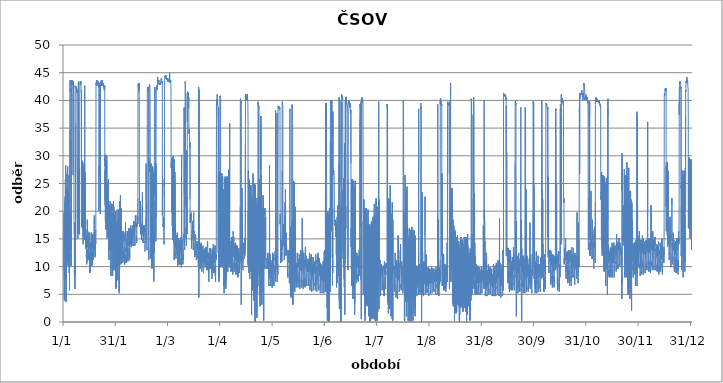
| Category | Series 0 |
|---|---|
| 2012-01-01 01:00:00 | 7.8 |
| 2012-01-01 02:00:00 | 19.76 |
| 2012-01-01 03:00:00 | 9.36 |
| 2012-01-01 04:00:00 | 14.04 |
| 2012-01-01 05:00:00 | 18.46 |
| 2012-01-01 06:00:00 | 3.9 |
| 2012-01-01 07:00:00 | 17.94 |
| 2012-01-01 08:00:00 | 9.88 |
| 2012-01-01 09:00:00 | 10.92 |
| 2012-01-01 10:00:00 | 18.72 |
| 2012-01-01 11:00:00 | 7.54 |
| 2012-01-01 12:00:00 | 17.68 |
| 2012-01-01 13:00:00 | 20.54 |
| 2012-01-01 14:00:00 | 12.22 |
| 2012-01-01 15:00:00 | 21.84 |
| 2012-01-01 16:00:00 | 17.16 |
| 2012-01-01 17:00:00 | 9.88 |
| 2012-01-01 18:00:00 | 22.62 |
| 2012-01-01 19:00:00 | 15.86 |
| 2012-01-01 20:00:00 | 10.66 |
| 2012-01-01 21:00:00 | 25.74 |
| 2012-01-01 22:00:00 | 14.56 |
| 2012-01-01 23:00:00 | 28.08 |
| 2012-01-02 | 28.34 |
| 2012-01-02 01:00:00 | 17.94 |
| 2012-01-02 02:00:00 | 21.58 |
| 2012-01-02 03:00:00 | 7.8 |
| 2012-01-02 04:00:00 | 13.78 |
| 2012-01-02 05:00:00 | 16.64 |
| 2012-01-02 06:00:00 | 3.64 |
| 2012-01-02 07:00:00 | 17.68 |
| 2012-01-02 08:00:00 | 12.48 |
| 2012-01-02 09:00:00 | 8.58 |
| 2012-01-02 10:00:00 | 21.06 |
| 2012-01-02 11:00:00 | 13 |
| 2012-01-02 12:00:00 | 12.22 |
| 2012-01-02 13:00:00 | 23.4 |
| 2012-01-02 14:00:00 | 14.04 |
| 2012-01-02 15:00:00 | 11.96 |
| 2012-01-02 16:00:00 | 22.36 |
| 2012-01-02 17:00:00 | 15.34 |
| 2012-01-02 18:00:00 | 10.92 |
| 2012-01-02 19:00:00 | 24.18 |
| 2012-01-02 20:00:00 | 15.34 |
| 2012-01-02 21:00:00 | 12.48 |
| 2012-01-02 22:00:00 | 26.78 |
| 2012-01-02 23:00:00 | 14.04 |
| 2012-01-03 | 13 |
| 2012-01-03 01:00:00 | 21.58 |
| 2012-01-03 02:00:00 | 11.44 |
| 2012-01-03 03:00:00 | 12.74 |
| 2012-01-03 04:00:00 | 28.08 |
| 2012-01-03 05:00:00 | 28.08 |
| 2012-01-03 06:00:00 | 14.56 |
| 2012-01-03 07:00:00 | 15.08 |
| 2012-01-03 08:00:00 | 21.84 |
| 2012-01-03 09:00:00 | 10.66 |
| 2012-01-03 10:00:00 | 14.3 |
| 2012-01-03 11:00:00 | 21.84 |
| 2012-01-03 12:00:00 | 10.14 |
| 2012-01-03 13:00:00 | 15.08 |
| 2012-01-03 14:00:00 | 22.36 |
| 2012-01-03 15:00:00 | 10.14 |
| 2012-01-03 16:00:00 | 14.04 |
| 2012-01-03 17:00:00 | 21.32 |
| 2012-01-03 18:00:00 | 11.44 |
| 2012-01-03 19:00:00 | 13.78 |
| 2012-01-03 20:00:00 | 23.66 |
| 2012-01-03 21:00:00 | 14.04 |
| 2012-01-03 22:00:00 | 14.3 |
| 2012-01-03 23:00:00 | 26.52 |
| 2012-01-04 | 12.48 |
| 2012-01-04 01:00:00 | 13.26 |
| 2012-01-04 02:00:00 | 19.24 |
| 2012-01-04 03:00:00 | 8.84 |
| 2012-01-04 04:00:00 | 11.7 |
| 2012-01-04 05:00:00 | 17.42 |
| 2012-01-04 06:00:00 | 5.72 |
| 2012-01-04 07:00:00 | 15.34 |
| 2012-01-04 08:00:00 | 17.94 |
| 2012-01-04 09:00:00 | 11.44 |
| 2012-01-04 10:00:00 | 34.58 |
| 2012-01-04 11:00:00 | 42.12 |
| 2012-01-04 12:00:00 | 42.38 |
| 2012-01-04 13:00:00 | 43.68 |
| 2012-01-04 14:00:00 | 42.38 |
| 2012-01-04 15:00:00 | 42.38 |
| 2012-01-04 16:00:00 | 41.86 |
| 2012-01-04 17:00:00 | 41.6 |
| 2012-01-04 18:00:00 | 42.12 |
| 2012-01-04 19:00:00 | 41.86 |
| 2012-01-04 20:00:00 | 41.86 |
| 2012-01-04 21:00:00 | 42.12 |
| 2012-01-04 22:00:00 | 41.86 |
| 2012-01-04 23:00:00 | 28.86 |
| 2012-01-05 | 23.92 |
| 2012-01-05 01:00:00 | 13 |
| 2012-01-05 02:00:00 | 16.12 |
| 2012-01-05 03:00:00 | 19.24 |
| 2012-01-05 04:00:00 | 10.14 |
| 2012-01-05 05:00:00 | 12.22 |
| 2012-01-05 06:00:00 | 20.28 |
| 2012-01-05 07:00:00 | 17.68 |
| 2012-01-05 08:00:00 | 33.02 |
| 2012-01-05 09:00:00 | 43.68 |
| 2012-01-05 10:00:00 | 43.42 |
| 2012-01-05 11:00:00 | 43.68 |
| 2012-01-05 12:00:00 | 43.42 |
| 2012-01-05 13:00:00 | 43.68 |
| 2012-01-05 14:00:00 | 43.16 |
| 2012-01-05 15:00:00 | 43.42 |
| 2012-01-05 16:00:00 | 43.68 |
| 2012-01-05 17:00:00 | 43.16 |
| 2012-01-05 18:00:00 | 43.42 |
| 2012-01-05 19:00:00 | 43.16 |
| 2012-01-05 20:00:00 | 43.16 |
| 2012-01-05 21:00:00 | 42.9 |
| 2012-01-05 22:00:00 | 43.42 |
| 2012-01-05 23:00:00 | 43.16 |
| 2012-01-06 | 43.16 |
| 2012-01-06 01:00:00 | 42.9 |
| 2012-01-06 02:00:00 | 43.16 |
| 2012-01-06 03:00:00 | 43.16 |
| 2012-01-06 04:00:00 | 42.9 |
| 2012-01-06 05:00:00 | 42.9 |
| 2012-01-06 06:00:00 | 42.38 |
| 2012-01-06 07:00:00 | 42.38 |
| 2012-01-06 08:00:00 | 30.94 |
| 2012-01-06 09:00:00 | 26.52 |
| 2012-01-06 10:00:00 | 41.08 |
| 2012-01-06 11:00:00 | 43.42 |
| 2012-01-06 12:00:00 | 42.12 |
| 2012-01-06 13:00:00 | 41.86 |
| 2012-01-06 14:00:00 | 29.38 |
| 2012-01-06 15:00:00 | 42.64 |
| 2012-01-06 16:00:00 | 42.38 |
| 2012-01-06 17:00:00 | 42.64 |
| 2012-01-06 18:00:00 | 42.38 |
| 2012-01-06 19:00:00 | 42.38 |
| 2012-01-06 20:00:00 | 36.14 |
| 2012-01-06 21:00:00 | 18.2 |
| 2012-01-06 22:00:00 | 15.86 |
| 2012-01-06 23:00:00 | 15.86 |
| 2012-01-07 | 15.6 |
| 2012-01-07 01:00:00 | 15.34 |
| 2012-01-07 02:00:00 | 15.08 |
| 2012-01-07 03:00:00 | 8.58 |
| 2012-01-07 04:00:00 | 16.9 |
| 2012-01-07 05:00:00 | 5.98 |
| 2012-01-07 06:00:00 | 17.94 |
| 2012-01-07 07:00:00 | 5.98 |
| 2012-01-07 08:00:00 | 17.68 |
| 2012-01-07 09:00:00 | 8.32 |
| 2012-01-07 10:00:00 | 17.16 |
| 2012-01-07 11:00:00 | 14.82 |
| 2012-01-07 12:00:00 | 14.82 |
| 2012-01-07 13:00:00 | 14.56 |
| 2012-01-07 14:00:00 | 14.82 |
| 2012-01-07 15:00:00 | 15.34 |
| 2012-01-07 16:00:00 | 15.34 |
| 2012-01-07 17:00:00 | 15.08 |
| 2012-01-07 18:00:00 | 14.82 |
| 2012-01-07 19:00:00 | 15.08 |
| 2012-01-07 20:00:00 | 14.82 |
| 2012-01-07 21:00:00 | 35.88 |
| 2012-01-07 22:00:00 | 42.64 |
| 2012-01-07 23:00:00 | 42.64 |
| 2012-01-08 | 42.64 |
| 2012-01-08 01:00:00 | 42.64 |
| 2012-01-08 02:00:00 | 42.64 |
| 2012-01-08 03:00:00 | 42.12 |
| 2012-01-08 04:00:00 | 42.38 |
| 2012-01-08 05:00:00 | 42.38 |
| 2012-01-08 06:00:00 | 42.38 |
| 2012-01-08 07:00:00 | 42.12 |
| 2012-01-08 08:00:00 | 42.12 |
| 2012-01-08 09:00:00 | 42.12 |
| 2012-01-08 10:00:00 | 41.86 |
| 2012-01-08 11:00:00 | 42.12 |
| 2012-01-08 12:00:00 | 41.86 |
| 2012-01-08 13:00:00 | 41.34 |
| 2012-01-08 14:00:00 | 41.6 |
| 2012-01-08 15:00:00 | 41.86 |
| 2012-01-08 16:00:00 | 41.6 |
| 2012-01-08 17:00:00 | 28.08 |
| 2012-01-08 18:00:00 | 27.3 |
| 2012-01-08 19:00:00 | 27.3 |
| 2012-01-08 20:00:00 | 26 |
| 2012-01-08 21:00:00 | 18.46 |
| 2012-01-08 22:00:00 | 27.3 |
| 2012-01-08 23:00:00 | 16.9 |
| 2012-01-09 | 23.66 |
| 2012-01-09 01:00:00 | 19.76 |
| 2012-01-09 02:00:00 | 15.08 |
| 2012-01-09 03:00:00 | 23.66 |
| 2012-01-09 04:00:00 | 18.72 |
| 2012-01-09 05:00:00 | 30.16 |
| 2012-01-09 06:00:00 | 41.86 |
| 2012-01-09 07:00:00 | 41.86 |
| 2012-01-09 08:00:00 | 42.12 |
| 2012-01-09 09:00:00 | 42.38 |
| 2012-01-09 10:00:00 | 43.42 |
| 2012-01-09 11:00:00 | 42.38 |
| 2012-01-09 12:00:00 | 41.86 |
| 2012-01-09 13:00:00 | 17.16 |
| 2012-01-09 14:00:00 | 16.12 |
| 2012-01-09 15:00:00 | 26.52 |
| 2012-01-09 16:00:00 | 16.12 |
| 2012-01-09 17:00:00 | 15.86 |
| 2012-01-09 18:00:00 | 27.3 |
| 2012-01-09 19:00:00 | 16.38 |
| 2012-01-09 20:00:00 | 22.36 |
| 2012-01-09 21:00:00 | 21.84 |
| 2012-01-09 22:00:00 | 21.32 |
| 2012-01-09 23:00:00 | 23.4 |
| 2012-01-10 | 16.12 |
| 2012-01-10 01:00:00 | 27.56 |
| 2012-01-10 02:00:00 | 15.86 |
| 2012-01-10 03:00:00 | 27.82 |
| 2012-01-10 04:00:00 | 27.82 |
| 2012-01-10 05:00:00 | 39.78 |
| 2012-01-10 06:00:00 | 42.38 |
| 2012-01-10 07:00:00 | 42.64 |
| 2012-01-10 08:00:00 | 42.64 |
| 2012-01-10 09:00:00 | 43.16 |
| 2012-01-10 10:00:00 | 43.16 |
| 2012-01-10 11:00:00 | 43.16 |
| 2012-01-10 12:00:00 | 43.42 |
| 2012-01-10 13:00:00 | 43.42 |
| 2012-01-10 14:00:00 | 42.9 |
| 2012-01-10 15:00:00 | 43.42 |
| 2012-01-10 16:00:00 | 43.16 |
| 2012-01-10 17:00:00 | 42.9 |
| 2012-01-10 18:00:00 | 43.16 |
| 2012-01-10 19:00:00 | 43.16 |
| 2012-01-10 20:00:00 | 43.16 |
| 2012-01-10 21:00:00 | 43.16 |
| 2012-01-10 22:00:00 | 43.42 |
| 2012-01-10 23:00:00 | 42.9 |
| 2012-01-11 | 42.64 |
| 2012-01-11 01:00:00 | 42.38 |
| 2012-01-11 02:00:00 | 42.12 |
| 2012-01-11 03:00:00 | 42.12 |
| 2012-01-11 04:00:00 | 41.34 |
| 2012-01-11 05:00:00 | 41.86 |
| 2012-01-11 06:00:00 | 34.06 |
| 2012-01-11 07:00:00 | 21.32 |
| 2012-01-11 08:00:00 | 17.16 |
| 2012-01-11 09:00:00 | 26.78 |
| 2012-01-11 10:00:00 | 20.02 |
| 2012-01-11 11:00:00 | 17.68 |
| 2012-01-11 12:00:00 | 29.12 |
| 2012-01-11 13:00:00 | 17.42 |
| 2012-01-11 14:00:00 | 17.42 |
| 2012-01-11 15:00:00 | 28.34 |
| 2012-01-11 16:00:00 | 17.94 |
| 2012-01-11 17:00:00 | 16.9 |
| 2012-01-11 18:00:00 | 24.96 |
| 2012-01-11 19:00:00 | 22.36 |
| 2012-01-11 20:00:00 | 26.78 |
| 2012-01-11 21:00:00 | 20.28 |
| 2012-01-11 22:00:00 | 28.08 |
| 2012-01-11 23:00:00 | 17.68 |
| 2012-01-12 | 28.6 |
| 2012-01-12 01:00:00 | 28.6 |
| 2012-01-12 02:00:00 | 19.24 |
| 2012-01-12 03:00:00 | 25.74 |
| 2012-01-12 04:00:00 | 15.08 |
| 2012-01-12 05:00:00 | 14.04 |
| 2012-01-12 06:00:00 | 17.42 |
| 2012-01-12 07:00:00 | 21.06 |
| 2012-01-12 08:00:00 | 19.5 |
| 2012-01-12 09:00:00 | 15.86 |
| 2012-01-12 10:00:00 | 16.9 |
| 2012-01-12 11:00:00 | 27.04 |
| 2012-01-12 12:00:00 | 15.6 |
| 2012-01-12 13:00:00 | 15.86 |
| 2012-01-12 14:00:00 | 27.56 |
| 2012-01-12 15:00:00 | 15.86 |
| 2012-01-12 16:00:00 | 15.34 |
| 2012-01-12 17:00:00 | 22.1 |
| 2012-01-12 18:00:00 | 23.4 |
| 2012-01-12 19:00:00 | 15.34 |
| 2012-01-12 20:00:00 | 16.38 |
| 2012-01-12 21:00:00 | 28.86 |
| 2012-01-12 22:00:00 | 23.4 |
| 2012-01-12 23:00:00 | 15.34 |
| 2012-01-13 | 17.94 |
| 2012-01-13 01:00:00 | 28.08 |
| 2012-01-13 02:00:00 | 42.64 |
| 2012-01-13 03:00:00 | 42.64 |
| 2012-01-13 04:00:00 | 42.38 |
| 2012-01-13 05:00:00 | 17.94 |
| 2012-01-13 06:00:00 | 14.82 |
| 2012-01-13 07:00:00 | 19.5 |
| 2012-01-13 08:00:00 | 20.8 |
| 2012-01-13 09:00:00 | 15.6 |
| 2012-01-13 10:00:00 | 15.34 |
| 2012-01-13 11:00:00 | 15.86 |
| 2012-01-13 12:00:00 | 27.04 |
| 2012-01-13 13:00:00 | 15.08 |
| 2012-01-13 14:00:00 | 13.26 |
| 2012-01-13 15:00:00 | 15.08 |
| 2012-01-13 16:00:00 | 13.78 |
| 2012-01-13 17:00:00 | 15.6 |
| 2012-01-13 18:00:00 | 15.34 |
| 2012-01-13 19:00:00 | 15.08 |
| 2012-01-13 20:00:00 | 14.56 |
| 2012-01-13 21:00:00 | 14.82 |
| 2012-01-13 22:00:00 | 13.52 |
| 2012-01-13 23:00:00 | 15.34 |
| 2012-01-14 | 14.56 |
| 2012-01-14 01:00:00 | 13.26 |
| 2012-01-14 02:00:00 | 11.7 |
| 2012-01-14 03:00:00 | 12.74 |
| 2012-01-14 04:00:00 | 12.48 |
| 2012-01-14 05:00:00 | 10.4 |
| 2012-01-14 06:00:00 | 13 |
| 2012-01-14 07:00:00 | 10.66 |
| 2012-01-14 08:00:00 | 13 |
| 2012-01-14 09:00:00 | 13.26 |
| 2012-01-14 10:00:00 | 14.3 |
| 2012-01-14 11:00:00 | 13.78 |
| 2012-01-14 12:00:00 | 16.64 |
| 2012-01-14 13:00:00 | 16.38 |
| 2012-01-14 14:00:00 | 15.34 |
| 2012-01-14 15:00:00 | 18.46 |
| 2012-01-14 16:00:00 | 17.68 |
| 2012-01-14 17:00:00 | 15.6 |
| 2012-01-14 18:00:00 | 15.6 |
| 2012-01-14 19:00:00 | 13.52 |
| 2012-01-14 20:00:00 | 16.38 |
| 2012-01-14 21:00:00 | 14.82 |
| 2012-01-14 22:00:00 | 15.08 |
| 2012-01-14 23:00:00 | 14.04 |
| 2012-01-15 | 14.04 |
| 2012-01-15 01:00:00 | 13.26 |
| 2012-01-15 02:00:00 | 11.44 |
| 2012-01-15 03:00:00 | 13.26 |
| 2012-01-15 04:00:00 | 11.44 |
| 2012-01-15 05:00:00 | 11.96 |
| 2012-01-15 06:00:00 | 11.18 |
| 2012-01-15 07:00:00 | 11.44 |
| 2012-01-15 08:00:00 | 11.96 |
| 2012-01-15 09:00:00 | 11.7 |
| 2012-01-15 10:00:00 | 14.04 |
| 2012-01-15 11:00:00 | 14.56 |
| 2012-01-15 12:00:00 | 14.56 |
| 2012-01-15 13:00:00 | 16.12 |
| 2012-01-15 14:00:00 | 14.56 |
| 2012-01-15 15:00:00 | 15.08 |
| 2012-01-15 16:00:00 | 14.3 |
| 2012-01-15 17:00:00 | 14.04 |
| 2012-01-15 18:00:00 | 13.26 |
| 2012-01-15 19:00:00 | 13.26 |
| 2012-01-15 20:00:00 | 14.56 |
| 2012-01-15 21:00:00 | 16.12 |
| 2012-01-15 22:00:00 | 14.56 |
| 2012-01-15 23:00:00 | 14.3 |
| 2012-01-16 | 14.04 |
| 2012-01-16 01:00:00 | 13.26 |
| 2012-01-16 02:00:00 | 9.88 |
| 2012-01-16 03:00:00 | 12.48 |
| 2012-01-16 04:00:00 | 9.1 |
| 2012-01-16 05:00:00 | 11.7 |
| 2012-01-16 06:00:00 | 8.84 |
| 2012-01-16 07:00:00 | 12.22 |
| 2012-01-16 08:00:00 | 9.88 |
| 2012-01-16 09:00:00 | 14.3 |
| 2012-01-16 10:00:00 | 13.52 |
| 2012-01-16 11:00:00 | 11.96 |
| 2012-01-16 12:00:00 | 14.04 |
| 2012-01-16 13:00:00 | 14.04 |
| 2012-01-16 14:00:00 | 14.3 |
| 2012-01-16 15:00:00 | 14.04 |
| 2012-01-16 16:00:00 | 14.04 |
| 2012-01-16 17:00:00 | 14.04 |
| 2012-01-16 18:00:00 | 13.78 |
| 2012-01-16 19:00:00 | 13.78 |
| 2012-01-16 20:00:00 | 14.04 |
| 2012-01-16 21:00:00 | 13.52 |
| 2012-01-16 22:00:00 | 16.12 |
| 2012-01-16 23:00:00 | 13.78 |
| 2012-01-17 | 13.78 |
| 2012-01-17 01:00:00 | 13.78 |
| 2012-01-17 02:00:00 | 13 |
| 2012-01-17 03:00:00 | 10.66 |
| 2012-01-17 04:00:00 | 12.74 |
| 2012-01-17 05:00:00 | 10.14 |
| 2012-01-17 06:00:00 | 12.74 |
| 2012-01-17 07:00:00 | 10.4 |
| 2012-01-17 08:00:00 | 13.78 |
| 2012-01-17 09:00:00 | 13.52 |
| 2012-01-17 10:00:00 | 13.26 |
| 2012-01-17 11:00:00 | 14.04 |
| 2012-01-17 12:00:00 | 13.26 |
| 2012-01-17 13:00:00 | 13.78 |
| 2012-01-17 14:00:00 | 15.08 |
| 2012-01-17 15:00:00 | 15.08 |
| 2012-01-17 16:00:00 | 13.52 |
| 2012-01-17 17:00:00 | 15.86 |
| 2012-01-17 18:00:00 | 14.3 |
| 2012-01-17 19:00:00 | 13.52 |
| 2012-01-17 20:00:00 | 15.86 |
| 2012-01-17 21:00:00 | 15.08 |
| 2012-01-17 22:00:00 | 15.08 |
| 2012-01-17 23:00:00 | 15.08 |
| 2012-01-18 | 14.3 |
| 2012-01-18 01:00:00 | 13.78 |
| 2012-01-18 02:00:00 | 13.26 |
| 2012-01-18 03:00:00 | 12.74 |
| 2012-01-18 04:00:00 | 11.18 |
| 2012-01-18 05:00:00 | 13.52 |
| 2012-01-18 06:00:00 | 13 |
| 2012-01-18 07:00:00 | 12.22 |
| 2012-01-18 08:00:00 | 14.82 |
| 2012-01-18 09:00:00 | 14.3 |
| 2012-01-18 10:00:00 | 15.08 |
| 2012-01-18 11:00:00 | 14.04 |
| 2012-01-18 12:00:00 | 12.74 |
| 2012-01-18 13:00:00 | 16.12 |
| 2012-01-18 14:00:00 | 15.86 |
| 2012-01-18 15:00:00 | 18.2 |
| 2012-01-18 16:00:00 | 19.24 |
| 2012-01-18 17:00:00 | 17.68 |
| 2012-01-18 18:00:00 | 16.64 |
| 2012-01-18 19:00:00 | 15.86 |
| 2012-01-18 20:00:00 | 15.08 |
| 2012-01-18 21:00:00 | 15.86 |
| 2012-01-18 22:00:00 | 15.86 |
| 2012-01-18 23:00:00 | 15.6 |
| 2012-01-19 | 13.78 |
| 2012-01-19 01:00:00 | 14.04 |
| 2012-01-19 02:00:00 | 13.52 |
| 2012-01-19 03:00:00 | 13.78 |
| 2012-01-19 04:00:00 | 11.7 |
| 2012-01-19 05:00:00 | 12.48 |
| 2012-01-19 06:00:00 | 13.52 |
| 2012-01-19 07:00:00 | 14.04 |
| 2012-01-19 08:00:00 | 13.52 |
| 2012-01-19 09:00:00 | 14.82 |
| 2012-01-19 10:00:00 | 14.56 |
| 2012-01-19 11:00:00 | 14.56 |
| 2012-01-19 12:00:00 | 14.04 |
| 2012-01-19 13:00:00 | 16.64 |
| 2012-01-19 14:00:00 | 19.5 |
| 2012-01-19 15:00:00 | 34.84 |
| 2012-01-19 16:00:00 | 42.9 |
| 2012-01-19 17:00:00 | 43.16 |
| 2012-01-19 18:00:00 | 42.9 |
| 2012-01-19 19:00:00 | 42.9 |
| 2012-01-19 20:00:00 | 43.16 |
| 2012-01-19 21:00:00 | 42.9 |
| 2012-01-19 22:00:00 | 43.16 |
| 2012-01-19 23:00:00 | 43.16 |
| 2012-01-20 | 43.42 |
| 2012-01-20 01:00:00 | 43.16 |
| 2012-01-20 02:00:00 | 43.16 |
| 2012-01-20 03:00:00 | 43.16 |
| 2012-01-20 04:00:00 | 42.64 |
| 2012-01-20 05:00:00 | 43.68 |
| 2012-01-20 06:00:00 | 43.42 |
| 2012-01-20 07:00:00 | 43.42 |
| 2012-01-20 08:00:00 | 43.42 |
| 2012-01-20 09:00:00 | 43.16 |
| 2012-01-20 10:00:00 | 43.16 |
| 2012-01-20 11:00:00 | 43.16 |
| 2012-01-20 12:00:00 | 42.9 |
| 2012-01-20 13:00:00 | 43.16 |
| 2012-01-20 14:00:00 | 42.9 |
| 2012-01-20 15:00:00 | 43.16 |
| 2012-01-20 16:00:00 | 43.16 |
| 2012-01-20 17:00:00 | 43.42 |
| 2012-01-20 18:00:00 | 43.16 |
| 2012-01-20 19:00:00 | 43.42 |
| 2012-01-20 20:00:00 | 43.42 |
| 2012-01-20 21:00:00 | 42.9 |
| 2012-01-20 22:00:00 | 43.16 |
| 2012-01-20 23:00:00 | 42.9 |
| 2012-01-21 | 42.9 |
| 2012-01-21 01:00:00 | 42.64 |
| 2012-01-21 02:00:00 | 42.9 |
| 2012-01-21 03:00:00 | 42.9 |
| 2012-01-21 04:00:00 | 42.38 |
| 2012-01-21 05:00:00 | 42.64 |
| 2012-01-21 06:00:00 | 42.64 |
| 2012-01-21 07:00:00 | 42.38 |
| 2012-01-21 08:00:00 | 42.12 |
| 2012-01-21 09:00:00 | 20.02 |
| 2012-01-21 10:00:00 | 28.08 |
| 2012-01-21 11:00:00 | 28.08 |
| 2012-01-21 12:00:00 | 27.56 |
| 2012-01-21 13:00:00 | 28.08 |
| 2012-01-21 14:00:00 | 30.94 |
| 2012-01-21 15:00:00 | 42.38 |
| 2012-01-21 16:00:00 | 42.9 |
| 2012-01-21 17:00:00 | 43.16 |
| 2012-01-21 18:00:00 | 43.16 |
| 2012-01-21 19:00:00 | 43.16 |
| 2012-01-21 20:00:00 | 42.9 |
| 2012-01-21 21:00:00 | 32.24 |
| 2012-01-21 22:00:00 | 26.52 |
| 2012-01-21 23:00:00 | 28.86 |
| 2012-01-22 | 28.86 |
| 2012-01-22 01:00:00 | 28.86 |
| 2012-01-22 02:00:00 | 27.82 |
| 2012-01-22 03:00:00 | 26.52 |
| 2012-01-22 04:00:00 | 27.56 |
| 2012-01-22 05:00:00 | 19.5 |
| 2012-01-22 06:00:00 | 30.94 |
| 2012-01-22 07:00:00 | 42.9 |
| 2012-01-22 08:00:00 | 42.64 |
| 2012-01-22 09:00:00 | 42.9 |
| 2012-01-22 10:00:00 | 42.9 |
| 2012-01-22 11:00:00 | 43.16 |
| 2012-01-22 12:00:00 | 43.42 |
| 2012-01-22 13:00:00 | 43.16 |
| 2012-01-22 14:00:00 | 43.16 |
| 2012-01-22 15:00:00 | 43.16 |
| 2012-01-22 16:00:00 | 43.16 |
| 2012-01-22 17:00:00 | 43.42 |
| 2012-01-22 18:00:00 | 43.42 |
| 2012-01-22 19:00:00 | 43.68 |
| 2012-01-22 20:00:00 | 42.9 |
| 2012-01-22 21:00:00 | 43.42 |
| 2012-01-22 22:00:00 | 43.16 |
| 2012-01-22 23:00:00 | 43.42 |
| 2012-01-23 | 42.9 |
| 2012-01-23 01:00:00 | 42.9 |
| 2012-01-23 02:00:00 | 43.16 |
| 2012-01-23 03:00:00 | 42.64 |
| 2012-01-23 04:00:00 | 42.64 |
| 2012-01-23 05:00:00 | 42.64 |
| 2012-01-23 06:00:00 | 43.68 |
| 2012-01-23 07:00:00 | 43.16 |
| 2012-01-23 08:00:00 | 42.9 |
| 2012-01-23 09:00:00 | 42.64 |
| 2012-01-23 10:00:00 | 42.9 |
| 2012-01-23 11:00:00 | 43.68 |
| 2012-01-23 12:00:00 | 43.16 |
| 2012-01-23 13:00:00 | 42.9 |
| 2012-01-23 14:00:00 | 43.16 |
| 2012-01-23 15:00:00 | 42.9 |
| 2012-01-23 16:00:00 | 42.64 |
| 2012-01-23 17:00:00 | 42.9 |
| 2012-01-23 18:00:00 | 42.9 |
| 2012-01-23 19:00:00 | 42.64 |
| 2012-01-23 20:00:00 | 42.64 |
| 2012-01-23 21:00:00 | 42.9 |
| 2012-01-23 22:00:00 | 42.64 |
| 2012-01-23 23:00:00 | 42.64 |
| 2012-01-24 | 42.9 |
| 2012-01-24 01:00:00 | 42.9 |
| 2012-01-24 02:00:00 | 42.64 |
| 2012-01-24 03:00:00 | 42.64 |
| 2012-01-24 04:00:00 | 42.38 |
| 2012-01-24 05:00:00 | 42.64 |
| 2012-01-24 06:00:00 | 42.38 |
| 2012-01-24 07:00:00 | 42.38 |
| 2012-01-24 08:00:00 | 42.38 |
| 2012-01-24 09:00:00 | 42.12 |
| 2012-01-24 10:00:00 | 41.86 |
| 2012-01-24 11:00:00 | 41.86 |
| 2012-01-24 12:00:00 | 41.86 |
| 2012-01-24 13:00:00 | 41.86 |
| 2012-01-24 14:00:00 | 42.64 |
| 2012-01-24 15:00:00 | 42.64 |
| 2012-01-24 16:00:00 | 42.12 |
| 2012-01-24 17:00:00 | 42.64 |
| 2012-01-24 18:00:00 | 42.38 |
| 2012-01-24 19:00:00 | 30.94 |
| 2012-01-24 20:00:00 | 28.08 |
| 2012-01-24 21:00:00 | 30.16 |
| 2012-01-24 22:00:00 | 29.64 |
| 2012-01-24 23:00:00 | 22.1 |
| 2012-01-25 | 27.3 |
| 2012-01-25 01:00:00 | 21.06 |
| 2012-01-25 02:00:00 | 27.82 |
| 2012-01-25 03:00:00 | 18.46 |
| 2012-01-25 04:00:00 | 18.2 |
| 2012-01-25 05:00:00 | 27.82 |
| 2012-01-25 06:00:00 | 20.28 |
| 2012-01-25 07:00:00 | 17.68 |
| 2012-01-25 08:00:00 | 30.16 |
| 2012-01-25 09:00:00 | 18.72 |
| 2012-01-25 10:00:00 | 19.5 |
| 2012-01-25 11:00:00 | 29.38 |
| 2012-01-25 12:00:00 | 16.64 |
| 2012-01-25 13:00:00 | 29.9 |
| 2012-01-25 14:00:00 | 19.24 |
| 2012-01-25 15:00:00 | 19.5 |
| 2012-01-25 16:00:00 | 29.64 |
| 2012-01-25 17:00:00 | 18.2 |
| 2012-01-25 18:00:00 | 18.2 |
| 2012-01-25 19:00:00 | 29.12 |
| 2012-01-25 20:00:00 | 18.46 |
| 2012-01-25 21:00:00 | 18.72 |
| 2012-01-25 22:00:00 | 29.9 |
| 2012-01-25 23:00:00 | 18.46 |
| 2012-01-26 | 19.24 |
| 2012-01-26 01:00:00 | 25.22 |
| 2012-01-26 02:00:00 | 19.76 |
| 2012-01-26 03:00:00 | 15.08 |
| 2012-01-26 04:00:00 | 15.08 |
| 2012-01-26 05:00:00 | 17.16 |
| 2012-01-26 06:00:00 | 20.02 |
| 2012-01-26 07:00:00 | 21.06 |
| 2012-01-26 08:00:00 | 16.9 |
| 2012-01-26 09:00:00 | 17.42 |
| 2012-01-26 10:00:00 | 18.46 |
| 2012-01-26 11:00:00 | 23.66 |
| 2012-01-26 12:00:00 | 22.1 |
| 2012-01-26 13:00:00 | 16.64 |
| 2012-01-26 14:00:00 | 16.38 |
| 2012-01-26 15:00:00 | 20.02 |
| 2012-01-26 16:00:00 | 22.62 |
| 2012-01-26 17:00:00 | 20.8 |
| 2012-01-26 18:00:00 | 15.86 |
| 2012-01-26 19:00:00 | 16.64 |
| 2012-01-26 20:00:00 | 21.06 |
| 2012-01-26 21:00:00 | 25.74 |
| 2012-01-26 22:00:00 | 17.68 |
| 2012-01-26 23:00:00 | 16.64 |
| 2012-01-27 | 19.24 |
| 2012-01-27 01:00:00 | 20.8 |
| 2012-01-27 02:00:00 | 19.24 |
| 2012-01-27 03:00:00 | 12.22 |
| 2012-01-27 04:00:00 | 11.18 |
| 2012-01-27 05:00:00 | 16.38 |
| 2012-01-27 06:00:00 | 17.68 |
| 2012-01-27 07:00:00 | 17.68 |
| 2012-01-27 08:00:00 | 13 |
| 2012-01-27 09:00:00 | 15.08 |
| 2012-01-27 10:00:00 | 19.24 |
| 2012-01-27 11:00:00 | 21.06 |
| 2012-01-27 12:00:00 | 18.46 |
| 2012-01-27 13:00:00 | 13.78 |
| 2012-01-27 14:00:00 | 13.26 |
| 2012-01-27 15:00:00 | 18.72 |
| 2012-01-27 16:00:00 | 20.54 |
| 2012-01-27 17:00:00 | 18.46 |
| 2012-01-27 18:00:00 | 15.08 |
| 2012-01-27 19:00:00 | 13.78 |
| 2012-01-27 20:00:00 | 19.24 |
| 2012-01-27 21:00:00 | 21.84 |
| 2012-01-27 22:00:00 | 16.64 |
| 2012-01-27 23:00:00 | 14.04 |
| 2012-01-28 | 14.3 |
| 2012-01-28 01:00:00 | 19.5 |
| 2012-01-28 02:00:00 | 18.2 |
| 2012-01-28 03:00:00 | 12.22 |
| 2012-01-28 04:00:00 | 9.62 |
| 2012-01-28 05:00:00 | 15.34 |
| 2012-01-28 06:00:00 | 16.64 |
| 2012-01-28 07:00:00 | 12.74 |
| 2012-01-28 08:00:00 | 8.32 |
| 2012-01-28 09:00:00 | 16.12 |
| 2012-01-28 10:00:00 | 19.24 |
| 2012-01-28 11:00:00 | 19.24 |
| 2012-01-28 12:00:00 | 15.08 |
| 2012-01-28 13:00:00 | 15.08 |
| 2012-01-28 14:00:00 | 19.24 |
| 2012-01-28 15:00:00 | 21.32 |
| 2012-01-28 16:00:00 | 19.5 |
| 2012-01-28 17:00:00 | 14.56 |
| 2012-01-28 18:00:00 | 13.78 |
| 2012-01-28 19:00:00 | 16.12 |
| 2012-01-28 20:00:00 | 20.28 |
| 2012-01-28 21:00:00 | 21.32 |
| 2012-01-28 22:00:00 | 17.16 |
| 2012-01-28 23:00:00 | 14.04 |
| 2012-01-29 | 13 |
| 2012-01-29 01:00:00 | 18.2 |
| 2012-01-29 02:00:00 | 17.94 |
| 2012-01-29 03:00:00 | 15.34 |
| 2012-01-29 04:00:00 | 8.32 |
| 2012-01-29 05:00:00 | 13.78 |
| 2012-01-29 06:00:00 | 16.9 |
| 2012-01-29 07:00:00 | 14.56 |
| 2012-01-29 08:00:00 | 8.32 |
| 2012-01-29 09:00:00 | 15.34 |
| 2012-01-29 10:00:00 | 19.5 |
| 2012-01-29 11:00:00 | 18.72 |
| 2012-01-29 12:00:00 | 14.82 |
| 2012-01-29 13:00:00 | 15.86 |
| 2012-01-29 14:00:00 | 21.06 |
| 2012-01-29 15:00:00 | 21.32 |
| 2012-01-29 16:00:00 | 17.94 |
| 2012-01-29 17:00:00 | 13.78 |
| 2012-01-29 18:00:00 | 13.78 |
| 2012-01-29 19:00:00 | 19.24 |
| 2012-01-29 20:00:00 | 21.84 |
| 2012-01-29 21:00:00 | 18.2 |
| 2012-01-29 22:00:00 | 15.86 |
| 2012-01-29 23:00:00 | 15.6 |
| 2012-01-30 | 20.8 |
| 2012-01-30 01:00:00 | 18.46 |
| 2012-01-30 02:00:00 | 11.44 |
| 2012-01-30 03:00:00 | 9.36 |
| 2012-01-30 04:00:00 | 16.9 |
| 2012-01-30 05:00:00 | 16.38 |
| 2012-01-30 06:00:00 | 9.36 |
| 2012-01-30 07:00:00 | 12.48 |
| 2012-01-30 08:00:00 | 17.42 |
| 2012-01-30 09:00:00 | 19.24 |
| 2012-01-30 10:00:00 | 13.78 |
| 2012-01-30 11:00:00 | 11.18 |
| 2012-01-30 12:00:00 | 16.9 |
| 2012-01-30 13:00:00 | 17.94 |
| 2012-01-30 14:00:00 | 18.2 |
| 2012-01-30 15:00:00 | 11.96 |
| 2012-01-30 16:00:00 | 11.44 |
| 2012-01-30 17:00:00 | 17.94 |
| 2012-01-30 18:00:00 | 18.2 |
| 2012-01-30 19:00:00 | 14.82 |
| 2012-01-30 20:00:00 | 11.7 |
| 2012-01-30 21:00:00 | 14.56 |
| 2012-01-30 22:00:00 | 20.02 |
| 2012-01-30 23:00:00 | 20.02 |
| 2012-01-31 | 13.26 |
| 2012-01-31 01:00:00 | 9.36 |
| 2012-01-31 02:00:00 | 16.38 |
| 2012-01-31 03:00:00 | 15.86 |
| 2012-01-31 04:00:00 | 5.98 |
| 2012-01-31 05:00:00 | 13.52 |
| 2012-01-31 06:00:00 | 15.86 |
| 2012-01-31 07:00:00 | 6.24 |
| 2012-01-31 08:00:00 | 14.04 |
| 2012-01-31 09:00:00 | 17.94 |
| 2012-01-31 10:00:00 | 15.6 |
| 2012-01-31 11:00:00 | 9.88 |
| 2012-01-31 12:00:00 | 14.56 |
| 2012-01-31 13:00:00 | 17.68 |
| 2012-01-31 14:00:00 | 17.16 |
| 2012-01-31 15:00:00 | 8.58 |
| 2012-01-31 16:00:00 | 13.26 |
| 2012-01-31 17:00:00 | 17.68 |
| 2012-01-31 18:00:00 | 17.94 |
| 2012-01-31 19:00:00 | 9.62 |
| 2012-01-31 20:00:00 | 12.48 |
| 2012-01-31 21:00:00 | 19.5 |
| 2012-01-31 22:00:00 | 20.28 |
| 2012-01-31 23:00:00 | 13.52 |
| 2012-02-01 | 11.18 |
| 2012-02-01 01:00:00 | 16.38 |
| 2012-02-01 02:00:00 | 16.38 |
| 2012-02-01 03:00:00 | 9.62 |
| 2012-02-01 04:00:00 | 10.14 |
| 2012-02-01 05:00:00 | 15.6 |
| 2012-02-01 06:00:00 | 14.3 |
| 2012-02-01 07:00:00 | 7.54 |
| 2012-02-01 08:00:00 | 16.64 |
| 2012-02-01 09:00:00 | 18.46 |
| 2012-02-01 10:00:00 | 10.4 |
| 2012-02-01 11:00:00 | 11.96 |
| 2012-02-01 12:00:00 | 17.68 |
| 2012-02-01 13:00:00 | 17.68 |
| 2012-02-01 14:00:00 | 10.66 |
| 2012-02-01 15:00:00 | 11.44 |
| 2012-02-01 16:00:00 | 17.68 |
| 2012-02-01 17:00:00 | 17.68 |
| 2012-02-01 18:00:00 | 11.18 |
| 2012-02-01 19:00:00 | 10.4 |
| 2012-02-01 20:00:00 | 18.46 |
| 2012-02-01 21:00:00 | 20.28 |
| 2012-02-01 22:00:00 | 15.86 |
| 2012-02-01 23:00:00 | 13 |
| 2012-02-02 | 15.08 |
| 2012-02-02 01:00:00 | 17.68 |
| 2012-02-02 02:00:00 | 15.6 |
| 2012-02-02 03:00:00 | 5.2 |
| 2012-02-02 04:00:00 | 15.86 |
| 2012-02-02 05:00:00 | 14.3 |
| 2012-02-02 06:00:00 | 5.72 |
| 2012-02-02 07:00:00 | 15.86 |
| 2012-02-02 08:00:00 | 13.26 |
| 2012-02-02 09:00:00 | 9.36 |
| 2012-02-02 10:00:00 | 16.38 |
| 2012-02-02 11:00:00 | 21.84 |
| 2012-02-02 12:00:00 | 20.8 |
| 2012-02-02 13:00:00 | 14.3 |
| 2012-02-02 14:00:00 | 13.26 |
| 2012-02-02 15:00:00 | 16.9 |
| 2012-02-02 16:00:00 | 19.76 |
| 2012-02-02 17:00:00 | 19.24 |
| 2012-02-02 18:00:00 | 13 |
| 2012-02-02 19:00:00 | 13.78 |
| 2012-02-02 20:00:00 | 18.2 |
| 2012-02-02 21:00:00 | 22.88 |
| 2012-02-02 22:00:00 | 18.2 |
| 2012-02-02 23:00:00 | 15.08 |
| 2012-02-03 | 15.34 |
| 2012-02-03 01:00:00 | 19.76 |
| 2012-02-03 02:00:00 | 18.2 |
| 2012-02-03 03:00:00 | 10.66 |
| 2012-02-03 04:00:00 | 10.4 |
| 2012-02-03 05:00:00 | 16.38 |
| 2012-02-03 06:00:00 | 18.98 |
| 2012-02-03 07:00:00 | 11.44 |
| 2012-02-03 08:00:00 | 10.66 |
| 2012-02-03 09:00:00 | 18.72 |
| 2012-02-03 10:00:00 | 20.54 |
| 2012-02-03 11:00:00 | 15.08 |
| 2012-02-03 12:00:00 | 14.56 |
| 2012-02-03 13:00:00 | 13.78 |
| 2012-02-03 14:00:00 | 14.04 |
| 2012-02-03 15:00:00 | 14.04 |
| 2012-02-03 16:00:00 | 14.04 |
| 2012-02-03 17:00:00 | 14.82 |
| 2012-02-03 18:00:00 | 14.04 |
| 2012-02-03 19:00:00 | 14.3 |
| 2012-02-03 20:00:00 | 14.04 |
| 2012-02-03 21:00:00 | 16.38 |
| 2012-02-03 22:00:00 | 14.82 |
| 2012-02-03 23:00:00 | 14.04 |
| 2012-02-04 | 14.82 |
| 2012-02-04 01:00:00 | 14.04 |
| 2012-02-04 02:00:00 | 14.04 |
| 2012-02-04 03:00:00 | 13 |
| 2012-02-04 04:00:00 | 10.66 |
| 2012-02-04 05:00:00 | 12.48 |
| 2012-02-04 06:00:00 | 11.44 |
| 2012-02-04 07:00:00 | 10.92 |
| 2012-02-04 08:00:00 | 12.74 |
| 2012-02-04 09:00:00 | 11.7 |
| 2012-02-04 10:00:00 | 13.78 |
| 2012-02-04 11:00:00 | 14.56 |
| 2012-02-04 12:00:00 | 16.38 |
| 2012-02-04 13:00:00 | 16.12 |
| 2012-02-04 14:00:00 | 15.86 |
| 2012-02-04 15:00:00 | 15.6 |
| 2012-02-04 16:00:00 | 15.34 |
| 2012-02-04 17:00:00 | 15.6 |
| 2012-02-04 18:00:00 | 14.56 |
| 2012-02-04 19:00:00 | 15.86 |
| 2012-02-04 20:00:00 | 15.08 |
| 2012-02-04 21:00:00 | 14.82 |
| 2012-02-04 22:00:00 | 15.6 |
| 2012-02-04 23:00:00 | 15.08 |
| 2012-02-05 | 14.56 |
| 2012-02-05 01:00:00 | 13.78 |
| 2012-02-05 02:00:00 | 12.22 |
| 2012-02-05 03:00:00 | 13 |
| 2012-02-05 04:00:00 | 12.74 |
| 2012-02-05 05:00:00 | 10.4 |
| 2012-02-05 06:00:00 | 12.48 |
| 2012-02-05 07:00:00 | 11.44 |
| 2012-02-05 08:00:00 | 10.4 |
| 2012-02-05 09:00:00 | 13.52 |
| 2012-02-05 10:00:00 | 13.52 |
| 2012-02-05 11:00:00 | 14.56 |
| 2012-02-05 12:00:00 | 14.82 |
| 2012-02-05 13:00:00 | 16.12 |
| 2012-02-05 14:00:00 | 15.86 |
| 2012-02-05 15:00:00 | 15.86 |
| 2012-02-05 16:00:00 | 15.34 |
| 2012-02-05 17:00:00 | 14.82 |
| 2012-02-05 18:00:00 | 14.56 |
| 2012-02-05 19:00:00 | 14.56 |
| 2012-02-05 20:00:00 | 17.94 |
| 2012-02-05 21:00:00 | 15.86 |
| 2012-02-05 22:00:00 | 15.34 |
| 2012-02-05 23:00:00 | 15.86 |
| 2012-02-06 | 15.08 |
| 2012-02-06 01:00:00 | 12.74 |
| 2012-02-06 02:00:00 | 13.26 |
| 2012-02-06 03:00:00 | 12.48 |
| 2012-02-06 04:00:00 | 10.66 |
| 2012-02-06 05:00:00 | 10.66 |
| 2012-02-06 06:00:00 | 12.22 |
| 2012-02-06 07:00:00 | 10.66 |
| 2012-02-06 08:00:00 | 12.22 |
| 2012-02-06 09:00:00 | 14.04 |
| 2012-02-06 10:00:00 | 14.04 |
| 2012-02-06 11:00:00 | 14.04 |
| 2012-02-06 12:00:00 | 14.56 |
| 2012-02-06 13:00:00 | 15.08 |
| 2012-02-06 14:00:00 | 14.3 |
| 2012-02-06 15:00:00 | 13.26 |
| 2012-02-06 16:00:00 | 13.78 |
| 2012-02-06 17:00:00 | 14.82 |
| 2012-02-06 18:00:00 | 14.56 |
| 2012-02-06 19:00:00 | 14.56 |
| 2012-02-06 20:00:00 | 14.82 |
| 2012-02-06 21:00:00 | 16.38 |
| 2012-02-06 22:00:00 | 15.34 |
| 2012-02-06 23:00:00 | 16.38 |
| 2012-02-07 | 14.82 |
| 2012-02-07 01:00:00 | 14.3 |
| 2012-02-07 02:00:00 | 13.52 |
| 2012-02-07 03:00:00 | 11.18 |
| 2012-02-07 04:00:00 | 13.26 |
| 2012-02-07 05:00:00 | 12.22 |
| 2012-02-07 06:00:00 | 10.92 |
| 2012-02-07 07:00:00 | 12.48 |
| 2012-02-07 08:00:00 | 13.52 |
| 2012-02-07 09:00:00 | 13.52 |
| 2012-02-07 10:00:00 | 14.56 |
| 2012-02-07 11:00:00 | 14.3 |
| 2012-02-07 12:00:00 | 13.78 |
| 2012-02-07 13:00:00 | 14.56 |
| 2012-02-07 14:00:00 | 14.56 |
| 2012-02-07 15:00:00 | 14.56 |
| 2012-02-07 16:00:00 | 14.3 |
| 2012-02-07 17:00:00 | 14.3 |
| 2012-02-07 18:00:00 | 14.56 |
| 2012-02-07 19:00:00 | 14.56 |
| 2012-02-07 20:00:00 | 14.04 |
| 2012-02-07 21:00:00 | 16.9 |
| 2012-02-07 22:00:00 | 14.82 |
| 2012-02-07 23:00:00 | 16.9 |
| 2012-02-08 | 16.12 |
| 2012-02-08 01:00:00 | 14.3 |
| 2012-02-08 02:00:00 | 13 |
| 2012-02-08 03:00:00 | 11.7 |
| 2012-02-08 04:00:00 | 13.26 |
| 2012-02-08 05:00:00 | 11.7 |
| 2012-02-08 06:00:00 | 11.18 |
| 2012-02-08 07:00:00 | 12.48 |
| 2012-02-08 08:00:00 | 13.26 |
| 2012-02-08 09:00:00 | 14.82 |
| 2012-02-08 10:00:00 | 15.86 |
| 2012-02-08 11:00:00 | 15.6 |
| 2012-02-08 12:00:00 | 14.82 |
| 2012-02-08 13:00:00 | 15.6 |
| 2012-02-08 14:00:00 | 15.86 |
| 2012-02-08 15:00:00 | 14.56 |
| 2012-02-08 16:00:00 | 15.6 |
| 2012-02-08 17:00:00 | 14.04 |
| 2012-02-08 18:00:00 | 16.64 |
| 2012-02-08 19:00:00 | 15.86 |
| 2012-02-08 20:00:00 | 15.86 |
| 2012-02-08 21:00:00 | 16.64 |
| 2012-02-08 22:00:00 | 17.42 |
| 2012-02-08 23:00:00 | 16.64 |
| 2012-02-09 | 16.38 |
| 2012-02-09 01:00:00 | 15.6 |
| 2012-02-09 02:00:00 | 14.56 |
| 2012-02-09 03:00:00 | 13.78 |
| 2012-02-09 04:00:00 | 13.52 |
| 2012-02-09 05:00:00 | 13.52 |
| 2012-02-09 06:00:00 | 15.08 |
| 2012-02-09 07:00:00 | 13.78 |
| 2012-02-09 08:00:00 | 15.86 |
| 2012-02-09 09:00:00 | 14.04 |
| 2012-02-09 10:00:00 | 15.6 |
| 2012-02-09 11:00:00 | 16.64 |
| 2012-02-09 12:00:00 | 14.82 |
| 2012-02-09 13:00:00 | 15.08 |
| 2012-02-09 14:00:00 | 16.64 |
| 2012-02-09 15:00:00 | 15.6 |
| 2012-02-09 16:00:00 | 15.34 |
| 2012-02-09 17:00:00 | 15.86 |
| 2012-02-09 18:00:00 | 15.86 |
| 2012-02-09 19:00:00 | 16.12 |
| 2012-02-09 20:00:00 | 16.64 |
| 2012-02-09 21:00:00 | 16.64 |
| 2012-02-09 22:00:00 | 17.42 |
| 2012-02-09 23:00:00 | 17.42 |
| 2012-02-10 | 16.64 |
| 2012-02-10 01:00:00 | 15.34 |
| 2012-02-10 02:00:00 | 15.6 |
| 2012-02-10 03:00:00 | 14.3 |
| 2012-02-10 04:00:00 | 13.78 |
| 2012-02-10 05:00:00 | 14.04 |
| 2012-02-10 06:00:00 | 13.78 |
| 2012-02-10 07:00:00 | 14.3 |
| 2012-02-10 08:00:00 | 15.6 |
| 2012-02-10 09:00:00 | 15.6 |
| 2012-02-10 10:00:00 | 16.38 |
| 2012-02-10 11:00:00 | 16.12 |
| 2012-02-10 12:00:00 | 15.86 |
| 2012-02-10 13:00:00 | 16.12 |
| 2012-02-10 14:00:00 | 16.64 |
| 2012-02-10 15:00:00 | 16.64 |
| 2012-02-10 16:00:00 | 15.34 |
| 2012-02-10 17:00:00 | 18.2 |
| 2012-02-10 18:00:00 | 16.64 |
| 2012-02-10 19:00:00 | 17.16 |
| 2012-02-10 20:00:00 | 16.9 |
| 2012-02-10 21:00:00 | 17.42 |
| 2012-02-10 22:00:00 | 17.16 |
| 2012-02-10 23:00:00 | 17.42 |
| 2012-02-11 | 16.64 |
| 2012-02-11 01:00:00 | 16.38 |
| 2012-02-11 02:00:00 | 16.12 |
| 2012-02-11 03:00:00 | 15.34 |
| 2012-02-11 04:00:00 | 14.82 |
| 2012-02-11 05:00:00 | 14.56 |
| 2012-02-11 06:00:00 | 14.3 |
| 2012-02-11 07:00:00 | 13.78 |
| 2012-02-11 08:00:00 | 14.56 |
| 2012-02-11 09:00:00 | 16.12 |
| 2012-02-11 10:00:00 | 16.38 |
| 2012-02-11 11:00:00 | 17.16 |
| 2012-02-11 12:00:00 | 18.72 |
| 2012-02-11 13:00:00 | 19.24 |
| 2012-02-11 14:00:00 | 18.98 |
| 2012-02-11 15:00:00 | 17.94 |
| 2012-02-11 16:00:00 | 17.68 |
| 2012-02-11 17:00:00 | 17.16 |
| 2012-02-11 18:00:00 | 17.42 |
| 2012-02-11 19:00:00 | 17.16 |
| 2012-02-11 20:00:00 | 17.68 |
| 2012-02-11 21:00:00 | 17.94 |
| 2012-02-11 22:00:00 | 17.42 |
| 2012-02-11 23:00:00 | 17.42 |
| 2012-02-12 | 17.42 |
| 2012-02-12 01:00:00 | 16.9 |
| 2012-02-12 02:00:00 | 15.08 |
| 2012-02-12 03:00:00 | 14.56 |
| 2012-02-12 04:00:00 | 14.82 |
| 2012-02-12 05:00:00 | 14.56 |
| 2012-02-12 06:00:00 | 14.3 |
| 2012-02-12 07:00:00 | 14.82 |
| 2012-02-12 08:00:00 | 14.56 |
| 2012-02-12 09:00:00 | 15.6 |
| 2012-02-12 10:00:00 | 16.64 |
| 2012-02-12 11:00:00 | 17.16 |
| 2012-02-12 12:00:00 | 17.16 |
| 2012-02-12 13:00:00 | 18.72 |
| 2012-02-12 14:00:00 | 18.72 |
| 2012-02-12 15:00:00 | 19.24 |
| 2012-02-12 16:00:00 | 18.46 |
| 2012-02-12 17:00:00 | 17.42 |
| 2012-02-12 18:00:00 | 17.16 |
| 2012-02-12 19:00:00 | 18.46 |
| 2012-02-12 20:00:00 | 17.94 |
| 2012-02-12 21:00:00 | 18.2 |
| 2012-02-12 22:00:00 | 18.98 |
| 2012-02-12 23:00:00 | 18.46 |
| 2012-02-13 | 17.68 |
| 2012-02-13 01:00:00 | 22.36 |
| 2012-02-13 02:00:00 | 36.4 |
| 2012-02-13 03:00:00 | 42.38 |
| 2012-02-13 04:00:00 | 42.9 |
| 2012-02-13 05:00:00 | 42.9 |
| 2012-02-13 06:00:00 | 42.9 |
| 2012-02-13 07:00:00 | 42.64 |
| 2012-02-13 08:00:00 | 42.9 |
| 2012-02-13 09:00:00 | 42.38 |
| 2012-02-13 10:00:00 | 42.64 |
| 2012-02-13 11:00:00 | 42.9 |
| 2012-02-13 12:00:00 | 42.9 |
| 2012-02-13 13:00:00 | 42.64 |
| 2012-02-13 14:00:00 | 41.6 |
| 2012-02-13 15:00:00 | 43.16 |
| 2012-02-13 16:00:00 | 42.9 |
| 2012-02-13 17:00:00 | 42.9 |
| 2012-02-13 18:00:00 | 42.9 |
| 2012-02-13 19:00:00 | 42.64 |
| 2012-02-13 20:00:00 | 40.82 |
| 2012-02-13 21:00:00 | 26.26 |
| 2012-02-13 22:00:00 | 24.96 |
| 2012-02-13 23:00:00 | 24.7 |
| 2012-02-14 | 22.36 |
| 2012-02-14 01:00:00 | 20.8 |
| 2012-02-14 02:00:00 | 18.72 |
| 2012-02-14 03:00:00 | 17.42 |
| 2012-02-14 04:00:00 | 17.42 |
| 2012-02-14 05:00:00 | 17.16 |
| 2012-02-14 06:00:00 | 17.68 |
| 2012-02-14 07:00:00 | 19.24 |
| 2012-02-14 08:00:00 | 19.24 |
| 2012-02-14 09:00:00 | 21.06 |
| 2012-02-14 10:00:00 | 21.84 |
| 2012-02-14 11:00:00 | 20.54 |
| 2012-02-14 12:00:00 | 18.2 |
| 2012-02-14 13:00:00 | 20.28 |
| 2012-02-14 14:00:00 | 15.86 |
| 2012-02-14 15:00:00 | 17.94 |
| 2012-02-14 16:00:00 | 17.16 |
| 2012-02-14 17:00:00 | 17.42 |
| 2012-02-14 18:00:00 | 16.64 |
| 2012-02-14 19:00:00 | 16.64 |
| 2012-02-14 20:00:00 | 17.16 |
| 2012-02-14 21:00:00 | 17.16 |
| 2012-02-14 22:00:00 | 17.16 |
| 2012-02-14 23:00:00 | 17.68 |
| 2012-02-15 | 17.16 |
| 2012-02-15 01:00:00 | 16.64 |
| 2012-02-15 02:00:00 | 15.08 |
| 2012-02-15 03:00:00 | 17.16 |
| 2012-02-15 04:00:00 | 15.08 |
| 2012-02-15 05:00:00 | 14.82 |
| 2012-02-15 06:00:00 | 15.08 |
| 2012-02-15 07:00:00 | 15.86 |
| 2012-02-15 08:00:00 | 15.6 |
| 2012-02-15 09:00:00 | 16.9 |
| 2012-02-15 10:00:00 | 17.42 |
| 2012-02-15 11:00:00 | 16.9 |
| 2012-02-15 12:00:00 | 15.86 |
| 2012-02-15 13:00:00 | 21.06 |
| 2012-02-15 14:00:00 | 21.32 |
| 2012-02-15 15:00:00 | 23.4 |
| 2012-02-15 16:00:00 | 23.14 |
| 2012-02-15 17:00:00 | 20.54 |
| 2012-02-15 18:00:00 | 17.16 |
| 2012-02-15 19:00:00 | 17.16 |
| 2012-02-15 20:00:00 | 16.9 |
| 2012-02-15 21:00:00 | 16.9 |
| 2012-02-15 22:00:00 | 17.42 |
| 2012-02-15 23:00:00 | 17.42 |
| 2012-02-16 | 16.9 |
| 2012-02-16 01:00:00 | 16.64 |
| 2012-02-16 02:00:00 | 14.56 |
| 2012-02-16 03:00:00 | 14.82 |
| 2012-02-16 04:00:00 | 14.3 |
| 2012-02-16 05:00:00 | 15.08 |
| 2012-02-16 06:00:00 | 14.3 |
| 2012-02-16 07:00:00 | 14.56 |
| 2012-02-16 08:00:00 | 15.08 |
| 2012-02-16 09:00:00 | 17.42 |
| 2012-02-16 10:00:00 | 16.64 |
| 2012-02-16 11:00:00 | 15.6 |
| 2012-02-16 12:00:00 | 16.64 |
| 2012-02-16 13:00:00 | 16.64 |
| 2012-02-16 14:00:00 | 16.38 |
| 2012-02-16 15:00:00 | 16.9 |
| 2012-02-16 16:00:00 | 17.16 |
| 2012-02-16 17:00:00 | 16.9 |
| 2012-02-16 18:00:00 | 16.38 |
| 2012-02-16 19:00:00 | 16.64 |
| 2012-02-16 20:00:00 | 16.9 |
| 2012-02-16 21:00:00 | 17.42 |
| 2012-02-16 22:00:00 | 17.16 |
| 2012-02-16 23:00:00 | 16.9 |
| 2012-02-17 | 16.38 |
| 2012-02-17 01:00:00 | 16.12 |
| 2012-02-17 02:00:00 | 15.08 |
| 2012-02-17 03:00:00 | 14.3 |
| 2012-02-17 04:00:00 | 12.74 |
| 2012-02-17 05:00:00 | 13 |
| 2012-02-17 06:00:00 | 14.56 |
| 2012-02-17 07:00:00 | 14.3 |
| 2012-02-17 08:00:00 | 14.56 |
| 2012-02-17 09:00:00 | 16.38 |
| 2012-02-17 10:00:00 | 16.64 |
| 2012-02-17 11:00:00 | 15.6 |
| 2012-02-17 12:00:00 | 14.82 |
| 2012-02-17 13:00:00 | 15.34 |
| 2012-02-17 14:00:00 | 15.6 |
| 2012-02-17 15:00:00 | 15.86 |
| 2012-02-17 16:00:00 | 15.6 |
| 2012-02-17 17:00:00 | 18.72 |
| 2012-02-17 18:00:00 | 21.06 |
| 2012-02-17 19:00:00 | 27.56 |
| 2012-02-17 20:00:00 | 28.6 |
| 2012-02-17 21:00:00 | 22.1 |
| 2012-02-17 22:00:00 | 17.94 |
| 2012-02-17 23:00:00 | 17.16 |
| 2012-02-18 | 18.2 |
| 2012-02-18 01:00:00 | 19.5 |
| 2012-02-18 02:00:00 | 21.58 |
| 2012-02-18 03:00:00 | 19.5 |
| 2012-02-18 04:00:00 | 15.86 |
| 2012-02-18 05:00:00 | 13.78 |
| 2012-02-18 06:00:00 | 13.26 |
| 2012-02-18 07:00:00 | 13 |
| 2012-02-18 08:00:00 | 13.52 |
| 2012-02-18 09:00:00 | 15.86 |
| 2012-02-18 10:00:00 | 15.86 |
| 2012-02-18 11:00:00 | 28.6 |
| 2012-02-18 12:00:00 | 41.86 |
| 2012-02-18 13:00:00 | 42.12 |
| 2012-02-18 14:00:00 | 42.12 |
| 2012-02-18 15:00:00 | 42.38 |
| 2012-02-18 16:00:00 | 42.38 |
| 2012-02-18 17:00:00 | 42.38 |
| 2012-02-18 18:00:00 | 42.12 |
| 2012-02-18 19:00:00 | 42.38 |
| 2012-02-18 20:00:00 | 42.12 |
| 2012-02-18 21:00:00 | 42.12 |
| 2012-02-18 22:00:00 | 41.86 |
| 2012-02-18 23:00:00 | 42.12 |
| 2012-02-19 | 41.86 |
| 2012-02-19 01:00:00 | 41.6 |
| 2012-02-19 02:00:00 | 42.38 |
| 2012-02-19 03:00:00 | 42.12 |
| 2012-02-19 04:00:00 | 25.48 |
| 2012-02-19 05:00:00 | 16.38 |
| 2012-02-19 06:00:00 | 15.6 |
| 2012-02-19 07:00:00 | 14.82 |
| 2012-02-19 08:00:00 | 11.18 |
| 2012-02-19 09:00:00 | 13.26 |
| 2012-02-19 10:00:00 | 15.6 |
| 2012-02-19 11:00:00 | 29.38 |
| 2012-02-19 12:00:00 | 27.04 |
| 2012-02-19 13:00:00 | 29.64 |
| 2012-02-19 14:00:00 | 30.42 |
| 2012-02-19 15:00:00 | 42.38 |
| 2012-02-19 16:00:00 | 42.64 |
| 2012-02-19 17:00:00 | 42.38 |
| 2012-02-19 18:00:00 | 42.38 |
| 2012-02-19 19:00:00 | 42.64 |
| 2012-02-19 20:00:00 | 42.64 |
| 2012-02-19 21:00:00 | 42.9 |
| 2012-02-19 22:00:00 | 42.64 |
| 2012-02-19 23:00:00 | 42.64 |
| 2012-02-20 | 42.64 |
| 2012-02-20 01:00:00 | 42.64 |
| 2012-02-20 02:00:00 | 42.12 |
| 2012-02-20 03:00:00 | 42.12 |
| 2012-02-20 04:00:00 | 42.12 |
| 2012-02-20 05:00:00 | 29.38 |
| 2012-02-20 06:00:00 | 17.94 |
| 2012-02-20 07:00:00 | 11.44 |
| 2012-02-20 08:00:00 | 13.26 |
| 2012-02-20 09:00:00 | 20.28 |
| 2012-02-20 10:00:00 | 23.92 |
| 2012-02-20 11:00:00 | 15.86 |
| 2012-02-20 12:00:00 | 13 |
| 2012-02-20 13:00:00 | 23.4 |
| 2012-02-20 14:00:00 | 18.98 |
| 2012-02-20 15:00:00 | 26.26 |
| 2012-02-20 16:00:00 | 16.12 |
| 2012-02-20 17:00:00 | 28.6 |
| 2012-02-20 18:00:00 | 22.62 |
| 2012-02-20 19:00:00 | 16.38 |
| 2012-02-20 20:00:00 | 14.3 |
| 2012-02-20 21:00:00 | 27.82 |
| 2012-02-20 22:00:00 | 15.86 |
| 2012-02-20 23:00:00 | 14.3 |
| 2012-02-21 | 23.4 |
| 2012-02-21 01:00:00 | 17.94 |
| 2012-02-21 02:00:00 | 9.88 |
| 2012-02-21 03:00:00 | 13.78 |
| 2012-02-21 04:00:00 | 17.16 |
| 2012-02-21 05:00:00 | 10.92 |
| 2012-02-21 06:00:00 | 9.62 |
| 2012-02-21 07:00:00 | 18.46 |
| 2012-02-21 08:00:00 | 17.94 |
| 2012-02-21 09:00:00 | 10.92 |
| 2012-02-21 10:00:00 | 17.68 |
| 2012-02-21 11:00:00 | 22.62 |
| 2012-02-21 12:00:00 | 11.44 |
| 2012-02-21 13:00:00 | 23.92 |
| 2012-02-21 14:00:00 | 11.18 |
| 2012-02-21 15:00:00 | 28.08 |
| 2012-02-21 16:00:00 | 21.58 |
| 2012-02-21 17:00:00 | 19.24 |
| 2012-02-21 18:00:00 | 17.42 |
| 2012-02-21 19:00:00 | 14.04 |
| 2012-02-21 20:00:00 | 27.04 |
| 2012-02-21 21:00:00 | 14.04 |
| 2012-02-21 22:00:00 | 19.24 |
| 2012-02-21 23:00:00 | 22.62 |
| 2012-02-22 | 11.44 |
| 2012-02-22 01:00:00 | 18.46 |
| 2012-02-22 02:00:00 | 20.28 |
| 2012-02-22 03:00:00 | 8.58 |
| 2012-02-22 04:00:00 | 11.44 |
| 2012-02-22 05:00:00 | 16.9 |
| 2012-02-22 06:00:00 | 13.26 |
| 2012-02-22 07:00:00 | 7.28 |
| 2012-02-22 08:00:00 | 17.68 |
| 2012-02-22 09:00:00 | 21.84 |
| 2012-02-22 10:00:00 | 12.48 |
| 2012-02-22 11:00:00 | 15.6 |
| 2012-02-22 12:00:00 | 23.66 |
| 2012-02-22 13:00:00 | 22.88 |
| 2012-02-22 14:00:00 | 27.56 |
| 2012-02-22 15:00:00 | 29.12 |
| 2012-02-22 16:00:00 | 40.3 |
| 2012-02-22 17:00:00 | 42.12 |
| 2012-02-22 18:00:00 | 41.86 |
| 2012-02-22 19:00:00 | 42.38 |
| 2012-02-22 20:00:00 | 42.12 |
| 2012-02-22 21:00:00 | 41.86 |
| 2012-02-22 22:00:00 | 41.86 |
| 2012-02-22 23:00:00 | 41.86 |
| 2012-02-23 | 41.6 |
| 2012-02-23 01:00:00 | 41.86 |
| 2012-02-23 02:00:00 | 41.86 |
| 2012-02-23 03:00:00 | 41.6 |
| 2012-02-23 04:00:00 | 41.6 |
| 2012-02-23 05:00:00 | 21.06 |
| 2012-02-23 06:00:00 | 28.08 |
| 2012-02-23 07:00:00 | 24.18 |
| 2012-02-23 08:00:00 | 16.12 |
| 2012-02-23 09:00:00 | 27.3 |
| 2012-02-23 10:00:00 | 14.56 |
| 2012-02-23 11:00:00 | 28.6 |
| 2012-02-23 12:00:00 | 18.98 |
| 2012-02-23 13:00:00 | 28.6 |
| 2012-02-23 14:00:00 | 28.6 |
| 2012-02-23 15:00:00 | 28.6 |
| 2012-02-23 16:00:00 | 28.6 |
| 2012-02-23 17:00:00 | 41.6 |
| 2012-02-23 18:00:00 | 42.38 |
| 2012-02-23 19:00:00 | 42.12 |
| 2012-02-23 20:00:00 | 42.38 |
| 2012-02-23 21:00:00 | 42.64 |
| 2012-02-23 22:00:00 | 42.64 |
| 2012-02-23 23:00:00 | 42.38 |
| 2012-02-24 | 42.64 |
| 2012-02-24 01:00:00 | 42.64 |
| 2012-02-24 02:00:00 | 42.64 |
| 2012-02-24 03:00:00 | 42.38 |
| 2012-02-24 04:00:00 | 42.38 |
| 2012-02-24 05:00:00 | 42.12 |
| 2012-02-24 06:00:00 | 42.12 |
| 2012-02-24 07:00:00 | 41.86 |
| 2012-02-24 08:00:00 | 42.12 |
| 2012-02-24 09:00:00 | 42.12 |
| 2012-02-24 10:00:00 | 42.38 |
| 2012-02-24 11:00:00 | 42.64 |
| 2012-02-24 12:00:00 | 43.94 |
| 2012-02-24 13:00:00 | 44.2 |
| 2012-02-24 14:00:00 | 43.68 |
| 2012-02-24 15:00:00 | 43.42 |
| 2012-02-24 16:00:00 | 43.68 |
| 2012-02-24 17:00:00 | 43.68 |
| 2012-02-24 18:00:00 | 43.68 |
| 2012-02-24 19:00:00 | 43.42 |
| 2012-02-24 20:00:00 | 43.42 |
| 2012-02-24 21:00:00 | 43.68 |
| 2012-02-24 22:00:00 | 43.68 |
| 2012-02-24 23:00:00 | 43.42 |
| 2012-02-25 | 43.68 |
| 2012-02-25 01:00:00 | 43.68 |
| 2012-02-25 02:00:00 | 43.42 |
| 2012-02-25 03:00:00 | 43.42 |
| 2012-02-25 04:00:00 | 43.42 |
| 2012-02-25 05:00:00 | 43.68 |
| 2012-02-25 06:00:00 | 43.16 |
| 2012-02-25 07:00:00 | 43.16 |
| 2012-02-25 08:00:00 | 43.16 |
| 2012-02-25 09:00:00 | 42.9 |
| 2012-02-25 10:00:00 | 43.16 |
| 2012-02-25 11:00:00 | 42.9 |
| 2012-02-25 12:00:00 | 42.9 |
| 2012-02-25 13:00:00 | 42.9 |
| 2012-02-25 14:00:00 | 42.9 |
| 2012-02-25 15:00:00 | 42.9 |
| 2012-02-25 16:00:00 | 42.9 |
| 2012-02-25 17:00:00 | 43.16 |
| 2012-02-25 18:00:00 | 42.9 |
| 2012-02-25 19:00:00 | 43.16 |
| 2012-02-25 20:00:00 | 43.16 |
| 2012-02-25 21:00:00 | 42.9 |
| 2012-02-25 22:00:00 | 43.16 |
| 2012-02-25 23:00:00 | 43.16 |
| 2012-02-26 | 43.16 |
| 2012-02-26 01:00:00 | 43.16 |
| 2012-02-26 02:00:00 | 43.16 |
| 2012-02-26 03:00:00 | 42.9 |
| 2012-02-26 04:00:00 | 43.16 |
| 2012-02-26 05:00:00 | 43.16 |
| 2012-02-26 06:00:00 | 42.9 |
| 2012-02-26 07:00:00 | 43.42 |
| 2012-02-26 08:00:00 | 43.42 |
| 2012-02-26 09:00:00 | 43.42 |
| 2012-02-26 10:00:00 | 43.42 |
| 2012-02-26 11:00:00 | 43.68 |
| 2012-02-26 12:00:00 | 43.68 |
| 2012-02-26 13:00:00 | 43.68 |
| 2012-02-26 14:00:00 | 43.68 |
| 2012-02-26 15:00:00 | 43.68 |
| 2012-02-26 16:00:00 | 43.94 |
| 2012-02-26 17:00:00 | 43.68 |
| 2012-02-26 18:00:00 | 43.94 |
| 2012-02-26 19:00:00 | 43.94 |
| 2012-02-26 20:00:00 | 43.94 |
| 2012-02-26 21:00:00 | 43.68 |
| 2012-02-26 22:00:00 | 43.68 |
| 2012-02-26 23:00:00 | 43.42 |
| 2012-02-27 | 43.42 |
| 2012-02-27 01:00:00 | 43.42 |
| 2012-02-27 02:00:00 | 43.42 |
| 2012-02-27 03:00:00 | 43.16 |
| 2012-02-27 04:00:00 | 43.16 |
| 2012-02-27 05:00:00 | 43.42 |
| 2012-02-27 06:00:00 | 43.16 |
| 2012-02-27 07:00:00 | 19.24 |
| 2012-02-27 08:00:00 | 24.7 |
| 2012-02-27 09:00:00 | 26.26 |
| 2012-02-27 10:00:00 | 24.44 |
| 2012-02-27 11:00:00 | 24.96 |
| 2012-02-27 12:00:00 | 25.74 |
| 2012-02-27 13:00:00 | 22.62 |
| 2012-02-27 14:00:00 | 18.46 |
| 2012-02-27 15:00:00 | 17.94 |
| 2012-02-27 16:00:00 | 17.42 |
| 2012-02-27 17:00:00 | 17.68 |
| 2012-02-27 18:00:00 | 17.16 |
| 2012-02-27 19:00:00 | 17.68 |
| 2012-02-27 20:00:00 | 17.68 |
| 2012-02-27 21:00:00 | 18.98 |
| 2012-02-27 22:00:00 | 18.46 |
| 2012-02-27 23:00:00 | 18.2 |
| 2012-02-28 | 16.9 |
| 2012-02-28 01:00:00 | 16.12 |
| 2012-02-28 02:00:00 | 15.08 |
| 2012-02-28 03:00:00 | 14.3 |
| 2012-02-28 04:00:00 | 14.56 |
| 2012-02-28 05:00:00 | 14.3 |
| 2012-02-28 06:00:00 | 14.04 |
| 2012-02-28 07:00:00 | 14.3 |
| 2012-02-28 08:00:00 | 14.82 |
| 2012-02-28 09:00:00 | 15.6 |
| 2012-02-28 10:00:00 | 16.38 |
| 2012-02-28 11:00:00 | 16.64 |
| 2012-02-28 12:00:00 | 22.36 |
| 2012-02-28 13:00:00 | 39.78 |
| 2012-02-28 14:00:00 | 43.94 |
| 2012-02-28 15:00:00 | 43.94 |
| 2012-02-28 16:00:00 | 44.2 |
| 2012-02-28 17:00:00 | 44.2 |
| 2012-02-28 18:00:00 | 44.2 |
| 2012-02-28 19:00:00 | 44.2 |
| 2012-02-28 20:00:00 | 44.46 |
| 2012-02-28 21:00:00 | 44.46 |
| 2012-02-28 22:00:00 | 44.2 |
| 2012-02-28 23:00:00 | 43.94 |
| 2012-02-29 | 44.2 |
| 2012-02-29 01:00:00 | 44.2 |
| 2012-02-29 02:00:00 | 44.46 |
| 2012-02-29 03:00:00 | 44.2 |
| 2012-02-29 04:00:00 | 44.46 |
| 2012-02-29 05:00:00 | 44.46 |
| 2012-02-29 06:00:00 | 44.46 |
| 2012-02-29 07:00:00 | 44.46 |
| 2012-02-29 08:00:00 | 44.2 |
| 2012-02-29 09:00:00 | 44.46 |
| 2012-02-29 10:00:00 | 44.2 |
| 2012-02-29 11:00:00 | 44.46 |
| 2012-02-29 12:00:00 | 43.94 |
| 2012-02-29 13:00:00 | 44.2 |
| 2012-02-29 14:00:00 | 44.2 |
| 2012-02-29 15:00:00 | 43.94 |
| 2012-02-29 16:00:00 | 44.2 |
| 2012-02-29 17:00:00 | 43.94 |
| 2012-02-29 18:00:00 | 43.94 |
| 2012-02-29 19:00:00 | 43.94 |
| 2012-02-29 20:00:00 | 43.94 |
| 2012-02-29 21:00:00 | 43.68 |
| 2012-02-29 22:00:00 | 43.94 |
| 2012-02-29 23:00:00 | 43.94 |
| 2012-03-01 | 43.68 |
| 2012-03-01 01:00:00 | 43.94 |
| 2012-03-01 02:00:00 | 43.94 |
| 2012-03-01 03:00:00 | 43.94 |
| 2012-03-01 04:00:00 | 43.68 |
| 2012-03-01 05:00:00 | 43.94 |
| 2012-03-01 06:00:00 | 43.94 |
| 2012-03-01 07:00:00 | 43.68 |
| 2012-03-01 08:00:00 | 43.68 |
| 2012-03-01 09:00:00 | 43.68 |
| 2012-03-01 10:00:00 | 43.68 |
| 2012-03-01 11:00:00 | 43.68 |
| 2012-03-01 12:00:00 | 43.94 |
| 2012-03-01 13:00:00 | 43.42 |
| 2012-03-01 14:00:00 | 43.68 |
| 2012-03-01 15:00:00 | 43.42 |
| 2012-03-01 16:00:00 | 43.42 |
| 2012-03-01 17:00:00 | 43.42 |
| 2012-03-01 18:00:00 | 43.68 |
| 2012-03-01 19:00:00 | 43.42 |
| 2012-03-01 20:00:00 | 43.42 |
| 2012-03-01 21:00:00 | 43.68 |
| 2012-03-01 22:00:00 | 43.42 |
| 2012-03-01 23:00:00 | 43.42 |
| 2012-03-02 | 43.68 |
| 2012-03-02 01:00:00 | 43.42 |
| 2012-03-02 02:00:00 | 43.68 |
| 2012-03-02 03:00:00 | 43.42 |
| 2012-03-02 04:00:00 | 43.68 |
| 2012-03-02 05:00:00 | 43.68 |
| 2012-03-02 06:00:00 | 43.94 |
| 2012-03-02 07:00:00 | 43.94 |
| 2012-03-02 08:00:00 | 43.94 |
| 2012-03-02 09:00:00 | 43.68 |
| 2012-03-02 10:00:00 | 43.68 |
| 2012-03-02 11:00:00 | 44.2 |
| 2012-03-02 12:00:00 | 44.98 |
| 2012-03-02 13:00:00 | 44.72 |
| 2012-03-02 14:00:00 | 44.2 |
| 2012-03-02 15:00:00 | 43.94 |
| 2012-03-02 16:00:00 | 43.42 |
| 2012-03-02 17:00:00 | 43.42 |
| 2012-03-02 18:00:00 | 43.42 |
| 2012-03-02 19:00:00 | 43.42 |
| 2012-03-02 20:00:00 | 43.42 |
| 2012-03-02 21:00:00 | 43.16 |
| 2012-03-02 22:00:00 | 43.42 |
| 2012-03-02 23:00:00 | 43.68 |
| 2012-03-03 | 43.68 |
| 2012-03-03 01:00:00 | 43.42 |
| 2012-03-03 02:00:00 | 43.68 |
| 2012-03-03 03:00:00 | 43.42 |
| 2012-03-03 04:00:00 | 43.16 |
| 2012-03-03 05:00:00 | 43.16 |
| 2012-03-03 06:00:00 | 42.64 |
| 2012-03-03 07:00:00 | 42.38 |
| 2012-03-03 08:00:00 | 42.38 |
| 2012-03-03 09:00:00 | 30.68 |
| 2012-03-03 10:00:00 | 27.82 |
| 2012-03-03 11:00:00 | 28.86 |
| 2012-03-03 12:00:00 | 28.86 |
| 2012-03-03 13:00:00 | 29.12 |
| 2012-03-03 14:00:00 | 29.12 |
| 2012-03-03 15:00:00 | 29.12 |
| 2012-03-03 16:00:00 | 28.86 |
| 2012-03-03 17:00:00 | 28.86 |
| 2012-03-03 18:00:00 | 27.04 |
| 2012-03-03 19:00:00 | 19.76 |
| 2012-03-03 20:00:00 | 29.64 |
| 2012-03-03 21:00:00 | 29.12 |
| 2012-03-03 22:00:00 | 29.12 |
| 2012-03-03 23:00:00 | 26 |
| 2012-03-04 | 24.96 |
| 2012-03-04 01:00:00 | 17.42 |
| 2012-03-04 02:00:00 | 27.56 |
| 2012-03-04 03:00:00 | 22.88 |
| 2012-03-04 04:00:00 | 21.84 |
| 2012-03-04 05:00:00 | 21.58 |
| 2012-03-04 06:00:00 | 14.82 |
| 2012-03-04 07:00:00 | 15.34 |
| 2012-03-04 08:00:00 | 28.34 |
| 2012-03-04 09:00:00 | 16.38 |
| 2012-03-04 10:00:00 | 28.34 |
| 2012-03-04 11:00:00 | 25.48 |
| 2012-03-04 12:00:00 | 18.72 |
| 2012-03-04 13:00:00 | 29.9 |
| 2012-03-04 14:00:00 | 29.9 |
| 2012-03-04 15:00:00 | 22.36 |
| 2012-03-04 16:00:00 | 23.92 |
| 2012-03-04 17:00:00 | 28.34 |
| 2012-03-04 18:00:00 | 16.64 |
| 2012-03-04 19:00:00 | 29.12 |
| 2012-03-04 20:00:00 | 27.56 |
| 2012-03-04 21:00:00 | 17.42 |
| 2012-03-04 22:00:00 | 29.38 |
| 2012-03-04 23:00:00 | 18.98 |
| 2012-03-05 | 29.38 |
| 2012-03-05 01:00:00 | 15.34 |
| 2012-03-05 02:00:00 | 27.04 |
| 2012-03-05 03:00:00 | 14.3 |
| 2012-03-05 04:00:00 | 23.14 |
| 2012-03-05 05:00:00 | 11.18 |
| 2012-03-05 06:00:00 | 17.94 |
| 2012-03-05 07:00:00 | 22.88 |
| 2012-03-05 08:00:00 | 16.64 |
| 2012-03-05 09:00:00 | 26 |
| 2012-03-05 10:00:00 | 17.16 |
| 2012-03-05 11:00:00 | 25.22 |
| 2012-03-05 12:00:00 | 16.9 |
| 2012-03-05 13:00:00 | 27.04 |
| 2012-03-05 14:00:00 | 17.16 |
| 2012-03-05 15:00:00 | 14.82 |
| 2012-03-05 16:00:00 | 14.56 |
| 2012-03-05 17:00:00 | 14.3 |
| 2012-03-05 18:00:00 | 14.04 |
| 2012-03-05 19:00:00 | 13.52 |
| 2012-03-05 20:00:00 | 14.82 |
| 2012-03-05 21:00:00 | 14.56 |
| 2012-03-05 22:00:00 | 17.68 |
| 2012-03-05 23:00:00 | 17.42 |
| 2012-03-06 | 15.08 |
| 2012-03-06 01:00:00 | 13.78 |
| 2012-03-06 02:00:00 | 13 |
| 2012-03-06 03:00:00 | 12.48 |
| 2012-03-06 04:00:00 | 11.44 |
| 2012-03-06 05:00:00 | 11.44 |
| 2012-03-06 06:00:00 | 12.74 |
| 2012-03-06 07:00:00 | 12.22 |
| 2012-03-06 08:00:00 | 14.04 |
| 2012-03-06 09:00:00 | 14.3 |
| 2012-03-06 10:00:00 | 13.52 |
| 2012-03-06 11:00:00 | 15.34 |
| 2012-03-06 12:00:00 | 14.56 |
| 2012-03-06 13:00:00 | 13.78 |
| 2012-03-06 14:00:00 | 13 |
| 2012-03-06 15:00:00 | 15.6 |
| 2012-03-06 16:00:00 | 13.52 |
| 2012-03-06 17:00:00 | 13.78 |
| 2012-03-06 18:00:00 | 14.82 |
| 2012-03-06 19:00:00 | 14.3 |
| 2012-03-06 20:00:00 | 14.04 |
| 2012-03-06 21:00:00 | 14.56 |
| 2012-03-06 22:00:00 | 14.82 |
| 2012-03-06 23:00:00 | 14.04 |
| 2012-03-07 | 16.12 |
| 2012-03-07 01:00:00 | 14.3 |
| 2012-03-07 02:00:00 | 12.48 |
| 2012-03-07 03:00:00 | 10.4 |
| 2012-03-07 04:00:00 | 12.74 |
| 2012-03-07 05:00:00 | 10.14 |
| 2012-03-07 06:00:00 | 12.48 |
| 2012-03-07 07:00:00 | 10.4 |
| 2012-03-07 08:00:00 | 13.26 |
| 2012-03-07 09:00:00 | 13 |
| 2012-03-07 10:00:00 | 14.3 |
| 2012-03-07 11:00:00 | 13.26 |
| 2012-03-07 12:00:00 | 13.26 |
| 2012-03-07 13:00:00 | 13.26 |
| 2012-03-07 14:00:00 | 14.3 |
| 2012-03-07 15:00:00 | 12.48 |
| 2012-03-07 16:00:00 | 15.08 |
| 2012-03-07 17:00:00 | 13 |
| 2012-03-07 18:00:00 | 14.04 |
| 2012-03-07 19:00:00 | 14.3 |
| 2012-03-07 20:00:00 | 14.3 |
| 2012-03-07 21:00:00 | 14.56 |
| 2012-03-07 22:00:00 | 14.82 |
| 2012-03-07 23:00:00 | 14.82 |
| 2012-03-08 | 14.3 |
| 2012-03-08 01:00:00 | 13.26 |
| 2012-03-08 02:00:00 | 12.74 |
| 2012-03-08 03:00:00 | 12.74 |
| 2012-03-08 04:00:00 | 10.92 |
| 2012-03-08 05:00:00 | 12.22 |
| 2012-03-08 06:00:00 | 12.22 |
| 2012-03-08 07:00:00 | 10.4 |
| 2012-03-08 08:00:00 | 14.3 |
| 2012-03-08 09:00:00 | 13.52 |
| 2012-03-08 10:00:00 | 13.52 |
| 2012-03-08 11:00:00 | 14.04 |
| 2012-03-08 12:00:00 | 13.78 |
| 2012-03-08 13:00:00 | 13.78 |
| 2012-03-08 14:00:00 | 13.52 |
| 2012-03-08 15:00:00 | 13.52 |
| 2012-03-08 16:00:00 | 13.52 |
| 2012-03-08 17:00:00 | 12.74 |
| 2012-03-08 18:00:00 | 15.08 |
| 2012-03-08 19:00:00 | 13.26 |
| 2012-03-08 20:00:00 | 14.82 |
| 2012-03-08 21:00:00 | 14.56 |
| 2012-03-08 22:00:00 | 15.34 |
| 2012-03-08 23:00:00 | 14.82 |
| 2012-03-09 | 13.52 |
| 2012-03-09 01:00:00 | 14.56 |
| 2012-03-09 02:00:00 | 12.48 |
| 2012-03-09 03:00:00 | 10.4 |
| 2012-03-09 04:00:00 | 11.44 |
| 2012-03-09 05:00:00 | 11.18 |
| 2012-03-09 06:00:00 | 11.44 |
| 2012-03-09 07:00:00 | 9.88 |
| 2012-03-09 08:00:00 | 13.26 |
| 2012-03-09 09:00:00 | 12.22 |
| 2012-03-09 10:00:00 | 16.9 |
| 2012-03-09 11:00:00 | 30.16 |
| 2012-03-09 12:00:00 | 27.56 |
| 2012-03-09 13:00:00 | 17.16 |
| 2012-03-09 14:00:00 | 15.34 |
| 2012-03-09 15:00:00 | 14.56 |
| 2012-03-09 16:00:00 | 14.3 |
| 2012-03-09 17:00:00 | 14.3 |
| 2012-03-09 18:00:00 | 13.78 |
| 2012-03-09 19:00:00 | 14.3 |
| 2012-03-09 20:00:00 | 14.3 |
| 2012-03-09 21:00:00 | 14.56 |
| 2012-03-09 22:00:00 | 14.82 |
| 2012-03-09 23:00:00 | 14.56 |
| 2012-03-10 | 13.78 |
| 2012-03-10 01:00:00 | 13.78 |
| 2012-03-10 02:00:00 | 13 |
| 2012-03-10 03:00:00 | 12.48 |
| 2012-03-10 04:00:00 | 11.96 |
| 2012-03-10 05:00:00 | 10.4 |
| 2012-03-10 06:00:00 | 11.96 |
| 2012-03-10 07:00:00 | 12.22 |
| 2012-03-10 08:00:00 | 11.18 |
| 2012-03-10 09:00:00 | 13.26 |
| 2012-03-10 10:00:00 | 15.08 |
| 2012-03-10 11:00:00 | 15.34 |
| 2012-03-10 12:00:00 | 15.6 |
| 2012-03-10 13:00:00 | 15.86 |
| 2012-03-10 14:00:00 | 15.86 |
| 2012-03-10 15:00:00 | 15.34 |
| 2012-03-10 16:00:00 | 14.82 |
| 2012-03-10 17:00:00 | 15.86 |
| 2012-03-10 18:00:00 | 15.08 |
| 2012-03-10 19:00:00 | 15.08 |
| 2012-03-10 20:00:00 | 14.82 |
| 2012-03-10 21:00:00 | 15.08 |
| 2012-03-10 22:00:00 | 27.56 |
| 2012-03-10 23:00:00 | 38.74 |
| 2012-03-11 | 23.14 |
| 2012-03-11 01:00:00 | 14.82 |
| 2012-03-11 02:00:00 | 14.56 |
| 2012-03-11 03:00:00 | 13 |
| 2012-03-11 04:00:00 | 13.52 |
| 2012-03-11 05:00:00 | 13 |
| 2012-03-11 06:00:00 | 13 |
| 2012-03-11 07:00:00 | 16.9 |
| 2012-03-11 08:00:00 | 15.08 |
| 2012-03-11 09:00:00 | 17.16 |
| 2012-03-11 10:00:00 | 23.92 |
| 2012-03-11 11:00:00 | 24.96 |
| 2012-03-11 12:00:00 | 23.14 |
| 2012-03-11 13:00:00 | 29.38 |
| 2012-03-11 14:00:00 | 43.42 |
| 2012-03-11 15:00:00 | 42.9 |
| 2012-03-11 16:00:00 | 42.9 |
| 2012-03-11 17:00:00 | 32.5 |
| 2012-03-11 18:00:00 | 23.92 |
| 2012-03-11 19:00:00 | 20.8 |
| 2012-03-11 20:00:00 | 21.06 |
| 2012-03-11 21:00:00 | 22.88 |
| 2012-03-11 22:00:00 | 22.1 |
| 2012-03-11 23:00:00 | 20.54 |
| 2012-03-12 | 18.98 |
| 2012-03-12 01:00:00 | 16.64 |
| 2012-03-12 02:00:00 | 15.08 |
| 2012-03-12 03:00:00 | 14.82 |
| 2012-03-12 04:00:00 | 14.04 |
| 2012-03-12 05:00:00 | 13.78 |
| 2012-03-12 06:00:00 | 14.04 |
| 2012-03-12 07:00:00 | 14.3 |
| 2012-03-12 08:00:00 | 14.82 |
| 2012-03-12 09:00:00 | 20.54 |
| 2012-03-12 10:00:00 | 30.94 |
| 2012-03-12 11:00:00 | 28.08 |
| 2012-03-12 12:00:00 | 20.28 |
| 2012-03-12 13:00:00 | 17.42 |
| 2012-03-12 14:00:00 | 17.68 |
| 2012-03-12 15:00:00 | 15.86 |
| 2012-03-12 16:00:00 | 15.86 |
| 2012-03-12 17:00:00 | 22.62 |
| 2012-03-12 18:00:00 | 31.2 |
| 2012-03-12 19:00:00 | 41.34 |
| 2012-03-12 20:00:00 | 36.14 |
| 2012-03-12 21:00:00 | 40.82 |
| 2012-03-12 22:00:00 | 40.82 |
| 2012-03-12 23:00:00 | 41.34 |
| 2012-03-13 | 41.6 |
| 2012-03-13 01:00:00 | 41.6 |
| 2012-03-13 02:00:00 | 41.34 |
| 2012-03-13 03:00:00 | 41.08 |
| 2012-03-13 04:00:00 | 41.34 |
| 2012-03-13 05:00:00 | 40.82 |
| 2012-03-13 06:00:00 | 41.08 |
| 2012-03-13 07:00:00 | 40.82 |
| 2012-03-13 08:00:00 | 40.56 |
| 2012-03-13 09:00:00 | 41.08 |
| 2012-03-13 10:00:00 | 40.3 |
| 2012-03-13 11:00:00 | 41.08 |
| 2012-03-13 12:00:00 | 40.82 |
| 2012-03-13 13:00:00 | 40.56 |
| 2012-03-13 14:00:00 | 40.3 |
| 2012-03-13 15:00:00 | 40.56 |
| 2012-03-13 16:00:00 | 38.48 |
| 2012-03-13 17:00:00 | 34.06 |
| 2012-03-13 18:00:00 | 34.06 |
| 2012-03-13 19:00:00 | 34.32 |
| 2012-03-13 20:00:00 | 34.06 |
| 2012-03-13 21:00:00 | 34.58 |
| 2012-03-13 22:00:00 | 34.84 |
| 2012-03-13 23:00:00 | 34.84 |
| 2012-03-14 | 33.8 |
| 2012-03-14 01:00:00 | 33.02 |
| 2012-03-14 02:00:00 | 32.5 |
| 2012-03-14 03:00:00 | 32.24 |
| 2012-03-14 04:00:00 | 31.72 |
| 2012-03-14 05:00:00 | 31.46 |
| 2012-03-14 06:00:00 | 31.46 |
| 2012-03-14 07:00:00 | 31.72 |
| 2012-03-14 08:00:00 | 32.5 |
| 2012-03-14 09:00:00 | 22.1 |
| 2012-03-14 10:00:00 | 17.94 |
| 2012-03-14 11:00:00 | 18.46 |
| 2012-03-14 12:00:00 | 18.46 |
| 2012-03-14 13:00:00 | 19.5 |
| 2012-03-14 14:00:00 | 18.2 |
| 2012-03-14 15:00:00 | 17.94 |
| 2012-03-14 16:00:00 | 17.94 |
| 2012-03-14 17:00:00 | 17.94 |
| 2012-03-14 18:00:00 | 19.24 |
| 2012-03-14 19:00:00 | 19.5 |
| 2012-03-14 20:00:00 | 18.2 |
| 2012-03-14 21:00:00 | 19.76 |
| 2012-03-14 22:00:00 | 19.76 |
| 2012-03-14 23:00:00 | 18.72 |
| 2012-03-15 | 17.68 |
| 2012-03-15 01:00:00 | 16.38 |
| 2012-03-15 02:00:00 | 15.34 |
| 2012-03-15 03:00:00 | 14.82 |
| 2012-03-15 04:00:00 | 14.56 |
| 2012-03-15 05:00:00 | 13.26 |
| 2012-03-15 06:00:00 | 14.82 |
| 2012-03-15 07:00:00 | 14.56 |
| 2012-03-15 08:00:00 | 14.56 |
| 2012-03-15 09:00:00 | 15.08 |
| 2012-03-15 10:00:00 | 15.86 |
| 2012-03-15 11:00:00 | 15.08 |
| 2012-03-15 12:00:00 | 15.08 |
| 2012-03-15 13:00:00 | 15.34 |
| 2012-03-15 14:00:00 | 16.12 |
| 2012-03-15 15:00:00 | 16.64 |
| 2012-03-15 16:00:00 | 16.12 |
| 2012-03-15 17:00:00 | 15.86 |
| 2012-03-15 18:00:00 | 15.86 |
| 2012-03-15 19:00:00 | 16.12 |
| 2012-03-15 20:00:00 | 17.16 |
| 2012-03-15 21:00:00 | 18.2 |
| 2012-03-15 22:00:00 | 18.2 |
| 2012-03-15 23:00:00 | 18.2 |
| 2012-03-16 | 16.38 |
| 2012-03-16 01:00:00 | 15.08 |
| 2012-03-16 02:00:00 | 14.56 |
| 2012-03-16 03:00:00 | 14.04 |
| 2012-03-16 04:00:00 | 13.78 |
| 2012-03-16 05:00:00 | 13.52 |
| 2012-03-16 06:00:00 | 13 |
| 2012-03-16 07:00:00 | 14.3 |
| 2012-03-16 08:00:00 | 14.3 |
| 2012-03-16 09:00:00 | 14.56 |
| 2012-03-16 10:00:00 | 15.86 |
| 2012-03-16 11:00:00 | 16.38 |
| 2012-03-16 12:00:00 | 19.76 |
| 2012-03-16 13:00:00 | 19.24 |
| 2012-03-16 14:00:00 | 16.9 |
| 2012-03-16 15:00:00 | 16.38 |
| 2012-03-16 16:00:00 | 16.12 |
| 2012-03-16 17:00:00 | 16.38 |
| 2012-03-16 18:00:00 | 14.56 |
| 2012-03-16 19:00:00 | 14.3 |
| 2012-03-16 20:00:00 | 14.04 |
| 2012-03-16 21:00:00 | 14.04 |
| 2012-03-16 22:00:00 | 14.04 |
| 2012-03-16 23:00:00 | 14.04 |
| 2012-03-17 | 13.78 |
| 2012-03-17 01:00:00 | 13.52 |
| 2012-03-17 02:00:00 | 12.48 |
| 2012-03-17 03:00:00 | 12.22 |
| 2012-03-17 04:00:00 | 11.7 |
| 2012-03-17 05:00:00 | 12.74 |
| 2012-03-17 06:00:00 | 13 |
| 2012-03-17 07:00:00 | 12.22 |
| 2012-03-17 08:00:00 | 12.48 |
| 2012-03-17 09:00:00 | 13.78 |
| 2012-03-17 10:00:00 | 13.78 |
| 2012-03-17 11:00:00 | 15.08 |
| 2012-03-17 12:00:00 | 15.86 |
| 2012-03-17 13:00:00 | 14.82 |
| 2012-03-17 14:00:00 | 15.6 |
| 2012-03-17 15:00:00 | 14.82 |
| 2012-03-17 16:00:00 | 13.52 |
| 2012-03-17 17:00:00 | 13.52 |
| 2012-03-17 18:00:00 | 13.26 |
| 2012-03-17 19:00:00 | 13.52 |
| 2012-03-17 20:00:00 | 13.52 |
| 2012-03-17 21:00:00 | 14.04 |
| 2012-03-17 22:00:00 | 14.04 |
| 2012-03-17 23:00:00 | 13.78 |
| 2012-03-18 | 13.52 |
| 2012-03-18 01:00:00 | 12.48 |
| 2012-03-18 02:00:00 | 11.18 |
| 2012-03-18 03:00:00 | 12.74 |
| 2012-03-18 04:00:00 | 11.7 |
| 2012-03-18 05:00:00 | 11.96 |
| 2012-03-18 06:00:00 | 12.48 |
| 2012-03-18 07:00:00 | 11.96 |
| 2012-03-18 08:00:00 | 11.96 |
| 2012-03-18 09:00:00 | 11.7 |
| 2012-03-18 10:00:00 | 14.56 |
| 2012-03-18 11:00:00 | 13.52 |
| 2012-03-18 12:00:00 | 13.78 |
| 2012-03-18 13:00:00 | 13.78 |
| 2012-03-18 14:00:00 | 14.04 |
| 2012-03-18 15:00:00 | 13.26 |
| 2012-03-18 16:00:00 | 13 |
| 2012-03-18 17:00:00 | 13.26 |
| 2012-03-18 18:00:00 | 13 |
| 2012-03-18 19:00:00 | 13.26 |
| 2012-03-18 20:00:00 | 13.26 |
| 2012-03-18 21:00:00 | 14.3 |
| 2012-03-18 22:00:00 | 13.78 |
| 2012-03-18 23:00:00 | 13.52 |
| 2012-03-19 | 12.74 |
| 2012-03-19 01:00:00 | 11.44 |
| 2012-03-19 02:00:00 | 12.22 |
| 2012-03-19 03:00:00 | 11.44 |
| 2012-03-19 04:00:00 | 11.18 |
| 2012-03-19 05:00:00 | 10.14 |
| 2012-03-19 06:00:00 | 11.7 |
| 2012-03-19 07:00:00 | 11.44 |
| 2012-03-19 08:00:00 | 12.74 |
| 2012-03-19 09:00:00 | 36.66 |
| 2012-03-19 10:00:00 | 42.38 |
| 2012-03-19 11:00:00 | 14.04 |
| 2012-03-19 12:00:00 | 4.42 |
| 2012-03-19 13:00:00 | 29.9 |
| 2012-03-19 14:00:00 | 41.86 |
| 2012-03-19 15:00:00 | 15.08 |
| 2012-03-19 16:00:00 | 13 |
| 2012-03-19 17:00:00 | 13.52 |
| 2012-03-19 18:00:00 | 12.48 |
| 2012-03-19 19:00:00 | 13.52 |
| 2012-03-19 20:00:00 | 12.22 |
| 2012-03-19 21:00:00 | 14.82 |
| 2012-03-19 22:00:00 | 13.78 |
| 2012-03-19 23:00:00 | 13.78 |
| 2012-03-20 | 13.26 |
| 2012-03-20 01:00:00 | 12.48 |
| 2012-03-20 02:00:00 | 11.18 |
| 2012-03-20 03:00:00 | 10.14 |
| 2012-03-20 04:00:00 | 11.44 |
| 2012-03-20 05:00:00 | 10.66 |
| 2012-03-20 06:00:00 | 9.62 |
| 2012-03-20 07:00:00 | 11.96 |
| 2012-03-20 08:00:00 | 14.04 |
| 2012-03-20 09:00:00 | 12.22 |
| 2012-03-20 10:00:00 | 12.74 |
| 2012-03-20 11:00:00 | 12.48 |
| 2012-03-20 12:00:00 | 11.44 |
| 2012-03-20 13:00:00 | 11.96 |
| 2012-03-20 14:00:00 | 11.7 |
| 2012-03-20 15:00:00 | 13.78 |
| 2012-03-20 16:00:00 | 11.96 |
| 2012-03-20 17:00:00 | 11.96 |
| 2012-03-20 18:00:00 | 11.18 |
| 2012-03-20 19:00:00 | 14.04 |
| 2012-03-20 20:00:00 | 11.96 |
| 2012-03-20 21:00:00 | 14.3 |
| 2012-03-20 22:00:00 | 13.78 |
| 2012-03-20 23:00:00 | 13.52 |
| 2012-03-21 | 11.96 |
| 2012-03-21 01:00:00 | 12.22 |
| 2012-03-21 02:00:00 | 10.14 |
| 2012-03-21 03:00:00 | 11.7 |
| 2012-03-21 04:00:00 | 10.14 |
| 2012-03-21 05:00:00 | 9.1 |
| 2012-03-21 06:00:00 | 11.44 |
| 2012-03-21 07:00:00 | 10.92 |
| 2012-03-21 08:00:00 | 11.7 |
| 2012-03-21 09:00:00 | 11.96 |
| 2012-03-21 10:00:00 | 11.7 |
| 2012-03-21 11:00:00 | 12.74 |
| 2012-03-21 12:00:00 | 11.7 |
| 2012-03-21 13:00:00 | 11.7 |
| 2012-03-21 14:00:00 | 11.44 |
| 2012-03-21 15:00:00 | 10.66 |
| 2012-03-21 16:00:00 | 11.96 |
| 2012-03-21 17:00:00 | 12.74 |
| 2012-03-21 18:00:00 | 12.22 |
| 2012-03-21 19:00:00 | 11.18 |
| 2012-03-21 20:00:00 | 13.78 |
| 2012-03-21 21:00:00 | 13.52 |
| 2012-03-21 22:00:00 | 13 |
| 2012-03-21 23:00:00 | 13 |
| 2012-03-22 | 13 |
| 2012-03-22 01:00:00 | 11.44 |
| 2012-03-22 02:00:00 | 10.92 |
| 2012-03-22 03:00:00 | 10.66 |
| 2012-03-22 04:00:00 | 9.88 |
| 2012-03-22 05:00:00 | 8.84 |
| 2012-03-22 06:00:00 | 9.88 |
| 2012-03-22 07:00:00 | 10.92 |
| 2012-03-22 08:00:00 | 11.18 |
| 2012-03-22 09:00:00 | 13 |
| 2012-03-22 10:00:00 | 11.44 |
| 2012-03-22 11:00:00 | 12.74 |
| 2012-03-22 12:00:00 | 11.7 |
| 2012-03-22 13:00:00 | 11.18 |
| 2012-03-22 14:00:00 | 11.44 |
| 2012-03-22 15:00:00 | 12.22 |
| 2012-03-22 16:00:00 | 11.18 |
| 2012-03-22 17:00:00 | 10.66 |
| 2012-03-22 18:00:00 | 13 |
| 2012-03-22 19:00:00 | 11.7 |
| 2012-03-22 20:00:00 | 12.74 |
| 2012-03-22 21:00:00 | 13.26 |
| 2012-03-22 22:00:00 | 13 |
| 2012-03-22 23:00:00 | 12.74 |
| 2012-03-23 | 11.18 |
| 2012-03-23 01:00:00 | 12.22 |
| 2012-03-23 02:00:00 | 10.66 |
| 2012-03-23 03:00:00 | 10.14 |
| 2012-03-23 04:00:00 | 9.88 |
| 2012-03-23 05:00:00 | 10.66 |
| 2012-03-23 06:00:00 | 10.4 |
| 2012-03-23 07:00:00 | 10.4 |
| 2012-03-23 08:00:00 | 11.7 |
| 2012-03-23 09:00:00 | 11.44 |
| 2012-03-23 10:00:00 | 13 |
| 2012-03-23 11:00:00 | 12.48 |
| 2012-03-23 12:00:00 | 12.74 |
| 2012-03-23 13:00:00 | 11.44 |
| 2012-03-23 14:00:00 | 12.22 |
| 2012-03-23 15:00:00 | 11.7 |
| 2012-03-23 16:00:00 | 10.4 |
| 2012-03-23 17:00:00 | 13.52 |
| 2012-03-23 18:00:00 | 11.44 |
| 2012-03-23 19:00:00 | 12.74 |
| 2012-03-23 20:00:00 | 12.48 |
| 2012-03-23 21:00:00 | 12.74 |
| 2012-03-23 22:00:00 | 12.74 |
| 2012-03-23 23:00:00 | 12.48 |
| 2012-03-24 | 10.66 |
| 2012-03-24 01:00:00 | 11.7 |
| 2012-03-24 02:00:00 | 10.92 |
| 2012-03-24 03:00:00 | 9.36 |
| 2012-03-24 04:00:00 | 11.18 |
| 2012-03-24 05:00:00 | 10.4 |
| 2012-03-24 06:00:00 | 10.14 |
| 2012-03-24 07:00:00 | 9.36 |
| 2012-03-24 08:00:00 | 10.14 |
| 2012-03-24 09:00:00 | 13 |
| 2012-03-24 10:00:00 | 13 |
| 2012-03-24 11:00:00 | 13 |
| 2012-03-24 12:00:00 | 14.3 |
| 2012-03-24 13:00:00 | 14.3 |
| 2012-03-24 14:00:00 | 14.56 |
| 2012-03-24 15:00:00 | 13.78 |
| 2012-03-24 16:00:00 | 13.26 |
| 2012-03-24 17:00:00 | 13 |
| 2012-03-24 18:00:00 | 11.44 |
| 2012-03-24 19:00:00 | 12.48 |
| 2012-03-24 20:00:00 | 12.48 |
| 2012-03-24 21:00:00 | 12.48 |
| 2012-03-24 22:00:00 | 11.44 |
| 2012-03-24 23:00:00 | 10.4 |
| 2012-03-25 | 9.88 |
| 2012-03-25 01:00:00 | 10.92 |
| 2012-03-25 03:00:00 | 10.14 |
| 2012-03-25 04:00:00 | 8.06 |
| 2012-03-25 05:00:00 | 8.32 |
| 2012-03-25 06:00:00 | 9.88 |
| 2012-03-25 07:00:00 | 8.58 |
| 2012-03-25 08:00:00 | 7.28 |
| 2012-03-25 09:00:00 | 8.06 |
| 2012-03-25 10:00:00 | 10.92 |
| 2012-03-25 11:00:00 | 10.92 |
| 2012-03-25 12:00:00 | 10.92 |
| 2012-03-25 13:00:00 | 12.48 |
| 2012-03-25 14:00:00 | 11.44 |
| 2012-03-25 15:00:00 | 10.14 |
| 2012-03-25 16:00:00 | 11.18 |
| 2012-03-25 17:00:00 | 9.62 |
| 2012-03-25 18:00:00 | 13.26 |
| 2012-03-25 19:00:00 | 11.18 |
| 2012-03-25 20:00:00 | 12.22 |
| 2012-03-25 21:00:00 | 12.48 |
| 2012-03-25 22:00:00 | 11.96 |
| 2012-03-25 23:00:00 | 12.74 |
| 2012-03-26 | 13.26 |
| 2012-03-26 01:00:00 | 11.44 |
| 2012-03-26 02:00:00 | 11.18 |
| 2012-03-26 03:00:00 | 9.62 |
| 2012-03-26 04:00:00 | 9.88 |
| 2012-03-26 05:00:00 | 10.92 |
| 2012-03-26 06:00:00 | 10.14 |
| 2012-03-26 07:00:00 | 9.62 |
| 2012-03-26 08:00:00 | 11.96 |
| 2012-03-26 09:00:00 | 12.48 |
| 2012-03-26 10:00:00 | 12.22 |
| 2012-03-26 11:00:00 | 13.26 |
| 2012-03-26 12:00:00 | 12.22 |
| 2012-03-26 13:00:00 | 11.7 |
| 2012-03-26 14:00:00 | 11.7 |
| 2012-03-26 15:00:00 | 11.18 |
| 2012-03-26 16:00:00 | 11.18 |
| 2012-03-26 17:00:00 | 10.92 |
| 2012-03-26 18:00:00 | 10.66 |
| 2012-03-26 19:00:00 | 10.92 |
| 2012-03-26 20:00:00 | 10.92 |
| 2012-03-26 21:00:00 | 11.44 |
| 2012-03-26 22:00:00 | 12.22 |
| 2012-03-26 23:00:00 | 11.7 |
| 2012-03-27 | 11.96 |
| 2012-03-27 01:00:00 | 9.88 |
| 2012-03-27 02:00:00 | 9.62 |
| 2012-03-27 03:00:00 | 10.66 |
| 2012-03-27 04:00:00 | 9.1 |
| 2012-03-27 05:00:00 | 7.8 |
| 2012-03-27 06:00:00 | 10.14 |
| 2012-03-27 07:00:00 | 9.88 |
| 2012-03-27 08:00:00 | 10.66 |
| 2012-03-27 09:00:00 | 10.92 |
| 2012-03-27 10:00:00 | 11.18 |
| 2012-03-27 11:00:00 | 13 |
| 2012-03-27 12:00:00 | 11.18 |
| 2012-03-27 13:00:00 | 10.4 |
| 2012-03-27 14:00:00 | 11.44 |
| 2012-03-27 15:00:00 | 12.22 |
| 2012-03-27 16:00:00 | 10.92 |
| 2012-03-27 17:00:00 | 10.92 |
| 2012-03-27 18:00:00 | 10.92 |
| 2012-03-27 19:00:00 | 10.66 |
| 2012-03-27 20:00:00 | 13.26 |
| 2012-03-27 21:00:00 | 12.22 |
| 2012-03-27 22:00:00 | 13 |
| 2012-03-27 23:00:00 | 14.04 |
| 2012-03-28 | 12.74 |
| 2012-03-28 01:00:00 | 11.96 |
| 2012-03-28 02:00:00 | 11.96 |
| 2012-03-28 03:00:00 | 10.92 |
| 2012-03-28 04:00:00 | 9.36 |
| 2012-03-28 05:00:00 | 8.84 |
| 2012-03-28 06:00:00 | 9.88 |
| 2012-03-28 07:00:00 | 8.84 |
| 2012-03-28 08:00:00 | 10.4 |
| 2012-03-28 09:00:00 | 12.74 |
| 2012-03-28 10:00:00 | 12.74 |
| 2012-03-28 11:00:00 | 11.96 |
| 2012-03-28 12:00:00 | 12.74 |
| 2012-03-28 13:00:00 | 11.7 |
| 2012-03-28 14:00:00 | 11.18 |
| 2012-03-28 15:00:00 | 10.66 |
| 2012-03-28 16:00:00 | 11.44 |
| 2012-03-28 17:00:00 | 12.48 |
| 2012-03-28 18:00:00 | 11.18 |
| 2012-03-28 19:00:00 | 11.7 |
| 2012-03-28 20:00:00 | 12.74 |
| 2012-03-28 21:00:00 | 12.22 |
| 2012-03-28 22:00:00 | 13.78 |
| 2012-03-28 23:00:00 | 13 |
| 2012-03-29 | 12.22 |
| 2012-03-29 01:00:00 | 12.48 |
| 2012-03-29 02:00:00 | 11.18 |
| 2012-03-29 03:00:00 | 8.32 |
| 2012-03-29 04:00:00 | 9.1 |
| 2012-03-29 05:00:00 | 9.62 |
| 2012-03-29 06:00:00 | 7.28 |
| 2012-03-29 07:00:00 | 9.88 |
| 2012-03-29 08:00:00 | 10.4 |
| 2012-03-29 09:00:00 | 11.44 |
| 2012-03-29 10:00:00 | 11.44 |
| 2012-03-29 11:00:00 | 11.7 |
| 2012-03-29 12:00:00 | 11.18 |
| 2012-03-29 13:00:00 | 11.96 |
| 2012-03-29 14:00:00 | 12.22 |
| 2012-03-29 15:00:00 | 11.44 |
| 2012-03-29 16:00:00 | 11.96 |
| 2012-03-29 17:00:00 | 17.68 |
| 2012-03-29 18:00:00 | 30.94 |
| 2012-03-29 19:00:00 | 39.26 |
| 2012-03-29 20:00:00 | 39.26 |
| 2012-03-29 21:00:00 | 39.26 |
| 2012-03-29 22:00:00 | 39.52 |
| 2012-03-29 23:00:00 | 39 |
| 2012-03-30 | 39.78 |
| 2012-03-30 01:00:00 | 39.52 |
| 2012-03-30 02:00:00 | 40.3 |
| 2012-03-30 03:00:00 | 40.3 |
| 2012-03-30 04:00:00 | 41.08 |
| 2012-03-30 05:00:00 | 40.82 |
| 2012-03-30 06:00:00 | 40.04 |
| 2012-03-30 07:00:00 | 40.04 |
| 2012-03-30 08:00:00 | 39.78 |
| 2012-03-30 09:00:00 | 40.3 |
| 2012-03-30 10:00:00 | 40.04 |
| 2012-03-30 11:00:00 | 40.04 |
| 2012-03-30 12:00:00 | 39.52 |
| 2012-03-30 13:00:00 | 39.52 |
| 2012-03-30 14:00:00 | 39.26 |
| 2012-03-30 15:00:00 | 39 |
| 2012-03-30 16:00:00 | 39 |
| 2012-03-30 17:00:00 | 39 |
| 2012-03-30 18:00:00 | 39 |
| 2012-03-30 19:00:00 | 35.62 |
| 2012-03-30 20:00:00 | 12.48 |
| 2012-03-30 21:00:00 | 26.52 |
| 2012-03-30 22:00:00 | 36.4 |
| 2012-03-30 23:00:00 | 38.74 |
| 2012-03-31 | 38.74 |
| 2012-03-31 01:00:00 | 37.96 |
| 2012-03-31 02:00:00 | 10.4 |
| 2012-03-31 03:00:00 | 13.78 |
| 2012-03-31 04:00:00 | 19.5 |
| 2012-03-31 05:00:00 | 7.28 |
| 2012-03-31 06:00:00 | 18.46 |
| 2012-03-31 07:00:00 | 15.08 |
| 2012-03-31 08:00:00 | 8.06 |
| 2012-03-31 09:00:00 | 24.7 |
| 2012-03-31 10:00:00 | 11.96 |
| 2012-03-31 11:00:00 | 24.44 |
| 2012-03-31 12:00:00 | 15.86 |
| 2012-03-31 13:00:00 | 26.78 |
| 2012-03-31 14:00:00 | 12.48 |
| 2012-03-31 15:00:00 | 23.92 |
| 2012-03-31 16:00:00 | 15.34 |
| 2012-03-31 17:00:00 | 27.3 |
| 2012-03-31 18:00:00 | 39.78 |
| 2012-03-31 19:00:00 | 40.56 |
| 2012-03-31 20:00:00 | 40.56 |
| 2012-03-31 21:00:00 | 40.82 |
| 2012-03-31 22:00:00 | 40.82 |
| 2012-03-31 23:00:00 | 40.56 |
| 2012-04-01 | 40.56 |
| 2012-04-01 01:00:00 | 40.82 |
| 2012-04-01 02:00:00 | 40.56 |
| 2012-04-01 03:00:00 | 40.56 |
| 2012-04-01 04:00:00 | 40.3 |
| 2012-04-01 05:00:00 | 40.04 |
| 2012-04-01 06:00:00 | 9.88 |
| 2012-04-01 07:00:00 | 15.08 |
| 2012-04-01 08:00:00 | 21.84 |
| 2012-04-01 09:00:00 | 10.14 |
| 2012-04-01 10:00:00 | 24.44 |
| 2012-04-01 11:00:00 | 16.12 |
| 2012-04-01 12:00:00 | 26.78 |
| 2012-04-01 13:00:00 | 14.3 |
| 2012-04-01 14:00:00 | 23.14 |
| 2012-04-01 15:00:00 | 16.38 |
| 2012-04-01 16:00:00 | 26.52 |
| 2012-04-01 17:00:00 | 11.96 |
| 2012-04-01 18:00:00 | 26.78 |
| 2012-04-01 19:00:00 | 10.66 |
| 2012-04-01 20:00:00 | 26 |
| 2012-04-01 21:00:00 | 12.74 |
| 2012-04-01 22:00:00 | 26.78 |
| 2012-04-01 23:00:00 | 12.74 |
| 2012-04-02 | 22.88 |
| 2012-04-02 01:00:00 | 13.78 |
| 2012-04-02 02:00:00 | 10.92 |
| 2012-04-02 03:00:00 | 21.32 |
| 2012-04-02 04:00:00 | 9.88 |
| 2012-04-02 05:00:00 | 11.18 |
| 2012-04-02 06:00:00 | 19.5 |
| 2012-04-02 07:00:00 | 11.44 |
| 2012-04-02 08:00:00 | 10.92 |
| 2012-04-02 09:00:00 | 26.26 |
| 2012-04-02 10:00:00 | 11.7 |
| 2012-04-02 11:00:00 | 14.82 |
| 2012-04-02 12:00:00 | 23.92 |
| 2012-04-02 13:00:00 | 10.92 |
| 2012-04-02 14:00:00 | 16.12 |
| 2012-04-02 15:00:00 | 20.54 |
| 2012-04-02 16:00:00 | 10.4 |
| 2012-04-02 17:00:00 | 19.24 |
| 2012-04-02 18:00:00 | 18.2 |
| 2012-04-02 19:00:00 | 11.18 |
| 2012-04-02 20:00:00 | 23.92 |
| 2012-04-02 21:00:00 | 13.52 |
| 2012-04-02 22:00:00 | 18.2 |
| 2012-04-02 23:00:00 | 20.8 |
| 2012-04-03 | 10.4 |
| 2012-04-03 01:00:00 | 20.28 |
| 2012-04-03 02:00:00 | 15.6 |
| 2012-04-03 03:00:00 | 6.5 |
| 2012-04-03 04:00:00 | 16.9 |
| 2012-04-03 05:00:00 | 15.34 |
| 2012-04-03 06:00:00 | 5.2 |
| 2012-04-03 07:00:00 | 15.6 |
| 2012-04-03 08:00:00 | 17.42 |
| 2012-04-03 09:00:00 | 10.66 |
| 2012-04-03 10:00:00 | 20.8 |
| 2012-04-03 11:00:00 | 17.94 |
| 2012-04-03 12:00:00 | 7.8 |
| 2012-04-03 13:00:00 | 21.06 |
| 2012-04-03 14:00:00 | 11.96 |
| 2012-04-03 15:00:00 | 12.22 |
| 2012-04-03 16:00:00 | 26 |
| 2012-04-03 17:00:00 | 10.66 |
| 2012-04-03 18:00:00 | 16.12 |
| 2012-04-03 19:00:00 | 26.26 |
| 2012-04-03 20:00:00 | 12.74 |
| 2012-04-03 21:00:00 | 26 |
| 2012-04-03 22:00:00 | 13 |
| 2012-04-03 23:00:00 | 26 |
| 2012-04-04 | 11.44 |
| 2012-04-04 01:00:00 | 18.72 |
| 2012-04-04 02:00:00 | 16.38 |
| 2012-04-04 03:00:00 | 6.76 |
| 2012-04-04 04:00:00 | 17.16 |
| 2012-04-04 05:00:00 | 14.56 |
| 2012-04-04 06:00:00 | 5.98 |
| 2012-04-04 07:00:00 | 18.46 |
| 2012-04-04 08:00:00 | 14.56 |
| 2012-04-04 09:00:00 | 11.96 |
| 2012-04-04 10:00:00 | 24.7 |
| 2012-04-04 11:00:00 | 9.36 |
| 2012-04-04 12:00:00 | 17.42 |
| 2012-04-04 13:00:00 | 18.2 |
| 2012-04-04 14:00:00 | 7.8 |
| 2012-04-04 15:00:00 | 26 |
| 2012-04-04 16:00:00 | 9.88 |
| 2012-04-04 17:00:00 | 24.7 |
| 2012-04-04 18:00:00 | 12.48 |
| 2012-04-04 19:00:00 | 23.92 |
| 2012-04-04 20:00:00 | 13.78 |
| 2012-04-04 21:00:00 | 25.74 |
| 2012-04-04 22:00:00 | 13.52 |
| 2012-04-04 23:00:00 | 26.26 |
| 2012-04-05 | 12.22 |
| 2012-04-05 01:00:00 | 24.18 |
| 2012-04-05 02:00:00 | 12.74 |
| 2012-04-05 03:00:00 | 11.7 |
| 2012-04-05 04:00:00 | 20.28 |
| 2012-04-05 05:00:00 | 10.14 |
| 2012-04-05 06:00:00 | 12.48 |
| 2012-04-05 07:00:00 | 22.1 |
| 2012-04-05 08:00:00 | 9.1 |
| 2012-04-05 09:00:00 | 16.9 |
| 2012-04-05 10:00:00 | 21.58 |
| 2012-04-05 11:00:00 | 10.92 |
| 2012-04-05 12:00:00 | 23.14 |
| 2012-04-05 13:00:00 | 16.64 |
| 2012-04-05 14:00:00 | 11.44 |
| 2012-04-05 15:00:00 | 26 |
| 2012-04-05 16:00:00 | 10.92 |
| 2012-04-05 17:00:00 | 18.46 |
| 2012-04-05 18:00:00 | 20.02 |
| 2012-04-05 19:00:00 | 10.4 |
| 2012-04-05 20:00:00 | 27.04 |
| 2012-04-05 21:00:00 | 11.7 |
| 2012-04-05 22:00:00 | 19.76 |
| 2012-04-05 23:00:00 | 18.72 |
| 2012-04-06 | 11.96 |
| 2012-04-06 01:00:00 | 27.56 |
| 2012-04-06 02:00:00 | 27.56 |
| 2012-04-06 03:00:00 | 11.18 |
| 2012-04-06 04:00:00 | 22.88 |
| 2012-04-06 05:00:00 | 16.12 |
| 2012-04-06 06:00:00 | 9.88 |
| 2012-04-06 07:00:00 | 22.1 |
| 2012-04-06 08:00:00 | 15.08 |
| 2012-04-06 09:00:00 | 27.3 |
| 2012-04-06 10:00:00 | 27.3 |
| 2012-04-06 11:00:00 | 35.88 |
| 2012-04-06 12:00:00 | 20.02 |
| 2012-04-06 13:00:00 | 15.34 |
| 2012-04-06 14:00:00 | 15.08 |
| 2012-04-06 15:00:00 | 14.82 |
| 2012-04-06 16:00:00 | 14.3 |
| 2012-04-06 17:00:00 | 14.56 |
| 2012-04-06 18:00:00 | 14.04 |
| 2012-04-06 19:00:00 | 14.04 |
| 2012-04-06 20:00:00 | 14.3 |
| 2012-04-06 21:00:00 | 14.04 |
| 2012-04-06 22:00:00 | 14.04 |
| 2012-04-06 23:00:00 | 13.26 |
| 2012-04-07 | 13 |
| 2012-04-07 01:00:00 | 13.52 |
| 2012-04-07 02:00:00 | 11.44 |
| 2012-04-07 03:00:00 | 11.7 |
| 2012-04-07 04:00:00 | 12.22 |
| 2012-04-07 05:00:00 | 11.18 |
| 2012-04-07 06:00:00 | 9.88 |
| 2012-04-07 07:00:00 | 11.44 |
| 2012-04-07 08:00:00 | 9.1 |
| 2012-04-07 09:00:00 | 13 |
| 2012-04-07 10:00:00 | 13 |
| 2012-04-07 11:00:00 | 14.56 |
| 2012-04-07 12:00:00 | 14.56 |
| 2012-04-07 13:00:00 | 15.34 |
| 2012-04-07 14:00:00 | 14.04 |
| 2012-04-07 15:00:00 | 14.3 |
| 2012-04-07 16:00:00 | 13.78 |
| 2012-04-07 17:00:00 | 13.52 |
| 2012-04-07 18:00:00 | 11.96 |
| 2012-04-07 19:00:00 | 14.56 |
| 2012-04-07 20:00:00 | 13.26 |
| 2012-04-07 21:00:00 | 14.82 |
| 2012-04-07 22:00:00 | 14.04 |
| 2012-04-07 23:00:00 | 11.44 |
| 2012-04-08 | 15.34 |
| 2012-04-08 01:00:00 | 12.48 |
| 2012-04-08 02:00:00 | 13.26 |
| 2012-04-08 03:00:00 | 11.18 |
| 2012-04-08 04:00:00 | 8.84 |
| 2012-04-08 05:00:00 | 10.66 |
| 2012-04-08 06:00:00 | 8.58 |
| 2012-04-08 07:00:00 | 11.44 |
| 2012-04-08 08:00:00 | 11.44 |
| 2012-04-08 09:00:00 | 12.74 |
| 2012-04-08 10:00:00 | 14.04 |
| 2012-04-08 11:00:00 | 14.56 |
| 2012-04-08 12:00:00 | 16.38 |
| 2012-04-08 13:00:00 | 15.86 |
| 2012-04-08 14:00:00 | 15.34 |
| 2012-04-08 15:00:00 | 15.08 |
| 2012-04-08 16:00:00 | 15.08 |
| 2012-04-08 17:00:00 | 15.6 |
| 2012-04-08 18:00:00 | 13.52 |
| 2012-04-08 19:00:00 | 14.04 |
| 2012-04-08 20:00:00 | 15.34 |
| 2012-04-08 21:00:00 | 12.48 |
| 2012-04-08 22:00:00 | 14.04 |
| 2012-04-08 23:00:00 | 13.78 |
| 2012-04-09 | 11.7 |
| 2012-04-09 01:00:00 | 14.04 |
| 2012-04-09 02:00:00 | 11.7 |
| 2012-04-09 03:00:00 | 9.36 |
| 2012-04-09 04:00:00 | 10.4 |
| 2012-04-09 05:00:00 | 10.92 |
| 2012-04-09 06:00:00 | 9.1 |
| 2012-04-09 07:00:00 | 9.36 |
| 2012-04-09 08:00:00 | 10.92 |
| 2012-04-09 09:00:00 | 11.44 |
| 2012-04-09 10:00:00 | 12.22 |
| 2012-04-09 11:00:00 | 13.52 |
| 2012-04-09 12:00:00 | 13.26 |
| 2012-04-09 13:00:00 | 13.26 |
| 2012-04-09 14:00:00 | 11.7 |
| 2012-04-09 15:00:00 | 13.52 |
| 2012-04-09 16:00:00 | 11.44 |
| 2012-04-09 17:00:00 | 11.44 |
| 2012-04-09 18:00:00 | 11.18 |
| 2012-04-09 19:00:00 | 11.96 |
| 2012-04-09 20:00:00 | 13.52 |
| 2012-04-09 21:00:00 | 13.26 |
| 2012-04-09 22:00:00 | 14.3 |
| 2012-04-09 23:00:00 | 13 |
| 2012-04-10 | 13.78 |
| 2012-04-10 01:00:00 | 11.7 |
| 2012-04-10 02:00:00 | 10.4 |
| 2012-04-10 03:00:00 | 9.62 |
| 2012-04-10 04:00:00 | 10.66 |
| 2012-04-10 05:00:00 | 8.58 |
| 2012-04-10 06:00:00 | 9.88 |
| 2012-04-10 07:00:00 | 10.66 |
| 2012-04-10 08:00:00 | 9.62 |
| 2012-04-10 09:00:00 | 13.78 |
| 2012-04-10 10:00:00 | 12.74 |
| 2012-04-10 11:00:00 | 13.26 |
| 2012-04-10 12:00:00 | 13.26 |
| 2012-04-10 13:00:00 | 13 |
| 2012-04-10 14:00:00 | 12.48 |
| 2012-04-10 15:00:00 | 11.44 |
| 2012-04-10 16:00:00 | 11.96 |
| 2012-04-10 17:00:00 | 11.7 |
| 2012-04-10 18:00:00 | 11.96 |
| 2012-04-10 19:00:00 | 11.96 |
| 2012-04-10 20:00:00 | 13.52 |
| 2012-04-10 21:00:00 | 12.48 |
| 2012-04-10 22:00:00 | 13.78 |
| 2012-04-10 23:00:00 | 13.26 |
| 2012-04-11 | 10.92 |
| 2012-04-11 01:00:00 | 11.7 |
| 2012-04-11 02:00:00 | 11.18 |
| 2012-04-11 03:00:00 | 10.14 |
| 2012-04-11 04:00:00 | 8.32 |
| 2012-04-11 05:00:00 | 10.14 |
| 2012-04-11 06:00:00 | 9.62 |
| 2012-04-11 07:00:00 | 8.06 |
| 2012-04-11 08:00:00 | 11.7 |
| 2012-04-11 09:00:00 | 11.7 |
| 2012-04-11 10:00:00 | 11.96 |
| 2012-04-11 11:00:00 | 13.26 |
| 2012-04-11 12:00:00 | 11.7 |
| 2012-04-11 13:00:00 | 11.96 |
| 2012-04-11 14:00:00 | 12.48 |
| 2012-04-11 15:00:00 | 11.7 |
| 2012-04-11 16:00:00 | 10.92 |
| 2012-04-11 17:00:00 | 11.18 |
| 2012-04-11 18:00:00 | 10.92 |
| 2012-04-11 19:00:00 | 11.44 |
| 2012-04-11 20:00:00 | 11.7 |
| 2012-04-11 21:00:00 | 12.48 |
| 2012-04-11 22:00:00 | 13.26 |
| 2012-04-11 23:00:00 | 13 |
| 2012-04-12 | 12.74 |
| 2012-04-12 01:00:00 | 11.44 |
| 2012-04-12 02:00:00 | 10.66 |
| 2012-04-12 03:00:00 | 8.84 |
| 2012-04-12 04:00:00 | 8.84 |
| 2012-04-12 05:00:00 | 9.88 |
| 2012-04-12 06:00:00 | 11.18 |
| 2012-04-12 07:00:00 | 10.66 |
| 2012-04-12 08:00:00 | 10.66 |
| 2012-04-12 09:00:00 | 11.44 |
| 2012-04-12 10:00:00 | 11.96 |
| 2012-04-12 11:00:00 | 11.18 |
| 2012-04-12 12:00:00 | 12.48 |
| 2012-04-12 13:00:00 | 11.44 |
| 2012-04-12 14:00:00 | 11.44 |
| 2012-04-12 15:00:00 | 20.8 |
| 2012-04-12 16:00:00 | 39.52 |
| 2012-04-12 17:00:00 | 39.52 |
| 2012-04-12 18:00:00 | 40.3 |
| 2012-04-12 19:00:00 | 39.52 |
| 2012-04-12 20:00:00 | 39.52 |
| 2012-04-12 21:00:00 | 39.52 |
| 2012-04-12 22:00:00 | 39.52 |
| 2012-04-12 23:00:00 | 39.78 |
| 2012-04-13 | 39.78 |
| 2012-04-13 01:00:00 | 39.52 |
| 2012-04-13 02:00:00 | 39.78 |
| 2012-04-13 03:00:00 | 21.58 |
| 2012-04-13 04:00:00 | 16.9 |
| 2012-04-13 05:00:00 | 3.12 |
| 2012-04-13 06:00:00 | 19.76 |
| 2012-04-13 07:00:00 | 10.4 |
| 2012-04-13 08:00:00 | 11.7 |
| 2012-04-13 09:00:00 | 22.36 |
| 2012-04-13 10:00:00 | 9.88 |
| 2012-04-13 11:00:00 | 24.18 |
| 2012-04-13 12:00:00 | 10.66 |
| 2012-04-13 13:00:00 | 24.18 |
| 2012-04-13 14:00:00 | 13 |
| 2012-04-13 15:00:00 | 11.96 |
| 2012-04-13 16:00:00 | 12.74 |
| 2012-04-13 17:00:00 | 11.18 |
| 2012-04-13 18:00:00 | 14.04 |
| 2012-04-13 19:00:00 | 13.52 |
| 2012-04-13 20:00:00 | 14.3 |
| 2012-04-13 21:00:00 | 19.24 |
| 2012-04-13 22:00:00 | 15.6 |
| 2012-04-13 23:00:00 | 14.04 |
| 2012-04-14 | 13.52 |
| 2012-04-14 01:00:00 | 11.96 |
| 2012-04-14 02:00:00 | 11.18 |
| 2012-04-14 03:00:00 | 10.92 |
| 2012-04-14 04:00:00 | 10.66 |
| 2012-04-14 05:00:00 | 9.88 |
| 2012-04-14 06:00:00 | 9.36 |
| 2012-04-14 07:00:00 | 9.62 |
| 2012-04-14 08:00:00 | 10.92 |
| 2012-04-14 09:00:00 | 11.18 |
| 2012-04-14 10:00:00 | 11.96 |
| 2012-04-14 11:00:00 | 13 |
| 2012-04-14 12:00:00 | 13.52 |
| 2012-04-14 13:00:00 | 13.52 |
| 2012-04-14 14:00:00 | 13.78 |
| 2012-04-14 15:00:00 | 12.48 |
| 2012-04-14 16:00:00 | 14.04 |
| 2012-04-14 17:00:00 | 12.74 |
| 2012-04-14 18:00:00 | 13.52 |
| 2012-04-14 19:00:00 | 12.48 |
| 2012-04-14 20:00:00 | 14.3 |
| 2012-04-14 21:00:00 | 13.78 |
| 2012-04-14 22:00:00 | 13.52 |
| 2012-04-14 23:00:00 | 12.22 |
| 2012-04-15 | 14.04 |
| 2012-04-15 01:00:00 | 12.22 |
| 2012-04-15 02:00:00 | 11.44 |
| 2012-04-15 03:00:00 | 13.78 |
| 2012-04-15 04:00:00 | 13.78 |
| 2012-04-15 05:00:00 | 12.48 |
| 2012-04-15 06:00:00 | 13.52 |
| 2012-04-15 07:00:00 | 12.48 |
| 2012-04-15 08:00:00 | 11.96 |
| 2012-04-15 09:00:00 | 15.08 |
| 2012-04-15 10:00:00 | 14.04 |
| 2012-04-15 11:00:00 | 14.3 |
| 2012-04-15 12:00:00 | 13.78 |
| 2012-04-15 13:00:00 | 13.26 |
| 2012-04-15 14:00:00 | 13.26 |
| 2012-04-15 15:00:00 | 32.24 |
| 2012-04-15 16:00:00 | 40.04 |
| 2012-04-15 17:00:00 | 41.08 |
| 2012-04-15 18:00:00 | 40.3 |
| 2012-04-15 19:00:00 | 40.04 |
| 2012-04-15 20:00:00 | 40.3 |
| 2012-04-15 21:00:00 | 40.3 |
| 2012-04-15 22:00:00 | 40.04 |
| 2012-04-15 23:00:00 | 40.3 |
| 2012-04-16 | 40.04 |
| 2012-04-16 01:00:00 | 40.3 |
| 2012-04-16 02:00:00 | 40.04 |
| 2012-04-16 03:00:00 | 40.04 |
| 2012-04-16 04:00:00 | 40.04 |
| 2012-04-16 05:00:00 | 40.3 |
| 2012-04-16 06:00:00 | 40.04 |
| 2012-04-16 07:00:00 | 40.56 |
| 2012-04-16 08:00:00 | 40.56 |
| 2012-04-16 09:00:00 | 40.82 |
| 2012-04-16 10:00:00 | 40.56 |
| 2012-04-16 11:00:00 | 40.04 |
| 2012-04-16 12:00:00 | 40.82 |
| 2012-04-16 13:00:00 | 40.82 |
| 2012-04-16 14:00:00 | 41.08 |
| 2012-04-16 15:00:00 | 40.56 |
| 2012-04-16 16:00:00 | 41.08 |
| 2012-04-16 17:00:00 | 40.82 |
| 2012-04-16 18:00:00 | 40.82 |
| 2012-04-16 19:00:00 | 41.08 |
| 2012-04-16 20:00:00 | 40.56 |
| 2012-04-16 21:00:00 | 40.3 |
| 2012-04-16 22:00:00 | 40.04 |
| 2012-04-16 23:00:00 | 40.04 |
| 2012-04-17 | 40.04 |
| 2012-04-17 01:00:00 | 39.78 |
| 2012-04-17 02:00:00 | 39.78 |
| 2012-04-17 03:00:00 | 39.78 |
| 2012-04-17 04:00:00 | 35.36 |
| 2012-04-17 05:00:00 | 10.4 |
| 2012-04-17 06:00:00 | 14.56 |
| 2012-04-17 07:00:00 | 20.02 |
| 2012-04-17 08:00:00 | 9.88 |
| 2012-04-17 09:00:00 | 27.3 |
| 2012-04-17 10:00:00 | 10.66 |
| 2012-04-17 11:00:00 | 24.18 |
| 2012-04-17 12:00:00 | 11.96 |
| 2012-04-17 13:00:00 | 19.76 |
| 2012-04-17 14:00:00 | 16.9 |
| 2012-04-17 15:00:00 | 10.4 |
| 2012-04-17 16:00:00 | 25.74 |
| 2012-04-17 17:00:00 | 8.84 |
| 2012-04-17 18:00:00 | 17.94 |
| 2012-04-17 19:00:00 | 17.42 |
| 2012-04-17 20:00:00 | 10.66 |
| 2012-04-17 21:00:00 | 25.48 |
| 2012-04-17 22:00:00 | 10.66 |
| 2012-04-17 23:00:00 | 24.96 |
| 2012-04-18 | 10.92 |
| 2012-04-18 01:00:00 | 15.6 |
| 2012-04-18 02:00:00 | 20.28 |
| 2012-04-18 03:00:00 | 7.8 |
| 2012-04-18 04:00:00 | 19.5 |
| 2012-04-18 05:00:00 | 13 |
| 2012-04-18 06:00:00 | 9.36 |
| 2012-04-18 07:00:00 | 24.18 |
| 2012-04-18 08:00:00 | 9.88 |
| 2012-04-18 09:00:00 | 17.16 |
| 2012-04-18 10:00:00 | 20.8 |
| 2012-04-18 11:00:00 | 10.4 |
| 2012-04-18 12:00:00 | 22.62 |
| 2012-04-18 13:00:00 | 14.3 |
| 2012-04-18 14:00:00 | 11.7 |
| 2012-04-18 15:00:00 | 23.66 |
| 2012-04-18 16:00:00 | 9.1 |
| 2012-04-18 17:00:00 | 17.68 |
| 2012-04-18 18:00:00 | 18.2 |
| 2012-04-18 19:00:00 | 9.36 |
| 2012-04-18 20:00:00 | 24.7 |
| 2012-04-18 21:00:00 | 11.44 |
| 2012-04-18 22:00:00 | 17.42 |
| 2012-04-18 23:00:00 | 20.28 |
| 2012-04-19 | 9.36 |
| 2012-04-19 01:00:00 | 21.32 |
| 2012-04-19 02:00:00 | 9.36 |
| 2012-04-19 03:00:00 | 10.4 |
| 2012-04-19 04:00:00 | 17.94 |
| 2012-04-19 05:00:00 | 1.3 |
| 2012-04-19 06:00:00 | 15.86 |
| 2012-04-19 07:00:00 | 11.96 |
| 2012-04-19 08:00:00 | 7.54 |
| 2012-04-19 09:00:00 | 21.58 |
| 2012-04-19 10:00:00 | 11.44 |
| 2012-04-19 11:00:00 | 11.44 |
| 2012-04-19 12:00:00 | 22.62 |
| 2012-04-19 13:00:00 | 6.24 |
| 2012-04-19 14:00:00 | 15.34 |
| 2012-04-19 15:00:00 | 15.86 |
| 2012-04-19 16:00:00 | 5.72 |
| 2012-04-19 17:00:00 | 20.54 |
| 2012-04-19 18:00:00 | 9.88 |
| 2012-04-19 19:00:00 | 10.92 |
| 2012-04-19 20:00:00 | 21.32 |
| 2012-04-19 21:00:00 | 6.76 |
| 2012-04-19 22:00:00 | 17.16 |
| 2012-04-19 23:00:00 | 16.9 |
| 2012-04-20 | 6.76 |
| 2012-04-20 01:00:00 | 20.02 |
| 2012-04-20 02:00:00 | 5.98 |
| 2012-04-20 03:00:00 | 26.78 |
| 2012-04-20 04:00:00 | 26.78 |
| 2012-04-20 05:00:00 | 16.64 |
| 2012-04-20 06:00:00 | 11.18 |
| 2012-04-20 07:00:00 | 6.76 |
| 2012-04-20 08:00:00 | 19.24 |
| 2012-04-20 09:00:00 | 9.62 |
| 2012-04-20 10:00:00 | 11.7 |
| 2012-04-20 11:00:00 | 20.8 |
| 2012-04-20 12:00:00 | 3.9 |
| 2012-04-20 13:00:00 | 16.9 |
| 2012-04-20 14:00:00 | 15.08 |
| 2012-04-20 15:00:00 | 8.32 |
| 2012-04-20 16:00:00 | 21.84 |
| 2012-04-20 17:00:00 | 10.4 |
| 2012-04-20 18:00:00 | 12.74 |
| 2012-04-20 19:00:00 | 20.54 |
| 2012-04-20 20:00:00 | 7.02 |
| 2012-04-20 21:00:00 | 20.02 |
| 2012-04-20 22:00:00 | 13 |
| 2012-04-20 23:00:00 | 10.4 |
| 2012-04-21 | 24.96 |
| 2012-04-21 01:00:00 | 22.36 |
| 2012-04-21 02:00:00 | 10.92 |
| 2012-04-21 03:00:00 | 8.58 |
| 2012-04-21 04:00:00 | 16.9 |
| 2012-04-21 05:00:00 | 0 |
| 2012-04-21 06:00:00 | 17.16 |
| 2012-04-21 07:00:00 | 4.94 |
| 2012-04-21 08:00:00 | 12.48 |
| 2012-04-21 09:00:00 | 14.82 |
| 2012-04-21 10:00:00 | 6.5 |
| 2012-04-21 11:00:00 | 24.7 |
| 2012-04-21 12:00:00 | 11.18 |
| 2012-04-21 13:00:00 | 13.78 |
| 2012-04-21 14:00:00 | 21.32 |
| 2012-04-21 15:00:00 | 8.06 |
| 2012-04-21 16:00:00 | 16.64 |
| 2012-04-21 17:00:00 | 16.12 |
| 2012-04-21 18:00:00 | 6.24 |
| 2012-04-21 19:00:00 | 22.36 |
| 2012-04-21 20:00:00 | 9.88 |
| 2012-04-21 21:00:00 | 12.48 |
| 2012-04-21 22:00:00 | 20.54 |
| 2012-04-21 23:00:00 | 7.28 |
| 2012-04-22 | 13.52 |
| 2012-04-22 01:00:00 | 18.2 |
| 2012-04-22 02:00:00 | 2.6 |
| 2012-04-22 03:00:00 | 14.3 |
| 2012-04-22 04:00:00 | 9.62 |
| 2012-04-22 05:00:00 | 7.28 |
| 2012-04-22 06:00:00 | 15.6 |
| 2012-04-22 07:00:00 | 0.78 |
| 2012-04-22 08:00:00 | 17.16 |
| 2012-04-22 09:00:00 | 5.98 |
| 2012-04-22 10:00:00 | 14.82 |
| 2012-04-22 11:00:00 | 17.42 |
| 2012-04-22 12:00:00 | 8.06 |
| 2012-04-22 13:00:00 | 20.54 |
| 2012-04-22 14:00:00 | 12.74 |
| 2012-04-22 15:00:00 | 12.22 |
| 2012-04-22 16:00:00 | 21.32 |
| 2012-04-22 17:00:00 | 5.2 |
| 2012-04-22 18:00:00 | 15.34 |
| 2012-04-22 19:00:00 | 15.34 |
| 2012-04-22 20:00:00 | 6.5 |
| 2012-04-22 21:00:00 | 22.62 |
| 2012-04-22 22:00:00 | 29.64 |
| 2012-04-22 23:00:00 | 39.78 |
| 2012-04-23 | 39.52 |
| 2012-04-23 01:00:00 | 39.26 |
| 2012-04-23 02:00:00 | 39.26 |
| 2012-04-23 03:00:00 | 39.52 |
| 2012-04-23 04:00:00 | 39 |
| 2012-04-23 05:00:00 | 39.26 |
| 2012-04-23 06:00:00 | 38.74 |
| 2012-04-23 07:00:00 | 38.48 |
| 2012-04-23 08:00:00 | 38.48 |
| 2012-04-23 09:00:00 | 38.48 |
| 2012-04-23 10:00:00 | 39 |
| 2012-04-23 11:00:00 | 13 |
| 2012-04-23 12:00:00 | 25.74 |
| 2012-04-23 13:00:00 | 11.18 |
| 2012-04-23 14:00:00 | 13.52 |
| 2012-04-23 15:00:00 | 22.1 |
| 2012-04-23 16:00:00 | 8.58 |
| 2012-04-23 17:00:00 | 15.86 |
| 2012-04-23 18:00:00 | 18.98 |
| 2012-04-23 19:00:00 | 8.84 |
| 2012-04-23 20:00:00 | 21.84 |
| 2012-04-23 21:00:00 | 14.56 |
| 2012-04-23 22:00:00 | 14.56 |
| 2012-04-23 23:00:00 | 22.62 |
| 2012-04-24 | 8.32 |
| 2012-04-24 01:00:00 | 16.64 |
| 2012-04-24 02:00:00 | 16.64 |
| 2012-04-24 03:00:00 | 2.86 |
| 2012-04-24 04:00:00 | 16.9 |
| 2012-04-24 05:00:00 | 12.22 |
| 2012-04-24 06:00:00 | 4.94 |
| 2012-04-24 07:00:00 | 17.68 |
| 2012-04-24 08:00:00 | 13.52 |
| 2012-04-24 09:00:00 | 8.58 |
| 2012-04-24 10:00:00 | 21.84 |
| 2012-04-24 11:00:00 | 13.26 |
| 2012-04-24 12:00:00 | 7.28 |
| 2012-04-24 13:00:00 | 20.54 |
| 2012-04-24 14:00:00 | 11.44 |
| 2012-04-24 15:00:00 | 37.18 |
| 2012-04-24 16:00:00 | 27.56 |
| 2012-04-24 17:00:00 | 16.38 |
| 2012-04-24 18:00:00 | 9.1 |
| 2012-04-24 19:00:00 | 19.76 |
| 2012-04-24 20:00:00 | 15.6 |
| 2012-04-24 21:00:00 | 11.44 |
| 2012-04-24 22:00:00 | 26.52 |
| 2012-04-24 23:00:00 | 15.08 |
| 2012-04-25 | 22.88 |
| 2012-04-25 01:00:00 | 8.58 |
| 2012-04-25 02:00:00 | 14.3 |
| 2012-04-25 03:00:00 | 18.46 |
| 2012-04-25 04:00:00 | 3.12 |
| 2012-04-25 05:00:00 | 18.72 |
| 2012-04-25 06:00:00 | 10.66 |
| 2012-04-25 07:00:00 | 7.54 |
| 2012-04-25 08:00:00 | 20.54 |
| 2012-04-25 09:00:00 | 14.3 |
| 2012-04-25 10:00:00 | 8.84 |
| 2012-04-25 11:00:00 | 19.24 |
| 2012-04-25 12:00:00 | 15.34 |
| 2012-04-25 13:00:00 | 7.28 |
| 2012-04-25 14:00:00 | 17.42 |
| 2012-04-25 15:00:00 | 15.08 |
| 2012-04-25 16:00:00 | 5.46 |
| 2012-04-25 17:00:00 | 18.98 |
| 2012-04-25 18:00:00 | 14.3 |
| 2012-04-25 19:00:00 | 5.98 |
| 2012-04-25 20:00:00 | 20.02 |
| 2012-04-25 21:00:00 | 13.52 |
| 2012-04-25 22:00:00 | 11.44 |
| 2012-04-25 23:00:00 | 22.88 |
| 2012-04-26 | 8.32 |
| 2012-04-26 01:00:00 | 11.18 |
| 2012-04-26 02:00:00 | 15.86 |
| 2012-04-26 03:00:00 | 3.64 |
| 2012-04-26 04:00:00 | 12.22 |
| 2012-04-26 05:00:00 | 15.08 |
| 2012-04-26 06:00:00 | 0.26 |
| 2012-04-26 07:00:00 | 15.34 |
| 2012-04-26 08:00:00 | 14.56 |
| 2012-04-26 09:00:00 | 18.72 |
| 2012-04-26 10:00:00 | 17.16 |
| 2012-04-26 11:00:00 | 17.42 |
| 2012-04-26 12:00:00 | 16.9 |
| 2012-04-26 13:00:00 | 17.42 |
| 2012-04-26 14:00:00 | 17.16 |
| 2012-04-26 15:00:00 | 17.16 |
| 2012-04-26 16:00:00 | 17.16 |
| 2012-04-26 17:00:00 | 17.16 |
| 2012-04-26 18:00:00 | 17.16 |
| 2012-04-26 19:00:00 | 17.42 |
| 2012-04-26 20:00:00 | 17.42 |
| 2012-04-26 21:00:00 | 17.94 |
| 2012-04-26 22:00:00 | 18.46 |
| 2012-04-26 23:00:00 | 9.62 |
| 2012-04-27 | 20.54 |
| 2012-04-27 01:00:00 | 19.24 |
| 2012-04-27 02:00:00 | 17.42 |
| 2012-04-27 03:00:00 | 17.42 |
| 2012-04-27 04:00:00 | 16.9 |
| 2012-04-27 05:00:00 | 17.16 |
| 2012-04-27 06:00:00 | 16.9 |
| 2012-04-27 07:00:00 | 16.9 |
| 2012-04-27 08:00:00 | 17.94 |
| 2012-04-27 09:00:00 | 18.46 |
| 2012-04-27 10:00:00 | 18.98 |
| 2012-04-27 11:00:00 | 15.08 |
| 2012-04-27 12:00:00 | 11.44 |
| 2012-04-27 13:00:00 | 11.44 |
| 2012-04-27 14:00:00 | 11.44 |
| 2012-04-27 15:00:00 | 11.44 |
| 2012-04-27 16:00:00 | 11.18 |
| 2012-04-27 17:00:00 | 11.18 |
| 2012-04-27 18:00:00 | 11.44 |
| 2012-04-27 19:00:00 | 11.44 |
| 2012-04-27 20:00:00 | 11.44 |
| 2012-04-27 21:00:00 | 11.18 |
| 2012-04-27 22:00:00 | 11.44 |
| 2012-04-27 23:00:00 | 11.18 |
| 2012-04-28 | 10.66 |
| 2012-04-28 01:00:00 | 10.4 |
| 2012-04-28 02:00:00 | 10.14 |
| 2012-04-28 03:00:00 | 9.88 |
| 2012-04-28 04:00:00 | 9.88 |
| 2012-04-28 05:00:00 | 9.62 |
| 2012-04-28 06:00:00 | 9.88 |
| 2012-04-28 07:00:00 | 9.62 |
| 2012-04-28 08:00:00 | 9.62 |
| 2012-04-28 09:00:00 | 10.66 |
| 2012-04-28 10:00:00 | 10.92 |
| 2012-04-28 11:00:00 | 11.18 |
| 2012-04-28 12:00:00 | 12.22 |
| 2012-04-28 13:00:00 | 11.96 |
| 2012-04-28 14:00:00 | 11.18 |
| 2012-04-28 15:00:00 | 10.14 |
| 2012-04-28 16:00:00 | 12.48 |
| 2012-04-28 17:00:00 | 10.4 |
| 2012-04-28 18:00:00 | 10.4 |
| 2012-04-28 19:00:00 | 10.4 |
| 2012-04-28 20:00:00 | 10.14 |
| 2012-04-28 21:00:00 | 9.88 |
| 2012-04-28 22:00:00 | 11.18 |
| 2012-04-28 23:00:00 | 11.44 |
| 2012-04-29 | 10.4 |
| 2012-04-29 01:00:00 | 9.88 |
| 2012-04-29 02:00:00 | 8.32 |
| 2012-04-29 03:00:00 | 7.54 |
| 2012-04-29 04:00:00 | 9.62 |
| 2012-04-29 05:00:00 | 8.32 |
| 2012-04-29 06:00:00 | 6.5 |
| 2012-04-29 07:00:00 | 7.02 |
| 2012-04-29 08:00:00 | 9.36 |
| 2012-04-29 09:00:00 | 9.1 |
| 2012-04-29 10:00:00 | 10.14 |
| 2012-04-29 11:00:00 | 10.66 |
| 2012-04-29 12:00:00 | 11.7 |
| 2012-04-29 13:00:00 | 11.18 |
| 2012-04-29 14:00:00 | 10.14 |
| 2012-04-29 15:00:00 | 12.22 |
| 2012-04-29 16:00:00 | 28.34 |
| 2012-04-29 17:00:00 | 10.14 |
| 2012-04-29 18:00:00 | 8.58 |
| 2012-04-29 19:00:00 | 9.62 |
| 2012-04-29 20:00:00 | 10.14 |
| 2012-04-29 21:00:00 | 9.88 |
| 2012-04-29 22:00:00 | 9.62 |
| 2012-04-29 23:00:00 | 12.22 |
| 2012-04-30 | 9.62 |
| 2012-04-30 01:00:00 | 8.06 |
| 2012-04-30 02:00:00 | 8.32 |
| 2012-04-30 03:00:00 | 8.06 |
| 2012-04-30 04:00:00 | 6.76 |
| 2012-04-30 05:00:00 | 6.5 |
| 2012-04-30 06:00:00 | 6.76 |
| 2012-04-30 07:00:00 | 8.32 |
| 2012-04-30 08:00:00 | 8.58 |
| 2012-04-30 09:00:00 | 9.1 |
| 2012-04-30 10:00:00 | 9.1 |
| 2012-04-30 11:00:00 | 11.18 |
| 2012-04-30 12:00:00 | 9.36 |
| 2012-04-30 13:00:00 | 9.62 |
| 2012-04-30 14:00:00 | 10.14 |
| 2012-04-30 15:00:00 | 8.84 |
| 2012-04-30 16:00:00 | 10.66 |
| 2012-04-30 17:00:00 | 9.36 |
| 2012-04-30 18:00:00 | 9.1 |
| 2012-04-30 19:00:00 | 9.36 |
| 2012-04-30 20:00:00 | 8.06 |
| 2012-04-30 21:00:00 | 8.84 |
| 2012-04-30 22:00:00 | 9.36 |
| 2012-04-30 23:00:00 | 9.88 |
| 2012-05-01 | 9.88 |
| 2012-05-01 01:00:00 | 8.84 |
| 2012-05-01 02:00:00 | 8.06 |
| 2012-05-01 03:00:00 | 7.02 |
| 2012-05-01 04:00:00 | 6.24 |
| 2012-05-01 05:00:00 | 8.06 |
| 2012-05-01 06:00:00 | 7.8 |
| 2012-05-01 07:00:00 | 6.24 |
| 2012-05-01 08:00:00 | 7.02 |
| 2012-05-01 09:00:00 | 8.84 |
| 2012-05-01 10:00:00 | 9.88 |
| 2012-05-01 11:00:00 | 9.62 |
| 2012-05-01 12:00:00 | 12.48 |
| 2012-05-01 13:00:00 | 10.66 |
| 2012-05-01 14:00:00 | 11.7 |
| 2012-05-01 15:00:00 | 10.4 |
| 2012-05-01 16:00:00 | 9.88 |
| 2012-05-01 17:00:00 | 11.96 |
| 2012-05-01 18:00:00 | 10.66 |
| 2012-05-01 19:00:00 | 9.88 |
| 2012-05-01 20:00:00 | 9.62 |
| 2012-05-01 21:00:00 | 12.22 |
| 2012-05-01 22:00:00 | 10.4 |
| 2012-05-01 23:00:00 | 11.96 |
| 2012-05-02 | 9.62 |
| 2012-05-02 01:00:00 | 9.62 |
| 2012-05-02 02:00:00 | 9.36 |
| 2012-05-02 03:00:00 | 8.58 |
| 2012-05-02 04:00:00 | 7.54 |
| 2012-05-02 05:00:00 | 6.76 |
| 2012-05-02 06:00:00 | 6.5 |
| 2012-05-02 07:00:00 | 8.84 |
| 2012-05-02 08:00:00 | 8.84 |
| 2012-05-02 09:00:00 | 10.14 |
| 2012-05-02 10:00:00 | 9.88 |
| 2012-05-02 11:00:00 | 9.88 |
| 2012-05-02 12:00:00 | 9.36 |
| 2012-05-02 13:00:00 | 9.62 |
| 2012-05-02 14:00:00 | 9.62 |
| 2012-05-02 15:00:00 | 9.62 |
| 2012-05-02 16:00:00 | 9.62 |
| 2012-05-02 17:00:00 | 8.58 |
| 2012-05-02 18:00:00 | 8.84 |
| 2012-05-02 19:00:00 | 9.1 |
| 2012-05-02 20:00:00 | 10.14 |
| 2012-05-02 21:00:00 | 11.44 |
| 2012-05-02 22:00:00 | 11.18 |
| 2012-05-02 23:00:00 | 12.74 |
| 2012-05-03 | 11.18 |
| 2012-05-03 01:00:00 | 10.14 |
| 2012-05-03 02:00:00 | 9.88 |
| 2012-05-03 03:00:00 | 8.06 |
| 2012-05-03 04:00:00 | 9.62 |
| 2012-05-03 05:00:00 | 38.22 |
| 2012-05-03 06:00:00 | 9.88 |
| 2012-05-03 07:00:00 | 7.28 |
| 2012-05-03 08:00:00 | 9.62 |
| 2012-05-03 09:00:00 | 10.4 |
| 2012-05-03 10:00:00 | 10.14 |
| 2012-05-03 11:00:00 | 10.14 |
| 2012-05-03 12:00:00 | 10.4 |
| 2012-05-03 13:00:00 | 10.14 |
| 2012-05-03 14:00:00 | 10.66 |
| 2012-05-03 15:00:00 | 10.14 |
| 2012-05-03 16:00:00 | 9.62 |
| 2012-05-03 17:00:00 | 10.14 |
| 2012-05-03 18:00:00 | 10.14 |
| 2012-05-03 19:00:00 | 9.88 |
| 2012-05-03 20:00:00 | 10.4 |
| 2012-05-03 21:00:00 | 10.66 |
| 2012-05-03 22:00:00 | 11.96 |
| 2012-05-03 23:00:00 | 10.4 |
| 2012-05-04 | 13.52 |
| 2012-05-04 01:00:00 | 31.2 |
| 2012-05-04 02:00:00 | 37.7 |
| 2012-05-04 03:00:00 | 11.44 |
| 2012-05-04 04:00:00 | 9.88 |
| 2012-05-04 05:00:00 | 8.58 |
| 2012-05-04 06:00:00 | 7.28 |
| 2012-05-04 07:00:00 | 8.58 |
| 2012-05-04 08:00:00 | 9.62 |
| 2012-05-04 09:00:00 | 10.14 |
| 2012-05-04 10:00:00 | 10.4 |
| 2012-05-04 11:00:00 | 9.62 |
| 2012-05-04 12:00:00 | 8.58 |
| 2012-05-04 13:00:00 | 9.36 |
| 2012-05-04 14:00:00 | 27.04 |
| 2012-05-04 15:00:00 | 39 |
| 2012-05-04 16:00:00 | 39 |
| 2012-05-04 17:00:00 | 39 |
| 2012-05-04 18:00:00 | 39 |
| 2012-05-04 19:00:00 | 39 |
| 2012-05-04 20:00:00 | 39 |
| 2012-05-04 21:00:00 | 39 |
| 2012-05-04 22:00:00 | 39 |
| 2012-05-04 23:00:00 | 38.48 |
| 2012-05-05 | 39 |
| 2012-05-05 01:00:00 | 38.74 |
| 2012-05-05 02:00:00 | 38.74 |
| 2012-05-05 03:00:00 | 38.74 |
| 2012-05-05 04:00:00 | 38.74 |
| 2012-05-05 05:00:00 | 38.74 |
| 2012-05-05 06:00:00 | 38.48 |
| 2012-05-05 07:00:00 | 38.74 |
| 2012-05-05 08:00:00 | 38.74 |
| 2012-05-05 09:00:00 | 38.48 |
| 2012-05-05 10:00:00 | 38.74 |
| 2012-05-05 11:00:00 | 38.74 |
| 2012-05-05 12:00:00 | 38.74 |
| 2012-05-05 13:00:00 | 38.48 |
| 2012-05-05 14:00:00 | 38.74 |
| 2012-05-05 15:00:00 | 38.74 |
| 2012-05-05 16:00:00 | 38.22 |
| 2012-05-05 17:00:00 | 38.22 |
| 2012-05-05 18:00:00 | 37.96 |
| 2012-05-05 19:00:00 | 25.74 |
| 2012-05-05 20:00:00 | 17.68 |
| 2012-05-05 21:00:00 | 18.46 |
| 2012-05-05 22:00:00 | 19.5 |
| 2012-05-05 23:00:00 | 17.42 |
| 2012-05-06 | 15.86 |
| 2012-05-06 01:00:00 | 13.52 |
| 2012-05-06 02:00:00 | 12.74 |
| 2012-05-06 03:00:00 | 12.22 |
| 2012-05-06 04:00:00 | 12.22 |
| 2012-05-06 05:00:00 | 10.66 |
| 2012-05-06 06:00:00 | 12.48 |
| 2012-05-06 07:00:00 | 11.18 |
| 2012-05-06 08:00:00 | 12.22 |
| 2012-05-06 09:00:00 | 12.22 |
| 2012-05-06 10:00:00 | 12.74 |
| 2012-05-06 11:00:00 | 14.82 |
| 2012-05-06 12:00:00 | 14.04 |
| 2012-05-06 13:00:00 | 14.3 |
| 2012-05-06 14:00:00 | 14.04 |
| 2012-05-06 15:00:00 | 13.78 |
| 2012-05-06 16:00:00 | 12.74 |
| 2012-05-06 17:00:00 | 12.48 |
| 2012-05-06 18:00:00 | 12.74 |
| 2012-05-06 19:00:00 | 10.92 |
| 2012-05-06 20:00:00 | 14.04 |
| 2012-05-06 21:00:00 | 13.78 |
| 2012-05-06 22:00:00 | 13.52 |
| 2012-05-06 23:00:00 | 13 |
| 2012-05-07 | 27.3 |
| 2012-05-07 01:00:00 | 39.52 |
| 2012-05-07 02:00:00 | 39.52 |
| 2012-05-07 03:00:00 | 39.78 |
| 2012-05-07 04:00:00 | 39.52 |
| 2012-05-07 05:00:00 | 39.52 |
| 2012-05-07 06:00:00 | 39.52 |
| 2012-05-07 07:00:00 | 39.52 |
| 2012-05-07 08:00:00 | 39.26 |
| 2012-05-07 09:00:00 | 39.26 |
| 2012-05-07 10:00:00 | 38.74 |
| 2012-05-07 11:00:00 | 22.36 |
| 2012-05-07 12:00:00 | 14.3 |
| 2012-05-07 13:00:00 | 13.78 |
| 2012-05-07 14:00:00 | 17.68 |
| 2012-05-07 15:00:00 | 17.42 |
| 2012-05-07 16:00:00 | 16.12 |
| 2012-05-07 17:00:00 | 15.08 |
| 2012-05-07 18:00:00 | 14.82 |
| 2012-05-07 19:00:00 | 14.3 |
| 2012-05-07 20:00:00 | 14.56 |
| 2012-05-07 21:00:00 | 14.82 |
| 2012-05-07 22:00:00 | 15.34 |
| 2012-05-07 23:00:00 | 15.08 |
| 2012-05-08 | 14.04 |
| 2012-05-08 01:00:00 | 13.26 |
| 2012-05-08 02:00:00 | 12.48 |
| 2012-05-08 03:00:00 | 11.7 |
| 2012-05-08 04:00:00 | 11.18 |
| 2012-05-08 05:00:00 | 11.18 |
| 2012-05-08 06:00:00 | 11.18 |
| 2012-05-08 07:00:00 | 11.18 |
| 2012-05-08 08:00:00 | 11.44 |
| 2012-05-08 09:00:00 | 12.48 |
| 2012-05-08 10:00:00 | 13.26 |
| 2012-05-08 11:00:00 | 18.46 |
| 2012-05-08 12:00:00 | 19.24 |
| 2012-05-08 13:00:00 | 15.08 |
| 2012-05-08 14:00:00 | 14.82 |
| 2012-05-08 15:00:00 | 14.3 |
| 2012-05-08 16:00:00 | 13.26 |
| 2012-05-08 17:00:00 | 12.48 |
| 2012-05-08 18:00:00 | 21.58 |
| 2012-05-08 19:00:00 | 19.5 |
| 2012-05-08 20:00:00 | 20.54 |
| 2012-05-08 21:00:00 | 23.4 |
| 2012-05-08 22:00:00 | 23.92 |
| 2012-05-08 23:00:00 | 23.14 |
| 2012-05-09 | 20.02 |
| 2012-05-09 01:00:00 | 16.9 |
| 2012-05-09 02:00:00 | 13.52 |
| 2012-05-09 03:00:00 | 13.26 |
| 2012-05-09 04:00:00 | 11.96 |
| 2012-05-09 05:00:00 | 12.74 |
| 2012-05-09 06:00:00 | 12.74 |
| 2012-05-09 07:00:00 | 13 |
| 2012-05-09 08:00:00 | 14.04 |
| 2012-05-09 09:00:00 | 16.12 |
| 2012-05-09 10:00:00 | 15.6 |
| 2012-05-09 11:00:00 | 14.82 |
| 2012-05-09 12:00:00 | 13.52 |
| 2012-05-09 13:00:00 | 13.52 |
| 2012-05-09 14:00:00 | 13.78 |
| 2012-05-09 15:00:00 | 13 |
| 2012-05-09 16:00:00 | 13 |
| 2012-05-09 17:00:00 | 13 |
| 2012-05-09 18:00:00 | 12.22 |
| 2012-05-09 19:00:00 | 13 |
| 2012-05-09 20:00:00 | 13 |
| 2012-05-09 21:00:00 | 13 |
| 2012-05-09 22:00:00 | 13 |
| 2012-05-09 23:00:00 | 13 |
| 2012-05-10 | 12.22 |
| 2012-05-10 01:00:00 | 12.22 |
| 2012-05-10 02:00:00 | 9.36 |
| 2012-05-10 03:00:00 | 9.36 |
| 2012-05-10 04:00:00 | 9.88 |
| 2012-05-10 05:00:00 | 8.06 |
| 2012-05-10 06:00:00 | 8.06 |
| 2012-05-10 07:00:00 | 10.4 |
| 2012-05-10 08:00:00 | 10.66 |
| 2012-05-10 09:00:00 | 11.18 |
| 2012-05-10 10:00:00 | 12.48 |
| 2012-05-10 11:00:00 | 11.7 |
| 2012-05-10 12:00:00 | 11.7 |
| 2012-05-10 13:00:00 | 10.92 |
| 2012-05-10 14:00:00 | 10.66 |
| 2012-05-10 15:00:00 | 11.18 |
| 2012-05-10 16:00:00 | 10.92 |
| 2012-05-10 17:00:00 | 11.7 |
| 2012-05-10 18:00:00 | 10.92 |
| 2012-05-10 19:00:00 | 10.92 |
| 2012-05-10 20:00:00 | 11.7 |
| 2012-05-10 21:00:00 | 12.74 |
| 2012-05-10 22:00:00 | 13 |
| 2012-05-10 23:00:00 | 12.74 |
| 2012-05-11 | 13 |
| 2012-05-11 01:00:00 | 11.96 |
| 2012-05-11 02:00:00 | 10.4 |
| 2012-05-11 03:00:00 | 8.06 |
| 2012-05-11 04:00:00 | 8.84 |
| 2012-05-11 05:00:00 | 8.84 |
| 2012-05-11 06:00:00 | 7.02 |
| 2012-05-11 07:00:00 | 9.62 |
| 2012-05-11 08:00:00 | 10.4 |
| 2012-05-11 09:00:00 | 10.66 |
| 2012-05-11 10:00:00 | 12.48 |
| 2012-05-11 11:00:00 | 21.58 |
| 2012-05-11 12:00:00 | 38.48 |
| 2012-05-11 13:00:00 | 37.96 |
| 2012-05-11 14:00:00 | 21.58 |
| 2012-05-11 15:00:00 | 11.7 |
| 2012-05-11 16:00:00 | 12.48 |
| 2012-05-11 17:00:00 | 8.32 |
| 2012-05-11 18:00:00 | 12.74 |
| 2012-05-11 19:00:00 | 12.74 |
| 2012-05-11 20:00:00 | 5.72 |
| 2012-05-11 21:00:00 | 16.9 |
| 2012-05-11 22:00:00 | 12.48 |
| 2012-05-11 23:00:00 | 4.68 |
| 2012-05-12 | 17.16 |
| 2012-05-12 01:00:00 | 10.14 |
| 2012-05-12 02:00:00 | 9.36 |
| 2012-05-12 03:00:00 | 10.14 |
| 2012-05-12 04:00:00 | 5.98 |
| 2012-05-12 05:00:00 | 10.14 |
| 2012-05-12 06:00:00 | 4.42 |
| 2012-05-12 07:00:00 | 10.66 |
| 2012-05-12 08:00:00 | 5.46 |
| 2012-05-12 09:00:00 | 13 |
| 2012-05-12 10:00:00 | 7.02 |
| 2012-05-12 11:00:00 | 13.52 |
| 2012-05-12 12:00:00 | 12.74 |
| 2012-05-12 13:00:00 | 18.46 |
| 2012-05-12 14:00:00 | 38.74 |
| 2012-05-12 15:00:00 | 38.74 |
| 2012-05-12 16:00:00 | 38.74 |
| 2012-05-12 17:00:00 | 39 |
| 2012-05-12 18:00:00 | 38.74 |
| 2012-05-12 19:00:00 | 39 |
| 2012-05-12 20:00:00 | 39.26 |
| 2012-05-12 21:00:00 | 39 |
| 2012-05-12 22:00:00 | 39 |
| 2012-05-12 23:00:00 | 39 |
| 2012-05-13 | 38.74 |
| 2012-05-13 01:00:00 | 38.74 |
| 2012-05-13 02:00:00 | 38.22 |
| 2012-05-13 03:00:00 | 34.32 |
| 2012-05-13 04:00:00 | 4.94 |
| 2012-05-13 05:00:00 | 12.22 |
| 2012-05-13 06:00:00 | 13.52 |
| 2012-05-13 07:00:00 | 3.12 |
| 2012-05-13 08:00:00 | 16.9 |
| 2012-05-13 09:00:00 | 10.66 |
| 2012-05-13 10:00:00 | 18.72 |
| 2012-05-13 11:00:00 | 17.16 |
| 2012-05-13 12:00:00 | 10.92 |
| 2012-05-13 13:00:00 | 25.48 |
| 2012-05-13 14:00:00 | 10.66 |
| 2012-05-13 15:00:00 | 20.28 |
| 2012-05-13 16:00:00 | 14.3 |
| 2012-05-13 17:00:00 | 9.36 |
| 2012-05-13 18:00:00 | 22.1 |
| 2012-05-13 19:00:00 | 9.36 |
| 2012-05-13 20:00:00 | 14.04 |
| 2012-05-13 21:00:00 | 19.76 |
| 2012-05-13 22:00:00 | 10.4 |
| 2012-05-13 23:00:00 | 25.22 |
| 2012-05-14 | 11.96 |
| 2012-05-14 01:00:00 | 18.46 |
| 2012-05-14 02:00:00 | 8.06 |
| 2012-05-14 03:00:00 | 9.1 |
| 2012-05-14 04:00:00 | 13.78 |
| 2012-05-14 05:00:00 | 6.5 |
| 2012-05-14 06:00:00 | 8.84 |
| 2012-05-14 07:00:00 | 15.6 |
| 2012-05-14 08:00:00 | 5.46 |
| 2012-05-14 09:00:00 | 13.52 |
| 2012-05-14 10:00:00 | 19.24 |
| 2012-05-14 11:00:00 | 7.28 |
| 2012-05-14 12:00:00 | 13.52 |
| 2012-05-14 13:00:00 | 20.8 |
| 2012-05-14 14:00:00 | 13.52 |
| 2012-05-14 15:00:00 | 10.66 |
| 2012-05-14 16:00:00 | 10.14 |
| 2012-05-14 17:00:00 | 10.14 |
| 2012-05-14 18:00:00 | 9.1 |
| 2012-05-14 19:00:00 | 10.66 |
| 2012-05-14 20:00:00 | 11.7 |
| 2012-05-14 21:00:00 | 11.7 |
| 2012-05-14 22:00:00 | 12.48 |
| 2012-05-14 23:00:00 | 12.22 |
| 2012-05-15 | 10.92 |
| 2012-05-15 01:00:00 | 10.14 |
| 2012-05-15 02:00:00 | 9.88 |
| 2012-05-15 03:00:00 | 8.06 |
| 2012-05-15 04:00:00 | 6.24 |
| 2012-05-15 05:00:00 | 8.32 |
| 2012-05-15 06:00:00 | 7.54 |
| 2012-05-15 07:00:00 | 6.76 |
| 2012-05-15 08:00:00 | 10.4 |
| 2012-05-15 09:00:00 | 10.4 |
| 2012-05-15 10:00:00 | 10.4 |
| 2012-05-15 11:00:00 | 10.4 |
| 2012-05-15 12:00:00 | 10.14 |
| 2012-05-15 13:00:00 | 10.66 |
| 2012-05-15 14:00:00 | 10.4 |
| 2012-05-15 15:00:00 | 10.4 |
| 2012-05-15 16:00:00 | 9.88 |
| 2012-05-15 17:00:00 | 10.4 |
| 2012-05-15 18:00:00 | 10.4 |
| 2012-05-15 19:00:00 | 10.66 |
| 2012-05-15 20:00:00 | 10.4 |
| 2012-05-15 21:00:00 | 11.96 |
| 2012-05-15 22:00:00 | 11.96 |
| 2012-05-15 23:00:00 | 12.48 |
| 2012-05-16 | 10.92 |
| 2012-05-16 01:00:00 | 10.14 |
| 2012-05-16 02:00:00 | 9.36 |
| 2012-05-16 03:00:00 | 7.28 |
| 2012-05-16 04:00:00 | 8.06 |
| 2012-05-16 05:00:00 | 7.8 |
| 2012-05-16 06:00:00 | 6.24 |
| 2012-05-16 07:00:00 | 9.1 |
| 2012-05-16 08:00:00 | 9.62 |
| 2012-05-16 09:00:00 | 10.14 |
| 2012-05-16 10:00:00 | 10.66 |
| 2012-05-16 11:00:00 | 10.14 |
| 2012-05-16 12:00:00 | 10.14 |
| 2012-05-16 13:00:00 | 9.88 |
| 2012-05-16 14:00:00 | 9.88 |
| 2012-05-16 15:00:00 | 9.88 |
| 2012-05-16 16:00:00 | 9.88 |
| 2012-05-16 17:00:00 | 9.88 |
| 2012-05-16 18:00:00 | 10.4 |
| 2012-05-16 19:00:00 | 11.44 |
| 2012-05-16 20:00:00 | 10.14 |
| 2012-05-16 21:00:00 | 10.66 |
| 2012-05-16 22:00:00 | 12.22 |
| 2012-05-16 23:00:00 | 11.96 |
| 2012-05-17 | 10.92 |
| 2012-05-17 01:00:00 | 10.4 |
| 2012-05-17 02:00:00 | 8.84 |
| 2012-05-17 03:00:00 | 6.76 |
| 2012-05-17 04:00:00 | 8.06 |
| 2012-05-17 05:00:00 | 7.28 |
| 2012-05-17 06:00:00 | 5.98 |
| 2012-05-17 07:00:00 | 7.8 |
| 2012-05-17 08:00:00 | 9.1 |
| 2012-05-17 09:00:00 | 10.4 |
| 2012-05-17 10:00:00 | 10.66 |
| 2012-05-17 11:00:00 | 10.14 |
| 2012-05-17 12:00:00 | 9.88 |
| 2012-05-17 13:00:00 | 10.14 |
| 2012-05-17 14:00:00 | 9.88 |
| 2012-05-17 15:00:00 | 10.4 |
| 2012-05-17 16:00:00 | 9.36 |
| 2012-05-17 17:00:00 | 9.88 |
| 2012-05-17 18:00:00 | 10.92 |
| 2012-05-17 19:00:00 | 10.92 |
| 2012-05-17 20:00:00 | 10.14 |
| 2012-05-17 21:00:00 | 9.62 |
| 2012-05-17 22:00:00 | 13 |
| 2012-05-17 23:00:00 | 11.96 |
| 2012-05-18 | 10.4 |
| 2012-05-18 01:00:00 | 10.14 |
| 2012-05-18 02:00:00 | 9.36 |
| 2012-05-18 03:00:00 | 8.32 |
| 2012-05-18 04:00:00 | 6.24 |
| 2012-05-18 05:00:00 | 7.54 |
| 2012-05-18 06:00:00 | 7.28 |
| 2012-05-18 07:00:00 | 6.5 |
| 2012-05-18 08:00:00 | 8.32 |
| 2012-05-18 09:00:00 | 10.14 |
| 2012-05-18 10:00:00 | 11.7 |
| 2012-05-18 11:00:00 | 10.4 |
| 2012-05-18 12:00:00 | 11.44 |
| 2012-05-18 13:00:00 | 10.14 |
| 2012-05-18 14:00:00 | 10.92 |
| 2012-05-18 15:00:00 | 10.14 |
| 2012-05-18 16:00:00 | 11.96 |
| 2012-05-18 17:00:00 | 18.72 |
| 2012-05-18 18:00:00 | 11.18 |
| 2012-05-18 19:00:00 | 10.92 |
| 2012-05-18 20:00:00 | 11.18 |
| 2012-05-18 21:00:00 | 10.4 |
| 2012-05-18 22:00:00 | 13 |
| 2012-05-18 23:00:00 | 11.7 |
| 2012-05-19 | 9.88 |
| 2012-05-19 01:00:00 | 10.14 |
| 2012-05-19 02:00:00 | 10.14 |
| 2012-05-19 03:00:00 | 8.58 |
| 2012-05-19 04:00:00 | 6.5 |
| 2012-05-19 05:00:00 | 5.98 |
| 2012-05-19 06:00:00 | 7.54 |
| 2012-05-19 07:00:00 | 7.02 |
| 2012-05-19 08:00:00 | 6.5 |
| 2012-05-19 09:00:00 | 7.8 |
| 2012-05-19 10:00:00 | 10.66 |
| 2012-05-19 11:00:00 | 12.22 |
| 2012-05-19 12:00:00 | 11.7 |
| 2012-05-19 13:00:00 | 12.48 |
| 2012-05-19 14:00:00 | 12.48 |
| 2012-05-19 15:00:00 | 12.48 |
| 2012-05-19 16:00:00 | 12.22 |
| 2012-05-19 17:00:00 | 9.88 |
| 2012-05-19 18:00:00 | 10.66 |
| 2012-05-19 19:00:00 | 10.4 |
| 2012-05-19 20:00:00 | 10.14 |
| 2012-05-19 21:00:00 | 11.18 |
| 2012-05-19 22:00:00 | 10.66 |
| 2012-05-19 23:00:00 | 10.4 |
| 2012-05-20 | 9.88 |
| 2012-05-20 01:00:00 | 9.88 |
| 2012-05-20 02:00:00 | 9.36 |
| 2012-05-20 03:00:00 | 8.32 |
| 2012-05-20 04:00:00 | 6.5 |
| 2012-05-20 05:00:00 | 7.02 |
| 2012-05-20 06:00:00 | 7.8 |
| 2012-05-20 07:00:00 | 7.02 |
| 2012-05-20 08:00:00 | 6.24 |
| 2012-05-20 09:00:00 | 8.06 |
| 2012-05-20 10:00:00 | 10.92 |
| 2012-05-20 11:00:00 | 11.7 |
| 2012-05-20 12:00:00 | 10.92 |
| 2012-05-20 13:00:00 | 13.52 |
| 2012-05-20 14:00:00 | 11.7 |
| 2012-05-20 15:00:00 | 11.44 |
| 2012-05-20 16:00:00 | 10.14 |
| 2012-05-20 17:00:00 | 11.44 |
| 2012-05-20 18:00:00 | 9.88 |
| 2012-05-20 19:00:00 | 9.88 |
| 2012-05-20 20:00:00 | 10.14 |
| 2012-05-20 21:00:00 | 10.14 |
| 2012-05-20 22:00:00 | 11.96 |
| 2012-05-20 23:00:00 | 11.96 |
| 2012-05-21 | 11.7 |
| 2012-05-21 01:00:00 | 9.88 |
| 2012-05-21 02:00:00 | 7.8 |
| 2012-05-21 03:00:00 | 6.76 |
| 2012-05-21 04:00:00 | 7.54 |
| 2012-05-21 05:00:00 | 6.76 |
| 2012-05-21 06:00:00 | 6.76 |
| 2012-05-21 07:00:00 | 6.5 |
| 2012-05-21 08:00:00 | 8.32 |
| 2012-05-21 09:00:00 | 10.4 |
| 2012-05-21 10:00:00 | 10.4 |
| 2012-05-21 11:00:00 | 10.14 |
| 2012-05-21 12:00:00 | 9.88 |
| 2012-05-21 13:00:00 | 9.88 |
| 2012-05-21 14:00:00 | 9.36 |
| 2012-05-21 15:00:00 | 9.62 |
| 2012-05-21 16:00:00 | 9.1 |
| 2012-05-21 17:00:00 | 9.62 |
| 2012-05-21 18:00:00 | 9.1 |
| 2012-05-21 19:00:00 | 9.62 |
| 2012-05-21 20:00:00 | 9.88 |
| 2012-05-21 21:00:00 | 10.14 |
| 2012-05-21 22:00:00 | 11.18 |
| 2012-05-21 23:00:00 | 11.44 |
| 2012-05-22 | 10.66 |
| 2012-05-22 01:00:00 | 9.88 |
| 2012-05-22 02:00:00 | 8.06 |
| 2012-05-22 03:00:00 | 7.8 |
| 2012-05-22 04:00:00 | 7.54 |
| 2012-05-22 05:00:00 | 6.76 |
| 2012-05-22 06:00:00 | 6.5 |
| 2012-05-22 07:00:00 | 6.5 |
| 2012-05-22 08:00:00 | 7.28 |
| 2012-05-22 09:00:00 | 9.36 |
| 2012-05-22 10:00:00 | 11.18 |
| 2012-05-22 11:00:00 | 10.14 |
| 2012-05-22 12:00:00 | 10.4 |
| 2012-05-22 13:00:00 | 9.88 |
| 2012-05-22 14:00:00 | 9.1 |
| 2012-05-22 15:00:00 | 9.62 |
| 2012-05-22 16:00:00 | 9.36 |
| 2012-05-22 17:00:00 | 9.62 |
| 2012-05-22 18:00:00 | 9.36 |
| 2012-05-22 19:00:00 | 9.88 |
| 2012-05-22 20:00:00 | 9.88 |
| 2012-05-22 21:00:00 | 9.62 |
| 2012-05-22 22:00:00 | 12.48 |
| 2012-05-22 23:00:00 | 11.44 |
| 2012-05-23 | 10.4 |
| 2012-05-23 01:00:00 | 9.62 |
| 2012-05-23 02:00:00 | 8.84 |
| 2012-05-23 03:00:00 | 7.02 |
| 2012-05-23 04:00:00 | 6.24 |
| 2012-05-23 05:00:00 | 6.24 |
| 2012-05-23 06:00:00 | 5.72 |
| 2012-05-23 07:00:00 | 7.8 |
| 2012-05-23 08:00:00 | 8.06 |
| 2012-05-23 09:00:00 | 9.36 |
| 2012-05-23 10:00:00 | 10.4 |
| 2012-05-23 11:00:00 | 9.1 |
| 2012-05-23 12:00:00 | 10.92 |
| 2012-05-23 13:00:00 | 11.7 |
| 2012-05-23 14:00:00 | 10.14 |
| 2012-05-23 15:00:00 | 9.1 |
| 2012-05-23 16:00:00 | 8.84 |
| 2012-05-23 17:00:00 | 8.58 |
| 2012-05-23 18:00:00 | 8.84 |
| 2012-05-23 19:00:00 | 9.88 |
| 2012-05-23 20:00:00 | 9.88 |
| 2012-05-23 21:00:00 | 9.1 |
| 2012-05-23 22:00:00 | 12.22 |
| 2012-05-23 23:00:00 | 10.92 |
| 2012-05-24 | 10.14 |
| 2012-05-24 01:00:00 | 9.88 |
| 2012-05-24 02:00:00 | 7.54 |
| 2012-05-24 03:00:00 | 8.06 |
| 2012-05-24 04:00:00 | 7.02 |
| 2012-05-24 05:00:00 | 6.24 |
| 2012-05-24 06:00:00 | 5.46 |
| 2012-05-24 07:00:00 | 6.24 |
| 2012-05-24 08:00:00 | 8.06 |
| 2012-05-24 09:00:00 | 9.36 |
| 2012-05-24 10:00:00 | 9.88 |
| 2012-05-24 11:00:00 | 9.36 |
| 2012-05-24 12:00:00 | 9.62 |
| 2012-05-24 13:00:00 | 9.1 |
| 2012-05-24 14:00:00 | 8.06 |
| 2012-05-24 15:00:00 | 9.36 |
| 2012-05-24 16:00:00 | 8.32 |
| 2012-05-24 17:00:00 | 9.62 |
| 2012-05-24 18:00:00 | 9.1 |
| 2012-05-24 19:00:00 | 9.36 |
| 2012-05-24 20:00:00 | 9.62 |
| 2012-05-24 21:00:00 | 9.62 |
| 2012-05-24 22:00:00 | 10.4 |
| 2012-05-24 23:00:00 | 9.88 |
| 2012-05-25 | 11.7 |
| 2012-05-25 01:00:00 | 8.58 |
| 2012-05-25 02:00:00 | 7.54 |
| 2012-05-25 03:00:00 | 8.06 |
| 2012-05-25 04:00:00 | 6.5 |
| 2012-05-25 05:00:00 | 5.72 |
| 2012-05-25 06:00:00 | 5.72 |
| 2012-05-25 07:00:00 | 5.98 |
| 2012-05-25 08:00:00 | 8.32 |
| 2012-05-25 09:00:00 | 9.1 |
| 2012-05-25 10:00:00 | 9.88 |
| 2012-05-25 11:00:00 | 10.4 |
| 2012-05-25 12:00:00 | 9.62 |
| 2012-05-25 13:00:00 | 9.62 |
| 2012-05-25 14:00:00 | 8.84 |
| 2012-05-25 15:00:00 | 9.62 |
| 2012-05-25 16:00:00 | 9.1 |
| 2012-05-25 17:00:00 | 8.84 |
| 2012-05-25 18:00:00 | 9.1 |
| 2012-05-25 19:00:00 | 9.88 |
| 2012-05-25 20:00:00 | 10.4 |
| 2012-05-25 21:00:00 | 10.14 |
| 2012-05-25 22:00:00 | 10.92 |
| 2012-05-25 23:00:00 | 10.66 |
| 2012-05-26 | 9.88 |
| 2012-05-26 01:00:00 | 9.36 |
| 2012-05-26 02:00:00 | 8.58 |
| 2012-05-26 03:00:00 | 6.5 |
| 2012-05-26 04:00:00 | 7.02 |
| 2012-05-26 05:00:00 | 6.76 |
| 2012-05-26 06:00:00 | 5.98 |
| 2012-05-26 07:00:00 | 5.72 |
| 2012-05-26 08:00:00 | 6.24 |
| 2012-05-26 09:00:00 | 8.32 |
| 2012-05-26 10:00:00 | 10.14 |
| 2012-05-26 11:00:00 | 9.62 |
| 2012-05-26 12:00:00 | 12.22 |
| 2012-05-26 13:00:00 | 10.4 |
| 2012-05-26 14:00:00 | 11.18 |
| 2012-05-26 15:00:00 | 10.66 |
| 2012-05-26 16:00:00 | 10.4 |
| 2012-05-26 17:00:00 | 10.4 |
| 2012-05-26 18:00:00 | 9.62 |
| 2012-05-26 19:00:00 | 9.62 |
| 2012-05-26 20:00:00 | 9.36 |
| 2012-05-26 21:00:00 | 9.88 |
| 2012-05-26 22:00:00 | 9.88 |
| 2012-05-26 23:00:00 | 10.14 |
| 2012-05-27 | 9.88 |
| 2012-05-27 01:00:00 | 8.84 |
| 2012-05-27 02:00:00 | 7.54 |
| 2012-05-27 03:00:00 | 8.84 |
| 2012-05-27 04:00:00 | 6.76 |
| 2012-05-27 05:00:00 | 5.46 |
| 2012-05-27 06:00:00 | 5.72 |
| 2012-05-27 07:00:00 | 6.5 |
| 2012-05-27 08:00:00 | 6.5 |
| 2012-05-27 09:00:00 | 7.28 |
| 2012-05-27 10:00:00 | 7.54 |
| 2012-05-27 11:00:00 | 10.66 |
| 2012-05-27 12:00:00 | 11.44 |
| 2012-05-27 13:00:00 | 11.7 |
| 2012-05-27 14:00:00 | 10.4 |
| 2012-05-27 15:00:00 | 11.96 |
| 2012-05-27 16:00:00 | 9.88 |
| 2012-05-27 17:00:00 | 9.62 |
| 2012-05-27 18:00:00 | 9.1 |
| 2012-05-27 19:00:00 | 9.1 |
| 2012-05-27 20:00:00 | 9.88 |
| 2012-05-27 21:00:00 | 10.14 |
| 2012-05-27 22:00:00 | 9.88 |
| 2012-05-27 23:00:00 | 12.48 |
| 2012-05-28 | 10.4 |
| 2012-05-28 01:00:00 | 9.36 |
| 2012-05-28 02:00:00 | 7.28 |
| 2012-05-28 03:00:00 | 5.98 |
| 2012-05-28 04:00:00 | 6.24 |
| 2012-05-28 05:00:00 | 6.76 |
| 2012-05-28 06:00:00 | 5.98 |
| 2012-05-28 07:00:00 | 5.72 |
| 2012-05-28 08:00:00 | 6.5 |
| 2012-05-28 09:00:00 | 9.62 |
| 2012-05-28 10:00:00 | 9.88 |
| 2012-05-28 11:00:00 | 9.88 |
| 2012-05-28 12:00:00 | 9.62 |
| 2012-05-28 13:00:00 | 9.36 |
| 2012-05-28 14:00:00 | 8.32 |
| 2012-05-28 15:00:00 | 9.62 |
| 2012-05-28 16:00:00 | 9.1 |
| 2012-05-28 17:00:00 | 8.32 |
| 2012-05-28 18:00:00 | 11.44 |
| 2012-05-28 19:00:00 | 8.84 |
| 2012-05-28 20:00:00 | 9.62 |
| 2012-05-28 21:00:00 | 10.66 |
| 2012-05-28 22:00:00 | 9.88 |
| 2012-05-28 23:00:00 | 10.66 |
| 2012-05-29 | 9.62 |
| 2012-05-29 01:00:00 | 10.4 |
| 2012-05-29 02:00:00 | 8.58 |
| 2012-05-29 03:00:00 | 5.98 |
| 2012-05-29 04:00:00 | 5.2 |
| 2012-05-29 05:00:00 | 5.46 |
| 2012-05-29 06:00:00 | 6.76 |
| 2012-05-29 07:00:00 | 6.5 |
| 2012-05-29 08:00:00 | 6.24 |
| 2012-05-29 09:00:00 | 9.1 |
| 2012-05-29 10:00:00 | 9.62 |
| 2012-05-29 11:00:00 | 9.1 |
| 2012-05-29 12:00:00 | 7.54 |
| 2012-05-29 13:00:00 | 9.36 |
| 2012-05-29 14:00:00 | 9.1 |
| 2012-05-29 15:00:00 | 8.06 |
| 2012-05-29 16:00:00 | 8.58 |
| 2012-05-29 17:00:00 | 8.84 |
| 2012-05-29 18:00:00 | 7.8 |
| 2012-05-29 19:00:00 | 8.58 |
| 2012-05-29 20:00:00 | 9.88 |
| 2012-05-29 21:00:00 | 9.88 |
| 2012-05-29 22:00:00 | 10.14 |
| 2012-05-29 23:00:00 | 10.4 |
| 2012-05-30 | 9.88 |
| 2012-05-30 01:00:00 | 8.06 |
| 2012-05-30 02:00:00 | 7.8 |
| 2012-05-30 03:00:00 | 7.02 |
| 2012-05-30 04:00:00 | 5.46 |
| 2012-05-30 05:00:00 | 5.2 |
| 2012-05-30 06:00:00 | 5.2 |
| 2012-05-30 07:00:00 | 5.46 |
| 2012-05-30 08:00:00 | 7.8 |
| 2012-05-30 09:00:00 | 8.32 |
| 2012-05-30 10:00:00 | 7.8 |
| 2012-05-30 11:00:00 | 10.14 |
| 2012-05-30 12:00:00 | 9.62 |
| 2012-05-30 13:00:00 | 7.8 |
| 2012-05-30 14:00:00 | 8.58 |
| 2012-05-30 15:00:00 | 9.36 |
| 2012-05-30 16:00:00 | 7.28 |
| 2012-05-30 17:00:00 | 8.58 |
| 2012-05-30 18:00:00 | 9.36 |
| 2012-05-30 19:00:00 | 8.32 |
| 2012-05-30 20:00:00 | 7.8 |
| 2012-05-30 21:00:00 | 10.92 |
| 2012-05-30 22:00:00 | 10.66 |
| 2012-05-30 23:00:00 | 9.62 |
| 2012-05-31 | 10.14 |
| 2012-05-31 01:00:00 | 9.62 |
| 2012-05-31 02:00:00 | 7.02 |
| 2012-05-31 03:00:00 | 5.72 |
| 2012-05-31 04:00:00 | 6.76 |
| 2012-05-31 05:00:00 | 6.24 |
| 2012-05-31 06:00:00 | 5.2 |
| 2012-05-31 07:00:00 | 5.46 |
| 2012-05-31 08:00:00 | 6.76 |
| 2012-05-31 09:00:00 | 9.36 |
| 2012-05-31 10:00:00 | 8.06 |
| 2012-05-31 11:00:00 | 10.92 |
| 2012-05-31 12:00:00 | 12.74 |
| 2012-05-31 13:00:00 | 9.36 |
| 2012-05-31 14:00:00 | 11.18 |
| 2012-05-31 15:00:00 | 9.62 |
| 2012-05-31 16:00:00 | 7.8 |
| 2012-05-31 17:00:00 | 7.28 |
| 2012-05-31 18:00:00 | 9.36 |
| 2012-05-31 19:00:00 | 9.62 |
| 2012-05-31 20:00:00 | 13 |
| 2012-05-31 21:00:00 | 12.74 |
| 2012-05-31 22:00:00 | 10.66 |
| 2012-05-31 23:00:00 | 10.66 |
| 2012-06-01 | 9.88 |
| 2012-06-01 01:00:00 | 7.8 |
| 2012-06-01 02:00:00 | 7.02 |
| 2012-06-01 03:00:00 | 7.28 |
| 2012-06-01 04:00:00 | 5.46 |
| 2012-06-01 05:00:00 | 22.88 |
| 2012-06-01 06:00:00 | 38.74 |
| 2012-06-01 07:00:00 | 39.26 |
| 2012-06-01 08:00:00 | 39.26 |
| 2012-06-01 09:00:00 | 39 |
| 2012-06-01 10:00:00 | 39.26 |
| 2012-06-01 11:00:00 | 39 |
| 2012-06-01 12:00:00 | 39.52 |
| 2012-06-01 13:00:00 | 39 |
| 2012-06-01 14:00:00 | 37.18 |
| 2012-06-01 15:00:00 | 39.26 |
| 2012-06-01 16:00:00 | 39.52 |
| 2012-06-01 17:00:00 | 39.26 |
| 2012-06-01 18:00:00 | 39 |
| 2012-06-01 19:00:00 | 38.48 |
| 2012-06-01 20:00:00 | 38.48 |
| 2012-06-01 21:00:00 | 24.18 |
| 2012-06-01 22:00:00 | 16.12 |
| 2012-06-01 23:00:00 | 7.8 |
| 2012-06-02 | 19.5 |
| 2012-06-02 01:00:00 | 5.46 |
| 2012-06-02 02:00:00 | 12.74 |
| 2012-06-02 03:00:00 | 9.1 |
| 2012-06-02 04:00:00 | 5.98 |
| 2012-06-02 05:00:00 | 11.7 |
| 2012-06-02 06:00:00 | 2.6 |
| 2012-06-02 07:00:00 | 14.04 |
| 2012-06-02 08:00:00 | 0.26 |
| 2012-06-02 09:00:00 | 15.86 |
| 2012-06-02 10:00:00 | 5.72 |
| 2012-06-02 11:00:00 | 14.56 |
| 2012-06-02 12:00:00 | 17.16 |
| 2012-06-02 13:00:00 | 6.5 |
| 2012-06-02 14:00:00 | 20.02 |
| 2012-06-02 15:00:00 | 11.96 |
| 2012-06-02 16:00:00 | 8.84 |
| 2012-06-02 17:00:00 | 19.5 |
| 2012-06-02 18:00:00 | 6.24 |
| 2012-06-02 19:00:00 | 12.48 |
| 2012-06-02 20:00:00 | 15.6 |
| 2012-06-02 21:00:00 | 5.72 |
| 2012-06-02 22:00:00 | 18.72 |
| 2012-06-02 23:00:00 | 11.7 |
| 2012-06-03 | 8.84 |
| 2012-06-03 01:00:00 | 17.42 |
| 2012-06-03 02:00:00 | 1.56 |
| 2012-06-03 03:00:00 | 15.08 |
| 2012-06-03 04:00:00 | 2.6 |
| 2012-06-03 05:00:00 | 12.22 |
| 2012-06-03 06:00:00 | 0 |
| 2012-06-03 07:00:00 | 14.82 |
| 2012-06-03 08:00:00 | 0.26 |
| 2012-06-03 09:00:00 | 14.82 |
| 2012-06-03 10:00:00 | 8.58 |
| 2012-06-03 11:00:00 | 10.92 |
| 2012-06-03 12:00:00 | 20.54 |
| 2012-06-03 13:00:00 | 6.5 |
| 2012-06-03 14:00:00 | 17.68 |
| 2012-06-03 15:00:00 | 14.04 |
| 2012-06-03 16:00:00 | 7.8 |
| 2012-06-03 17:00:00 | 17.42 |
| 2012-06-03 18:00:00 | 7.54 |
| 2012-06-03 19:00:00 | 10.14 |
| 2012-06-03 20:00:00 | 19.5 |
| 2012-06-03 21:00:00 | 5.46 |
| 2012-06-03 22:00:00 | 16.9 |
| 2012-06-03 23:00:00 | 15.86 |
| 2012-06-04 | 8.58 |
| 2012-06-04 01:00:00 | 32.5 |
| 2012-06-04 02:00:00 | 40.04 |
| 2012-06-04 03:00:00 | 40.04 |
| 2012-06-04 04:00:00 | 39.78 |
| 2012-06-04 05:00:00 | 40.04 |
| 2012-06-04 06:00:00 | 39.78 |
| 2012-06-04 07:00:00 | 39.52 |
| 2012-06-04 08:00:00 | 39.78 |
| 2012-06-04 09:00:00 | 39.52 |
| 2012-06-04 10:00:00 | 39.26 |
| 2012-06-04 11:00:00 | 39 |
| 2012-06-04 12:00:00 | 39 |
| 2012-06-04 13:00:00 | 39 |
| 2012-06-04 14:00:00 | 21.84 |
| 2012-06-04 15:00:00 | 16.38 |
| 2012-06-04 16:00:00 | 24.18 |
| 2012-06-04 17:00:00 | 39.78 |
| 2012-06-04 18:00:00 | 39.78 |
| 2012-06-04 19:00:00 | 39.78 |
| 2012-06-04 20:00:00 | 40.04 |
| 2012-06-04 21:00:00 | 39.52 |
| 2012-06-04 22:00:00 | 39.78 |
| 2012-06-04 23:00:00 | 39.78 |
| 2012-06-05 | 39.78 |
| 2012-06-05 01:00:00 | 39.52 |
| 2012-06-05 02:00:00 | 39.26 |
| 2012-06-05 03:00:00 | 39 |
| 2012-06-05 04:00:00 | 38.74 |
| 2012-06-05 05:00:00 | 11.7 |
| 2012-06-05 06:00:00 | 17.68 |
| 2012-06-05 07:00:00 | 6.5 |
| 2012-06-05 08:00:00 | 13.26 |
| 2012-06-05 09:00:00 | 20.54 |
| 2012-06-05 10:00:00 | 8.84 |
| 2012-06-05 11:00:00 | 11.18 |
| 2012-06-05 12:00:00 | 32.5 |
| 2012-06-05 13:00:00 | 37.96 |
| 2012-06-05 14:00:00 | 26.52 |
| 2012-06-05 15:00:00 | 27.3 |
| 2012-06-05 16:00:00 | 27.56 |
| 2012-06-05 17:00:00 | 27.3 |
| 2012-06-05 18:00:00 | 27.3 |
| 2012-06-05 19:00:00 | 27.3 |
| 2012-06-05 20:00:00 | 27.04 |
| 2012-06-05 21:00:00 | 27.3 |
| 2012-06-05 22:00:00 | 27.3 |
| 2012-06-05 23:00:00 | 27.04 |
| 2012-06-06 | 27.3 |
| 2012-06-06 01:00:00 | 27.3 |
| 2012-06-06 02:00:00 | 27.04 |
| 2012-06-06 03:00:00 | 27.04 |
| 2012-06-06 04:00:00 | 27.04 |
| 2012-06-06 05:00:00 | 26.78 |
| 2012-06-06 06:00:00 | 26.52 |
| 2012-06-06 07:00:00 | 26.52 |
| 2012-06-06 08:00:00 | 26.52 |
| 2012-06-06 09:00:00 | 22.62 |
| 2012-06-06 10:00:00 | 19.24 |
| 2012-06-06 11:00:00 | 18.46 |
| 2012-06-06 12:00:00 | 17.94 |
| 2012-06-06 13:00:00 | 17.94 |
| 2012-06-06 14:00:00 | 17.42 |
| 2012-06-06 15:00:00 | 17.42 |
| 2012-06-06 16:00:00 | 17.68 |
| 2012-06-06 17:00:00 | 17.42 |
| 2012-06-06 18:00:00 | 17.42 |
| 2012-06-06 19:00:00 | 17.42 |
| 2012-06-06 20:00:00 | 17.68 |
| 2012-06-06 21:00:00 | 18.2 |
| 2012-06-06 22:00:00 | 18.46 |
| 2012-06-06 23:00:00 | 18.46 |
| 2012-06-07 | 17.94 |
| 2012-06-07 01:00:00 | 17.16 |
| 2012-06-07 02:00:00 | 16.38 |
| 2012-06-07 03:00:00 | 15.86 |
| 2012-06-07 04:00:00 | 15.34 |
| 2012-06-07 05:00:00 | 15.34 |
| 2012-06-07 06:00:00 | 15.34 |
| 2012-06-07 07:00:00 | 15.86 |
| 2012-06-07 08:00:00 | 16.64 |
| 2012-06-07 09:00:00 | 17.68 |
| 2012-06-07 10:00:00 | 17.42 |
| 2012-06-07 11:00:00 | 17.16 |
| 2012-06-07 12:00:00 | 16.9 |
| 2012-06-07 13:00:00 | 12.22 |
| 2012-06-07 14:00:00 | 14.82 |
| 2012-06-07 15:00:00 | 6.24 |
| 2012-06-07 16:00:00 | 11.44 |
| 2012-06-07 17:00:00 | 17.94 |
| 2012-06-07 18:00:00 | 9.1 |
| 2012-06-07 19:00:00 | 8.58 |
| 2012-06-07 20:00:00 | 17.16 |
| 2012-06-07 21:00:00 | 15.34 |
| 2012-06-07 22:00:00 | 8.84 |
| 2012-06-07 23:00:00 | 17.94 |
| 2012-06-08 | 18.98 |
| 2012-06-08 01:00:00 | 7.02 |
| 2012-06-08 02:00:00 | 10.14 |
| 2012-06-08 03:00:00 | 17.16 |
| 2012-06-08 04:00:00 | 15.08 |
| 2012-06-08 05:00:00 | 15.08 |
| 2012-06-08 06:00:00 | 15.08 |
| 2012-06-08 07:00:00 | 18.98 |
| 2012-06-08 08:00:00 | 21.06 |
| 2012-06-08 09:00:00 | 19.5 |
| 2012-06-08 10:00:00 | 17.68 |
| 2012-06-08 11:00:00 | 15.6 |
| 2012-06-08 12:00:00 | 16.64 |
| 2012-06-08 13:00:00 | 11.18 |
| 2012-06-08 14:00:00 | 9.1 |
| 2012-06-08 15:00:00 | 9.1 |
| 2012-06-08 16:00:00 | 9.88 |
| 2012-06-08 17:00:00 | 8.32 |
| 2012-06-08 18:00:00 | 10.66 |
| 2012-06-08 19:00:00 | 10.4 |
| 2012-06-08 20:00:00 | 10.66 |
| 2012-06-08 21:00:00 | 10.14 |
| 2012-06-08 22:00:00 | 10.66 |
| 2012-06-08 23:00:00 | 10.4 |
| 2012-06-09 | 28.6 |
| 2012-06-09 01:00:00 | 40.56 |
| 2012-06-09 02:00:00 | 40.56 |
| 2012-06-09 03:00:00 | 40.04 |
| 2012-06-09 04:00:00 | 40.04 |
| 2012-06-09 05:00:00 | 39.78 |
| 2012-06-09 06:00:00 | 3.9 |
| 2012-06-09 07:00:00 | 15.34 |
| 2012-06-09 08:00:00 | 2.34 |
| 2012-06-09 09:00:00 | 13.78 |
| 2012-06-09 10:00:00 | 15.86 |
| 2012-06-09 11:00:00 | 9.1 |
| 2012-06-09 12:00:00 | 26.52 |
| 2012-06-09 13:00:00 | 27.56 |
| 2012-06-09 14:00:00 | 40.04 |
| 2012-06-09 15:00:00 | 40.04 |
| 2012-06-09 16:00:00 | 24.7 |
| 2012-06-09 17:00:00 | 17.94 |
| 2012-06-09 18:00:00 | 7.8 |
| 2012-06-09 19:00:00 | 17.94 |
| 2012-06-09 20:00:00 | 14.04 |
| 2012-06-09 21:00:00 | 6.24 |
| 2012-06-09 22:00:00 | 20.8 |
| 2012-06-09 23:00:00 | 12.48 |
| 2012-06-10 | 7.02 |
| 2012-06-10 01:00:00 | 17.68 |
| 2012-06-10 02:00:00 | 8.06 |
| 2012-06-10 03:00:00 | 8.06 |
| 2012-06-10 04:00:00 | 14.3 |
| 2012-06-10 05:00:00 | 0 |
| 2012-06-10 06:00:00 | 14.3 |
| 2012-06-10 07:00:00 | 2.34 |
| 2012-06-10 08:00:00 | 12.48 |
| 2012-06-10 09:00:00 | 10.14 |
| 2012-06-10 10:00:00 | 6.24 |
| 2012-06-10 11:00:00 | 23.66 |
| 2012-06-10 12:00:00 | 18.46 |
| 2012-06-10 13:00:00 | 17.94 |
| 2012-06-10 14:00:00 | 15.34 |
| 2012-06-10 15:00:00 | 39.52 |
| 2012-06-10 16:00:00 | 41.08 |
| 2012-06-10 17:00:00 | 40.82 |
| 2012-06-10 18:00:00 | 40.82 |
| 2012-06-10 19:00:00 | 40.82 |
| 2012-06-10 20:00:00 | 40.56 |
| 2012-06-10 21:00:00 | 40.82 |
| 2012-06-10 22:00:00 | 40.82 |
| 2012-06-10 23:00:00 | 40.56 |
| 2012-06-11 | 40.56 |
| 2012-06-11 01:00:00 | 40.56 |
| 2012-06-11 02:00:00 | 40.56 |
| 2012-06-11 03:00:00 | 40.3 |
| 2012-06-11 04:00:00 | 40.56 |
| 2012-06-11 05:00:00 | 40.04 |
| 2012-06-11 06:00:00 | 39.78 |
| 2012-06-11 07:00:00 | 39.78 |
| 2012-06-11 08:00:00 | 39.78 |
| 2012-06-11 09:00:00 | 25.48 |
| 2012-06-11 10:00:00 | 21.58 |
| 2012-06-11 11:00:00 | 11.44 |
| 2012-06-11 12:00:00 | 23.92 |
| 2012-06-11 13:00:00 | 13 |
| 2012-06-11 14:00:00 | 13.26 |
| 2012-06-11 15:00:00 | 23.66 |
| 2012-06-11 16:00:00 | 10.14 |
| 2012-06-11 17:00:00 | 15.86 |
| 2012-06-11 18:00:00 | 21.06 |
| 2012-06-11 19:00:00 | 10.92 |
| 2012-06-11 20:00:00 | 21.32 |
| 2012-06-11 21:00:00 | 16.64 |
| 2012-06-11 22:00:00 | 12.74 |
| 2012-06-11 23:00:00 | 26 |
| 2012-06-12 | 10.92 |
| 2012-06-12 01:00:00 | 22.36 |
| 2012-06-12 02:00:00 | 13.52 |
| 2012-06-12 03:00:00 | 7.8 |
| 2012-06-12 04:00:00 | 18.98 |
| 2012-06-12 05:00:00 | 6.24 |
| 2012-06-12 06:00:00 | 17.16 |
| 2012-06-12 07:00:00 | 8.06 |
| 2012-06-12 08:00:00 | 10.14 |
| 2012-06-12 09:00:00 | 21.58 |
| 2012-06-12 10:00:00 | 20.28 |
| 2012-06-12 11:00:00 | 1.3 |
| 2012-06-12 12:00:00 | 32.24 |
| 2012-06-12 13:00:00 | 15.08 |
| 2012-06-12 14:00:00 | 10.66 |
| 2012-06-12 15:00:00 | 10.92 |
| 2012-06-12 16:00:00 | 21.84 |
| 2012-06-12 17:00:00 | 40.04 |
| 2012-06-12 18:00:00 | 39.78 |
| 2012-06-12 19:00:00 | 39.78 |
| 2012-06-12 20:00:00 | 39.78 |
| 2012-06-12 21:00:00 | 39.78 |
| 2012-06-12 22:00:00 | 11.44 |
| 2012-06-12 23:00:00 | 20.8 |
| 2012-06-13 | 16.9 |
| 2012-06-13 01:00:00 | 40.04 |
| 2012-06-13 02:00:00 | 40.56 |
| 2012-06-13 03:00:00 | 40.3 |
| 2012-06-13 04:00:00 | 40.56 |
| 2012-06-13 05:00:00 | 40.3 |
| 2012-06-13 06:00:00 | 40.04 |
| 2012-06-13 07:00:00 | 40.3 |
| 2012-06-13 08:00:00 | 40.04 |
| 2012-06-13 09:00:00 | 40.04 |
| 2012-06-13 10:00:00 | 40.04 |
| 2012-06-13 11:00:00 | 39.26 |
| 2012-06-13 12:00:00 | 39.78 |
| 2012-06-13 13:00:00 | 39.52 |
| 2012-06-13 14:00:00 | 39.52 |
| 2012-06-13 15:00:00 | 39.52 |
| 2012-06-13 16:00:00 | 39.52 |
| 2012-06-13 17:00:00 | 39.52 |
| 2012-06-13 18:00:00 | 39.52 |
| 2012-06-13 19:00:00 | 39.26 |
| 2012-06-13 20:00:00 | 39.26 |
| 2012-06-13 21:00:00 | 39 |
| 2012-06-13 22:00:00 | 39 |
| 2012-06-13 23:00:00 | 39 |
| 2012-06-14 | 38.74 |
| 2012-06-14 01:00:00 | 38.74 |
| 2012-06-14 02:00:00 | 38.74 |
| 2012-06-14 03:00:00 | 38.48 |
| 2012-06-14 04:00:00 | 38.48 |
| 2012-06-14 05:00:00 | 38.48 |
| 2012-06-14 06:00:00 | 37.7 |
| 2012-06-14 07:00:00 | 9.36 |
| 2012-06-14 08:00:00 | 25.74 |
| 2012-06-14 09:00:00 | 33.8 |
| 2012-06-14 10:00:00 | 39 |
| 2012-06-14 11:00:00 | 39 |
| 2012-06-14 12:00:00 | 39 |
| 2012-06-14 13:00:00 | 39.78 |
| 2012-06-14 14:00:00 | 39.78 |
| 2012-06-14 15:00:00 | 40.04 |
| 2012-06-14 16:00:00 | 39.78 |
| 2012-06-14 17:00:00 | 39.52 |
| 2012-06-14 18:00:00 | 39.78 |
| 2012-06-14 19:00:00 | 39.78 |
| 2012-06-14 20:00:00 | 39.78 |
| 2012-06-14 21:00:00 | 39.52 |
| 2012-06-14 22:00:00 | 39.78 |
| 2012-06-14 23:00:00 | 39.78 |
| 2012-06-15 | 39.52 |
| 2012-06-15 01:00:00 | 39.52 |
| 2012-06-15 02:00:00 | 39.78 |
| 2012-06-15 03:00:00 | 39.52 |
| 2012-06-15 04:00:00 | 39.52 |
| 2012-06-15 05:00:00 | 39.26 |
| 2012-06-15 06:00:00 | 39.26 |
| 2012-06-15 07:00:00 | 39 |
| 2012-06-15 08:00:00 | 39 |
| 2012-06-15 09:00:00 | 39 |
| 2012-06-15 10:00:00 | 39 |
| 2012-06-15 11:00:00 | 38.74 |
| 2012-06-15 12:00:00 | 39.52 |
| 2012-06-15 13:00:00 | 38.74 |
| 2012-06-15 14:00:00 | 38.74 |
| 2012-06-15 15:00:00 | 38.74 |
| 2012-06-15 16:00:00 | 38.22 |
| 2012-06-15 17:00:00 | 37.96 |
| 2012-06-15 18:00:00 | 37.7 |
| 2012-06-15 19:00:00 | 37.96 |
| 2012-06-15 20:00:00 | 38.22 |
| 2012-06-15 21:00:00 | 37.96 |
| 2012-06-15 22:00:00 | 37.96 |
| 2012-06-15 23:00:00 | 37.96 |
| 2012-06-16 | 38.22 |
| 2012-06-16 01:00:00 | 28.6 |
| 2012-06-16 02:00:00 | 17.42 |
| 2012-06-16 03:00:00 | 13.52 |
| 2012-06-16 04:00:00 | 16.9 |
| 2012-06-16 05:00:00 | 16.9 |
| 2012-06-16 06:00:00 | 16.12 |
| 2012-06-16 07:00:00 | 9.62 |
| 2012-06-16 08:00:00 | 23.92 |
| 2012-06-16 09:00:00 | 6.5 |
| 2012-06-16 10:00:00 | 25.48 |
| 2012-06-16 11:00:00 | 25.74 |
| 2012-06-16 12:00:00 | 18.46 |
| 2012-06-16 13:00:00 | 20.02 |
| 2012-06-16 14:00:00 | 25.74 |
| 2012-06-16 15:00:00 | 19.5 |
| 2012-06-16 16:00:00 | 19.24 |
| 2012-06-16 17:00:00 | 25.48 |
| 2012-06-16 18:00:00 | 11.7 |
| 2012-06-16 19:00:00 | 25.74 |
| 2012-06-16 20:00:00 | 11.44 |
| 2012-06-16 21:00:00 | 25.48 |
| 2012-06-16 22:00:00 | 10.14 |
| 2012-06-16 23:00:00 | 25.48 |
| 2012-06-17 | 10.14 |
| 2012-06-17 01:00:00 | 22.1 |
| 2012-06-17 02:00:00 | 11.18 |
| 2012-06-17 03:00:00 | 13.52 |
| 2012-06-17 04:00:00 | 17.16 |
| 2012-06-17 05:00:00 | 4.16 |
| 2012-06-17 06:00:00 | 19.5 |
| 2012-06-17 07:00:00 | 6.24 |
| 2012-06-17 08:00:00 | 14.04 |
| 2012-06-17 09:00:00 | 15.08 |
| 2012-06-17 10:00:00 | 8.84 |
| 2012-06-17 11:00:00 | 24.96 |
| 2012-06-17 12:00:00 | 10.92 |
| 2012-06-17 13:00:00 | 25.48 |
| 2012-06-17 14:00:00 | 9.36 |
| 2012-06-17 15:00:00 | 24.44 |
| 2012-06-17 16:00:00 | 8.84 |
| 2012-06-17 17:00:00 | 20.02 |
| 2012-06-17 18:00:00 | 13.26 |
| 2012-06-17 19:00:00 | 14.04 |
| 2012-06-17 20:00:00 | 17.68 |
| 2012-06-17 21:00:00 | 8.84 |
| 2012-06-17 22:00:00 | 24.44 |
| 2012-06-17 23:00:00 | 10.66 |
| 2012-06-18 | 23.4 |
| 2012-06-18 01:00:00 | 9.36 |
| 2012-06-18 02:00:00 | 11.44 |
| 2012-06-18 03:00:00 | 17.42 |
| 2012-06-18 04:00:00 | 1.3 |
| 2012-06-18 05:00:00 | 17.42 |
| 2012-06-18 06:00:00 | 3.38 |
| 2012-06-18 07:00:00 | 15.08 |
| 2012-06-18 08:00:00 | 11.44 |
| 2012-06-18 09:00:00 | 11.7 |
| 2012-06-18 10:00:00 | 20.8 |
| 2012-06-18 11:00:00 | 7.8 |
| 2012-06-18 12:00:00 | 25.48 |
| 2012-06-18 13:00:00 | 11.18 |
| 2012-06-18 14:00:00 | 9.88 |
| 2012-06-18 15:00:00 | 10.66 |
| 2012-06-18 16:00:00 | 11.18 |
| 2012-06-18 17:00:00 | 11.18 |
| 2012-06-18 18:00:00 | 11.18 |
| 2012-06-18 19:00:00 | 11.7 |
| 2012-06-18 20:00:00 | 10.66 |
| 2012-06-18 21:00:00 | 12.48 |
| 2012-06-18 22:00:00 | 11.96 |
| 2012-06-18 23:00:00 | 11.96 |
| 2012-06-19 | 12.22 |
| 2012-06-19 01:00:00 | 10.92 |
| 2012-06-19 02:00:00 | 9.88 |
| 2012-06-19 03:00:00 | 7.8 |
| 2012-06-19 04:00:00 | 8.58 |
| 2012-06-19 05:00:00 | 8.58 |
| 2012-06-19 06:00:00 | 7.02 |
| 2012-06-19 07:00:00 | 8.06 |
| 2012-06-19 08:00:00 | 9.88 |
| 2012-06-19 09:00:00 | 10.4 |
| 2012-06-19 10:00:00 | 11.96 |
| 2012-06-19 11:00:00 | 10.66 |
| 2012-06-19 12:00:00 | 12.48 |
| 2012-06-19 13:00:00 | 9.88 |
| 2012-06-19 14:00:00 | 10.66 |
| 2012-06-19 15:00:00 | 10.66 |
| 2012-06-19 16:00:00 | 10.4 |
| 2012-06-19 17:00:00 | 11.7 |
| 2012-06-19 18:00:00 | 11.7 |
| 2012-06-19 19:00:00 | 11.7 |
| 2012-06-19 20:00:00 | 11.18 |
| 2012-06-19 21:00:00 | 11.44 |
| 2012-06-19 22:00:00 | 11.44 |
| 2012-06-19 23:00:00 | 11.96 |
| 2012-06-20 | 11.18 |
| 2012-06-20 01:00:00 | 10.92 |
| 2012-06-20 02:00:00 | 9.1 |
| 2012-06-20 03:00:00 | 7.54 |
| 2012-06-20 04:00:00 | 8.58 |
| 2012-06-20 05:00:00 | 7.8 |
| 2012-06-20 06:00:00 | 7.8 |
| 2012-06-20 07:00:00 | 7.28 |
| 2012-06-20 08:00:00 | 9.36 |
| 2012-06-20 09:00:00 | 11.44 |
| 2012-06-20 10:00:00 | 10.14 |
| 2012-06-20 11:00:00 | 10.92 |
| 2012-06-20 12:00:00 | 11.44 |
| 2012-06-20 13:00:00 | 10.14 |
| 2012-06-20 14:00:00 | 9.62 |
| 2012-06-20 15:00:00 | 10.4 |
| 2012-06-20 16:00:00 | 11.44 |
| 2012-06-20 17:00:00 | 10.4 |
| 2012-06-20 18:00:00 | 10.14 |
| 2012-06-20 19:00:00 | 11.96 |
| 2012-06-20 20:00:00 | 9.88 |
| 2012-06-20 21:00:00 | 13 |
| 2012-06-20 22:00:00 | 11.44 |
| 2012-06-20 23:00:00 | 12.22 |
| 2012-06-21 | 11.44 |
| 2012-06-21 01:00:00 | 10.4 |
| 2012-06-21 02:00:00 | 8.84 |
| 2012-06-21 03:00:00 | 8.84 |
| 2012-06-21 04:00:00 | 8.32 |
| 2012-06-21 05:00:00 | 36.66 |
| 2012-06-21 06:00:00 | 39.26 |
| 2012-06-21 07:00:00 | 39 |
| 2012-06-21 08:00:00 | 39 |
| 2012-06-21 09:00:00 | 39 |
| 2012-06-21 10:00:00 | 39.26 |
| 2012-06-21 11:00:00 | 39 |
| 2012-06-21 12:00:00 | 38.48 |
| 2012-06-21 13:00:00 | 34.58 |
| 2012-06-21 14:00:00 | 27.82 |
| 2012-06-21 15:00:00 | 28.08 |
| 2012-06-21 16:00:00 | 27.82 |
| 2012-06-21 17:00:00 | 23.4 |
| 2012-06-21 18:00:00 | 17.16 |
| 2012-06-21 19:00:00 | 17.42 |
| 2012-06-21 20:00:00 | 22.1 |
| 2012-06-21 21:00:00 | 39.78 |
| 2012-06-21 22:00:00 | 38.22 |
| 2012-06-21 23:00:00 | 7.54 |
| 2012-06-22 | 12.74 |
| 2012-06-22 01:00:00 | 18.2 |
| 2012-06-22 02:00:00 | 0.52 |
| 2012-06-22 03:00:00 | 15.6 |
| 2012-06-22 04:00:00 | 3.12 |
| 2012-06-22 05:00:00 | 11.96 |
| 2012-06-22 06:00:00 | 26.26 |
| 2012-06-22 07:00:00 | 40.56 |
| 2012-06-22 08:00:00 | 40.56 |
| 2012-06-22 09:00:00 | 40.56 |
| 2012-06-22 10:00:00 | 40.56 |
| 2012-06-22 11:00:00 | 40.56 |
| 2012-06-22 12:00:00 | 40.3 |
| 2012-06-22 13:00:00 | 39.52 |
| 2012-06-22 14:00:00 | 39.78 |
| 2012-06-22 15:00:00 | 39.52 |
| 2012-06-22 16:00:00 | 39.52 |
| 2012-06-22 17:00:00 | 40.3 |
| 2012-06-22 18:00:00 | 40.04 |
| 2012-06-22 19:00:00 | 40.3 |
| 2012-06-22 20:00:00 | 40.04 |
| 2012-06-22 21:00:00 | 40.04 |
| 2012-06-22 22:00:00 | 40.04 |
| 2012-06-22 23:00:00 | 39.78 |
| 2012-06-23 | 39.52 |
| 2012-06-23 01:00:00 | 39.26 |
| 2012-06-23 02:00:00 | 39.26 |
| 2012-06-23 03:00:00 | 28.34 |
| 2012-06-23 04:00:00 | 13.52 |
| 2012-06-23 05:00:00 | 4.94 |
| 2012-06-23 06:00:00 | 18.2 |
| 2012-06-23 07:00:00 | 9.36 |
| 2012-06-23 08:00:00 | 9.1 |
| 2012-06-23 09:00:00 | 20.28 |
| 2012-06-23 10:00:00 | 7.54 |
| 2012-06-23 11:00:00 | 16.9 |
| 2012-06-23 12:00:00 | 16.38 |
| 2012-06-23 13:00:00 | 9.1 |
| 2012-06-23 14:00:00 | 22.1 |
| 2012-06-23 15:00:00 | 11.18 |
| 2012-06-23 16:00:00 | 12.48 |
| 2012-06-23 17:00:00 | 18.72 |
| 2012-06-23 18:00:00 | 5.72 |
| 2012-06-23 19:00:00 | 18.2 |
| 2012-06-23 20:00:00 | 11.7 |
| 2012-06-23 21:00:00 | 7.28 |
| 2012-06-23 22:00:00 | 20.02 |
| 2012-06-23 23:00:00 | 9.1 |
| 2012-06-24 | 10.66 |
| 2012-06-24 01:00:00 | 18.72 |
| 2012-06-24 02:00:00 | 1.56 |
| 2012-06-24 03:00:00 | 15.08 |
| 2012-06-24 04:00:00 | 8.84 |
| 2012-06-24 05:00:00 | 5.98 |
| 2012-06-24 06:00:00 | 14.56 |
| 2012-06-24 07:00:00 | 0.26 |
| 2012-06-24 08:00:00 | 15.86 |
| 2012-06-24 09:00:00 | 9.88 |
| 2012-06-24 10:00:00 | 6.5 |
| 2012-06-24 11:00:00 | 20.28 |
| 2012-06-24 12:00:00 | 10.66 |
| 2012-06-24 13:00:00 | 10.92 |
| 2012-06-24 14:00:00 | 20.54 |
| 2012-06-24 15:00:00 | 6.24 |
| 2012-06-24 16:00:00 | 14.82 |
| 2012-06-24 17:00:00 | 14.82 |
| 2012-06-24 18:00:00 | 3.64 |
| 2012-06-24 19:00:00 | 16.9 |
| 2012-06-24 20:00:00 | 10.92 |
| 2012-06-24 21:00:00 | 7.02 |
| 2012-06-24 22:00:00 | 20.54 |
| 2012-06-24 23:00:00 | 10.66 |
| 2012-06-25 | 8.84 |
| 2012-06-25 01:00:00 | 18.98 |
| 2012-06-25 02:00:00 | 5.2 |
| 2012-06-25 03:00:00 | 13 |
| 2012-06-25 04:00:00 | 9.36 |
| 2012-06-25 05:00:00 | 6.76 |
| 2012-06-25 06:00:00 | 11.96 |
| 2012-06-25 07:00:00 | 3.38 |
| 2012-06-25 08:00:00 | 17.42 |
| 2012-06-25 09:00:00 | 3.12 |
| 2012-06-25 10:00:00 | 14.04 |
| 2012-06-25 11:00:00 | 14.82 |
| 2012-06-25 12:00:00 | 2.86 |
| 2012-06-25 13:00:00 | 17.42 |
| 2012-06-25 14:00:00 | 4.94 |
| 2012-06-25 15:00:00 | 11.96 |
| 2012-06-25 16:00:00 | 13.26 |
| 2012-06-25 17:00:00 | 4.16 |
| 2012-06-25 18:00:00 | 15.86 |
| 2012-06-25 19:00:00 | 5.2 |
| 2012-06-25 20:00:00 | 12.22 |
| 2012-06-25 21:00:00 | 14.56 |
| 2012-06-25 22:00:00 | 5.98 |
| 2012-06-25 23:00:00 | 20.28 |
| 2012-06-26 | 13.26 |
| 2012-06-26 01:00:00 | 7.54 |
| 2012-06-26 02:00:00 | 16.9 |
| 2012-06-26 03:00:00 | 8.32 |
| 2012-06-26 04:00:00 | 7.8 |
| 2012-06-26 05:00:00 | 13.52 |
| 2012-06-26 06:00:00 | 1.3 |
| 2012-06-26 07:00:00 | 13 |
| 2012-06-26 08:00:00 | 2.34 |
| 2012-06-26 09:00:00 | 16.38 |
| 2012-06-26 10:00:00 | 9.88 |
| 2012-06-26 11:00:00 | 7.02 |
| 2012-06-26 12:00:00 | 17.16 |
| 2012-06-26 13:00:00 | 1.04 |
| 2012-06-26 14:00:00 | 15.08 |
| 2012-06-26 15:00:00 | 9.36 |
| 2012-06-26 16:00:00 | 7.8 |
| 2012-06-26 17:00:00 | 16.64 |
| 2012-06-26 18:00:00 | 4.94 |
| 2012-06-26 19:00:00 | 12.48 |
| 2012-06-26 20:00:00 | 11.96 |
| 2012-06-26 21:00:00 | 4.94 |
| 2012-06-26 22:00:00 | 17.68 |
| 2012-06-26 23:00:00 | 11.18 |
| 2012-06-27 | 8.32 |
| 2012-06-27 01:00:00 | 17.42 |
| 2012-06-27 02:00:00 | 0.26 |
| 2012-06-27 03:00:00 | 14.04 |
| 2012-06-27 04:00:00 | 0.52 |
| 2012-06-27 05:00:00 | 14.3 |
| 2012-06-27 06:00:00 | 0 |
| 2012-06-27 07:00:00 | 14.3 |
| 2012-06-27 08:00:00 | 4.42 |
| 2012-06-27 09:00:00 | 12.22 |
| 2012-06-27 10:00:00 | 13 |
| 2012-06-27 11:00:00 | 4.68 |
| 2012-06-27 12:00:00 | 16.64 |
| 2012-06-27 13:00:00 | 3.64 |
| 2012-06-27 14:00:00 | 11.96 |
| 2012-06-27 15:00:00 | 12.22 |
| 2012-06-27 16:00:00 | 4.68 |
| 2012-06-27 17:00:00 | 16.64 |
| 2012-06-27 18:00:00 | 0.52 |
| 2012-06-27 19:00:00 | 16.38 |
| 2012-06-27 20:00:00 | 8.06 |
| 2012-06-27 21:00:00 | 9.88 |
| 2012-06-27 22:00:00 | 18.2 |
| 2012-06-27 23:00:00 | 5.46 |
| 2012-06-28 | 14.04 |
| 2012-06-28 01:00:00 | 12.48 |
| 2012-06-28 02:00:00 | 5.2 |
| 2012-06-28 03:00:00 | 14.56 |
| 2012-06-28 04:00:00 | 0.52 |
| 2012-06-28 05:00:00 | 13.78 |
| 2012-06-28 06:00:00 | 4.16 |
| 2012-06-28 07:00:00 | 17.94 |
| 2012-06-28 08:00:00 | 15.86 |
| 2012-06-28 09:00:00 | 6.24 |
| 2012-06-28 10:00:00 | 17.94 |
| 2012-06-28 11:00:00 | 5.72 |
| 2012-06-28 12:00:00 | 10.92 |
| 2012-06-28 13:00:00 | 12.74 |
| 2012-06-28 14:00:00 | 4.42 |
| 2012-06-28 15:00:00 | 16.64 |
| 2012-06-28 16:00:00 | 1.56 |
| 2012-06-28 17:00:00 | 15.08 |
| 2012-06-28 18:00:00 | 10.4 |
| 2012-06-28 19:00:00 | 6.5 |
| 2012-06-28 20:00:00 | 17.16 |
| 2012-06-28 21:00:00 | 0.78 |
| 2012-06-28 22:00:00 | 18.98 |
| 2012-06-28 23:00:00 | 10.92 |
| 2012-06-29 | 8.32 |
| 2012-06-29 01:00:00 | 16.9 |
| 2012-06-29 02:00:00 | 1.56 |
| 2012-06-29 03:00:00 | 13.52 |
| 2012-06-29 04:00:00 | 1.56 |
| 2012-06-29 05:00:00 | 13.26 |
| 2012-06-29 06:00:00 | 0.78 |
| 2012-06-29 07:00:00 | 13.52 |
| 2012-06-29 08:00:00 | 5.2 |
| 2012-06-29 09:00:00 | 12.48 |
| 2012-06-29 10:00:00 | 16.64 |
| 2012-06-29 11:00:00 | 0.52 |
| 2012-06-29 12:00:00 | 17.16 |
| 2012-06-29 13:00:00 | 5.46 |
| 2012-06-29 14:00:00 | 11.7 |
| 2012-06-29 15:00:00 | 21.32 |
| 2012-06-29 16:00:00 | 2.86 |
| 2012-06-29 17:00:00 | 15.34 |
| 2012-06-29 18:00:00 | 15.08 |
| 2012-06-29 19:00:00 | 3.38 |
| 2012-06-29 20:00:00 | 19.24 |
| 2012-06-29 21:00:00 | 10.92 |
| 2012-06-29 22:00:00 | 9.36 |
| 2012-06-29 23:00:00 | 19.24 |
| 2012-06-30 | 5.46 |
| 2012-06-30 01:00:00 | 13 |
| 2012-06-30 02:00:00 | 14.3 |
| 2012-06-30 03:00:00 | 2.6 |
| 2012-06-30 04:00:00 | 14.56 |
| 2012-06-30 05:00:00 | 0.26 |
| 2012-06-30 06:00:00 | 14.04 |
| 2012-06-30 07:00:00 | 0.26 |
| 2012-06-30 08:00:00 | 14.82 |
| 2012-06-30 09:00:00 | 4.68 |
| 2012-06-30 10:00:00 | 12.22 |
| 2012-06-30 11:00:00 | 18.46 |
| 2012-06-30 12:00:00 | 7.8 |
| 2012-06-30 13:00:00 | 16.38 |
| 2012-06-30 14:00:00 | 15.86 |
| 2012-06-30 15:00:00 | 5.98 |
| 2012-06-30 16:00:00 | 22.36 |
| 2012-06-30 17:00:00 | 8.58 |
| 2012-06-30 18:00:00 | 10.66 |
| 2012-06-30 19:00:00 | 19.5 |
| 2012-06-30 20:00:00 | 16.64 |
| 2012-06-30 21:00:00 | 16.64 |
| 2012-06-30 22:00:00 | 16.64 |
| 2012-06-30 23:00:00 | 16.64 |
| 2012-07-01 | 16.38 |
| 2012-07-01 01:00:00 | 16.12 |
| 2012-07-01 02:00:00 | 15.6 |
| 2012-07-01 03:00:00 | 15.34 |
| 2012-07-01 04:00:00 | 8.58 |
| 2012-07-01 05:00:00 | 0.26 |
| 2012-07-01 06:00:00 | 13.52 |
| 2012-07-01 07:00:00 | 0.26 |
| 2012-07-01 08:00:00 | 13 |
| 2012-07-01 09:00:00 | 7.02 |
| 2012-07-01 10:00:00 | 17.16 |
| 2012-07-01 11:00:00 | 3.38 |
| 2012-07-01 12:00:00 | 19.76 |
| 2012-07-01 13:00:00 | 11.18 |
| 2012-07-01 14:00:00 | 20.8 |
| 2012-07-01 15:00:00 | 16.12 |
| 2012-07-01 16:00:00 | 1.82 |
| 2012-07-01 17:00:00 | 16.9 |
| 2012-07-01 18:00:00 | 8.58 |
| 2012-07-01 19:00:00 | 13.26 |
| 2012-07-01 20:00:00 | 13.78 |
| 2012-07-01 21:00:00 | 6.24 |
| 2012-07-01 22:00:00 | 20.54 |
| 2012-07-01 23:00:00 | 7.54 |
| 2012-07-02 | 13 |
| 2012-07-02 01:00:00 | 16.38 |
| 2012-07-02 02:00:00 | 39.52 |
| 2012-07-02 03:00:00 | 39.78 |
| 2012-07-02 04:00:00 | 39.78 |
| 2012-07-02 05:00:00 | 39.52 |
| 2012-07-02 06:00:00 | 39.52 |
| 2012-07-02 07:00:00 | 39.26 |
| 2012-07-02 08:00:00 | 36.4 |
| 2012-07-02 09:00:00 | 2.34 |
| 2012-07-02 10:00:00 | 18.46 |
| 2012-07-02 11:00:00 | 22.1 |
| 2012-07-02 12:00:00 | 9.1 |
| 2012-07-02 13:00:00 | 11.44 |
| 2012-07-02 14:00:00 | 10.66 |
| 2012-07-02 15:00:00 | 10.66 |
| 2012-07-02 16:00:00 | 10.14 |
| 2012-07-02 17:00:00 | 10.92 |
| 2012-07-02 18:00:00 | 10.66 |
| 2012-07-02 19:00:00 | 10.4 |
| 2012-07-02 20:00:00 | 8.32 |
| 2012-07-02 21:00:00 | 11.18 |
| 2012-07-02 22:00:00 | 10.66 |
| 2012-07-02 23:00:00 | 10.66 |
| 2012-07-03 | 10.66 |
| 2012-07-03 01:00:00 | 10.14 |
| 2012-07-03 02:00:00 | 9.88 |
| 2012-07-03 03:00:00 | 7.28 |
| 2012-07-03 04:00:00 | 9.1 |
| 2012-07-03 05:00:00 | 8.58 |
| 2012-07-03 06:00:00 | 4.68 |
| 2012-07-03 07:00:00 | 6.5 |
| 2012-07-03 08:00:00 | 7.54 |
| 2012-07-03 09:00:00 | 8.58 |
| 2012-07-03 10:00:00 | 10.14 |
| 2012-07-03 11:00:00 | 8.84 |
| 2012-07-03 12:00:00 | 10.14 |
| 2012-07-03 13:00:00 | 9.88 |
| 2012-07-03 14:00:00 | 9.88 |
| 2012-07-03 15:00:00 | 9.88 |
| 2012-07-03 16:00:00 | 9.62 |
| 2012-07-03 17:00:00 | 8.84 |
| 2012-07-03 18:00:00 | 9.62 |
| 2012-07-03 19:00:00 | 9.88 |
| 2012-07-03 20:00:00 | 10.14 |
| 2012-07-03 21:00:00 | 10.4 |
| 2012-07-03 22:00:00 | 10.14 |
| 2012-07-03 23:00:00 | 10.14 |
| 2012-07-04 | 9.88 |
| 2012-07-04 01:00:00 | 9.62 |
| 2012-07-04 02:00:00 | 9.36 |
| 2012-07-04 03:00:00 | 6.76 |
| 2012-07-04 04:00:00 | 5.72 |
| 2012-07-04 05:00:00 | 9.1 |
| 2012-07-04 06:00:00 | 8.32 |
| 2012-07-04 07:00:00 | 8.58 |
| 2012-07-04 08:00:00 | 8.84 |
| 2012-07-04 09:00:00 | 9.1 |
| 2012-07-04 10:00:00 | 9.62 |
| 2012-07-04 11:00:00 | 9.62 |
| 2012-07-04 12:00:00 | 9.88 |
| 2012-07-04 13:00:00 | 9.62 |
| 2012-07-04 14:00:00 | 9.62 |
| 2012-07-04 15:00:00 | 9.88 |
| 2012-07-04 16:00:00 | 9.62 |
| 2012-07-04 17:00:00 | 9.88 |
| 2012-07-04 18:00:00 | 9.62 |
| 2012-07-04 19:00:00 | 9.88 |
| 2012-07-04 20:00:00 | 9.62 |
| 2012-07-04 21:00:00 | 9.88 |
| 2012-07-04 22:00:00 | 9.88 |
| 2012-07-04 23:00:00 | 10.14 |
| 2012-07-05 | 9.88 |
| 2012-07-05 01:00:00 | 9.62 |
| 2012-07-05 02:00:00 | 8.58 |
| 2012-07-05 03:00:00 | 6.5 |
| 2012-07-05 04:00:00 | 6.76 |
| 2012-07-05 05:00:00 | 5.98 |
| 2012-07-05 06:00:00 | 5.72 |
| 2012-07-05 07:00:00 | 6.24 |
| 2012-07-05 08:00:00 | 4.68 |
| 2012-07-05 09:00:00 | 8.06 |
| 2012-07-05 10:00:00 | 9.36 |
| 2012-07-05 11:00:00 | 9.88 |
| 2012-07-05 12:00:00 | 10.92 |
| 2012-07-05 13:00:00 | 10.4 |
| 2012-07-05 14:00:00 | 10.14 |
| 2012-07-05 15:00:00 | 10.14 |
| 2012-07-05 16:00:00 | 9.88 |
| 2012-07-05 17:00:00 | 8.58 |
| 2012-07-05 18:00:00 | 10.66 |
| 2012-07-05 19:00:00 | 9.88 |
| 2012-07-05 20:00:00 | 9.1 |
| 2012-07-05 21:00:00 | 9.62 |
| 2012-07-05 22:00:00 | 9.88 |
| 2012-07-05 23:00:00 | 9.88 |
| 2012-07-06 | 10.14 |
| 2012-07-06 01:00:00 | 9.88 |
| 2012-07-06 02:00:00 | 9.88 |
| 2012-07-06 03:00:00 | 9.36 |
| 2012-07-06 04:00:00 | 9.1 |
| 2012-07-06 05:00:00 | 5.98 |
| 2012-07-06 06:00:00 | 6.24 |
| 2012-07-06 07:00:00 | 9.36 |
| 2012-07-06 08:00:00 | 8.58 |
| 2012-07-06 09:00:00 | 8.84 |
| 2012-07-06 10:00:00 | 9.36 |
| 2012-07-06 11:00:00 | 10.14 |
| 2012-07-06 12:00:00 | 10.66 |
| 2012-07-06 13:00:00 | 9.88 |
| 2012-07-06 14:00:00 | 10.14 |
| 2012-07-06 15:00:00 | 9.88 |
| 2012-07-06 16:00:00 | 9.88 |
| 2012-07-06 17:00:00 | 9.88 |
| 2012-07-06 18:00:00 | 9.62 |
| 2012-07-06 19:00:00 | 9.88 |
| 2012-07-06 20:00:00 | 9.62 |
| 2012-07-06 21:00:00 | 9.62 |
| 2012-07-06 22:00:00 | 10.4 |
| 2012-07-06 23:00:00 | 9.88 |
| 2012-07-07 | 10.66 |
| 2012-07-07 01:00:00 | 36.4 |
| 2012-07-07 02:00:00 | 39.26 |
| 2012-07-07 03:00:00 | 39 |
| 2012-07-07 04:00:00 | 39.26 |
| 2012-07-07 05:00:00 | 39.26 |
| 2012-07-07 06:00:00 | 38.48 |
| 2012-07-07 07:00:00 | 39 |
| 2012-07-07 08:00:00 | 35.88 |
| 2012-07-07 09:00:00 | 13 |
| 2012-07-07 10:00:00 | 4.42 |
| 2012-07-07 11:00:00 | 21.58 |
| 2012-07-07 12:00:00 | 16.38 |
| 2012-07-07 13:00:00 | 3.64 |
| 2012-07-07 14:00:00 | 22.36 |
| 2012-07-07 15:00:00 | 15.86 |
| 2012-07-07 16:00:00 | 4.94 |
| 2012-07-07 17:00:00 | 18.46 |
| 2012-07-07 18:00:00 | 3.12 |
| 2012-07-07 19:00:00 | 18.72 |
| 2012-07-07 20:00:00 | 1.56 |
| 2012-07-07 21:00:00 | 21.58 |
| 2012-07-07 22:00:00 | 15.86 |
| 2012-07-07 23:00:00 | 16.12 |
| 2012-07-08 | 12.48 |
| 2012-07-08 01:00:00 | 3.9 |
| 2012-07-08 02:00:00 | 12.48 |
| 2012-07-08 03:00:00 | 8.06 |
| 2012-07-08 04:00:00 | 17.94 |
| 2012-07-08 05:00:00 | 14.3 |
| 2012-07-08 06:00:00 | 14.56 |
| 2012-07-08 07:00:00 | 14.56 |
| 2012-07-08 08:00:00 | 2.34 |
| 2012-07-08 09:00:00 | 10.92 |
| 2012-07-08 10:00:00 | 17.16 |
| 2012-07-08 11:00:00 | 10.14 |
| 2012-07-08 12:00:00 | 10.66 |
| 2012-07-08 13:00:00 | 21.32 |
| 2012-07-08 14:00:00 | 14.04 |
| 2012-07-08 15:00:00 | 5.72 |
| 2012-07-08 16:00:00 | 22.1 |
| 2012-07-08 17:00:00 | 16.38 |
| 2012-07-08 18:00:00 | 9.36 |
| 2012-07-08 19:00:00 | 7.28 |
| 2012-07-08 20:00:00 | 21.84 |
| 2012-07-08 21:00:00 | 19.76 |
| 2012-07-08 22:00:00 | 24.7 |
| 2012-07-08 23:00:00 | 17.94 |
| 2012-07-09 | 7.28 |
| 2012-07-09 01:00:00 | 17.42 |
| 2012-07-09 02:00:00 | 15.6 |
| 2012-07-09 03:00:00 | 15.34 |
| 2012-07-09 04:00:00 | 14.56 |
| 2012-07-09 05:00:00 | 14.3 |
| 2012-07-09 06:00:00 | 14.3 |
| 2012-07-09 07:00:00 | 14.82 |
| 2012-07-09 08:00:00 | 1.04 |
| 2012-07-09 09:00:00 | 16.9 |
| 2012-07-09 10:00:00 | 16.64 |
| 2012-07-09 11:00:00 | 16.38 |
| 2012-07-09 12:00:00 | 16.64 |
| 2012-07-09 13:00:00 | 10.4 |
| 2012-07-09 14:00:00 | 7.8 |
| 2012-07-09 15:00:00 | 9.88 |
| 2012-07-09 16:00:00 | 17.68 |
| 2012-07-09 17:00:00 | 17.94 |
| 2012-07-09 18:00:00 | 7.8 |
| 2012-07-09 19:00:00 | 13.78 |
| 2012-07-09 20:00:00 | 19.5 |
| 2012-07-09 21:00:00 | 17.16 |
| 2012-07-09 22:00:00 | 16.9 |
| 2012-07-09 23:00:00 | 16.64 |
| 2012-07-10 | 17.16 |
| 2012-07-10 01:00:00 | 0.52 |
| 2012-07-10 02:00:00 | 21.58 |
| 2012-07-10 03:00:00 | 14.82 |
| 2012-07-10 04:00:00 | 14.3 |
| 2012-07-10 05:00:00 | 6.24 |
| 2012-07-10 06:00:00 | 0.26 |
| 2012-07-10 07:00:00 | 15.86 |
| 2012-07-10 08:00:00 | 0.26 |
| 2012-07-10 09:00:00 | 18.46 |
| 2012-07-10 10:00:00 | 12.48 |
| 2012-07-10 11:00:00 | 8.84 |
| 2012-07-10 12:00:00 | 9.62 |
| 2012-07-10 13:00:00 | 9.62 |
| 2012-07-10 14:00:00 | 9.62 |
| 2012-07-10 15:00:00 | 9.88 |
| 2012-07-10 16:00:00 | 9.62 |
| 2012-07-10 17:00:00 | 9.62 |
| 2012-07-10 18:00:00 | 9.62 |
| 2012-07-10 19:00:00 | 9.62 |
| 2012-07-10 20:00:00 | 9.88 |
| 2012-07-10 21:00:00 | 9.88 |
| 2012-07-10 22:00:00 | 9.88 |
| 2012-07-10 23:00:00 | 10.14 |
| 2012-07-11 | 10.14 |
| 2012-07-11 01:00:00 | 9.62 |
| 2012-07-11 02:00:00 | 9.1 |
| 2012-07-11 03:00:00 | 9.1 |
| 2012-07-11 04:00:00 | 8.58 |
| 2012-07-11 05:00:00 | 8.32 |
| 2012-07-11 06:00:00 | 8.32 |
| 2012-07-11 07:00:00 | 5.46 |
| 2012-07-11 08:00:00 | 7.28 |
| 2012-07-11 09:00:00 | 9.62 |
| 2012-07-11 10:00:00 | 9.62 |
| 2012-07-11 11:00:00 | 9.88 |
| 2012-07-11 12:00:00 | 9.88 |
| 2012-07-11 13:00:00 | 9.62 |
| 2012-07-11 14:00:00 | 9.36 |
| 2012-07-11 15:00:00 | 9.88 |
| 2012-07-11 16:00:00 | 9.36 |
| 2012-07-11 17:00:00 | 10.14 |
| 2012-07-11 18:00:00 | 12.48 |
| 2012-07-11 19:00:00 | 10.66 |
| 2012-07-11 20:00:00 | 9.62 |
| 2012-07-11 21:00:00 | 9.88 |
| 2012-07-11 22:00:00 | 10.14 |
| 2012-07-11 23:00:00 | 10.14 |
| 2012-07-12 | 10.4 |
| 2012-07-12 01:00:00 | 10.14 |
| 2012-07-12 02:00:00 | 9.36 |
| 2012-07-12 03:00:00 | 8.84 |
| 2012-07-12 04:00:00 | 6.24 |
| 2012-07-12 05:00:00 | 4.42 |
| 2012-07-12 06:00:00 | 6.76 |
| 2012-07-12 07:00:00 | 9.1 |
| 2012-07-12 08:00:00 | 8.84 |
| 2012-07-12 09:00:00 | 8.06 |
| 2012-07-12 10:00:00 | 11.18 |
| 2012-07-12 11:00:00 | 9.62 |
| 2012-07-12 12:00:00 | 9.62 |
| 2012-07-12 13:00:00 | 9.62 |
| 2012-07-12 14:00:00 | 9.62 |
| 2012-07-12 15:00:00 | 9.88 |
| 2012-07-12 16:00:00 | 9.62 |
| 2012-07-12 17:00:00 | 9.62 |
| 2012-07-12 18:00:00 | 9.36 |
| 2012-07-12 19:00:00 | 9.88 |
| 2012-07-12 20:00:00 | 9.62 |
| 2012-07-12 21:00:00 | 9.62 |
| 2012-07-12 22:00:00 | 10.14 |
| 2012-07-12 23:00:00 | 10.14 |
| 2012-07-13 | 9.88 |
| 2012-07-13 01:00:00 | 8.58 |
| 2012-07-13 02:00:00 | 7.54 |
| 2012-07-13 03:00:00 | 6.76 |
| 2012-07-13 04:00:00 | 4.16 |
| 2012-07-13 05:00:00 | 5.98 |
| 2012-07-13 06:00:00 | 6.24 |
| 2012-07-13 07:00:00 | 6.5 |
| 2012-07-13 08:00:00 | 7.02 |
| 2012-07-13 09:00:00 | 8.06 |
| 2012-07-13 10:00:00 | 9.1 |
| 2012-07-13 11:00:00 | 7.54 |
| 2012-07-13 12:00:00 | 15.6 |
| 2012-07-13 13:00:00 | 7.8 |
| 2012-07-13 14:00:00 | 8.06 |
| 2012-07-13 15:00:00 | 11.96 |
| 2012-07-13 16:00:00 | 9.88 |
| 2012-07-13 17:00:00 | 9.62 |
| 2012-07-13 18:00:00 | 8.06 |
| 2012-07-13 19:00:00 | 8.58 |
| 2012-07-13 20:00:00 | 13 |
| 2012-07-13 21:00:00 | 13 |
| 2012-07-13 22:00:00 | 11.44 |
| 2012-07-13 23:00:00 | 8.58 |
| 2012-07-14 | 7.8 |
| 2012-07-14 01:00:00 | 9.1 |
| 2012-07-14 02:00:00 | 8.32 |
| 2012-07-14 03:00:00 | 6.5 |
| 2012-07-14 04:00:00 | 5.72 |
| 2012-07-14 05:00:00 | 5.46 |
| 2012-07-14 06:00:00 | 6.5 |
| 2012-07-14 07:00:00 | 9.36 |
| 2012-07-14 08:00:00 | 8.84 |
| 2012-07-14 09:00:00 | 8.84 |
| 2012-07-14 10:00:00 | 9.1 |
| 2012-07-14 11:00:00 | 10.14 |
| 2012-07-14 12:00:00 | 10.66 |
| 2012-07-14 13:00:00 | 10.66 |
| 2012-07-14 14:00:00 | 9.62 |
| 2012-07-14 15:00:00 | 10.4 |
| 2012-07-14 16:00:00 | 10.14 |
| 2012-07-14 17:00:00 | 9.88 |
| 2012-07-14 18:00:00 | 10.4 |
| 2012-07-14 19:00:00 | 11.18 |
| 2012-07-14 20:00:00 | 10.66 |
| 2012-07-14 21:00:00 | 13 |
| 2012-07-14 22:00:00 | 14.04 |
| 2012-07-14 23:00:00 | 9.88 |
| 2012-07-15 | 9.88 |
| 2012-07-15 01:00:00 | 9.1 |
| 2012-07-15 02:00:00 | 8.06 |
| 2012-07-15 03:00:00 | 6.5 |
| 2012-07-15 04:00:00 | 5.98 |
| 2012-07-15 05:00:00 | 6.76 |
| 2012-07-15 06:00:00 | 6.24 |
| 2012-07-15 07:00:00 | 5.72 |
| 2012-07-15 08:00:00 | 5.72 |
| 2012-07-15 09:00:00 | 5.98 |
| 2012-07-15 10:00:00 | 7.28 |
| 2012-07-15 11:00:00 | 10.14 |
| 2012-07-15 12:00:00 | 10.66 |
| 2012-07-15 13:00:00 | 10.92 |
| 2012-07-15 14:00:00 | 10.4 |
| 2012-07-15 15:00:00 | 9.88 |
| 2012-07-15 16:00:00 | 9.88 |
| 2012-07-15 17:00:00 | 9.62 |
| 2012-07-15 18:00:00 | 8.06 |
| 2012-07-15 19:00:00 | 8.06 |
| 2012-07-15 20:00:00 | 9.1 |
| 2012-07-15 21:00:00 | 10.14 |
| 2012-07-15 22:00:00 | 9.88 |
| 2012-07-15 23:00:00 | 9.36 |
| 2012-07-16 | 9.88 |
| 2012-07-16 01:00:00 | 9.62 |
| 2012-07-16 02:00:00 | 8.06 |
| 2012-07-16 03:00:00 | 6.5 |
| 2012-07-16 04:00:00 | 5.46 |
| 2012-07-16 05:00:00 | 5.2 |
| 2012-07-16 06:00:00 | 5.2 |
| 2012-07-16 07:00:00 | 5.46 |
| 2012-07-16 08:00:00 | 7.54 |
| 2012-07-16 09:00:00 | 16.64 |
| 2012-07-16 10:00:00 | 39 |
| 2012-07-16 11:00:00 | 39.78 |
| 2012-07-16 12:00:00 | 40.04 |
| 2012-07-16 13:00:00 | 39.52 |
| 2012-07-16 14:00:00 | 39.26 |
| 2012-07-16 15:00:00 | 39 |
| 2012-07-16 16:00:00 | 39 |
| 2012-07-16 17:00:00 | 39 |
| 2012-07-16 18:00:00 | 39 |
| 2012-07-16 19:00:00 | 13.78 |
| 2012-07-16 20:00:00 | 20.02 |
| 2012-07-16 21:00:00 | 14.04 |
| 2012-07-16 22:00:00 | 6.76 |
| 2012-07-16 23:00:00 | 14.82 |
| 2012-07-17 | 16.9 |
| 2012-07-17 01:00:00 | 5.72 |
| 2012-07-17 02:00:00 | 9.1 |
| 2012-07-17 03:00:00 | 13 |
| 2012-07-17 04:00:00 | 0.26 |
| 2012-07-17 05:00:00 | 11.96 |
| 2012-07-17 06:00:00 | 0.26 |
| 2012-07-17 07:00:00 | 12.48 |
| 2012-07-17 08:00:00 | 5.2 |
| 2012-07-17 09:00:00 | 9.1 |
| 2012-07-17 10:00:00 | 16.12 |
| 2012-07-17 11:00:00 | 7.54 |
| 2012-07-17 12:00:00 | 11.44 |
| 2012-07-17 13:00:00 | 26.52 |
| 2012-07-17 14:00:00 | 12.74 |
| 2012-07-17 15:00:00 | 16.9 |
| 2012-07-17 16:00:00 | 12.22 |
| 2012-07-17 17:00:00 | 3.64 |
| 2012-07-17 18:00:00 | 14.3 |
| 2012-07-17 19:00:00 | 13.78 |
| 2012-07-17 20:00:00 | 10.14 |
| 2012-07-17 21:00:00 | 6.5 |
| 2012-07-17 22:00:00 | 16.64 |
| 2012-07-17 23:00:00 | 17.68 |
| 2012-07-18 | 7.28 |
| 2012-07-18 01:00:00 | 9.62 |
| 2012-07-18 02:00:00 | 23.66 |
| 2012-07-18 03:00:00 | 15.86 |
| 2012-07-18 04:00:00 | 16.9 |
| 2012-07-18 05:00:00 | 6.76 |
| 2012-07-18 06:00:00 | 6.24 |
| 2012-07-18 07:00:00 | 13 |
| 2012-07-18 08:00:00 | 1.04 |
| 2012-07-18 09:00:00 | 13.78 |
| 2012-07-18 10:00:00 | 15.6 |
| 2012-07-18 11:00:00 | 5.72 |
| 2012-07-18 12:00:00 | 9.62 |
| 2012-07-18 13:00:00 | 14.82 |
| 2012-07-18 14:00:00 | 9.36 |
| 2012-07-18 15:00:00 | 11.18 |
| 2012-07-18 16:00:00 | 24.44 |
| 2012-07-18 17:00:00 | 9.62 |
| 2012-07-18 18:00:00 | 9.88 |
| 2012-07-18 19:00:00 | 15.08 |
| 2012-07-18 20:00:00 | 10.92 |
| 2012-07-18 21:00:00 | 5.98 |
| 2012-07-18 22:00:00 | 15.34 |
| 2012-07-18 23:00:00 | 17.42 |
| 2012-07-19 | 7.54 |
| 2012-07-19 01:00:00 | 9.1 |
| 2012-07-19 02:00:00 | 14.04 |
| 2012-07-19 03:00:00 | 3.9 |
| 2012-07-19 04:00:00 | 8.84 |
| 2012-07-19 05:00:00 | 8.58 |
| 2012-07-19 06:00:00 | 3.64 |
| 2012-07-19 07:00:00 | 12.48 |
| 2012-07-19 08:00:00 | 0.26 |
| 2012-07-19 09:00:00 | 13.78 |
| 2012-07-19 10:00:00 | 14.82 |
| 2012-07-19 11:00:00 | 5.98 |
| 2012-07-19 12:00:00 | 9.62 |
| 2012-07-19 13:00:00 | 14.82 |
| 2012-07-19 14:00:00 | 9.88 |
| 2012-07-19 15:00:00 | 4.94 |
| 2012-07-19 16:00:00 | 14.3 |
| 2012-07-19 17:00:00 | 14.04 |
| 2012-07-19 18:00:00 | 3.12 |
| 2012-07-19 19:00:00 | 11.44 |
| 2012-07-19 20:00:00 | 15.6 |
| 2012-07-19 21:00:00 | 8.32 |
| 2012-07-19 22:00:00 | 8.84 |
| 2012-07-19 23:00:00 | 16.9 |
| 2012-07-20 | 13.26 |
| 2012-07-20 01:00:00 | 4.16 |
| 2012-07-20 02:00:00 | 13.78 |
| 2012-07-20 03:00:00 | 11.44 |
| 2012-07-20 04:00:00 | 1.56 |
| 2012-07-20 05:00:00 | 12.22 |
| 2012-07-20 06:00:00 | 0 |
| 2012-07-20 07:00:00 | 12.48 |
| 2012-07-20 08:00:00 | 1.3 |
| 2012-07-20 09:00:00 | 12.22 |
| 2012-07-20 10:00:00 | 15.6 |
| 2012-07-20 11:00:00 | 5.2 |
| 2012-07-20 12:00:00 | 11.18 |
| 2012-07-20 13:00:00 | 15.08 |
| 2012-07-20 14:00:00 | 6.76 |
| 2012-07-20 15:00:00 | 7.8 |
| 2012-07-20 16:00:00 | 14.56 |
| 2012-07-20 17:00:00 | 9.62 |
| 2012-07-20 18:00:00 | 5.46 |
| 2012-07-20 19:00:00 | 15.08 |
| 2012-07-20 20:00:00 | 11.7 |
| 2012-07-20 21:00:00 | 4.68 |
| 2012-07-20 22:00:00 | 16.64 |
| 2012-07-20 23:00:00 | 15.08 |
| 2012-07-21 | 4.68 |
| 2012-07-21 01:00:00 | 11.44 |
| 2012-07-21 02:00:00 | 14.04 |
| 2012-07-21 03:00:00 | 0.26 |
| 2012-07-21 04:00:00 | 13 |
| 2012-07-21 05:00:00 | 7.02 |
| 2012-07-21 06:00:00 | 6.5 |
| 2012-07-21 07:00:00 | 13 |
| 2012-07-21 08:00:00 | 0 |
| 2012-07-21 09:00:00 | 13.26 |
| 2012-07-21 10:00:00 | 9.36 |
| 2012-07-21 11:00:00 | 5.98 |
| 2012-07-21 12:00:00 | 17.16 |
| 2012-07-21 13:00:00 | 14.04 |
| 2012-07-21 14:00:00 | 6.76 |
| 2012-07-21 15:00:00 | 15.08 |
| 2012-07-21 16:00:00 | 16.38 |
| 2012-07-21 17:00:00 | 6.76 |
| 2012-07-21 18:00:00 | 10.14 |
| 2012-07-21 19:00:00 | 15.08 |
| 2012-07-21 20:00:00 | 8.84 |
| 2012-07-21 21:00:00 | 6.76 |
| 2012-07-21 22:00:00 | 16.12 |
| 2012-07-21 23:00:00 | 12.48 |
| 2012-07-22 | 5.46 |
| 2012-07-22 01:00:00 | 13.78 |
| 2012-07-22 02:00:00 | 13.26 |
| 2012-07-22 03:00:00 | 0.26 |
| 2012-07-22 04:00:00 | 12.48 |
| 2012-07-22 05:00:00 | 3.9 |
| 2012-07-22 06:00:00 | 8.06 |
| 2012-07-22 07:00:00 | 6.76 |
| 2012-07-22 08:00:00 | 5.46 |
| 2012-07-22 09:00:00 | 11.96 |
| 2012-07-22 10:00:00 | 1.56 |
| 2012-07-22 11:00:00 | 15.08 |
| 2012-07-22 12:00:00 | 16.38 |
| 2012-07-22 13:00:00 | 7.8 |
| 2012-07-22 14:00:00 | 12.22 |
| 2012-07-22 15:00:00 | 16.64 |
| 2012-07-22 16:00:00 | 9.62 |
| 2012-07-22 17:00:00 | 6.5 |
| 2012-07-22 18:00:00 | 15.6 |
| 2012-07-22 19:00:00 | 11.18 |
| 2012-07-22 20:00:00 | 3.9 |
| 2012-07-22 21:00:00 | 15.08 |
| 2012-07-22 22:00:00 | 16.38 |
| 2012-07-22 23:00:00 | 6.5 |
| 2012-07-23 | 11.44 |
| 2012-07-23 01:00:00 | 15.34 |
| 2012-07-23 02:00:00 | 4.42 |
| 2012-07-23 03:00:00 | 8.84 |
| 2012-07-23 04:00:00 | 7.8 |
| 2012-07-23 05:00:00 | 4.68 |
| 2012-07-23 06:00:00 | 9.88 |
| 2012-07-23 07:00:00 | 2.6 |
| 2012-07-23 08:00:00 | 13 |
| 2012-07-23 09:00:00 | 1.04 |
| 2012-07-23 10:00:00 | 13.52 |
| 2012-07-23 11:00:00 | 15.6 |
| 2012-07-23 12:00:00 | 10.92 |
| 2012-07-23 13:00:00 | 8.32 |
| 2012-07-23 14:00:00 | 9.1 |
| 2012-07-23 15:00:00 | 6.76 |
| 2012-07-23 16:00:00 | 8.84 |
| 2012-07-23 17:00:00 | 7.54 |
| 2012-07-23 18:00:00 | 8.32 |
| 2012-07-23 19:00:00 | 9.1 |
| 2012-07-23 20:00:00 | 6.76 |
| 2012-07-23 21:00:00 | 9.62 |
| 2012-07-23 22:00:00 | 8.84 |
| 2012-07-23 23:00:00 | 8.84 |
| 2012-07-24 | 10.14 |
| 2012-07-24 01:00:00 | 9.1 |
| 2012-07-24 02:00:00 | 5.98 |
| 2012-07-24 03:00:00 | 6.76 |
| 2012-07-24 04:00:00 | 5.72 |
| 2012-07-24 05:00:00 | 5.46 |
| 2012-07-24 06:00:00 | 4.68 |
| 2012-07-24 07:00:00 | 4.94 |
| 2012-07-24 08:00:00 | 5.2 |
| 2012-07-24 09:00:00 | 7.54 |
| 2012-07-24 10:00:00 | 8.32 |
| 2012-07-24 11:00:00 | 7.02 |
| 2012-07-24 12:00:00 | 9.62 |
| 2012-07-24 13:00:00 | 8.06 |
| 2012-07-24 14:00:00 | 7.02 |
| 2012-07-24 15:00:00 | 8.84 |
| 2012-07-24 16:00:00 | 7.28 |
| 2012-07-24 17:00:00 | 8.58 |
| 2012-07-24 18:00:00 | 8.32 |
| 2012-07-24 19:00:00 | 6.76 |
| 2012-07-24 20:00:00 | 8.84 |
| 2012-07-24 21:00:00 | 8.58 |
| 2012-07-24 22:00:00 | 8.32 |
| 2012-07-24 23:00:00 | 10.14 |
| 2012-07-25 | 9.88 |
| 2012-07-25 01:00:00 | 8.58 |
| 2012-07-25 02:00:00 | 6.24 |
| 2012-07-25 03:00:00 | 7.02 |
| 2012-07-25 04:00:00 | 5.98 |
| 2012-07-25 05:00:00 | 4.94 |
| 2012-07-25 06:00:00 | 4.94 |
| 2012-07-25 07:00:00 | 4.94 |
| 2012-07-25 08:00:00 | 5.98 |
| 2012-07-25 09:00:00 | 22.1 |
| 2012-07-25 10:00:00 | 38.48 |
| 2012-07-25 11:00:00 | 27.04 |
| 2012-07-25 12:00:00 | 18.98 |
| 2012-07-25 13:00:00 | 11.96 |
| 2012-07-25 14:00:00 | 9.62 |
| 2012-07-25 15:00:00 | 9.88 |
| 2012-07-25 16:00:00 | 7.8 |
| 2012-07-25 17:00:00 | 8.06 |
| 2012-07-25 18:00:00 | 8.84 |
| 2012-07-25 19:00:00 | 7.28 |
| 2012-07-25 20:00:00 | 9.36 |
| 2012-07-25 21:00:00 | 9.62 |
| 2012-07-25 22:00:00 | 8.32 |
| 2012-07-25 23:00:00 | 10.4 |
| 2012-07-26 | 9.62 |
| 2012-07-26 01:00:00 | 7.28 |
| 2012-07-26 02:00:00 | 8.32 |
| 2012-07-26 03:00:00 | 5.98 |
| 2012-07-26 04:00:00 | 4.94 |
| 2012-07-26 05:00:00 | 5.72 |
| 2012-07-26 06:00:00 | 5.98 |
| 2012-07-26 07:00:00 | 5.46 |
| 2012-07-26 08:00:00 | 5.46 |
| 2012-07-26 09:00:00 | 8.06 |
| 2012-07-26 10:00:00 | 7.8 |
| 2012-07-26 11:00:00 | 8.58 |
| 2012-07-26 12:00:00 | 9.36 |
| 2012-07-26 13:00:00 | 8.58 |
| 2012-07-26 14:00:00 | 9.36 |
| 2012-07-26 15:00:00 | 15.6 |
| 2012-07-26 16:00:00 | 39.26 |
| 2012-07-26 17:00:00 | 39.52 |
| 2012-07-26 18:00:00 | 39.26 |
| 2012-07-26 19:00:00 | 39.26 |
| 2012-07-26 20:00:00 | 39 |
| 2012-07-26 21:00:00 | 38.48 |
| 2012-07-26 22:00:00 | 38.74 |
| 2012-07-26 23:00:00 | 38.22 |
| 2012-07-27 | 9.36 |
| 2012-07-27 01:00:00 | 14.82 |
| 2012-07-27 02:00:00 | 18.2 |
| 2012-07-27 03:00:00 | 0 |
| 2012-07-27 04:00:00 | 15.86 |
| 2012-07-27 05:00:00 | 5.98 |
| 2012-07-27 06:00:00 | 10.14 |
| 2012-07-27 07:00:00 | 10.4 |
| 2012-07-27 08:00:00 | 5.46 |
| 2012-07-27 09:00:00 | 17.94 |
| 2012-07-27 10:00:00 | 9.88 |
| 2012-07-27 11:00:00 | 12.22 |
| 2012-07-27 12:00:00 | 23.4 |
| 2012-07-27 13:00:00 | 5.98 |
| 2012-07-27 14:00:00 | 13.26 |
| 2012-07-27 15:00:00 | 18.72 |
| 2012-07-27 16:00:00 | 4.94 |
| 2012-07-27 17:00:00 | 12.74 |
| 2012-07-27 18:00:00 | 8.58 |
| 2012-07-27 19:00:00 | 9.36 |
| 2012-07-27 20:00:00 | 7.8 |
| 2012-07-27 21:00:00 | 10.14 |
| 2012-07-27 22:00:00 | 8.58 |
| 2012-07-27 23:00:00 | 9.62 |
| 2012-07-28 | 8.84 |
| 2012-07-28 01:00:00 | 7.02 |
| 2012-07-28 02:00:00 | 8.32 |
| 2012-07-28 03:00:00 | 5.2 |
| 2012-07-28 04:00:00 | 6.76 |
| 2012-07-28 05:00:00 | 5.46 |
| 2012-07-28 06:00:00 | 4.68 |
| 2012-07-28 07:00:00 | 4.68 |
| 2012-07-28 08:00:00 | 4.94 |
| 2012-07-28 09:00:00 | 8.32 |
| 2012-07-28 10:00:00 | 6.76 |
| 2012-07-28 11:00:00 | 10.92 |
| 2012-07-28 12:00:00 | 10.4 |
| 2012-07-28 13:00:00 | 9.36 |
| 2012-07-28 14:00:00 | 8.84 |
| 2012-07-28 15:00:00 | 10.66 |
| 2012-07-28 16:00:00 | 8.58 |
| 2012-07-28 17:00:00 | 8.84 |
| 2012-07-28 18:00:00 | 9.36 |
| 2012-07-28 19:00:00 | 7.28 |
| 2012-07-28 20:00:00 | 9.62 |
| 2012-07-28 21:00:00 | 7.02 |
| 2012-07-28 22:00:00 | 9.88 |
| 2012-07-28 23:00:00 | 8.06 |
| 2012-07-29 | 9.1 |
| 2012-07-29 01:00:00 | 8.32 |
| 2012-07-29 02:00:00 | 8.58 |
| 2012-07-29 03:00:00 | 22.62 |
| 2012-07-29 04:00:00 | 15.6 |
| 2012-07-29 05:00:00 | 8.58 |
| 2012-07-29 06:00:00 | 5.46 |
| 2012-07-29 07:00:00 | 4.94 |
| 2012-07-29 08:00:00 | 5.72 |
| 2012-07-29 09:00:00 | 7.8 |
| 2012-07-29 10:00:00 | 6.24 |
| 2012-07-29 11:00:00 | 10.4 |
| 2012-07-29 12:00:00 | 9.62 |
| 2012-07-29 13:00:00 | 8.06 |
| 2012-07-29 14:00:00 | 10.14 |
| 2012-07-29 15:00:00 | 9.36 |
| 2012-07-29 16:00:00 | 7.8 |
| 2012-07-29 17:00:00 | 12.22 |
| 2012-07-29 18:00:00 | 12.22 |
| 2012-07-29 19:00:00 | 10.14 |
| 2012-07-29 20:00:00 | 7.8 |
| 2012-07-29 21:00:00 | 9.1 |
| 2012-07-29 22:00:00 | 9.62 |
| 2012-07-29 23:00:00 | 9.1 |
| 2012-07-30 | 8.06 |
| 2012-07-30 01:00:00 | 9.36 |
| 2012-07-30 02:00:00 | 6.5 |
| 2012-07-30 03:00:00 | 5.46 |
| 2012-07-30 04:00:00 | 5.2 |
| 2012-07-30 05:00:00 | 5.72 |
| 2012-07-30 06:00:00 | 5.46 |
| 2012-07-30 07:00:00 | 5.72 |
| 2012-07-30 08:00:00 | 5.46 |
| 2012-07-30 09:00:00 | 5.98 |
| 2012-07-30 10:00:00 | 9.36 |
| 2012-07-30 11:00:00 | 8.32 |
| 2012-07-30 12:00:00 | 7.8 |
| 2012-07-30 13:00:00 | 9.62 |
| 2012-07-30 14:00:00 | 8.32 |
| 2012-07-30 15:00:00 | 6.76 |
| 2012-07-30 16:00:00 | 9.1 |
| 2012-07-30 17:00:00 | 7.8 |
| 2012-07-30 18:00:00 | 6.5 |
| 2012-07-30 19:00:00 | 8.58 |
| 2012-07-30 20:00:00 | 7.8 |
| 2012-07-30 21:00:00 | 6.76 |
| 2012-07-30 22:00:00 | 9.88 |
| 2012-07-30 23:00:00 | 9.62 |
| 2012-07-31 | 9.36 |
| 2012-07-31 01:00:00 | 7.02 |
| 2012-07-31 02:00:00 | 6.76 |
| 2012-07-31 03:00:00 | 7.02 |
| 2012-07-31 04:00:00 | 5.2 |
| 2012-07-31 05:00:00 | 5.2 |
| 2012-07-31 06:00:00 | 4.68 |
| 2012-07-31 07:00:00 | 5.2 |
| 2012-07-31 08:00:00 | 5.46 |
| 2012-07-31 09:00:00 | 7.02 |
| 2012-07-31 10:00:00 | 8.58 |
| 2012-07-31 11:00:00 | 9.62 |
| 2012-07-31 12:00:00 | 8.06 |
| 2012-07-31 13:00:00 | 7.54 |
| 2012-07-31 14:00:00 | 9.1 |
| 2012-07-31 15:00:00 | 8.32 |
| 2012-07-31 16:00:00 | 7.28 |
| 2012-07-31 17:00:00 | 7.8 |
| 2012-07-31 18:00:00 | 8.58 |
| 2012-07-31 19:00:00 | 7.54 |
| 2012-07-31 20:00:00 | 7.02 |
| 2012-07-31 21:00:00 | 9.1 |
| 2012-07-31 22:00:00 | 8.84 |
| 2012-07-31 23:00:00 | 9.62 |
| 2012-08-01 | 8.58 |
| 2012-08-01 01:00:00 | 7.28 |
| 2012-08-01 02:00:00 | 7.28 |
| 2012-08-01 03:00:00 | 6.5 |
| 2012-08-01 04:00:00 | 5.72 |
| 2012-08-01 05:00:00 | 4.94 |
| 2012-08-01 06:00:00 | 5.2 |
| 2012-08-01 07:00:00 | 5.2 |
| 2012-08-01 08:00:00 | 5.72 |
| 2012-08-01 09:00:00 | 6.24 |
| 2012-08-01 10:00:00 | 9.36 |
| 2012-08-01 11:00:00 | 8.84 |
| 2012-08-01 12:00:00 | 8.84 |
| 2012-08-01 13:00:00 | 7.54 |
| 2012-08-01 14:00:00 | 7.8 |
| 2012-08-01 15:00:00 | 9.1 |
| 2012-08-01 16:00:00 | 8.32 |
| 2012-08-01 17:00:00 | 7.02 |
| 2012-08-01 18:00:00 | 7.8 |
| 2012-08-01 19:00:00 | 8.84 |
| 2012-08-01 20:00:00 | 8.58 |
| 2012-08-01 21:00:00 | 8.84 |
| 2012-08-01 22:00:00 | 8.06 |
| 2012-08-01 23:00:00 | 9.88 |
| 2012-08-02 | 9.1 |
| 2012-08-02 01:00:00 | 8.06 |
| 2012-08-02 02:00:00 | 8.06 |
| 2012-08-02 03:00:00 | 6.76 |
| 2012-08-02 04:00:00 | 5.46 |
| 2012-08-02 05:00:00 | 5.2 |
| 2012-08-02 06:00:00 | 5.2 |
| 2012-08-02 07:00:00 | 5.46 |
| 2012-08-02 08:00:00 | 5.72 |
| 2012-08-02 09:00:00 | 7.28 |
| 2012-08-02 10:00:00 | 9.1 |
| 2012-08-02 11:00:00 | 9.1 |
| 2012-08-02 12:00:00 | 8.32 |
| 2012-08-02 13:00:00 | 8.32 |
| 2012-08-02 14:00:00 | 9.1 |
| 2012-08-02 15:00:00 | 8.84 |
| 2012-08-02 16:00:00 | 9.62 |
| 2012-08-02 17:00:00 | 8.84 |
| 2012-08-02 18:00:00 | 8.32 |
| 2012-08-02 19:00:00 | 7.02 |
| 2012-08-02 20:00:00 | 7.8 |
| 2012-08-02 21:00:00 | 9.62 |
| 2012-08-02 22:00:00 | 9.36 |
| 2012-08-02 23:00:00 | 9.36 |
| 2012-08-03 | 9.36 |
| 2012-08-03 01:00:00 | 9.1 |
| 2012-08-03 02:00:00 | 6.5 |
| 2012-08-03 03:00:00 | 5.72 |
| 2012-08-03 04:00:00 | 5.72 |
| 2012-08-03 05:00:00 | 5.98 |
| 2012-08-03 06:00:00 | 5.46 |
| 2012-08-03 07:00:00 | 5.98 |
| 2012-08-03 08:00:00 | 6.5 |
| 2012-08-03 09:00:00 | 7.02 |
| 2012-08-03 10:00:00 | 8.06 |
| 2012-08-03 11:00:00 | 9.1 |
| 2012-08-03 12:00:00 | 9.1 |
| 2012-08-03 13:00:00 | 8.32 |
| 2012-08-03 14:00:00 | 7.8 |
| 2012-08-03 15:00:00 | 8.06 |
| 2012-08-03 16:00:00 | 8.32 |
| 2012-08-03 17:00:00 | 7.8 |
| 2012-08-03 18:00:00 | 7.28 |
| 2012-08-03 19:00:00 | 8.32 |
| 2012-08-03 20:00:00 | 8.84 |
| 2012-08-03 21:00:00 | 8.84 |
| 2012-08-03 22:00:00 | 8.06 |
| 2012-08-03 23:00:00 | 7.8 |
| 2012-08-04 | 9.62 |
| 2012-08-04 01:00:00 | 8.32 |
| 2012-08-04 02:00:00 | 6.76 |
| 2012-08-04 03:00:00 | 5.46 |
| 2012-08-04 04:00:00 | 5.2 |
| 2012-08-04 05:00:00 | 4.94 |
| 2012-08-04 06:00:00 | 4.94 |
| 2012-08-04 07:00:00 | 4.94 |
| 2012-08-04 08:00:00 | 5.2 |
| 2012-08-04 09:00:00 | 7.02 |
| 2012-08-04 10:00:00 | 8.58 |
| 2012-08-04 11:00:00 | 9.36 |
| 2012-08-04 12:00:00 | 9.88 |
| 2012-08-04 13:00:00 | 9.62 |
| 2012-08-04 14:00:00 | 8.06 |
| 2012-08-04 15:00:00 | 8.84 |
| 2012-08-04 16:00:00 | 9.36 |
| 2012-08-04 17:00:00 | 8.58 |
| 2012-08-04 18:00:00 | 7.28 |
| 2012-08-04 19:00:00 | 8.06 |
| 2012-08-04 20:00:00 | 8.84 |
| 2012-08-04 21:00:00 | 8.84 |
| 2012-08-04 22:00:00 | 7.54 |
| 2012-08-04 23:00:00 | 8.84 |
| 2012-08-05 | 9.36 |
| 2012-08-05 01:00:00 | 7.8 |
| 2012-08-05 02:00:00 | 6.24 |
| 2012-08-05 03:00:00 | 6.76 |
| 2012-08-05 04:00:00 | 6.5 |
| 2012-08-05 05:00:00 | 5.72 |
| 2012-08-05 06:00:00 | 4.94 |
| 2012-08-05 07:00:00 | 4.94 |
| 2012-08-05 08:00:00 | 5.2 |
| 2012-08-05 09:00:00 | 8.06 |
| 2012-08-05 10:00:00 | 7.28 |
| 2012-08-05 11:00:00 | 14.3 |
| 2012-08-05 12:00:00 | 39.26 |
| 2012-08-05 13:00:00 | 39.26 |
| 2012-08-05 14:00:00 | 39.26 |
| 2012-08-05 15:00:00 | 39 |
| 2012-08-05 16:00:00 | 12.22 |
| 2012-08-05 17:00:00 | 18.46 |
| 2012-08-05 18:00:00 | 10.66 |
| 2012-08-05 19:00:00 | 8.06 |
| 2012-08-05 20:00:00 | 17.94 |
| 2012-08-05 21:00:00 | 5.72 |
| 2012-08-05 22:00:00 | 13 |
| 2012-08-05 23:00:00 | 12.22 |
| 2012-08-06 | 10.14 |
| 2012-08-06 01:00:00 | 7.02 |
| 2012-08-06 02:00:00 | 8.32 |
| 2012-08-06 03:00:00 | 5.46 |
| 2012-08-06 04:00:00 | 4.68 |
| 2012-08-06 05:00:00 | 4.68 |
| 2012-08-06 06:00:00 | 4.68 |
| 2012-08-06 07:00:00 | 4.68 |
| 2012-08-06 08:00:00 | 6.76 |
| 2012-08-06 09:00:00 | 7.02 |
| 2012-08-06 10:00:00 | 7.54 |
| 2012-08-06 11:00:00 | 9.88 |
| 2012-08-06 12:00:00 | 8.06 |
| 2012-08-06 13:00:00 | 8.32 |
| 2012-08-06 14:00:00 | 8.58 |
| 2012-08-06 15:00:00 | 6.76 |
| 2012-08-06 16:00:00 | 9.1 |
| 2012-08-06 17:00:00 | 7.28 |
| 2012-08-06 18:00:00 | 8.06 |
| 2012-08-06 19:00:00 | 7.8 |
| 2012-08-06 20:00:00 | 7.28 |
| 2012-08-06 21:00:00 | 9.36 |
| 2012-08-06 22:00:00 | 7.8 |
| 2012-08-06 23:00:00 | 11.18 |
| 2012-08-07 | 40.04 |
| 2012-08-07 01:00:00 | 39.26 |
| 2012-08-07 02:00:00 | 40.3 |
| 2012-08-07 03:00:00 | 40.3 |
| 2012-08-07 04:00:00 | 40.04 |
| 2012-08-07 05:00:00 | 40.3 |
| 2012-08-07 06:00:00 | 40.3 |
| 2012-08-07 07:00:00 | 39.78 |
| 2012-08-07 08:00:00 | 40.04 |
| 2012-08-07 09:00:00 | 40.04 |
| 2012-08-07 10:00:00 | 40.04 |
| 2012-08-07 11:00:00 | 40.04 |
| 2012-08-07 12:00:00 | 39.78 |
| 2012-08-07 13:00:00 | 39.78 |
| 2012-08-07 14:00:00 | 39.78 |
| 2012-08-07 15:00:00 | 39.78 |
| 2012-08-07 16:00:00 | 39.78 |
| 2012-08-07 17:00:00 | 39.52 |
| 2012-08-07 18:00:00 | 39.26 |
| 2012-08-07 19:00:00 | 39 |
| 2012-08-07 20:00:00 | 39.26 |
| 2012-08-07 21:00:00 | 39 |
| 2012-08-07 22:00:00 | 39 |
| 2012-08-07 23:00:00 | 16.12 |
| 2012-08-08 | 26.78 |
| 2012-08-08 01:00:00 | 11.96 |
| 2012-08-08 02:00:00 | 16.9 |
| 2012-08-08 03:00:00 | 18.98 |
| 2012-08-08 04:00:00 | 6.5 |
| 2012-08-08 05:00:00 | 13.52 |
| 2012-08-08 06:00:00 | 8.32 |
| 2012-08-08 07:00:00 | 9.1 |
| 2012-08-08 08:00:00 | 9.1 |
| 2012-08-08 09:00:00 | 10.92 |
| 2012-08-08 10:00:00 | 11.18 |
| 2012-08-08 11:00:00 | 10.92 |
| 2012-08-08 12:00:00 | 11.18 |
| 2012-08-08 13:00:00 | 10.66 |
| 2012-08-08 14:00:00 | 10.92 |
| 2012-08-08 15:00:00 | 10.4 |
| 2012-08-08 16:00:00 | 8.58 |
| 2012-08-08 17:00:00 | 11.18 |
| 2012-08-08 18:00:00 | 10.66 |
| 2012-08-08 19:00:00 | 10.14 |
| 2012-08-08 20:00:00 | 9.1 |
| 2012-08-08 21:00:00 | 11.44 |
| 2012-08-08 22:00:00 | 11.18 |
| 2012-08-08 23:00:00 | 12.22 |
| 2012-08-09 | 10.14 |
| 2012-08-09 01:00:00 | 9.62 |
| 2012-08-09 02:00:00 | 9.36 |
| 2012-08-09 03:00:00 | 6.5 |
| 2012-08-09 04:00:00 | 8.32 |
| 2012-08-09 05:00:00 | 5.72 |
| 2012-08-09 06:00:00 | 8.32 |
| 2012-08-09 07:00:00 | 5.98 |
| 2012-08-09 08:00:00 | 8.84 |
| 2012-08-09 09:00:00 | 8.06 |
| 2012-08-09 10:00:00 | 10.14 |
| 2012-08-09 11:00:00 | 10.4 |
| 2012-08-09 12:00:00 | 10.14 |
| 2012-08-09 13:00:00 | 9.36 |
| 2012-08-09 14:00:00 | 9.36 |
| 2012-08-09 15:00:00 | 9.88 |
| 2012-08-09 16:00:00 | 8.84 |
| 2012-08-09 17:00:00 | 9.1 |
| 2012-08-09 18:00:00 | 9.88 |
| 2012-08-09 19:00:00 | 8.32 |
| 2012-08-09 20:00:00 | 9.88 |
| 2012-08-09 21:00:00 | 10.14 |
| 2012-08-09 22:00:00 | 10.4 |
| 2012-08-09 23:00:00 | 10.14 |
| 2012-08-10 | 8.84 |
| 2012-08-10 01:00:00 | 9.62 |
| 2012-08-10 02:00:00 | 8.06 |
| 2012-08-10 03:00:00 | 6.24 |
| 2012-08-10 04:00:00 | 7.8 |
| 2012-08-10 05:00:00 | 5.98 |
| 2012-08-10 06:00:00 | 5.46 |
| 2012-08-10 07:00:00 | 7.8 |
| 2012-08-10 08:00:00 | 6.76 |
| 2012-08-10 09:00:00 | 8.06 |
| 2012-08-10 10:00:00 | 10.14 |
| 2012-08-10 11:00:00 | 9.88 |
| 2012-08-10 12:00:00 | 9.62 |
| 2012-08-10 13:00:00 | 8.32 |
| 2012-08-10 14:00:00 | 10.14 |
| 2012-08-10 15:00:00 | 9.62 |
| 2012-08-10 16:00:00 | 8.84 |
| 2012-08-10 17:00:00 | 8.06 |
| 2012-08-10 18:00:00 | 10.14 |
| 2012-08-10 19:00:00 | 9.62 |
| 2012-08-10 20:00:00 | 9.62 |
| 2012-08-10 21:00:00 | 8.84 |
| 2012-08-10 22:00:00 | 9.36 |
| 2012-08-10 23:00:00 | 11.7 |
| 2012-08-11 | 14.3 |
| 2012-08-11 01:00:00 | 10.4 |
| 2012-08-11 02:00:00 | 8.84 |
| 2012-08-11 03:00:00 | 7.28 |
| 2012-08-11 04:00:00 | 9.36 |
| 2012-08-11 05:00:00 | 31.72 |
| 2012-08-11 06:00:00 | 38.48 |
| 2012-08-11 07:00:00 | 39 |
| 2012-08-11 08:00:00 | 39.52 |
| 2012-08-11 09:00:00 | 39.78 |
| 2012-08-11 10:00:00 | 39.52 |
| 2012-08-11 11:00:00 | 39.26 |
| 2012-08-11 12:00:00 | 39.52 |
| 2012-08-11 13:00:00 | 39.26 |
| 2012-08-11 14:00:00 | 39.52 |
| 2012-08-11 15:00:00 | 39.26 |
| 2012-08-11 16:00:00 | 39.52 |
| 2012-08-11 17:00:00 | 39.26 |
| 2012-08-11 18:00:00 | 39.26 |
| 2012-08-11 19:00:00 | 39.26 |
| 2012-08-11 20:00:00 | 39.26 |
| 2012-08-11 21:00:00 | 39.52 |
| 2012-08-11 22:00:00 | 39.26 |
| 2012-08-11 23:00:00 | 39.52 |
| 2012-08-12 | 39.26 |
| 2012-08-12 01:00:00 | 39.26 |
| 2012-08-12 02:00:00 | 39.26 |
| 2012-08-12 03:00:00 | 39 |
| 2012-08-12 04:00:00 | 39.26 |
| 2012-08-12 05:00:00 | 39.52 |
| 2012-08-12 06:00:00 | 26.78 |
| 2012-08-12 07:00:00 | 17.94 |
| 2012-08-12 08:00:00 | 5.98 |
| 2012-08-12 09:00:00 | 16.9 |
| 2012-08-12 10:00:00 | 17.68 |
| 2012-08-12 11:00:00 | 10.14 |
| 2012-08-12 12:00:00 | 20.28 |
| 2012-08-12 13:00:00 | 17.68 |
| 2012-08-12 14:00:00 | 10.92 |
| 2012-08-12 15:00:00 | 22.1 |
| 2012-08-12 16:00:00 | 26.26 |
| 2012-08-12 17:00:00 | 39.78 |
| 2012-08-12 18:00:00 | 40.04 |
| 2012-08-12 19:00:00 | 39.78 |
| 2012-08-12 20:00:00 | 39.52 |
| 2012-08-12 21:00:00 | 39.78 |
| 2012-08-12 22:00:00 | 39.26 |
| 2012-08-12 23:00:00 | 39.52 |
| 2012-08-13 | 43.16 |
| 2012-08-13 01:00:00 | 40.82 |
| 2012-08-13 02:00:00 | 11.44 |
| 2012-08-13 03:00:00 | 11.18 |
| 2012-08-13 04:00:00 | 21.32 |
| 2012-08-13 05:00:00 | 7.28 |
| 2012-08-13 06:00:00 | 12.22 |
| 2012-08-13 07:00:00 | 20.02 |
| 2012-08-13 08:00:00 | 9.62 |
| 2012-08-13 09:00:00 | 14.04 |
| 2012-08-13 10:00:00 | 24.18 |
| 2012-08-13 11:00:00 | 11.96 |
| 2012-08-13 12:00:00 | 19.24 |
| 2012-08-13 13:00:00 | 19.5 |
| 2012-08-13 14:00:00 | 9.62 |
| 2012-08-13 15:00:00 | 18.98 |
| 2012-08-13 16:00:00 | 18.72 |
| 2012-08-13 17:00:00 | 9.62 |
| 2012-08-13 18:00:00 | 15.86 |
| 2012-08-13 19:00:00 | 21.06 |
| 2012-08-13 20:00:00 | 10.66 |
| 2012-08-13 21:00:00 | 14.04 |
| 2012-08-13 22:00:00 | 24.18 |
| 2012-08-13 23:00:00 | 11.7 |
| 2012-08-14 | 13 |
| 2012-08-14 01:00:00 | 20.02 |
| 2012-08-14 02:00:00 | 9.1 |
| 2012-08-14 03:00:00 | 7.8 |
| 2012-08-14 04:00:00 | 15.6 |
| 2012-08-14 05:00:00 | 4.68 |
| 2012-08-14 06:00:00 | 11.44 |
| 2012-08-14 07:00:00 | 14.3 |
| 2012-08-14 08:00:00 | 3.38 |
| 2012-08-14 09:00:00 | 18.46 |
| 2012-08-14 10:00:00 | 14.3 |
| 2012-08-14 11:00:00 | 4.16 |
| 2012-08-14 12:00:00 | 14.56 |
| 2012-08-14 13:00:00 | 15.6 |
| 2012-08-14 14:00:00 | 2.86 |
| 2012-08-14 15:00:00 | 13 |
| 2012-08-14 16:00:00 | 15.34 |
| 2012-08-14 17:00:00 | 2.86 |
| 2012-08-14 18:00:00 | 12.22 |
| 2012-08-14 19:00:00 | 15.6 |
| 2012-08-14 20:00:00 | 4.94 |
| 2012-08-14 21:00:00 | 12.22 |
| 2012-08-14 22:00:00 | 17.42 |
| 2012-08-14 23:00:00 | 6.5 |
| 2012-08-15 | 10.66 |
| 2012-08-15 01:00:00 | 15.86 |
| 2012-08-15 02:00:00 | 3.38 |
| 2012-08-15 03:00:00 | 10.4 |
| 2012-08-15 04:00:00 | 8.84 |
| 2012-08-15 05:00:00 | 4.42 |
| 2012-08-15 06:00:00 | 13 |
| 2012-08-15 07:00:00 | 0.26 |
| 2012-08-15 08:00:00 | 14.04 |
| 2012-08-15 09:00:00 | 7.54 |
| 2012-08-15 10:00:00 | 8.32 |
| 2012-08-15 11:00:00 | 16.64 |
| 2012-08-15 12:00:00 | 9.36 |
| 2012-08-15 13:00:00 | 7.02 |
| 2012-08-15 14:00:00 | 16.38 |
| 2012-08-15 15:00:00 | 8.84 |
| 2012-08-15 16:00:00 | 7.8 |
| 2012-08-15 17:00:00 | 12.22 |
| 2012-08-15 18:00:00 | 3.38 |
| 2012-08-15 19:00:00 | 13.52 |
| 2012-08-15 20:00:00 | 2.34 |
| 2012-08-15 21:00:00 | 15.34 |
| 2012-08-15 22:00:00 | 3.38 |
| 2012-08-15 23:00:00 | 15.34 |
| 2012-08-16 | 3.9 |
| 2012-08-16 01:00:00 | 14.56 |
| 2012-08-16 02:00:00 | 2.86 |
| 2012-08-16 03:00:00 | 11.96 |
| 2012-08-16 04:00:00 | 1.56 |
| 2012-08-16 05:00:00 | 11.18 |
| 2012-08-16 06:00:00 | 2.08 |
| 2012-08-16 07:00:00 | 10.4 |
| 2012-08-16 08:00:00 | 3.12 |
| 2012-08-16 09:00:00 | 12.22 |
| 2012-08-16 10:00:00 | 4.94 |
| 2012-08-16 11:00:00 | 13.78 |
| 2012-08-16 12:00:00 | 15.08 |
| 2012-08-16 13:00:00 | 1.82 |
| 2012-08-16 14:00:00 | 15.34 |
| 2012-08-16 15:00:00 | 3.12 |
| 2012-08-16 16:00:00 | 14.56 |
| 2012-08-16 17:00:00 | 4.16 |
| 2012-08-16 18:00:00 | 13.52 |
| 2012-08-16 19:00:00 | 5.2 |
| 2012-08-16 20:00:00 | 12.48 |
| 2012-08-16 21:00:00 | 7.02 |
| 2012-08-16 22:00:00 | 11.96 |
| 2012-08-16 23:00:00 | 12.22 |
| 2012-08-17 | 3.12 |
| 2012-08-17 01:00:00 | 15.6 |
| 2012-08-17 02:00:00 | 3.38 |
| 2012-08-17 03:00:00 | 11.7 |
| 2012-08-17 04:00:00 | 3.64 |
| 2012-08-17 05:00:00 | 8.58 |
| 2012-08-17 06:00:00 | 4.42 |
| 2012-08-17 07:00:00 | 6.5 |
| 2012-08-17 08:00:00 | 7.28 |
| 2012-08-17 09:00:00 | 7.28 |
| 2012-08-17 10:00:00 | 9.62 |
| 2012-08-17 11:00:00 | 8.06 |
| 2012-08-17 12:00:00 | 11.18 |
| 2012-08-17 13:00:00 | 4.68 |
| 2012-08-17 14:00:00 | 13.78 |
| 2012-08-17 15:00:00 | 10.4 |
| 2012-08-17 16:00:00 | 9.88 |
| 2012-08-17 17:00:00 | 12.22 |
| 2012-08-17 18:00:00 | 2.86 |
| 2012-08-17 19:00:00 | 14.56 |
| 2012-08-17 20:00:00 | 3.9 |
| 2012-08-17 21:00:00 | 13.78 |
| 2012-08-17 22:00:00 | 7.8 |
| 2012-08-17 23:00:00 | 10.66 |
| 2012-08-18 | 11.7 |
| 2012-08-18 01:00:00 | 4.16 |
| 2012-08-18 02:00:00 | 13 |
| 2012-08-18 03:00:00 | 0.26 |
| 2012-08-18 04:00:00 | 13.52 |
| 2012-08-18 05:00:00 | 0 |
| 2012-08-18 06:00:00 | 11.96 |
| 2012-08-18 07:00:00 | 1.3 |
| 2012-08-18 08:00:00 | 9.62 |
| 2012-08-18 09:00:00 | 4.16 |
| 2012-08-18 10:00:00 | 11.18 |
| 2012-08-18 11:00:00 | 11.44 |
| 2012-08-18 12:00:00 | 8.32 |
| 2012-08-18 13:00:00 | 12.74 |
| 2012-08-18 14:00:00 | 12.22 |
| 2012-08-18 15:00:00 | 6.24 |
| 2012-08-18 16:00:00 | 13.26 |
| 2012-08-18 17:00:00 | 5.2 |
| 2012-08-18 18:00:00 | 13 |
| 2012-08-18 19:00:00 | 7.28 |
| 2012-08-18 20:00:00 | 9.62 |
| 2012-08-18 21:00:00 | 10.66 |
| 2012-08-18 22:00:00 | 7.54 |
| 2012-08-18 23:00:00 | 12.48 |
| 2012-08-19 | 2.6 |
| 2012-08-19 01:00:00 | 15.34 |
| 2012-08-19 02:00:00 | 2.86 |
| 2012-08-19 03:00:00 | 11.7 |
| 2012-08-19 04:00:00 | 3.38 |
| 2012-08-19 05:00:00 | 8.58 |
| 2012-08-19 06:00:00 | 4.42 |
| 2012-08-19 07:00:00 | 5.98 |
| 2012-08-19 08:00:00 | 6.5 |
| 2012-08-19 09:00:00 | 5.72 |
| 2012-08-19 10:00:00 | 9.88 |
| 2012-08-19 11:00:00 | 8.84 |
| 2012-08-19 12:00:00 | 12.22 |
| 2012-08-19 13:00:00 | 5.98 |
| 2012-08-19 14:00:00 | 14.3 |
| 2012-08-19 15:00:00 | 12.22 |
| 2012-08-19 16:00:00 | 6.24 |
| 2012-08-19 17:00:00 | 13 |
| 2012-08-19 18:00:00 | 2.86 |
| 2012-08-19 19:00:00 | 14.82 |
| 2012-08-19 20:00:00 | 5.98 |
| 2012-08-19 21:00:00 | 12.22 |
| 2012-08-19 22:00:00 | 10.4 |
| 2012-08-19 23:00:00 | 9.1 |
| 2012-08-20 | 12.22 |
| 2012-08-20 01:00:00 | 2.86 |
| 2012-08-20 02:00:00 | 14.04 |
| 2012-08-20 03:00:00 | 1.82 |
| 2012-08-20 04:00:00 | 11.18 |
| 2012-08-20 05:00:00 | 2.08 |
| 2012-08-20 06:00:00 | 8.06 |
| 2012-08-20 07:00:00 | 3.9 |
| 2012-08-20 08:00:00 | 7.02 |
| 2012-08-20 09:00:00 | 7.54 |
| 2012-08-20 10:00:00 | 8.84 |
| 2012-08-20 11:00:00 | 11.96 |
| 2012-08-20 12:00:00 | 8.06 |
| 2012-08-20 13:00:00 | 9.36 |
| 2012-08-20 14:00:00 | 8.84 |
| 2012-08-20 15:00:00 | 8.32 |
| 2012-08-20 16:00:00 | 9.88 |
| 2012-08-20 17:00:00 | 6.76 |
| 2012-08-20 18:00:00 | 11.7 |
| 2012-08-20 19:00:00 | 4.16 |
| 2012-08-20 20:00:00 | 13.52 |
| 2012-08-20 21:00:00 | 2.6 |
| 2012-08-20 22:00:00 | 15.34 |
| 2012-08-20 23:00:00 | 4.68 |
| 2012-08-21 | 14.04 |
| 2012-08-21 01:00:00 | 4.42 |
| 2012-08-21 02:00:00 | 11.44 |
| 2012-08-21 03:00:00 | 3.38 |
| 2012-08-21 04:00:00 | 9.62 |
| 2012-08-21 05:00:00 | 3.12 |
| 2012-08-21 06:00:00 | 7.54 |
| 2012-08-21 07:00:00 | 4.42 |
| 2012-08-21 08:00:00 | 6.76 |
| 2012-08-21 09:00:00 | 7.54 |
| 2012-08-21 10:00:00 | 8.06 |
| 2012-08-21 11:00:00 | 8.84 |
| 2012-08-21 12:00:00 | 8.32 |
| 2012-08-21 13:00:00 | 9.62 |
| 2012-08-21 14:00:00 | 7.8 |
| 2012-08-21 15:00:00 | 9.88 |
| 2012-08-21 16:00:00 | 6.76 |
| 2012-08-21 17:00:00 | 12.22 |
| 2012-08-21 18:00:00 | 2.6 |
| 2012-08-21 19:00:00 | 14.3 |
| 2012-08-21 20:00:00 | 1.82 |
| 2012-08-21 21:00:00 | 15.34 |
| 2012-08-21 22:00:00 | 3.9 |
| 2012-08-21 23:00:00 | 14.3 |
| 2012-08-22 | 7.54 |
| 2012-08-22 01:00:00 | 9.62 |
| 2012-08-22 02:00:00 | 6.76 |
| 2012-08-22 03:00:00 | 7.54 |
| 2012-08-22 04:00:00 | 5.98 |
| 2012-08-22 05:00:00 | 3.9 |
| 2012-08-22 06:00:00 | 8.58 |
| 2012-08-22 07:00:00 | 0 |
| 2012-08-22 08:00:00 | 13 |
| 2012-08-22 09:00:00 | 3.12 |
| 2012-08-22 10:00:00 | 14.04 |
| 2012-08-22 11:00:00 | 3.12 |
| 2012-08-22 12:00:00 | 14.3 |
| 2012-08-22 13:00:00 | 2.34 |
| 2012-08-22 14:00:00 | 15.08 |
| 2012-08-22 15:00:00 | 1.56 |
| 2012-08-22 16:00:00 | 15.34 |
| 2012-08-22 17:00:00 | 1.56 |
| 2012-08-22 18:00:00 | 15.34 |
| 2012-08-22 19:00:00 | 1.3 |
| 2012-08-22 20:00:00 | 15.34 |
| 2012-08-22 21:00:00 | 2.34 |
| 2012-08-22 22:00:00 | 15.86 |
| 2012-08-22 23:00:00 | 4.94 |
| 2012-08-23 | 13.78 |
| 2012-08-23 01:00:00 | 5.98 |
| 2012-08-23 02:00:00 | 9.88 |
| 2012-08-23 03:00:00 | 4.94 |
| 2012-08-23 04:00:00 | 8.32 |
| 2012-08-23 05:00:00 | 3.9 |
| 2012-08-23 06:00:00 | 4.68 |
| 2012-08-23 07:00:00 | 7.54 |
| 2012-08-23 08:00:00 | 2.86 |
| 2012-08-23 09:00:00 | 11.18 |
| 2012-08-23 10:00:00 | 4.94 |
| 2012-08-23 11:00:00 | 11.44 |
| 2012-08-23 12:00:00 | 6.24 |
| 2012-08-23 13:00:00 | 10.66 |
| 2012-08-23 14:00:00 | 7.28 |
| 2012-08-23 15:00:00 | 12.48 |
| 2012-08-23 16:00:00 | 6.76 |
| 2012-08-23 17:00:00 | 10.66 |
| 2012-08-23 18:00:00 | 6.24 |
| 2012-08-23 19:00:00 | 10.14 |
| 2012-08-23 20:00:00 | 5.72 |
| 2012-08-23 21:00:00 | 11.18 |
| 2012-08-23 22:00:00 | 7.54 |
| 2012-08-23 23:00:00 | 10.66 |
| 2012-08-24 | 9.1 |
| 2012-08-24 01:00:00 | 7.8 |
| 2012-08-24 02:00:00 | 7.02 |
| 2012-08-24 03:00:00 | 6.76 |
| 2012-08-24 04:00:00 | 6.24 |
| 2012-08-24 05:00:00 | 4.16 |
| 2012-08-24 06:00:00 | 7.54 |
| 2012-08-24 07:00:00 | 0.26 |
| 2012-08-24 08:00:00 | 11.96 |
| 2012-08-24 09:00:00 | 1.82 |
| 2012-08-24 10:00:00 | 13.26 |
| 2012-08-24 11:00:00 | 5.72 |
| 2012-08-24 12:00:00 | 12.48 |
| 2012-08-24 13:00:00 | 5.2 |
| 2012-08-24 14:00:00 | 12.22 |
| 2012-08-24 15:00:00 | 4.94 |
| 2012-08-24 16:00:00 | 12.22 |
| 2012-08-24 17:00:00 | 4.68 |
| 2012-08-24 18:00:00 | 12.22 |
| 2012-08-24 19:00:00 | 3.9 |
| 2012-08-24 20:00:00 | 12.74 |
| 2012-08-24 21:00:00 | 5.98 |
| 2012-08-24 22:00:00 | 12.74 |
| 2012-08-24 23:00:00 | 16.12 |
| 2012-08-25 | 38.74 |
| 2012-08-25 01:00:00 | 40.3 |
| 2012-08-25 02:00:00 | 40.04 |
| 2012-08-25 03:00:00 | 40.04 |
| 2012-08-25 04:00:00 | 39.78 |
| 2012-08-25 05:00:00 | 39.52 |
| 2012-08-25 06:00:00 | 39.26 |
| 2012-08-25 07:00:00 | 26.52 |
| 2012-08-25 08:00:00 | 7.02 |
| 2012-08-25 09:00:00 | 7.54 |
| 2012-08-25 10:00:00 | 15.86 |
| 2012-08-25 11:00:00 | 4.94 |
| 2012-08-25 12:00:00 | 14.04 |
| 2012-08-25 13:00:00 | 9.62 |
| 2012-08-25 14:00:00 | 9.1 |
| 2012-08-25 15:00:00 | 8.58 |
| 2012-08-25 16:00:00 | 10.14 |
| 2012-08-25 17:00:00 | 9.1 |
| 2012-08-25 18:00:00 | 7.28 |
| 2012-08-25 19:00:00 | 9.62 |
| 2012-08-25 20:00:00 | 7.54 |
| 2012-08-25 21:00:00 | 8.84 |
| 2012-08-25 22:00:00 | 10.14 |
| 2012-08-25 23:00:00 | 8.06 |
| 2012-08-26 | 8.84 |
| 2012-08-26 01:00:00 | 8.32 |
| 2012-08-26 02:00:00 | 5.98 |
| 2012-08-26 03:00:00 | 22.36 |
| 2012-08-26 04:00:00 | 37.44 |
| 2012-08-26 05:00:00 | 23.92 |
| 2012-08-26 06:00:00 | 6.76 |
| 2012-08-26 07:00:00 | 8.06 |
| 2012-08-26 08:00:00 | 30.42 |
| 2012-08-26 09:00:00 | 40.04 |
| 2012-08-26 10:00:00 | 40.56 |
| 2012-08-26 11:00:00 | 40.3 |
| 2012-08-26 12:00:00 | 40.3 |
| 2012-08-26 13:00:00 | 40.3 |
| 2012-08-26 14:00:00 | 40.3 |
| 2012-08-26 15:00:00 | 39.52 |
| 2012-08-26 16:00:00 | 39.52 |
| 2012-08-26 17:00:00 | 39.52 |
| 2012-08-26 18:00:00 | 14.56 |
| 2012-08-26 19:00:00 | 18.46 |
| 2012-08-26 20:00:00 | 13 |
| 2012-08-26 21:00:00 | 8.32 |
| 2012-08-26 22:00:00 | 23.14 |
| 2012-08-26 23:00:00 | 11.44 |
| 2012-08-27 | 9.88 |
| 2012-08-27 01:00:00 | 14.3 |
| 2012-08-27 02:00:00 | 7.8 |
| 2012-08-27 03:00:00 | 5.98 |
| 2012-08-27 04:00:00 | 7.54 |
| 2012-08-27 05:00:00 | 5.2 |
| 2012-08-27 06:00:00 | 4.94 |
| 2012-08-27 07:00:00 | 6.76 |
| 2012-08-27 08:00:00 | 10.66 |
| 2012-08-27 09:00:00 | 11.96 |
| 2012-08-27 10:00:00 | 10.4 |
| 2012-08-27 11:00:00 | 9.1 |
| 2012-08-27 12:00:00 | 9.1 |
| 2012-08-27 13:00:00 | 9.62 |
| 2012-08-27 14:00:00 | 8.06 |
| 2012-08-27 15:00:00 | 9.1 |
| 2012-08-27 16:00:00 | 7.8 |
| 2012-08-27 17:00:00 | 9.88 |
| 2012-08-27 18:00:00 | 6.76 |
| 2012-08-27 19:00:00 | 9.62 |
| 2012-08-27 20:00:00 | 7.02 |
| 2012-08-27 21:00:00 | 10.14 |
| 2012-08-27 22:00:00 | 9.1 |
| 2012-08-27 23:00:00 | 9.1 |
| 2012-08-28 | 10.4 |
| 2012-08-28 01:00:00 | 7.54 |
| 2012-08-28 02:00:00 | 8.06 |
| 2012-08-28 03:00:00 | 5.98 |
| 2012-08-28 04:00:00 | 5.2 |
| 2012-08-28 05:00:00 | 5.72 |
| 2012-08-28 06:00:00 | 6.5 |
| 2012-08-28 07:00:00 | 4.94 |
| 2012-08-28 08:00:00 | 5.46 |
| 2012-08-28 09:00:00 | 8.84 |
| 2012-08-28 10:00:00 | 7.02 |
| 2012-08-28 11:00:00 | 9.88 |
| 2012-08-28 12:00:00 | 10.14 |
| 2012-08-28 13:00:00 | 7.54 |
| 2012-08-28 14:00:00 | 9.62 |
| 2012-08-28 15:00:00 | 8.06 |
| 2012-08-28 16:00:00 | 8.06 |
| 2012-08-28 17:00:00 | 9.1 |
| 2012-08-28 18:00:00 | 7.02 |
| 2012-08-28 19:00:00 | 9.62 |
| 2012-08-28 20:00:00 | 8.84 |
| 2012-08-28 21:00:00 | 8.58 |
| 2012-08-28 22:00:00 | 10.14 |
| 2012-08-28 23:00:00 | 10.14 |
| 2012-08-29 | 8.84 |
| 2012-08-29 01:00:00 | 8.06 |
| 2012-08-29 02:00:00 | 8.58 |
| 2012-08-29 03:00:00 | 5.72 |
| 2012-08-29 04:00:00 | 4.94 |
| 2012-08-29 05:00:00 | 4.94 |
| 2012-08-29 06:00:00 | 4.94 |
| 2012-08-29 07:00:00 | 6.5 |
| 2012-08-29 08:00:00 | 6.76 |
| 2012-08-29 09:00:00 | 6.5 |
| 2012-08-29 10:00:00 | 8.58 |
| 2012-08-29 11:00:00 | 8.84 |
| 2012-08-29 12:00:00 | 7.02 |
| 2012-08-29 13:00:00 | 8.84 |
| 2012-08-29 14:00:00 | 9.1 |
| 2012-08-29 15:00:00 | 7.28 |
| 2012-08-29 16:00:00 | 8.84 |
| 2012-08-29 17:00:00 | 8.84 |
| 2012-08-29 18:00:00 | 7.28 |
| 2012-08-29 19:00:00 | 8.58 |
| 2012-08-29 20:00:00 | 9.36 |
| 2012-08-29 21:00:00 | 9.88 |
| 2012-08-29 22:00:00 | 9.88 |
| 2012-08-29 23:00:00 | 9.62 |
| 2012-08-30 | 8.32 |
| 2012-08-30 01:00:00 | 8.58 |
| 2012-08-30 02:00:00 | 7.54 |
| 2012-08-30 03:00:00 | 5.98 |
| 2012-08-30 04:00:00 | 5.2 |
| 2012-08-30 05:00:00 | 4.94 |
| 2012-08-30 06:00:00 | 5.2 |
| 2012-08-30 07:00:00 | 4.94 |
| 2012-08-30 08:00:00 | 6.76 |
| 2012-08-30 09:00:00 | 8.32 |
| 2012-08-30 10:00:00 | 8.32 |
| 2012-08-30 11:00:00 | 8.06 |
| 2012-08-30 12:00:00 | 9.36 |
| 2012-08-30 13:00:00 | 9.1 |
| 2012-08-30 14:00:00 | 8.32 |
| 2012-08-30 15:00:00 | 7.28 |
| 2012-08-30 16:00:00 | 9.36 |
| 2012-08-30 17:00:00 | 8.58 |
| 2012-08-30 18:00:00 | 7.8 |
| 2012-08-30 19:00:00 | 7.28 |
| 2012-08-30 20:00:00 | 9.36 |
| 2012-08-30 21:00:00 | 9.36 |
| 2012-08-30 22:00:00 | 9.88 |
| 2012-08-30 23:00:00 | 9.88 |
| 2012-08-31 | 8.58 |
| 2012-08-31 01:00:00 | 7.54 |
| 2012-08-31 02:00:00 | 8.06 |
| 2012-08-31 03:00:00 | 6.76 |
| 2012-08-31 04:00:00 | 5.46 |
| 2012-08-31 05:00:00 | 5.2 |
| 2012-08-31 06:00:00 | 5.2 |
| 2012-08-31 07:00:00 | 5.2 |
| 2012-08-31 08:00:00 | 5.72 |
| 2012-08-31 09:00:00 | 7.02 |
| 2012-08-31 10:00:00 | 9.1 |
| 2012-08-31 11:00:00 | 8.84 |
| 2012-08-31 12:00:00 | 7.54 |
| 2012-08-31 13:00:00 | 8.06 |
| 2012-08-31 14:00:00 | 8.84 |
| 2012-08-31 15:00:00 | 8.32 |
| 2012-08-31 16:00:00 | 7.8 |
| 2012-08-31 17:00:00 | 8.58 |
| 2012-08-31 18:00:00 | 9.36 |
| 2012-08-31 19:00:00 | 9.36 |
| 2012-08-31 20:00:00 | 8.58 |
| 2012-08-31 21:00:00 | 8.06 |
| 2012-08-31 22:00:00 | 9.88 |
| 2012-08-31 23:00:00 | 10.14 |
| 2012-09-01 | 15.34 |
| 2012-09-01 01:00:00 | 17.42 |
| 2012-09-01 02:00:00 | 15.08 |
| 2012-09-01 03:00:00 | 11.7 |
| 2012-09-01 04:00:00 | 9.88 |
| 2012-09-01 05:00:00 | 9.62 |
| 2012-09-01 06:00:00 | 7.02 |
| 2012-09-01 07:00:00 | 7.8 |
| 2012-09-01 08:00:00 | 6.76 |
| 2012-09-01 09:00:00 | 5.98 |
| 2012-09-01 10:00:00 | 15.6 |
| 2012-09-01 11:00:00 | 38.48 |
| 2012-09-01 12:00:00 | 40.04 |
| 2012-09-01 13:00:00 | 39.78 |
| 2012-09-01 14:00:00 | 39.26 |
| 2012-09-01 15:00:00 | 18.72 |
| 2012-09-01 16:00:00 | 20.28 |
| 2012-09-01 17:00:00 | 13 |
| 2012-09-01 18:00:00 | 7.02 |
| 2012-09-01 19:00:00 | 18.46 |
| 2012-09-01 20:00:00 | 10.92 |
| 2012-09-01 21:00:00 | 7.02 |
| 2012-09-01 22:00:00 | 14.56 |
| 2012-09-01 23:00:00 | 9.62 |
| 2012-09-02 | 7.54 |
| 2012-09-02 01:00:00 | 9.36 |
| 2012-09-02 02:00:00 | 6.24 |
| 2012-09-02 03:00:00 | 7.28 |
| 2012-09-02 04:00:00 | 5.98 |
| 2012-09-02 05:00:00 | 4.68 |
| 2012-09-02 06:00:00 | 4.68 |
| 2012-09-02 07:00:00 | 4.68 |
| 2012-09-02 08:00:00 | 5.72 |
| 2012-09-02 09:00:00 | 6.76 |
| 2012-09-02 10:00:00 | 5.98 |
| 2012-09-02 11:00:00 | 10.4 |
| 2012-09-02 12:00:00 | 9.88 |
| 2012-09-02 13:00:00 | 10.4 |
| 2012-09-02 14:00:00 | 11.18 |
| 2012-09-02 15:00:00 | 9.36 |
| 2012-09-02 16:00:00 | 10.14 |
| 2012-09-02 17:00:00 | 8.58 |
| 2012-09-02 18:00:00 | 8.84 |
| 2012-09-02 19:00:00 | 8.84 |
| 2012-09-02 20:00:00 | 8.84 |
| 2012-09-02 21:00:00 | 10.92 |
| 2012-09-02 22:00:00 | 12.48 |
| 2012-09-02 23:00:00 | 10.92 |
| 2012-09-03 | 8.32 |
| 2012-09-03 01:00:00 | 9.1 |
| 2012-09-03 02:00:00 | 6.5 |
| 2012-09-03 03:00:00 | 6.76 |
| 2012-09-03 04:00:00 | 5.98 |
| 2012-09-03 05:00:00 | 4.68 |
| 2012-09-03 06:00:00 | 4.94 |
| 2012-09-03 07:00:00 | 4.94 |
| 2012-09-03 08:00:00 | 7.28 |
| 2012-09-03 09:00:00 | 7.54 |
| 2012-09-03 10:00:00 | 8.58 |
| 2012-09-03 11:00:00 | 8.32 |
| 2012-09-03 12:00:00 | 7.8 |
| 2012-09-03 13:00:00 | 8.58 |
| 2012-09-03 14:00:00 | 7.54 |
| 2012-09-03 15:00:00 | 9.1 |
| 2012-09-03 16:00:00 | 6.5 |
| 2012-09-03 17:00:00 | 9.36 |
| 2012-09-03 18:00:00 | 6.76 |
| 2012-09-03 19:00:00 | 9.1 |
| 2012-09-03 20:00:00 | 8.06 |
| 2012-09-03 21:00:00 | 8.84 |
| 2012-09-03 22:00:00 | 9.88 |
| 2012-09-03 23:00:00 | 10.4 |
| 2012-09-04 | 7.8 |
| 2012-09-04 01:00:00 | 8.32 |
| 2012-09-04 02:00:00 | 6.76 |
| 2012-09-04 03:00:00 | 5.46 |
| 2012-09-04 04:00:00 | 4.94 |
| 2012-09-04 05:00:00 | 5.98 |
| 2012-09-04 06:00:00 | 5.2 |
| 2012-09-04 07:00:00 | 5.46 |
| 2012-09-04 08:00:00 | 5.72 |
| 2012-09-04 09:00:00 | 7.8 |
| 2012-09-04 10:00:00 | 8.84 |
| 2012-09-04 11:00:00 | 7.02 |
| 2012-09-04 12:00:00 | 9.36 |
| 2012-09-04 13:00:00 | 7.28 |
| 2012-09-04 14:00:00 | 8.06 |
| 2012-09-04 15:00:00 | 9.1 |
| 2012-09-04 16:00:00 | 7.02 |
| 2012-09-04 17:00:00 | 9.1 |
| 2012-09-04 18:00:00 | 7.54 |
| 2012-09-04 19:00:00 | 7.8 |
| 2012-09-04 20:00:00 | 9.1 |
| 2012-09-04 21:00:00 | 8.84 |
| 2012-09-04 22:00:00 | 9.62 |
| 2012-09-04 23:00:00 | 9.36 |
| 2012-09-05 | 9.88 |
| 2012-09-05 01:00:00 | 8.06 |
| 2012-09-05 02:00:00 | 5.72 |
| 2012-09-05 03:00:00 | 5.72 |
| 2012-09-05 04:00:00 | 5.72 |
| 2012-09-05 05:00:00 | 4.94 |
| 2012-09-05 06:00:00 | 5.2 |
| 2012-09-05 07:00:00 | 5.46 |
| 2012-09-05 08:00:00 | 5.98 |
| 2012-09-05 09:00:00 | 6.76 |
| 2012-09-05 10:00:00 | 9.36 |
| 2012-09-05 11:00:00 | 8.32 |
| 2012-09-05 12:00:00 | 7.02 |
| 2012-09-05 13:00:00 | 8.84 |
| 2012-09-05 14:00:00 | 7.54 |
| 2012-09-05 15:00:00 | 6.5 |
| 2012-09-05 16:00:00 | 8.84 |
| 2012-09-05 17:00:00 | 8.06 |
| 2012-09-05 18:00:00 | 6.5 |
| 2012-09-05 19:00:00 | 8.84 |
| 2012-09-05 20:00:00 | 8.32 |
| 2012-09-05 21:00:00 | 8.84 |
| 2012-09-05 22:00:00 | 9.62 |
| 2012-09-05 23:00:00 | 9.62 |
| 2012-09-06 | 9.1 |
| 2012-09-06 01:00:00 | 8.84 |
| 2012-09-06 02:00:00 | 6.5 |
| 2012-09-06 03:00:00 | 5.2 |
| 2012-09-06 04:00:00 | 4.94 |
| 2012-09-06 05:00:00 | 4.68 |
| 2012-09-06 06:00:00 | 4.94 |
| 2012-09-06 07:00:00 | 4.94 |
| 2012-09-06 08:00:00 | 5.98 |
| 2012-09-06 09:00:00 | 8.06 |
| 2012-09-06 10:00:00 | 8.32 |
| 2012-09-06 11:00:00 | 6.76 |
| 2012-09-06 12:00:00 | 8.58 |
| 2012-09-06 13:00:00 | 7.54 |
| 2012-09-06 14:00:00 | 6.24 |
| 2012-09-06 15:00:00 | 8.06 |
| 2012-09-06 16:00:00 | 8.06 |
| 2012-09-06 17:00:00 | 6.76 |
| 2012-09-06 18:00:00 | 8.06 |
| 2012-09-06 19:00:00 | 8.32 |
| 2012-09-06 20:00:00 | 7.54 |
| 2012-09-06 21:00:00 | 8.32 |
| 2012-09-06 22:00:00 | 10.4 |
| 2012-09-06 23:00:00 | 9.88 |
| 2012-09-07 | 9.1 |
| 2012-09-07 01:00:00 | 8.06 |
| 2012-09-07 02:00:00 | 5.72 |
| 2012-09-07 03:00:00 | 5.46 |
| 2012-09-07 04:00:00 | 4.94 |
| 2012-09-07 05:00:00 | 4.68 |
| 2012-09-07 06:00:00 | 4.94 |
| 2012-09-07 07:00:00 | 4.68 |
| 2012-09-07 08:00:00 | 7.02 |
| 2012-09-07 09:00:00 | 7.8 |
| 2012-09-07 10:00:00 | 7.02 |
| 2012-09-07 11:00:00 | 8.84 |
| 2012-09-07 12:00:00 | 8.84 |
| 2012-09-07 13:00:00 | 7.8 |
| 2012-09-07 14:00:00 | 7.28 |
| 2012-09-07 15:00:00 | 9.1 |
| 2012-09-07 16:00:00 | 8.06 |
| 2012-09-07 17:00:00 | 7.02 |
| 2012-09-07 18:00:00 | 9.1 |
| 2012-09-07 19:00:00 | 8.84 |
| 2012-09-07 20:00:00 | 8.06 |
| 2012-09-07 21:00:00 | 8.06 |
| 2012-09-07 22:00:00 | 10.14 |
| 2012-09-07 23:00:00 | 9.36 |
| 2012-09-08 | 8.84 |
| 2012-09-08 01:00:00 | 7.02 |
| 2012-09-08 02:00:00 | 8.06 |
| 2012-09-08 03:00:00 | 6.5 |
| 2012-09-08 04:00:00 | 4.94 |
| 2012-09-08 05:00:00 | 4.94 |
| 2012-09-08 06:00:00 | 4.94 |
| 2012-09-08 07:00:00 | 4.68 |
| 2012-09-08 08:00:00 | 4.94 |
| 2012-09-08 09:00:00 | 5.46 |
| 2012-09-08 10:00:00 | 8.32 |
| 2012-09-08 11:00:00 | 9.36 |
| 2012-09-08 12:00:00 | 10.14 |
| 2012-09-08 13:00:00 | 9.88 |
| 2012-09-08 14:00:00 | 9.36 |
| 2012-09-08 15:00:00 | 10.66 |
| 2012-09-08 16:00:00 | 9.36 |
| 2012-09-08 17:00:00 | 7.02 |
| 2012-09-08 18:00:00 | 9.36 |
| 2012-09-08 19:00:00 | 8.06 |
| 2012-09-08 20:00:00 | 7.02 |
| 2012-09-08 21:00:00 | 9.62 |
| 2012-09-08 22:00:00 | 9.36 |
| 2012-09-08 23:00:00 | 7.8 |
| 2012-09-09 | 8.58 |
| 2012-09-09 01:00:00 | 8.32 |
| 2012-09-09 02:00:00 | 5.98 |
| 2012-09-09 03:00:00 | 6.24 |
| 2012-09-09 04:00:00 | 6.5 |
| 2012-09-09 05:00:00 | 5.72 |
| 2012-09-09 06:00:00 | 5.46 |
| 2012-09-09 07:00:00 | 4.94 |
| 2012-09-09 08:00:00 | 4.94 |
| 2012-09-09 09:00:00 | 5.46 |
| 2012-09-09 10:00:00 | 7.02 |
| 2012-09-09 11:00:00 | 9.88 |
| 2012-09-09 12:00:00 | 10.14 |
| 2012-09-09 13:00:00 | 10.14 |
| 2012-09-09 14:00:00 | 11.18 |
| 2012-09-09 15:00:00 | 9.88 |
| 2012-09-09 16:00:00 | 10.14 |
| 2012-09-09 17:00:00 | 8.58 |
| 2012-09-09 18:00:00 | 9.36 |
| 2012-09-09 19:00:00 | 8.84 |
| 2012-09-09 20:00:00 | 8.06 |
| 2012-09-09 21:00:00 | 8.58 |
| 2012-09-09 22:00:00 | 10.4 |
| 2012-09-09 23:00:00 | 10.66 |
| 2012-09-10 | 8.32 |
| 2012-09-10 01:00:00 | 8.32 |
| 2012-09-10 02:00:00 | 7.02 |
| 2012-09-10 03:00:00 | 5.2 |
| 2012-09-10 04:00:00 | 4.94 |
| 2012-09-10 05:00:00 | 4.68 |
| 2012-09-10 06:00:00 | 4.68 |
| 2012-09-10 07:00:00 | 4.94 |
| 2012-09-10 08:00:00 | 5.46 |
| 2012-09-10 09:00:00 | 8.58 |
| 2012-09-10 10:00:00 | 13.78 |
| 2012-09-10 11:00:00 | 18.72 |
| 2012-09-10 12:00:00 | 10.14 |
| 2012-09-10 13:00:00 | 8.06 |
| 2012-09-10 14:00:00 | 7.8 |
| 2012-09-10 15:00:00 | 9.1 |
| 2012-09-10 16:00:00 | 6.76 |
| 2012-09-10 17:00:00 | 8.32 |
| 2012-09-10 18:00:00 | 7.8 |
| 2012-09-10 19:00:00 | 6.5 |
| 2012-09-10 20:00:00 | 9.62 |
| 2012-09-10 21:00:00 | 9.88 |
| 2012-09-10 22:00:00 | 10.66 |
| 2012-09-10 23:00:00 | 10.14 |
| 2012-09-11 | 8.32 |
| 2012-09-11 01:00:00 | 7.54 |
| 2012-09-11 02:00:00 | 6.76 |
| 2012-09-11 03:00:00 | 5.2 |
| 2012-09-11 04:00:00 | 4.68 |
| 2012-09-11 05:00:00 | 4.68 |
| 2012-09-11 06:00:00 | 4.42 |
| 2012-09-11 07:00:00 | 4.94 |
| 2012-09-11 08:00:00 | 5.98 |
| 2012-09-11 09:00:00 | 8.06 |
| 2012-09-11 10:00:00 | 6.76 |
| 2012-09-11 11:00:00 | 8.84 |
| 2012-09-11 12:00:00 | 8.06 |
| 2012-09-11 13:00:00 | 8.32 |
| 2012-09-11 14:00:00 | 8.84 |
| 2012-09-11 15:00:00 | 9.62 |
| 2012-09-11 16:00:00 | 8.84 |
| 2012-09-11 17:00:00 | 7.28 |
| 2012-09-11 18:00:00 | 7.54 |
| 2012-09-11 19:00:00 | 8.84 |
| 2012-09-11 20:00:00 | 6.5 |
| 2012-09-11 21:00:00 | 9.62 |
| 2012-09-11 22:00:00 | 9.88 |
| 2012-09-11 23:00:00 | 10.4 |
| 2012-09-12 | 8.32 |
| 2012-09-12 01:00:00 | 7.28 |
| 2012-09-12 02:00:00 | 7.02 |
| 2012-09-12 03:00:00 | 4.94 |
| 2012-09-12 04:00:00 | 4.68 |
| 2012-09-12 05:00:00 | 4.68 |
| 2012-09-12 06:00:00 | 4.68 |
| 2012-09-12 07:00:00 | 4.68 |
| 2012-09-12 08:00:00 | 4.94 |
| 2012-09-12 09:00:00 | 8.06 |
| 2012-09-12 10:00:00 | 8.58 |
| 2012-09-12 11:00:00 | 13 |
| 2012-09-12 12:00:00 | 10.66 |
| 2012-09-12 13:00:00 | 8.84 |
| 2012-09-12 14:00:00 | 6.5 |
| 2012-09-12 15:00:00 | 7.28 |
| 2012-09-12 16:00:00 | 7.54 |
| 2012-09-12 17:00:00 | 5.72 |
| 2012-09-12 18:00:00 | 8.06 |
| 2012-09-12 19:00:00 | 27.3 |
| 2012-09-12 20:00:00 | 41.34 |
| 2012-09-12 21:00:00 | 41.34 |
| 2012-09-12 22:00:00 | 41.08 |
| 2012-09-12 23:00:00 | 40.82 |
| 2012-09-13 | 41.08 |
| 2012-09-13 01:00:00 | 41.08 |
| 2012-09-13 02:00:00 | 40.82 |
| 2012-09-13 03:00:00 | 41.08 |
| 2012-09-13 04:00:00 | 41.08 |
| 2012-09-13 05:00:00 | 41.08 |
| 2012-09-13 06:00:00 | 40.82 |
| 2012-09-13 07:00:00 | 41.08 |
| 2012-09-13 08:00:00 | 40.82 |
| 2012-09-13 09:00:00 | 41.08 |
| 2012-09-13 10:00:00 | 40.82 |
| 2012-09-13 11:00:00 | 41.08 |
| 2012-09-13 12:00:00 | 40.82 |
| 2012-09-13 13:00:00 | 40.82 |
| 2012-09-13 14:00:00 | 40.82 |
| 2012-09-13 15:00:00 | 41.08 |
| 2012-09-13 16:00:00 | 40.82 |
| 2012-09-13 17:00:00 | 40.82 |
| 2012-09-13 18:00:00 | 40.82 |
| 2012-09-13 19:00:00 | 40.82 |
| 2012-09-13 20:00:00 | 40.56 |
| 2012-09-13 21:00:00 | 40.82 |
| 2012-09-13 22:00:00 | 40.82 |
| 2012-09-13 23:00:00 | 40.56 |
| 2012-09-14 | 40.82 |
| 2012-09-14 01:00:00 | 40.56 |
| 2012-09-14 02:00:00 | 40.56 |
| 2012-09-14 03:00:00 | 40.56 |
| 2012-09-14 04:00:00 | 40.3 |
| 2012-09-14 05:00:00 | 40.04 |
| 2012-09-14 06:00:00 | 40.56 |
| 2012-09-14 07:00:00 | 40.3 |
| 2012-09-14 08:00:00 | 40.3 |
| 2012-09-14 09:00:00 | 26 |
| 2012-09-14 10:00:00 | 11.96 |
| 2012-09-14 11:00:00 | 39 |
| 2012-09-14 12:00:00 | 32.76 |
| 2012-09-14 13:00:00 | 18.46 |
| 2012-09-14 14:00:00 | 12.48 |
| 2012-09-14 15:00:00 | 30.68 |
| 2012-09-14 16:00:00 | 13.52 |
| 2012-09-14 17:00:00 | 13.26 |
| 2012-09-14 18:00:00 | 12.48 |
| 2012-09-14 19:00:00 | 11.96 |
| 2012-09-14 20:00:00 | 13.52 |
| 2012-09-14 21:00:00 | 12.74 |
| 2012-09-14 22:00:00 | 12.74 |
| 2012-09-14 23:00:00 | 12.74 |
| 2012-09-15 | 11.18 |
| 2012-09-15 01:00:00 | 11.18 |
| 2012-09-15 02:00:00 | 10.92 |
| 2012-09-15 03:00:00 | 8.32 |
| 2012-09-15 04:00:00 | 9.1 |
| 2012-09-15 05:00:00 | 7.28 |
| 2012-09-15 06:00:00 | 8.84 |
| 2012-09-15 07:00:00 | 7.02 |
| 2012-09-15 08:00:00 | 9.36 |
| 2012-09-15 09:00:00 | 8.58 |
| 2012-09-15 10:00:00 | 10.66 |
| 2012-09-15 11:00:00 | 13.26 |
| 2012-09-15 12:00:00 | 11.44 |
| 2012-09-15 13:00:00 | 12.22 |
| 2012-09-15 14:00:00 | 12.22 |
| 2012-09-15 15:00:00 | 10.92 |
| 2012-09-15 16:00:00 | 13.26 |
| 2012-09-15 17:00:00 | 11.44 |
| 2012-09-15 18:00:00 | 13 |
| 2012-09-15 19:00:00 | 10.92 |
| 2012-09-15 20:00:00 | 11.18 |
| 2012-09-15 21:00:00 | 11.18 |
| 2012-09-15 22:00:00 | 11.18 |
| 2012-09-15 23:00:00 | 11.18 |
| 2012-09-16 | 10.66 |
| 2012-09-16 01:00:00 | 9.88 |
| 2012-09-16 02:00:00 | 8.06 |
| 2012-09-16 03:00:00 | 9.1 |
| 2012-09-16 04:00:00 | 5.98 |
| 2012-09-16 05:00:00 | 8.32 |
| 2012-09-16 06:00:00 | 5.46 |
| 2012-09-16 07:00:00 | 7.28 |
| 2012-09-16 08:00:00 | 6.24 |
| 2012-09-16 09:00:00 | 7.28 |
| 2012-09-16 10:00:00 | 9.1 |
| 2012-09-16 11:00:00 | 9.1 |
| 2012-09-16 12:00:00 | 12.74 |
| 2012-09-16 13:00:00 | 10.66 |
| 2012-09-16 14:00:00 | 13 |
| 2012-09-16 15:00:00 | 11.44 |
| 2012-09-16 16:00:00 | 10.92 |
| 2012-09-16 17:00:00 | 10.92 |
| 2012-09-16 18:00:00 | 9.1 |
| 2012-09-16 19:00:00 | 9.62 |
| 2012-09-16 20:00:00 | 11.18 |
| 2012-09-16 21:00:00 | 11.18 |
| 2012-09-16 22:00:00 | 12.22 |
| 2012-09-16 23:00:00 | 11.44 |
| 2012-09-17 | 10.4 |
| 2012-09-17 01:00:00 | 7.8 |
| 2012-09-17 02:00:00 | 9.1 |
| 2012-09-17 03:00:00 | 6.76 |
| 2012-09-17 04:00:00 | 5.98 |
| 2012-09-17 05:00:00 | 7.28 |
| 2012-09-17 06:00:00 | 5.72 |
| 2012-09-17 07:00:00 | 5.98 |
| 2012-09-17 08:00:00 | 9.1 |
| 2012-09-17 09:00:00 | 8.32 |
| 2012-09-17 10:00:00 | 9.62 |
| 2012-09-17 11:00:00 | 10.92 |
| 2012-09-17 12:00:00 | 10.14 |
| 2012-09-17 13:00:00 | 10.14 |
| 2012-09-17 14:00:00 | 8.84 |
| 2012-09-17 15:00:00 | 9.88 |
| 2012-09-17 16:00:00 | 9.88 |
| 2012-09-17 17:00:00 | 9.62 |
| 2012-09-17 18:00:00 | 8.84 |
| 2012-09-17 19:00:00 | 7.8 |
| 2012-09-17 20:00:00 | 10.14 |
| 2012-09-17 21:00:00 | 10.4 |
| 2012-09-17 22:00:00 | 10.14 |
| 2012-09-17 23:00:00 | 11.7 |
| 2012-09-18 | 9.1 |
| 2012-09-18 01:00:00 | 8.84 |
| 2012-09-18 02:00:00 | 8.32 |
| 2012-09-18 03:00:00 | 6.5 |
| 2012-09-18 04:00:00 | 5.72 |
| 2012-09-18 05:00:00 | 5.72 |
| 2012-09-18 06:00:00 | 7.02 |
| 2012-09-18 07:00:00 | 6.76 |
| 2012-09-18 08:00:00 | 6.76 |
| 2012-09-18 09:00:00 | 8.58 |
| 2012-09-18 10:00:00 | 10.66 |
| 2012-09-18 11:00:00 | 9.36 |
| 2012-09-18 12:00:00 | 10.14 |
| 2012-09-18 13:00:00 | 10.66 |
| 2012-09-18 14:00:00 | 13.52 |
| 2012-09-18 15:00:00 | 10.4 |
| 2012-09-18 16:00:00 | 11.44 |
| 2012-09-18 17:00:00 | 10.4 |
| 2012-09-18 18:00:00 | 10.4 |
| 2012-09-18 19:00:00 | 10.4 |
| 2012-09-18 20:00:00 | 10.14 |
| 2012-09-18 21:00:00 | 11.44 |
| 2012-09-18 22:00:00 | 12.22 |
| 2012-09-18 23:00:00 | 10.14 |
| 2012-09-19 | 10.92 |
| 2012-09-19 01:00:00 | 8.58 |
| 2012-09-19 02:00:00 | 7.8 |
| 2012-09-19 03:00:00 | 8.32 |
| 2012-09-19 04:00:00 | 6.76 |
| 2012-09-19 05:00:00 | 5.72 |
| 2012-09-19 06:00:00 | 5.72 |
| 2012-09-19 07:00:00 | 5.98 |
| 2012-09-19 08:00:00 | 7.28 |
| 2012-09-19 09:00:00 | 9.62 |
| 2012-09-19 10:00:00 | 9.62 |
| 2012-09-19 11:00:00 | 9.62 |
| 2012-09-19 12:00:00 | 9.36 |
| 2012-09-19 13:00:00 | 28.6 |
| 2012-09-19 14:00:00 | 39.52 |
| 2012-09-19 15:00:00 | 39.52 |
| 2012-09-19 16:00:00 | 39.78 |
| 2012-09-19 17:00:00 | 39.52 |
| 2012-09-19 18:00:00 | 39.78 |
| 2012-09-19 19:00:00 | 39.52 |
| 2012-09-19 20:00:00 | 39.52 |
| 2012-09-19 21:00:00 | 39.52 |
| 2012-09-19 22:00:00 | 39.26 |
| 2012-09-19 23:00:00 | 39.26 |
| 2012-09-20 | 39.52 |
| 2012-09-20 01:00:00 | 39.26 |
| 2012-09-20 02:00:00 | 14.04 |
| 2012-09-20 03:00:00 | 18.2 |
| 2012-09-20 04:00:00 | 8.06 |
| 2012-09-20 05:00:00 | 8.58 |
| 2012-09-20 06:00:00 | 15.6 |
| 2012-09-20 07:00:00 | 1.04 |
| 2012-09-20 08:00:00 | 18.2 |
| 2012-09-20 09:00:00 | 9.62 |
| 2012-09-20 10:00:00 | 11.7 |
| 2012-09-20 11:00:00 | 9.62 |
| 2012-09-20 12:00:00 | 10.66 |
| 2012-09-20 13:00:00 | 9.1 |
| 2012-09-20 14:00:00 | 8.84 |
| 2012-09-20 15:00:00 | 10.14 |
| 2012-09-20 16:00:00 | 7.54 |
| 2012-09-20 17:00:00 | 10.4 |
| 2012-09-20 18:00:00 | 8.84 |
| 2012-09-20 19:00:00 | 9.88 |
| 2012-09-20 20:00:00 | 10.92 |
| 2012-09-20 21:00:00 | 11.18 |
| 2012-09-20 22:00:00 | 11.96 |
| 2012-09-20 23:00:00 | 11.18 |
| 2012-09-21 | 8.84 |
| 2012-09-21 01:00:00 | 9.88 |
| 2012-09-21 02:00:00 | 7.54 |
| 2012-09-21 03:00:00 | 7.28 |
| 2012-09-21 04:00:00 | 6.76 |
| 2012-09-21 05:00:00 | 5.2 |
| 2012-09-21 06:00:00 | 7.28 |
| 2012-09-21 07:00:00 | 6.24 |
| 2012-09-21 08:00:00 | 7.54 |
| 2012-09-21 09:00:00 | 9.36 |
| 2012-09-21 10:00:00 | 8.84 |
| 2012-09-21 11:00:00 | 10.4 |
| 2012-09-21 12:00:00 | 10.4 |
| 2012-09-21 13:00:00 | 9.88 |
| 2012-09-21 14:00:00 | 10.66 |
| 2012-09-21 15:00:00 | 12.48 |
| 2012-09-21 16:00:00 | 11.96 |
| 2012-09-21 17:00:00 | 10.14 |
| 2012-09-21 18:00:00 | 9.88 |
| 2012-09-21 19:00:00 | 9.1 |
| 2012-09-21 20:00:00 | 9.1 |
| 2012-09-21 21:00:00 | 11.18 |
| 2012-09-21 22:00:00 | 10.66 |
| 2012-09-21 23:00:00 | 10.66 |
| 2012-09-22 | 10.14 |
| 2012-09-22 01:00:00 | 9.1 |
| 2012-09-22 02:00:00 | 7.8 |
| 2012-09-22 03:00:00 | 8.58 |
| 2012-09-22 04:00:00 | 5.72 |
| 2012-09-22 05:00:00 | 7.02 |
| 2012-09-22 06:00:00 | 6.5 |
| 2012-09-22 07:00:00 | 5.46 |
| 2012-09-22 08:00:00 | 5.98 |
| 2012-09-22 09:00:00 | 8.58 |
| 2012-09-22 10:00:00 | 8.58 |
| 2012-09-22 11:00:00 | 11.44 |
| 2012-09-22 12:00:00 | 11.18 |
| 2012-09-22 13:00:00 | 10.4 |
| 2012-09-22 14:00:00 | 11.44 |
| 2012-09-22 15:00:00 | 10.66 |
| 2012-09-22 16:00:00 | 11.18 |
| 2012-09-22 17:00:00 | 10.14 |
| 2012-09-22 18:00:00 | 10.4 |
| 2012-09-22 19:00:00 | 31.46 |
| 2012-09-22 20:00:00 | 38.48 |
| 2012-09-22 21:00:00 | 38.74 |
| 2012-09-22 22:00:00 | 38.48 |
| 2012-09-22 23:00:00 | 38.48 |
| 2012-09-23 | 38.48 |
| 2012-09-23 01:00:00 | 11.44 |
| 2012-09-23 02:00:00 | 18.46 |
| 2012-09-23 03:00:00 | 7.54 |
| 2012-09-23 04:00:00 | 9.62 |
| 2012-09-23 05:00:00 | 13 |
| 2012-09-23 06:00:00 | 3.12 |
| 2012-09-23 07:00:00 | 15.86 |
| 2012-09-23 08:00:00 | 0.26 |
| 2012-09-23 09:00:00 | 13.26 |
| 2012-09-23 10:00:00 | 9.1 |
| 2012-09-23 11:00:00 | 10.66 |
| 2012-09-23 12:00:00 | 11.18 |
| 2012-09-23 13:00:00 | 11.96 |
| 2012-09-23 14:00:00 | 11.44 |
| 2012-09-23 15:00:00 | 11.44 |
| 2012-09-23 16:00:00 | 10.66 |
| 2012-09-23 17:00:00 | 9.1 |
| 2012-09-23 18:00:00 | 10.4 |
| 2012-09-23 19:00:00 | 10.4 |
| 2012-09-23 20:00:00 | 10.14 |
| 2012-09-23 21:00:00 | 11.18 |
| 2012-09-23 22:00:00 | 11.96 |
| 2012-09-23 23:00:00 | 10.92 |
| 2012-09-24 | 9.1 |
| 2012-09-24 01:00:00 | 9.1 |
| 2012-09-24 02:00:00 | 8.32 |
| 2012-09-24 03:00:00 | 6.24 |
| 2012-09-24 04:00:00 | 7.28 |
| 2012-09-24 05:00:00 | 6.24 |
| 2012-09-24 06:00:00 | 5.2 |
| 2012-09-24 07:00:00 | 5.98 |
| 2012-09-24 08:00:00 | 8.58 |
| 2012-09-24 09:00:00 | 7.02 |
| 2012-09-24 10:00:00 | 10.4 |
| 2012-09-24 11:00:00 | 11.44 |
| 2012-09-24 12:00:00 | 11.96 |
| 2012-09-24 13:00:00 | 9.36 |
| 2012-09-24 14:00:00 | 10.14 |
| 2012-09-24 15:00:00 | 8.84 |
| 2012-09-24 16:00:00 | 8.32 |
| 2012-09-24 17:00:00 | 9.36 |
| 2012-09-24 18:00:00 | 7.8 |
| 2012-09-24 19:00:00 | 9.1 |
| 2012-09-24 20:00:00 | 10.14 |
| 2012-09-24 21:00:00 | 10.92 |
| 2012-09-24 22:00:00 | 11.18 |
| 2012-09-24 23:00:00 | 11.44 |
| 2012-09-25 | 10.4 |
| 2012-09-25 01:00:00 | 7.8 |
| 2012-09-25 02:00:00 | 8.32 |
| 2012-09-25 03:00:00 | 7.28 |
| 2012-09-25 04:00:00 | 5.72 |
| 2012-09-25 05:00:00 | 5.2 |
| 2012-09-25 06:00:00 | 8.32 |
| 2012-09-25 07:00:00 | 33.02 |
| 2012-09-25 08:00:00 | 38.22 |
| 2012-09-25 09:00:00 | 38.74 |
| 2012-09-25 10:00:00 | 38.48 |
| 2012-09-25 11:00:00 | 38.48 |
| 2012-09-25 12:00:00 | 37.96 |
| 2012-09-25 13:00:00 | 37.96 |
| 2012-09-25 14:00:00 | 38.22 |
| 2012-09-25 15:00:00 | 31.2 |
| 2012-09-25 16:00:00 | 11.96 |
| 2012-09-25 17:00:00 | 8.06 |
| 2012-09-25 18:00:00 | 19.24 |
| 2012-09-25 19:00:00 | 11.18 |
| 2012-09-25 20:00:00 | 8.84 |
| 2012-09-25 21:00:00 | 23.92 |
| 2012-09-25 22:00:00 | 8.32 |
| 2012-09-25 23:00:00 | 13 |
| 2012-09-26 | 9.36 |
| 2012-09-26 01:00:00 | 9.62 |
| 2012-09-26 02:00:00 | 8.06 |
| 2012-09-26 03:00:00 | 5.98 |
| 2012-09-26 04:00:00 | 7.8 |
| 2012-09-26 05:00:00 | 5.72 |
| 2012-09-26 06:00:00 | 5.46 |
| 2012-09-26 07:00:00 | 7.02 |
| 2012-09-26 08:00:00 | 7.54 |
| 2012-09-26 09:00:00 | 7.8 |
| 2012-09-26 10:00:00 | 10.4 |
| 2012-09-26 11:00:00 | 11.96 |
| 2012-09-26 12:00:00 | 8.32 |
| 2012-09-26 13:00:00 | 10.4 |
| 2012-09-26 14:00:00 | 10.4 |
| 2012-09-26 15:00:00 | 9.88 |
| 2012-09-26 16:00:00 | 9.1 |
| 2012-09-26 17:00:00 | 8.06 |
| 2012-09-26 18:00:00 | 10.14 |
| 2012-09-26 19:00:00 | 8.58 |
| 2012-09-26 20:00:00 | 9.62 |
| 2012-09-26 21:00:00 | 9.88 |
| 2012-09-26 22:00:00 | 11.44 |
| 2012-09-26 23:00:00 | 11.44 |
| 2012-09-27 | 9.36 |
| 2012-09-27 01:00:00 | 8.84 |
| 2012-09-27 02:00:00 | 7.8 |
| 2012-09-27 03:00:00 | 5.72 |
| 2012-09-27 04:00:00 | 5.98 |
| 2012-09-27 05:00:00 | 6.5 |
| 2012-09-27 06:00:00 | 5.98 |
| 2012-09-27 07:00:00 | 5.46 |
| 2012-09-27 08:00:00 | 7.8 |
| 2012-09-27 09:00:00 | 8.84 |
| 2012-09-27 10:00:00 | 8.32 |
| 2012-09-27 11:00:00 | 9.36 |
| 2012-09-27 12:00:00 | 10.14 |
| 2012-09-27 13:00:00 | 10.4 |
| 2012-09-27 14:00:00 | 9.88 |
| 2012-09-27 15:00:00 | 8.06 |
| 2012-09-27 16:00:00 | 8.06 |
| 2012-09-27 17:00:00 | 9.1 |
| 2012-09-27 18:00:00 | 8.06 |
| 2012-09-27 19:00:00 | 7.54 |
| 2012-09-27 20:00:00 | 9.62 |
| 2012-09-27 21:00:00 | 9.62 |
| 2012-09-27 22:00:00 | 9.62 |
| 2012-09-27 23:00:00 | 8.58 |
| 2012-09-28 | 8.58 |
| 2012-09-28 01:00:00 | 8.84 |
| 2012-09-28 02:00:00 | 8.06 |
| 2012-09-28 03:00:00 | 6.76 |
| 2012-09-28 04:00:00 | 12.22 |
| 2012-09-28 05:00:00 | 17.94 |
| 2012-09-28 06:00:00 | 7.8 |
| 2012-09-28 07:00:00 | 5.98 |
| 2012-09-28 08:00:00 | 7.54 |
| 2012-09-28 09:00:00 | 7.02 |
| 2012-09-28 10:00:00 | 8.06 |
| 2012-09-28 11:00:00 | 11.7 |
| 2012-09-28 12:00:00 | 10.4 |
| 2012-09-28 13:00:00 | 10.4 |
| 2012-09-28 14:00:00 | 10.66 |
| 2012-09-28 15:00:00 | 10.4 |
| 2012-09-28 16:00:00 | 9.36 |
| 2012-09-28 17:00:00 | 8.58 |
| 2012-09-28 18:00:00 | 8.58 |
| 2012-09-28 19:00:00 | 9.62 |
| 2012-09-28 20:00:00 | 8.84 |
| 2012-09-28 21:00:00 | 9.1 |
| 2012-09-28 22:00:00 | 9.36 |
| 2012-09-28 23:00:00 | 9.36 |
| 2012-09-29 | 8.58 |
| 2012-09-29 01:00:00 | 7.28 |
| 2012-09-29 02:00:00 | 8.32 |
| 2012-09-29 03:00:00 | 7.54 |
| 2012-09-29 04:00:00 | 5.72 |
| 2012-09-29 05:00:00 | 5.72 |
| 2012-09-29 06:00:00 | 5.46 |
| 2012-09-29 07:00:00 | 5.2 |
| 2012-09-29 08:00:00 | 5.72 |
| 2012-09-29 09:00:00 | 7.54 |
| 2012-09-29 10:00:00 | 8.58 |
| 2012-09-29 11:00:00 | 10.14 |
| 2012-09-29 12:00:00 | 9.88 |
| 2012-09-29 13:00:00 | 12.22 |
| 2012-09-29 14:00:00 | 10.4 |
| 2012-09-29 15:00:00 | 10.92 |
| 2012-09-29 16:00:00 | 10.66 |
| 2012-09-29 17:00:00 | 9.62 |
| 2012-09-29 18:00:00 | 9.1 |
| 2012-09-29 19:00:00 | 8.32 |
| 2012-09-29 20:00:00 | 9.62 |
| 2012-09-29 21:00:00 | 11.44 |
| 2012-09-29 22:00:00 | 10.92 |
| 2012-09-29 23:00:00 | 19.5 |
| 2012-09-30 | 39 |
| 2012-09-30 01:00:00 | 39.52 |
| 2012-09-30 02:00:00 | 39.78 |
| 2012-09-30 03:00:00 | 39.52 |
| 2012-09-30 04:00:00 | 39.78 |
| 2012-09-30 05:00:00 | 39.52 |
| 2012-09-30 06:00:00 | 39.52 |
| 2012-09-30 07:00:00 | 39 |
| 2012-09-30 08:00:00 | 39.52 |
| 2012-09-30 09:00:00 | 39.52 |
| 2012-09-30 10:00:00 | 12.22 |
| 2012-09-30 11:00:00 | 13 |
| 2012-09-30 12:00:00 | 24.7 |
| 2012-09-30 13:00:00 | 12.22 |
| 2012-09-30 14:00:00 | 18.2 |
| 2012-09-30 15:00:00 | 19.24 |
| 2012-09-30 16:00:00 | 7.8 |
| 2012-09-30 17:00:00 | 15.08 |
| 2012-09-30 18:00:00 | 10.14 |
| 2012-09-30 19:00:00 | 10.66 |
| 2012-09-30 20:00:00 | 9.88 |
| 2012-09-30 21:00:00 | 12.22 |
| 2012-09-30 22:00:00 | 12.48 |
| 2012-09-30 23:00:00 | 11.18 |
| 2012-10-01 | 8.84 |
| 2012-10-01 01:00:00 | 9.88 |
| 2012-10-01 02:00:00 | 7.28 |
| 2012-10-01 03:00:00 | 7.54 |
| 2012-10-01 04:00:00 | 6.5 |
| 2012-10-01 05:00:00 | 5.2 |
| 2012-10-01 06:00:00 | 7.54 |
| 2012-10-01 07:00:00 | 5.98 |
| 2012-10-01 08:00:00 | 7.8 |
| 2012-10-01 09:00:00 | 9.36 |
| 2012-10-01 10:00:00 | 8.58 |
| 2012-10-01 11:00:00 | 10.92 |
| 2012-10-01 12:00:00 | 9.62 |
| 2012-10-01 13:00:00 | 10.66 |
| 2012-10-01 14:00:00 | 10.14 |
| 2012-10-01 15:00:00 | 8.84 |
| 2012-10-01 16:00:00 | 9.62 |
| 2012-10-01 17:00:00 | 8.84 |
| 2012-10-01 18:00:00 | 8.84 |
| 2012-10-01 19:00:00 | 9.62 |
| 2012-10-01 20:00:00 | 10.92 |
| 2012-10-01 21:00:00 | 11.18 |
| 2012-10-01 22:00:00 | 12.74 |
| 2012-10-01 23:00:00 | 10.92 |
| 2012-10-02 | 8.58 |
| 2012-10-02 01:00:00 | 9.62 |
| 2012-10-02 02:00:00 | 7.02 |
| 2012-10-02 03:00:00 | 7.28 |
| 2012-10-02 04:00:00 | 6.76 |
| 2012-10-02 05:00:00 | 5.2 |
| 2012-10-02 06:00:00 | 5.2 |
| 2012-10-02 07:00:00 | 7.28 |
| 2012-10-02 08:00:00 | 7.02 |
| 2012-10-02 09:00:00 | 8.84 |
| 2012-10-02 10:00:00 | 9.88 |
| 2012-10-02 11:00:00 | 8.84 |
| 2012-10-02 12:00:00 | 9.1 |
| 2012-10-02 13:00:00 | 9.88 |
| 2012-10-02 14:00:00 | 8.06 |
| 2012-10-02 15:00:00 | 10.4 |
| 2012-10-02 16:00:00 | 9.88 |
| 2012-10-02 17:00:00 | 8.58 |
| 2012-10-02 18:00:00 | 8.32 |
| 2012-10-02 19:00:00 | 9.62 |
| 2012-10-02 20:00:00 | 9.1 |
| 2012-10-02 21:00:00 | 10.4 |
| 2012-10-02 22:00:00 | 11.96 |
| 2012-10-02 23:00:00 | 10.66 |
| 2012-10-03 | 9.36 |
| 2012-10-03 01:00:00 | 8.58 |
| 2012-10-03 02:00:00 | 8.58 |
| 2012-10-03 03:00:00 | 5.98 |
| 2012-10-03 04:00:00 | 5.46 |
| 2012-10-03 05:00:00 | 5.46 |
| 2012-10-03 06:00:00 | 7.02 |
| 2012-10-03 07:00:00 | 6.24 |
| 2012-10-03 08:00:00 | 5.98 |
| 2012-10-03 09:00:00 | 9.36 |
| 2012-10-03 10:00:00 | 10.14 |
| 2012-10-03 11:00:00 | 10.4 |
| 2012-10-03 12:00:00 | 9.62 |
| 2012-10-03 13:00:00 | 8.32 |
| 2012-10-03 14:00:00 | 9.1 |
| 2012-10-03 15:00:00 | 10.4 |
| 2012-10-03 16:00:00 | 9.36 |
| 2012-10-03 17:00:00 | 8.84 |
| 2012-10-03 18:00:00 | 8.84 |
| 2012-10-03 19:00:00 | 9.88 |
| 2012-10-03 20:00:00 | 9.88 |
| 2012-10-03 21:00:00 | 10.4 |
| 2012-10-03 22:00:00 | 10.4 |
| 2012-10-03 23:00:00 | 10.14 |
| 2012-10-04 | 9.88 |
| 2012-10-04 01:00:00 | 9.36 |
| 2012-10-04 02:00:00 | 8.32 |
| 2012-10-04 03:00:00 | 5.98 |
| 2012-10-04 04:00:00 | 5.46 |
| 2012-10-04 05:00:00 | 5.46 |
| 2012-10-04 06:00:00 | 5.72 |
| 2012-10-04 07:00:00 | 7.02 |
| 2012-10-04 08:00:00 | 7.8 |
| 2012-10-04 09:00:00 | 8.06 |
| 2012-10-04 10:00:00 | 10.92 |
| 2012-10-04 11:00:00 | 10.92 |
| 2012-10-04 12:00:00 | 11.7 |
| 2012-10-04 13:00:00 | 9.62 |
| 2012-10-04 14:00:00 | 8.84 |
| 2012-10-04 15:00:00 | 9.36 |
| 2012-10-04 16:00:00 | 7.8 |
| 2012-10-04 17:00:00 | 9.62 |
| 2012-10-04 18:00:00 | 9.36 |
| 2012-10-04 19:00:00 | 9.62 |
| 2012-10-04 20:00:00 | 9.62 |
| 2012-10-04 21:00:00 | 9.88 |
| 2012-10-04 22:00:00 | 21.84 |
| 2012-10-04 23:00:00 | 40.04 |
| 2012-10-05 | 40.04 |
| 2012-10-05 01:00:00 | 40.04 |
| 2012-10-05 02:00:00 | 40.04 |
| 2012-10-05 03:00:00 | 40.04 |
| 2012-10-05 04:00:00 | 39.78 |
| 2012-10-05 05:00:00 | 39.26 |
| 2012-10-05 06:00:00 | 39 |
| 2012-10-05 07:00:00 | 39 |
| 2012-10-05 08:00:00 | 29.64 |
| 2012-10-05 09:00:00 | 18.2 |
| 2012-10-05 10:00:00 | 10.4 |
| 2012-10-05 11:00:00 | 23.92 |
| 2012-10-05 12:00:00 | 14.56 |
| 2012-10-05 13:00:00 | 13.78 |
| 2012-10-05 14:00:00 | 22.1 |
| 2012-10-05 15:00:00 | 8.06 |
| 2012-10-05 16:00:00 | 14.04 |
| 2012-10-05 17:00:00 | 10.66 |
| 2012-10-05 18:00:00 | 10.66 |
| 2012-10-05 19:00:00 | 10.66 |
| 2012-10-05 20:00:00 | 10.92 |
| 2012-10-05 21:00:00 | 10.92 |
| 2012-10-05 22:00:00 | 11.18 |
| 2012-10-05 23:00:00 | 10.66 |
| 2012-10-06 | 10.66 |
| 2012-10-06 01:00:00 | 9.36 |
| 2012-10-06 02:00:00 | 8.58 |
| 2012-10-06 03:00:00 | 8.32 |
| 2012-10-06 04:00:00 | 6.5 |
| 2012-10-06 05:00:00 | 7.8 |
| 2012-10-06 06:00:00 | 5.46 |
| 2012-10-06 07:00:00 | 8.06 |
| 2012-10-06 08:00:00 | 5.72 |
| 2012-10-06 09:00:00 | 9.1 |
| 2012-10-06 10:00:00 | 10.14 |
| 2012-10-06 11:00:00 | 12.22 |
| 2012-10-06 12:00:00 | 11.7 |
| 2012-10-06 13:00:00 | 11.96 |
| 2012-10-06 14:00:00 | 10.92 |
| 2012-10-06 15:00:00 | 11.18 |
| 2012-10-06 16:00:00 | 10.66 |
| 2012-10-06 17:00:00 | 10.14 |
| 2012-10-06 18:00:00 | 9.1 |
| 2012-10-06 19:00:00 | 10.66 |
| 2012-10-06 20:00:00 | 10.92 |
| 2012-10-06 21:00:00 | 10.66 |
| 2012-10-06 22:00:00 | 10.92 |
| 2012-10-06 23:00:00 | 10.66 |
| 2012-10-07 | 9.1 |
| 2012-10-07 01:00:00 | 8.84 |
| 2012-10-07 02:00:00 | 8.58 |
| 2012-10-07 03:00:00 | 5.98 |
| 2012-10-07 04:00:00 | 8.06 |
| 2012-10-07 05:00:00 | 8.58 |
| 2012-10-07 06:00:00 | 11.44 |
| 2012-10-07 07:00:00 | 13.26 |
| 2012-10-07 08:00:00 | 13.52 |
| 2012-10-07 09:00:00 | 22.62 |
| 2012-10-07 10:00:00 | 28.86 |
| 2012-10-07 11:00:00 | 39 |
| 2012-10-07 12:00:00 | 39.26 |
| 2012-10-07 13:00:00 | 39.26 |
| 2012-10-07 14:00:00 | 39.52 |
| 2012-10-07 15:00:00 | 39.52 |
| 2012-10-07 16:00:00 | 39.52 |
| 2012-10-07 17:00:00 | 39.26 |
| 2012-10-07 18:00:00 | 39.52 |
| 2012-10-07 19:00:00 | 39.26 |
| 2012-10-07 20:00:00 | 39.26 |
| 2012-10-07 21:00:00 | 39 |
| 2012-10-07 22:00:00 | 39.26 |
| 2012-10-07 23:00:00 | 39.26 |
| 2012-10-08 | 39.26 |
| 2012-10-08 01:00:00 | 39.26 |
| 2012-10-08 02:00:00 | 39 |
| 2012-10-08 03:00:00 | 39 |
| 2012-10-08 04:00:00 | 39 |
| 2012-10-08 05:00:00 | 39 |
| 2012-10-08 06:00:00 | 39 |
| 2012-10-08 07:00:00 | 38.48 |
| 2012-10-08 08:00:00 | 38.48 |
| 2012-10-08 09:00:00 | 38.22 |
| 2012-10-08 10:00:00 | 38.74 |
| 2012-10-08 11:00:00 | 38.74 |
| 2012-10-08 12:00:00 | 38.48 |
| 2012-10-08 13:00:00 | 38.74 |
| 2012-10-08 14:00:00 | 38.74 |
| 2012-10-08 15:00:00 | 19.5 |
| 2012-10-08 16:00:00 | 26.26 |
| 2012-10-08 17:00:00 | 15.34 |
| 2012-10-08 18:00:00 | 22.1 |
| 2012-10-08 19:00:00 | 25.22 |
| 2012-10-08 20:00:00 | 11.7 |
| 2012-10-08 21:00:00 | 17.42 |
| 2012-10-08 22:00:00 | 15.6 |
| 2012-10-08 23:00:00 | 14.3 |
| 2012-10-09 | 13.26 |
| 2012-10-09 01:00:00 | 13 |
| 2012-10-09 02:00:00 | 11.96 |
| 2012-10-09 03:00:00 | 10.4 |
| 2012-10-09 04:00:00 | 10.14 |
| 2012-10-09 05:00:00 | 8.84 |
| 2012-10-09 06:00:00 | 9.88 |
| 2012-10-09 07:00:00 | 10.4 |
| 2012-10-09 08:00:00 | 10.92 |
| 2012-10-09 09:00:00 | 12.74 |
| 2012-10-09 10:00:00 | 13 |
| 2012-10-09 11:00:00 | 12.22 |
| 2012-10-09 12:00:00 | 12.48 |
| 2012-10-09 13:00:00 | 11.44 |
| 2012-10-09 14:00:00 | 12.74 |
| 2012-10-09 15:00:00 | 11.7 |
| 2012-10-09 16:00:00 | 11.7 |
| 2012-10-09 17:00:00 | 11.44 |
| 2012-10-09 18:00:00 | 11.96 |
| 2012-10-09 19:00:00 | 10.92 |
| 2012-10-09 20:00:00 | 13 |
| 2012-10-09 21:00:00 | 13 |
| 2012-10-09 22:00:00 | 12.74 |
| 2012-10-09 23:00:00 | 12.74 |
| 2012-10-10 | 11.18 |
| 2012-10-10 01:00:00 | 11.18 |
| 2012-10-10 02:00:00 | 8.84 |
| 2012-10-10 03:00:00 | 9.88 |
| 2012-10-10 04:00:00 | 8.58 |
| 2012-10-10 05:00:00 | 6.76 |
| 2012-10-10 06:00:00 | 9.36 |
| 2012-10-10 07:00:00 | 7.54 |
| 2012-10-10 08:00:00 | 10.14 |
| 2012-10-10 09:00:00 | 10.14 |
| 2012-10-10 10:00:00 | 12.74 |
| 2012-10-10 11:00:00 | 11.18 |
| 2012-10-10 12:00:00 | 10.92 |
| 2012-10-10 13:00:00 | 10.14 |
| 2012-10-10 14:00:00 | 11.18 |
| 2012-10-10 15:00:00 | 10.4 |
| 2012-10-10 16:00:00 | 11.18 |
| 2012-10-10 17:00:00 | 10.4 |
| 2012-10-10 18:00:00 | 10.4 |
| 2012-10-10 19:00:00 | 11.18 |
| 2012-10-10 20:00:00 | 11.96 |
| 2012-10-10 21:00:00 | 11.18 |
| 2012-10-10 22:00:00 | 11.96 |
| 2012-10-10 23:00:00 | 12.22 |
| 2012-10-11 | 10.92 |
| 2012-10-11 01:00:00 | 10.14 |
| 2012-10-11 02:00:00 | 8.58 |
| 2012-10-11 03:00:00 | 7.02 |
| 2012-10-11 04:00:00 | 8.32 |
| 2012-10-11 05:00:00 | 6.24 |
| 2012-10-11 06:00:00 | 7.28 |
| 2012-10-11 07:00:00 | 8.32 |
| 2012-10-11 08:00:00 | 7.8 |
| 2012-10-11 09:00:00 | 9.36 |
| 2012-10-11 10:00:00 | 12.22 |
| 2012-10-11 11:00:00 | 11.44 |
| 2012-10-11 12:00:00 | 9.36 |
| 2012-10-11 13:00:00 | 9.1 |
| 2012-10-11 14:00:00 | 9.1 |
| 2012-10-11 15:00:00 | 9.62 |
| 2012-10-11 16:00:00 | 9.62 |
| 2012-10-11 17:00:00 | 10.14 |
| 2012-10-11 18:00:00 | 9.88 |
| 2012-10-11 19:00:00 | 10.92 |
| 2012-10-11 20:00:00 | 10.92 |
| 2012-10-11 21:00:00 | 11.44 |
| 2012-10-11 22:00:00 | 11.7 |
| 2012-10-11 23:00:00 | 10.14 |
| 2012-10-12 | 11.96 |
| 2012-10-12 01:00:00 | 9.88 |
| 2012-10-12 02:00:00 | 7.8 |
| 2012-10-12 03:00:00 | 7.28 |
| 2012-10-12 04:00:00 | 8.32 |
| 2012-10-12 05:00:00 | 6.5 |
| 2012-10-12 06:00:00 | 6.24 |
| 2012-10-12 07:00:00 | 7.54 |
| 2012-10-12 08:00:00 | 8.58 |
| 2012-10-12 09:00:00 | 9.36 |
| 2012-10-12 10:00:00 | 9.88 |
| 2012-10-12 11:00:00 | 10.14 |
| 2012-10-12 12:00:00 | 11.44 |
| 2012-10-12 13:00:00 | 9.62 |
| 2012-10-12 14:00:00 | 9.62 |
| 2012-10-12 15:00:00 | 9.62 |
| 2012-10-12 16:00:00 | 9.36 |
| 2012-10-12 17:00:00 | 9.88 |
| 2012-10-12 18:00:00 | 9.88 |
| 2012-10-12 19:00:00 | 9.36 |
| 2012-10-12 20:00:00 | 11.96 |
| 2012-10-12 21:00:00 | 10.14 |
| 2012-10-12 22:00:00 | 9.88 |
| 2012-10-12 23:00:00 | 11.7 |
| 2012-10-13 | 14.04 |
| 2012-10-13 01:00:00 | 33.8 |
| 2012-10-13 02:00:00 | 37.96 |
| 2012-10-13 03:00:00 | 37.96 |
| 2012-10-13 04:00:00 | 38.48 |
| 2012-10-13 05:00:00 | 38.48 |
| 2012-10-13 06:00:00 | 38.22 |
| 2012-10-13 07:00:00 | 38.48 |
| 2012-10-13 08:00:00 | 38.22 |
| 2012-10-13 09:00:00 | 38.22 |
| 2012-10-13 10:00:00 | 32.76 |
| 2012-10-13 11:00:00 | 14.56 |
| 2012-10-13 12:00:00 | 13 |
| 2012-10-13 13:00:00 | 23.14 |
| 2012-10-13 14:00:00 | 24.44 |
| 2012-10-13 15:00:00 | 10.92 |
| 2012-10-13 16:00:00 | 24.96 |
| 2012-10-13 17:00:00 | 10.14 |
| 2012-10-13 18:00:00 | 11.7 |
| 2012-10-13 19:00:00 | 11.18 |
| 2012-10-13 20:00:00 | 11.44 |
| 2012-10-13 21:00:00 | 11.18 |
| 2012-10-13 22:00:00 | 10.92 |
| 2012-10-13 23:00:00 | 10.14 |
| 2012-10-14 | 9.62 |
| 2012-10-14 01:00:00 | 10.14 |
| 2012-10-14 02:00:00 | 9.1 |
| 2012-10-14 03:00:00 | 6.76 |
| 2012-10-14 04:00:00 | 8.06 |
| 2012-10-14 05:00:00 | 6.5 |
| 2012-10-14 06:00:00 | 6.76 |
| 2012-10-14 07:00:00 | 7.28 |
| 2012-10-14 08:00:00 | 5.72 |
| 2012-10-14 09:00:00 | 8.06 |
| 2012-10-14 10:00:00 | 9.1 |
| 2012-10-14 11:00:00 | 10.4 |
| 2012-10-14 12:00:00 | 10.92 |
| 2012-10-14 13:00:00 | 11.96 |
| 2012-10-14 14:00:00 | 10.66 |
| 2012-10-14 15:00:00 | 12.22 |
| 2012-10-14 16:00:00 | 10.66 |
| 2012-10-14 17:00:00 | 10.4 |
| 2012-10-14 18:00:00 | 12.48 |
| 2012-10-14 19:00:00 | 10.14 |
| 2012-10-14 20:00:00 | 12.74 |
| 2012-10-14 21:00:00 | 11.96 |
| 2012-10-14 22:00:00 | 12.74 |
| 2012-10-14 23:00:00 | 10.92 |
| 2012-10-15 | 10.4 |
| 2012-10-15 01:00:00 | 9.88 |
| 2012-10-15 02:00:00 | 9.1 |
| 2012-10-15 03:00:00 | 6.24 |
| 2012-10-15 04:00:00 | 7.28 |
| 2012-10-15 05:00:00 | 6.76 |
| 2012-10-15 06:00:00 | 5.46 |
| 2012-10-15 07:00:00 | 7.8 |
| 2012-10-15 08:00:00 | 7.54 |
| 2012-10-15 09:00:00 | 9.1 |
| 2012-10-15 10:00:00 | 9.88 |
| 2012-10-15 11:00:00 | 9.88 |
| 2012-10-15 12:00:00 | 9.88 |
| 2012-10-15 13:00:00 | 10.4 |
| 2012-10-15 14:00:00 | 9.62 |
| 2012-10-15 15:00:00 | 8.58 |
| 2012-10-15 16:00:00 | 8.06 |
| 2012-10-15 17:00:00 | 10.14 |
| 2012-10-15 18:00:00 | 9.62 |
| 2012-10-15 19:00:00 | 9.62 |
| 2012-10-15 20:00:00 | 38.48 |
| 2012-10-15 21:00:00 | 39.26 |
| 2012-10-15 22:00:00 | 39.26 |
| 2012-10-15 23:00:00 | 39 |
| 2012-10-16 | 38.74 |
| 2012-10-16 01:00:00 | 39 |
| 2012-10-16 02:00:00 | 38.22 |
| 2012-10-16 03:00:00 | 38.48 |
| 2012-10-16 04:00:00 | 38.22 |
| 2012-10-16 05:00:00 | 38.48 |
| 2012-10-16 06:00:00 | 38.48 |
| 2012-10-16 07:00:00 | 14.04 |
| 2012-10-16 08:00:00 | 37.18 |
| 2012-10-16 09:00:00 | 40.82 |
| 2012-10-16 10:00:00 | 41.08 |
| 2012-10-16 11:00:00 | 41.08 |
| 2012-10-16 12:00:00 | 39.52 |
| 2012-10-16 13:00:00 | 39.78 |
| 2012-10-16 14:00:00 | 39.78 |
| 2012-10-16 15:00:00 | 39.78 |
| 2012-10-16 16:00:00 | 39.26 |
| 2012-10-16 17:00:00 | 40.3 |
| 2012-10-16 18:00:00 | 40.3 |
| 2012-10-16 19:00:00 | 40.04 |
| 2012-10-16 20:00:00 | 40.3 |
| 2012-10-16 21:00:00 | 40.3 |
| 2012-10-16 22:00:00 | 40.3 |
| 2012-10-16 23:00:00 | 40.3 |
| 2012-10-17 | 40.04 |
| 2012-10-17 01:00:00 | 40.3 |
| 2012-10-17 02:00:00 | 40.04 |
| 2012-10-17 03:00:00 | 40.3 |
| 2012-10-17 04:00:00 | 40.04 |
| 2012-10-17 05:00:00 | 40.04 |
| 2012-10-17 06:00:00 | 40.04 |
| 2012-10-17 07:00:00 | 40.04 |
| 2012-10-17 08:00:00 | 39.78 |
| 2012-10-17 09:00:00 | 40.04 |
| 2012-10-17 10:00:00 | 39.78 |
| 2012-10-17 11:00:00 | 39.78 |
| 2012-10-17 12:00:00 | 39.52 |
| 2012-10-17 13:00:00 | 39.52 |
| 2012-10-17 14:00:00 | 39.78 |
| 2012-10-17 15:00:00 | 39.52 |
| 2012-10-17 16:00:00 | 39.52 |
| 2012-10-17 17:00:00 | 33.54 |
| 2012-10-17 18:00:00 | 21.58 |
| 2012-10-17 19:00:00 | 21.84 |
| 2012-10-17 20:00:00 | 21.58 |
| 2012-10-17 21:00:00 | 22.1 |
| 2012-10-17 22:00:00 | 22.36 |
| 2012-10-17 23:00:00 | 21.84 |
| 2012-10-18 | 15.6 |
| 2012-10-18 01:00:00 | 13 |
| 2012-10-18 02:00:00 | 12.22 |
| 2012-10-18 03:00:00 | 10.4 |
| 2012-10-18 04:00:00 | 11.44 |
| 2012-10-18 05:00:00 | 10.92 |
| 2012-10-18 06:00:00 | 10.66 |
| 2012-10-18 07:00:00 | 12.22 |
| 2012-10-18 08:00:00 | 12.22 |
| 2012-10-18 09:00:00 | 13.26 |
| 2012-10-18 10:00:00 | 13 |
| 2012-10-18 11:00:00 | 13.26 |
| 2012-10-18 12:00:00 | 12.74 |
| 2012-10-18 13:00:00 | 12.48 |
| 2012-10-18 14:00:00 | 12.48 |
| 2012-10-18 15:00:00 | 11.18 |
| 2012-10-18 16:00:00 | 13.26 |
| 2012-10-18 17:00:00 | 12.22 |
| 2012-10-18 18:00:00 | 12.74 |
| 2012-10-18 19:00:00 | 12.48 |
| 2012-10-18 20:00:00 | 12.74 |
| 2012-10-18 21:00:00 | 13.26 |
| 2012-10-18 22:00:00 | 15.08 |
| 2012-10-18 23:00:00 | 13 |
| 2012-10-19 | 12.74 |
| 2012-10-19 01:00:00 | 11.18 |
| 2012-10-19 02:00:00 | 10.66 |
| 2012-10-19 03:00:00 | 10.14 |
| 2012-10-19 04:00:00 | 9.36 |
| 2012-10-19 05:00:00 | 7.8 |
| 2012-10-19 06:00:00 | 10.4 |
| 2012-10-19 07:00:00 | 9.1 |
| 2012-10-19 08:00:00 | 10.14 |
| 2012-10-19 09:00:00 | 12.22 |
| 2012-10-19 10:00:00 | 11.44 |
| 2012-10-19 11:00:00 | 12.48 |
| 2012-10-19 12:00:00 | 12.48 |
| 2012-10-19 13:00:00 | 11.44 |
| 2012-10-19 14:00:00 | 11.44 |
| 2012-10-19 15:00:00 | 12.48 |
| 2012-10-19 16:00:00 | 11.7 |
| 2012-10-19 17:00:00 | 12.22 |
| 2012-10-19 18:00:00 | 11.18 |
| 2012-10-19 19:00:00 | 12.22 |
| 2012-10-19 20:00:00 | 11.7 |
| 2012-10-19 21:00:00 | 12.48 |
| 2012-10-19 22:00:00 | 11.7 |
| 2012-10-19 23:00:00 | 12.74 |
| 2012-10-20 | 11.18 |
| 2012-10-20 01:00:00 | 10.4 |
| 2012-10-20 02:00:00 | 10.14 |
| 2012-10-20 03:00:00 | 9.1 |
| 2012-10-20 04:00:00 | 7.8 |
| 2012-10-20 05:00:00 | 9.36 |
| 2012-10-20 06:00:00 | 7.02 |
| 2012-10-20 07:00:00 | 8.84 |
| 2012-10-20 08:00:00 | 8.84 |
| 2012-10-20 09:00:00 | 8.06 |
| 2012-10-20 10:00:00 | 12.22 |
| 2012-10-20 11:00:00 | 12.22 |
| 2012-10-20 12:00:00 | 12.74 |
| 2012-10-20 13:00:00 | 12.48 |
| 2012-10-20 14:00:00 | 13 |
| 2012-10-20 15:00:00 | 12.48 |
| 2012-10-20 16:00:00 | 12.48 |
| 2012-10-20 17:00:00 | 12.48 |
| 2012-10-20 18:00:00 | 11.18 |
| 2012-10-20 19:00:00 | 10.92 |
| 2012-10-20 20:00:00 | 12.22 |
| 2012-10-20 21:00:00 | 12.48 |
| 2012-10-20 22:00:00 | 11.44 |
| 2012-10-20 23:00:00 | 11.96 |
| 2012-10-21 | 10.92 |
| 2012-10-21 01:00:00 | 10.4 |
| 2012-10-21 02:00:00 | 9.36 |
| 2012-10-21 03:00:00 | 8.32 |
| 2012-10-21 04:00:00 | 8.58 |
| 2012-10-21 05:00:00 | 8.32 |
| 2012-10-21 06:00:00 | 6.5 |
| 2012-10-21 07:00:00 | 8.32 |
| 2012-10-21 08:00:00 | 8.32 |
| 2012-10-21 09:00:00 | 7.28 |
| 2012-10-21 10:00:00 | 9.88 |
| 2012-10-21 11:00:00 | 13 |
| 2012-10-21 12:00:00 | 12.74 |
| 2012-10-21 13:00:00 | 12.48 |
| 2012-10-21 14:00:00 | 12.48 |
| 2012-10-21 15:00:00 | 12.74 |
| 2012-10-21 16:00:00 | 10.92 |
| 2012-10-21 17:00:00 | 12.48 |
| 2012-10-21 18:00:00 | 11.7 |
| 2012-10-21 19:00:00 | 10.92 |
| 2012-10-21 20:00:00 | 11.96 |
| 2012-10-21 21:00:00 | 12.74 |
| 2012-10-21 22:00:00 | 13 |
| 2012-10-21 23:00:00 | 11.7 |
| 2012-10-22 | 10.14 |
| 2012-10-22 01:00:00 | 10.14 |
| 2012-10-22 02:00:00 | 8.84 |
| 2012-10-22 03:00:00 | 9.1 |
| 2012-10-22 04:00:00 | 8.32 |
| 2012-10-22 05:00:00 | 6.5 |
| 2012-10-22 06:00:00 | 6.76 |
| 2012-10-22 07:00:00 | 9.1 |
| 2012-10-22 08:00:00 | 9.36 |
| 2012-10-22 09:00:00 | 10.14 |
| 2012-10-22 10:00:00 | 11.7 |
| 2012-10-22 11:00:00 | 10.66 |
| 2012-10-22 12:00:00 | 11.96 |
| 2012-10-22 13:00:00 | 13.52 |
| 2012-10-22 14:00:00 | 13 |
| 2012-10-22 15:00:00 | 12.48 |
| 2012-10-22 16:00:00 | 9.88 |
| 2012-10-22 17:00:00 | 10.14 |
| 2012-10-22 18:00:00 | 9.88 |
| 2012-10-22 19:00:00 | 10.92 |
| 2012-10-22 20:00:00 | 10.92 |
| 2012-10-22 21:00:00 | 12.22 |
| 2012-10-22 22:00:00 | 11.96 |
| 2012-10-22 23:00:00 | 11.96 |
| 2012-10-23 | 9.88 |
| 2012-10-23 01:00:00 | 10.92 |
| 2012-10-23 02:00:00 | 8.84 |
| 2012-10-23 03:00:00 | 8.06 |
| 2012-10-23 04:00:00 | 8.32 |
| 2012-10-23 05:00:00 | 8.58 |
| 2012-10-23 06:00:00 | 8.06 |
| 2012-10-23 07:00:00 | 8.58 |
| 2012-10-23 08:00:00 | 9.88 |
| 2012-10-23 09:00:00 | 11.7 |
| 2012-10-23 10:00:00 | 11.96 |
| 2012-10-23 11:00:00 | 11.18 |
| 2012-10-23 12:00:00 | 13.26 |
| 2012-10-23 13:00:00 | 13.26 |
| 2012-10-23 14:00:00 | 12.22 |
| 2012-10-23 15:00:00 | 10.92 |
| 2012-10-23 16:00:00 | 10.14 |
| 2012-10-23 17:00:00 | 11.44 |
| 2012-10-23 18:00:00 | 11.44 |
| 2012-10-23 19:00:00 | 11.7 |
| 2012-10-23 20:00:00 | 11.7 |
| 2012-10-23 21:00:00 | 11.96 |
| 2012-10-23 22:00:00 | 11.7 |
| 2012-10-23 23:00:00 | 11.96 |
| 2012-10-24 | 11.44 |
| 2012-10-24 01:00:00 | 10.14 |
| 2012-10-24 02:00:00 | 9.1 |
| 2012-10-24 03:00:00 | 8.58 |
| 2012-10-24 04:00:00 | 8.06 |
| 2012-10-24 05:00:00 | 7.02 |
| 2012-10-24 06:00:00 | 6.76 |
| 2012-10-24 07:00:00 | 7.02 |
| 2012-10-24 08:00:00 | 8.58 |
| 2012-10-24 09:00:00 | 10.14 |
| 2012-10-24 10:00:00 | 12.48 |
| 2012-10-24 11:00:00 | 10.66 |
| 2012-10-24 12:00:00 | 11.44 |
| 2012-10-24 13:00:00 | 10.92 |
| 2012-10-24 14:00:00 | 11.44 |
| 2012-10-24 15:00:00 | 10.4 |
| 2012-10-24 16:00:00 | 10.4 |
| 2012-10-24 17:00:00 | 9.88 |
| 2012-10-24 18:00:00 | 9.88 |
| 2012-10-24 19:00:00 | 9.88 |
| 2012-10-24 20:00:00 | 11.7 |
| 2012-10-24 21:00:00 | 11.7 |
| 2012-10-24 22:00:00 | 10.66 |
| 2012-10-24 23:00:00 | 11.96 |
| 2012-10-25 | 9.62 |
| 2012-10-25 01:00:00 | 10.66 |
| 2012-10-25 02:00:00 | 11.7 |
| 2012-10-25 03:00:00 | 10.66 |
| 2012-10-25 04:00:00 | 9.1 |
| 2012-10-25 05:00:00 | 7.8 |
| 2012-10-25 06:00:00 | 8.32 |
| 2012-10-25 07:00:00 | 8.06 |
| 2012-10-25 08:00:00 | 8.06 |
| 2012-10-25 09:00:00 | 9.62 |
| 2012-10-25 10:00:00 | 10.4 |
| 2012-10-25 11:00:00 | 10.4 |
| 2012-10-25 12:00:00 | 12.48 |
| 2012-10-25 13:00:00 | 18.2 |
| 2012-10-25 14:00:00 | 19.76 |
| 2012-10-25 15:00:00 | 11.44 |
| 2012-10-25 16:00:00 | 10.4 |
| 2012-10-25 17:00:00 | 10.14 |
| 2012-10-25 18:00:00 | 10.14 |
| 2012-10-25 19:00:00 | 10.66 |
| 2012-10-25 20:00:00 | 11.7 |
| 2012-10-25 21:00:00 | 11.96 |
| 2012-10-25 22:00:00 | 11.44 |
| 2012-10-25 23:00:00 | 11.7 |
| 2012-10-26 | 9.88 |
| 2012-10-26 01:00:00 | 10.14 |
| 2012-10-26 02:00:00 | 9.1 |
| 2012-10-26 03:00:00 | 9.1 |
| 2012-10-26 04:00:00 | 8.06 |
| 2012-10-26 05:00:00 | 7.02 |
| 2012-10-26 06:00:00 | 10.66 |
| 2012-10-26 07:00:00 | 12.48 |
| 2012-10-26 08:00:00 | 17.94 |
| 2012-10-26 09:00:00 | 11.18 |
| 2012-10-26 10:00:00 | 12.74 |
| 2012-10-26 11:00:00 | 10.92 |
| 2012-10-26 12:00:00 | 9.88 |
| 2012-10-26 13:00:00 | 14.82 |
| 2012-10-26 14:00:00 | 10.92 |
| 2012-10-26 15:00:00 | 10.14 |
| 2012-10-26 16:00:00 | 10.14 |
| 2012-10-26 17:00:00 | 10.14 |
| 2012-10-26 18:00:00 | 9.88 |
| 2012-10-26 19:00:00 | 11.7 |
| 2012-10-26 20:00:00 | 20.28 |
| 2012-10-26 21:00:00 | 31.72 |
| 2012-10-26 22:00:00 | 38.48 |
| 2012-10-26 23:00:00 | 38.74 |
| 2012-10-27 | 38.74 |
| 2012-10-27 01:00:00 | 35.1 |
| 2012-10-27 02:00:00 | 26.78 |
| 2012-10-27 03:00:00 | 40.56 |
| 2012-10-27 04:00:00 | 41.34 |
| 2012-10-27 05:00:00 | 41.34 |
| 2012-10-27 06:00:00 | 40.3 |
| 2012-10-27 07:00:00 | 40.56 |
| 2012-10-27 08:00:00 | 40.56 |
| 2012-10-27 09:00:00 | 40.82 |
| 2012-10-27 10:00:00 | 41.34 |
| 2012-10-27 11:00:00 | 41.08 |
| 2012-10-27 12:00:00 | 41.08 |
| 2012-10-27 13:00:00 | 41.08 |
| 2012-10-27 14:00:00 | 41.08 |
| 2012-10-27 15:00:00 | 40.82 |
| 2012-10-27 16:00:00 | 41.08 |
| 2012-10-27 17:00:00 | 41.08 |
| 2012-10-27 18:00:00 | 41.34 |
| 2012-10-27 19:00:00 | 41.08 |
| 2012-10-27 20:00:00 | 41.08 |
| 2012-10-27 21:00:00 | 41.08 |
| 2012-10-27 22:00:00 | 41.08 |
| 2012-10-27 23:00:00 | 41.08 |
| 2012-10-28 | 41.34 |
| 2012-10-28 01:00:00 | 41.08 |
| 2012-10-28 02:00:00 | 41.08 |
| 2012-10-28 02:00:00 | 41.08 |
| 2012-10-28 03:00:00 | 41.34 |
| 2012-10-28 04:00:00 | 41.6 |
| 2012-10-28 05:00:00 | 41.34 |
| 2012-10-28 06:00:00 | 41.6 |
| 2012-10-28 07:00:00 | 41.86 |
| 2012-10-28 08:00:00 | 41.6 |
| 2012-10-28 09:00:00 | 41.6 |
| 2012-10-28 10:00:00 | 41.6 |
| 2012-10-28 11:00:00 | 41.34 |
| 2012-10-28 12:00:00 | 41.34 |
| 2012-10-28 13:00:00 | 41.34 |
| 2012-10-28 14:00:00 | 41.34 |
| 2012-10-28 15:00:00 | 41.34 |
| 2012-10-28 16:00:00 | 41.08 |
| 2012-10-28 17:00:00 | 41.34 |
| 2012-10-28 18:00:00 | 41.08 |
| 2012-10-28 19:00:00 | 41.08 |
| 2012-10-28 20:00:00 | 41.08 |
| 2012-10-28 21:00:00 | 41.34 |
| 2012-10-28 22:00:00 | 40.56 |
| 2012-10-28 23:00:00 | 40.04 |
| 2012-10-29 | 40.82 |
| 2012-10-29 01:00:00 | 40.82 |
| 2012-10-29 02:00:00 | 41.08 |
| 2012-10-29 03:00:00 | 40.56 |
| 2012-10-29 04:00:00 | 40.82 |
| 2012-10-29 05:00:00 | 40.82 |
| 2012-10-29 06:00:00 | 40.82 |
| 2012-10-29 07:00:00 | 40.82 |
| 2012-10-29 08:00:00 | 40.82 |
| 2012-10-29 09:00:00 | 40.82 |
| 2012-10-29 10:00:00 | 40.82 |
| 2012-10-29 11:00:00 | 41.34 |
| 2012-10-29 12:00:00 | 43.16 |
| 2012-10-29 13:00:00 | 42.9 |
| 2012-10-29 14:00:00 | 42.64 |
| 2012-10-29 15:00:00 | 42.64 |
| 2012-10-29 16:00:00 | 42.64 |
| 2012-10-29 17:00:00 | 42.64 |
| 2012-10-29 18:00:00 | 42.64 |
| 2012-10-29 19:00:00 | 42.9 |
| 2012-10-29 20:00:00 | 42.38 |
| 2012-10-29 21:00:00 | 42.38 |
| 2012-10-29 22:00:00 | 42.12 |
| 2012-10-29 23:00:00 | 41.86 |
| 2012-10-30 | 41.6 |
| 2012-10-30 01:00:00 | 41.34 |
| 2012-10-30 02:00:00 | 40.04 |
| 2012-10-30 03:00:00 | 40.56 |
| 2012-10-30 04:00:00 | 40.56 |
| 2012-10-30 05:00:00 | 40.3 |
| 2012-10-30 06:00:00 | 40.3 |
| 2012-10-30 07:00:00 | 40.56 |
| 2012-10-30 08:00:00 | 40.56 |
| 2012-10-30 09:00:00 | 40.56 |
| 2012-10-30 10:00:00 | 40.3 |
| 2012-10-30 11:00:00 | 40.82 |
| 2012-10-30 12:00:00 | 40.56 |
| 2012-10-30 13:00:00 | 40.56 |
| 2012-10-30 14:00:00 | 40.82 |
| 2012-10-30 15:00:00 | 40.82 |
| 2012-10-30 16:00:00 | 41.08 |
| 2012-10-30 17:00:00 | 40.56 |
| 2012-10-30 18:00:00 | 40.56 |
| 2012-10-30 19:00:00 | 40.56 |
| 2012-10-30 20:00:00 | 40.82 |
| 2012-10-30 21:00:00 | 40.82 |
| 2012-10-30 22:00:00 | 40.56 |
| 2012-10-30 23:00:00 | 40.56 |
| 2012-10-31 | 40.56 |
| 2012-10-31 01:00:00 | 40.3 |
| 2012-10-31 02:00:00 | 40.56 |
| 2012-10-31 03:00:00 | 40.3 |
| 2012-10-31 04:00:00 | 40.04 |
| 2012-10-31 05:00:00 | 40.3 |
| 2012-10-31 06:00:00 | 40.04 |
| 2012-10-31 07:00:00 | 40.3 |
| 2012-10-31 08:00:00 | 40.3 |
| 2012-10-31 09:00:00 | 40.04 |
| 2012-10-31 10:00:00 | 40.56 |
| 2012-10-31 11:00:00 | 40.04 |
| 2012-10-31 12:00:00 | 40.04 |
| 2012-10-31 13:00:00 | 39.78 |
| 2012-10-31 14:00:00 | 39.78 |
| 2012-10-31 15:00:00 | 39.52 |
| 2012-10-31 16:00:00 | 39.78 |
| 2012-10-31 17:00:00 | 39.52 |
| 2012-10-31 18:00:00 | 39.78 |
| 2012-10-31 19:00:00 | 39.78 |
| 2012-10-31 20:00:00 | 39.52 |
| 2012-10-31 21:00:00 | 39.78 |
| 2012-10-31 22:00:00 | 39.78 |
| 2012-10-31 23:00:00 | 39.52 |
| 2012-11-01 | 39.52 |
| 2012-11-01 01:00:00 | 18.46 |
| 2012-11-01 02:00:00 | 14.3 |
| 2012-11-01 03:00:00 | 13 |
| 2012-11-01 04:00:00 | 13.26 |
| 2012-11-01 05:00:00 | 13.26 |
| 2012-11-01 06:00:00 | 13.26 |
| 2012-11-01 07:00:00 | 13.52 |
| 2012-11-01 08:00:00 | 14.3 |
| 2012-11-01 09:00:00 | 18.98 |
| 2012-11-01 10:00:00 | 22.36 |
| 2012-11-01 11:00:00 | 18.46 |
| 2012-11-01 12:00:00 | 16.12 |
| 2012-11-01 13:00:00 | 15.34 |
| 2012-11-01 14:00:00 | 22.36 |
| 2012-11-01 15:00:00 | 39.78 |
| 2012-11-01 16:00:00 | 35.62 |
| 2012-11-01 17:00:00 | 14.82 |
| 2012-11-01 18:00:00 | 15.6 |
| 2012-11-01 19:00:00 | 23.14 |
| 2012-11-01 20:00:00 | 39.26 |
| 2012-11-01 21:00:00 | 39.78 |
| 2012-11-01 22:00:00 | 37.18 |
| 2012-11-01 23:00:00 | 19.5 |
| 2012-11-02 | 16.64 |
| 2012-11-02 01:00:00 | 14.3 |
| 2012-11-02 02:00:00 | 11.96 |
| 2012-11-02 03:00:00 | 14.3 |
| 2012-11-02 04:00:00 | 12.22 |
| 2012-11-02 05:00:00 | 11.96 |
| 2012-11-02 06:00:00 | 11.96 |
| 2012-11-02 07:00:00 | 12.74 |
| 2012-11-02 08:00:00 | 14.04 |
| 2012-11-02 09:00:00 | 14.3 |
| 2012-11-02 10:00:00 | 17.42 |
| 2012-11-02 11:00:00 | 16.38 |
| 2012-11-02 12:00:00 | 14.56 |
| 2012-11-02 13:00:00 | 13.78 |
| 2012-11-02 14:00:00 | 14.82 |
| 2012-11-02 15:00:00 | 15.6 |
| 2012-11-02 16:00:00 | 23.66 |
| 2012-11-02 17:00:00 | 17.42 |
| 2012-11-02 18:00:00 | 15.34 |
| 2012-11-02 19:00:00 | 14.3 |
| 2012-11-02 20:00:00 | 14.3 |
| 2012-11-02 21:00:00 | 14.56 |
| 2012-11-02 22:00:00 | 15.08 |
| 2012-11-02 23:00:00 | 14.3 |
| 2012-11-03 | 13.78 |
| 2012-11-03 01:00:00 | 13.78 |
| 2012-11-03 02:00:00 | 12.74 |
| 2012-11-03 03:00:00 | 12.22 |
| 2012-11-03 04:00:00 | 11.96 |
| 2012-11-03 05:00:00 | 11.44 |
| 2012-11-03 06:00:00 | 11.44 |
| 2012-11-03 07:00:00 | 11.44 |
| 2012-11-03 08:00:00 | 11.7 |
| 2012-11-03 09:00:00 | 11.44 |
| 2012-11-03 10:00:00 | 16.12 |
| 2012-11-03 11:00:00 | 17.94 |
| 2012-11-03 12:00:00 | 18.46 |
| 2012-11-03 13:00:00 | 17.16 |
| 2012-11-03 14:00:00 | 16.38 |
| 2012-11-03 15:00:00 | 16.38 |
| 2012-11-03 16:00:00 | 15.34 |
| 2012-11-03 17:00:00 | 15.86 |
| 2012-11-03 18:00:00 | 14.3 |
| 2012-11-03 19:00:00 | 13.52 |
| 2012-11-03 20:00:00 | 13.52 |
| 2012-11-03 21:00:00 | 13.52 |
| 2012-11-03 22:00:00 | 14.3 |
| 2012-11-03 23:00:00 | 13.52 |
| 2012-11-04 | 13 |
| 2012-11-04 01:00:00 | 12.74 |
| 2012-11-04 02:00:00 | 11.7 |
| 2012-11-04 03:00:00 | 11.44 |
| 2012-11-04 04:00:00 | 11.18 |
| 2012-11-04 05:00:00 | 10.66 |
| 2012-11-04 06:00:00 | 10.4 |
| 2012-11-04 07:00:00 | 9.62 |
| 2012-11-04 08:00:00 | 9.88 |
| 2012-11-04 09:00:00 | 13 |
| 2012-11-04 10:00:00 | 13 |
| 2012-11-04 11:00:00 | 15.08 |
| 2012-11-04 12:00:00 | 16.64 |
| 2012-11-04 13:00:00 | 16.64 |
| 2012-11-04 14:00:00 | 14.82 |
| 2012-11-04 15:00:00 | 15.08 |
| 2012-11-04 16:00:00 | 15.34 |
| 2012-11-04 17:00:00 | 13.52 |
| 2012-11-04 18:00:00 | 13.26 |
| 2012-11-04 19:00:00 | 13.26 |
| 2012-11-04 20:00:00 | 13.78 |
| 2012-11-04 21:00:00 | 16.12 |
| 2012-11-04 22:00:00 | 17.16 |
| 2012-11-04 23:00:00 | 15.6 |
| 2012-11-05 | 13.26 |
| 2012-11-05 01:00:00 | 12.74 |
| 2012-11-05 02:00:00 | 11.44 |
| 2012-11-05 03:00:00 | 10.66 |
| 2012-11-05 04:00:00 | 21.58 |
| 2012-11-05 05:00:00 | 39.26 |
| 2012-11-05 06:00:00 | 39.52 |
| 2012-11-05 07:00:00 | 40.3 |
| 2012-11-05 08:00:00 | 40.04 |
| 2012-11-05 09:00:00 | 40.04 |
| 2012-11-05 10:00:00 | 40.3 |
| 2012-11-05 11:00:00 | 39.78 |
| 2012-11-05 12:00:00 | 39.78 |
| 2012-11-05 13:00:00 | 40.04 |
| 2012-11-05 14:00:00 | 40.56 |
| 2012-11-05 15:00:00 | 40.04 |
| 2012-11-05 16:00:00 | 39.78 |
| 2012-11-05 17:00:00 | 39.78 |
| 2012-11-05 18:00:00 | 40.04 |
| 2012-11-05 19:00:00 | 39.78 |
| 2012-11-05 20:00:00 | 39.78 |
| 2012-11-05 21:00:00 | 40.04 |
| 2012-11-05 22:00:00 | 39.78 |
| 2012-11-05 23:00:00 | 40.04 |
| 2012-11-06 | 40.04 |
| 2012-11-06 01:00:00 | 39.78 |
| 2012-11-06 02:00:00 | 39.78 |
| 2012-11-06 03:00:00 | 40.3 |
| 2012-11-06 04:00:00 | 40.04 |
| 2012-11-06 05:00:00 | 40.04 |
| 2012-11-06 06:00:00 | 40.04 |
| 2012-11-06 07:00:00 | 40.04 |
| 2012-11-06 08:00:00 | 40.04 |
| 2012-11-06 09:00:00 | 40.04 |
| 2012-11-06 10:00:00 | 40.04 |
| 2012-11-06 11:00:00 | 39.78 |
| 2012-11-06 12:00:00 | 40.04 |
| 2012-11-06 13:00:00 | 40.04 |
| 2012-11-06 14:00:00 | 39.78 |
| 2012-11-06 15:00:00 | 40.04 |
| 2012-11-06 16:00:00 | 39.78 |
| 2012-11-06 17:00:00 | 39.78 |
| 2012-11-06 18:00:00 | 39.78 |
| 2012-11-06 19:00:00 | 40.04 |
| 2012-11-06 20:00:00 | 39.78 |
| 2012-11-06 21:00:00 | 40.04 |
| 2012-11-06 22:00:00 | 39.78 |
| 2012-11-06 23:00:00 | 40.04 |
| 2012-11-07 | 39.78 |
| 2012-11-07 01:00:00 | 39.78 |
| 2012-11-07 02:00:00 | 39.52 |
| 2012-11-07 03:00:00 | 40.04 |
| 2012-11-07 04:00:00 | 39.78 |
| 2012-11-07 05:00:00 | 39.78 |
| 2012-11-07 06:00:00 | 39.52 |
| 2012-11-07 07:00:00 | 40.04 |
| 2012-11-07 08:00:00 | 39.78 |
| 2012-11-07 09:00:00 | 40.04 |
| 2012-11-07 10:00:00 | 39.78 |
| 2012-11-07 11:00:00 | 40.04 |
| 2012-11-07 12:00:00 | 39.78 |
| 2012-11-07 13:00:00 | 39.52 |
| 2012-11-07 14:00:00 | 39.52 |
| 2012-11-07 15:00:00 | 39.52 |
| 2012-11-07 16:00:00 | 39.26 |
| 2012-11-07 17:00:00 | 39.52 |
| 2012-11-07 18:00:00 | 39.26 |
| 2012-11-07 19:00:00 | 39.26 |
| 2012-11-07 20:00:00 | 39.26 |
| 2012-11-07 21:00:00 | 39.26 |
| 2012-11-07 22:00:00 | 39.26 |
| 2012-11-07 23:00:00 | 39.26 |
| 2012-11-08 | 39.26 |
| 2012-11-08 01:00:00 | 39 |
| 2012-11-08 02:00:00 | 39 |
| 2012-11-08 03:00:00 | 38.74 |
| 2012-11-08 04:00:00 | 39.26 |
| 2012-11-08 05:00:00 | 39 |
| 2012-11-08 06:00:00 | 39 |
| 2012-11-08 07:00:00 | 38.74 |
| 2012-11-08 08:00:00 | 23.66 |
| 2012-11-08 09:00:00 | 23.14 |
| 2012-11-08 10:00:00 | 23.4 |
| 2012-11-08 11:00:00 | 22.36 |
| 2012-11-08 12:00:00 | 22.1 |
| 2012-11-08 13:00:00 | 22.36 |
| 2012-11-08 14:00:00 | 22.1 |
| 2012-11-08 15:00:00 | 22.62 |
| 2012-11-08 16:00:00 | 22.36 |
| 2012-11-08 17:00:00 | 22.88 |
| 2012-11-08 18:00:00 | 14.82 |
| 2012-11-08 19:00:00 | 26.52 |
| 2012-11-08 20:00:00 | 27.04 |
| 2012-11-08 21:00:00 | 24.7 |
| 2012-11-08 22:00:00 | 23.66 |
| 2012-11-08 23:00:00 | 15.6 |
| 2012-11-09 | 26.52 |
| 2012-11-09 01:00:00 | 14.3 |
| 2012-11-09 02:00:00 | 26.52 |
| 2012-11-09 03:00:00 | 13 |
| 2012-11-09 04:00:00 | 11.96 |
| 2012-11-09 05:00:00 | 22.36 |
| 2012-11-09 06:00:00 | 15.08 |
| 2012-11-09 07:00:00 | 12.48 |
| 2012-11-09 08:00:00 | 26.26 |
| 2012-11-09 09:00:00 | 15.6 |
| 2012-11-09 10:00:00 | 26.26 |
| 2012-11-09 11:00:00 | 13.52 |
| 2012-11-09 12:00:00 | 26.26 |
| 2012-11-09 13:00:00 | 15.86 |
| 2012-11-09 14:00:00 | 26.52 |
| 2012-11-09 15:00:00 | 14.3 |
| 2012-11-09 16:00:00 | 26.26 |
| 2012-11-09 17:00:00 | 13.52 |
| 2012-11-09 18:00:00 | 26.26 |
| 2012-11-09 19:00:00 | 14.56 |
| 2012-11-09 20:00:00 | 26 |
| 2012-11-09 21:00:00 | 15.08 |
| 2012-11-09 22:00:00 | 26 |
| 2012-11-09 23:00:00 | 14.56 |
| 2012-11-10 | 26 |
| 2012-11-10 01:00:00 | 13.52 |
| 2012-11-10 02:00:00 | 19.76 |
| 2012-11-10 03:00:00 | 17.94 |
| 2012-11-10 04:00:00 | 9.62 |
| 2012-11-10 05:00:00 | 16.9 |
| 2012-11-10 06:00:00 | 18.2 |
| 2012-11-10 07:00:00 | 9.1 |
| 2012-11-10 08:00:00 | 15.86 |
| 2012-11-10 09:00:00 | 20.8 |
| 2012-11-10 10:00:00 | 26.26 |
| 2012-11-10 11:00:00 | 22.88 |
| 2012-11-10 12:00:00 | 22.62 |
| 2012-11-10 13:00:00 | 23.4 |
| 2012-11-10 14:00:00 | 22.88 |
| 2012-11-10 15:00:00 | 21.84 |
| 2012-11-10 16:00:00 | 21.32 |
| 2012-11-10 17:00:00 | 14.3 |
| 2012-11-10 18:00:00 | 25.22 |
| 2012-11-10 19:00:00 | 13.78 |
| 2012-11-10 20:00:00 | 24.96 |
| 2012-11-10 21:00:00 | 14.3 |
| 2012-11-10 22:00:00 | 21.58 |
| 2012-11-10 23:00:00 | 17.94 |
| 2012-11-11 | 11.7 |
| 2012-11-11 01:00:00 | 24.7 |
| 2012-11-11 02:00:00 | 12.22 |
| 2012-11-11 03:00:00 | 9.62 |
| 2012-11-11 04:00:00 | 19.24 |
| 2012-11-11 05:00:00 | 13.78 |
| 2012-11-11 06:00:00 | 6.5 |
| 2012-11-11 07:00:00 | 16.12 |
| 2012-11-11 08:00:00 | 16.9 |
| 2012-11-11 09:00:00 | 9.62 |
| 2012-11-11 10:00:00 | 16.64 |
| 2012-11-11 11:00:00 | 21.84 |
| 2012-11-11 12:00:00 | 24.18 |
| 2012-11-11 13:00:00 | 12.22 |
| 2012-11-11 14:00:00 | 26 |
| 2012-11-11 15:00:00 | 23.14 |
| 2012-11-11 16:00:00 | 11.18 |
| 2012-11-11 17:00:00 | 25.22 |
| 2012-11-11 18:00:00 | 11.7 |
| 2012-11-11 19:00:00 | 18.46 |
| 2012-11-11 20:00:00 | 19.5 |
| 2012-11-11 21:00:00 | 13.52 |
| 2012-11-11 22:00:00 | 26 |
| 2012-11-11 23:00:00 | 13.26 |
| 2012-11-12 | 24.7 |
| 2012-11-12 01:00:00 | 11.44 |
| 2012-11-12 02:00:00 | 9.36 |
| 2012-11-12 03:00:00 | 17.16 |
| 2012-11-12 04:00:00 | 13.26 |
| 2012-11-12 05:00:00 | 4.94 |
| 2012-11-12 06:00:00 | 16.12 |
| 2012-11-12 07:00:00 | 14.3 |
| 2012-11-12 08:00:00 | 8.58 |
| 2012-11-12 09:00:00 | 18.98 |
| 2012-11-12 10:00:00 | 18.72 |
| 2012-11-12 11:00:00 | 38.48 |
| 2012-11-12 12:00:00 | 40.3 |
| 2012-11-12 13:00:00 | 37.18 |
| 2012-11-12 14:00:00 | 20.02 |
| 2012-11-12 15:00:00 | 12.22 |
| 2012-11-12 16:00:00 | 11.44 |
| 2012-11-12 17:00:00 | 11.18 |
| 2012-11-12 18:00:00 | 11.18 |
| 2012-11-12 19:00:00 | 12.74 |
| 2012-11-12 20:00:00 | 10.66 |
| 2012-11-12 21:00:00 | 13.78 |
| 2012-11-12 22:00:00 | 13.52 |
| 2012-11-12 23:00:00 | 12.74 |
| 2012-11-13 | 12.48 |
| 2012-11-13 01:00:00 | 11.18 |
| 2012-11-13 02:00:00 | 10.4 |
| 2012-11-13 03:00:00 | 8.32 |
| 2012-11-13 04:00:00 | 9.36 |
| 2012-11-13 05:00:00 | 9.1 |
| 2012-11-13 06:00:00 | 8.06 |
| 2012-11-13 07:00:00 | 10.4 |
| 2012-11-13 08:00:00 | 10.66 |
| 2012-11-13 09:00:00 | 11.44 |
| 2012-11-13 10:00:00 | 12.22 |
| 2012-11-13 11:00:00 | 12.22 |
| 2012-11-13 12:00:00 | 11.7 |
| 2012-11-13 13:00:00 | 11.18 |
| 2012-11-13 14:00:00 | 11.44 |
| 2012-11-13 15:00:00 | 11.18 |
| 2012-11-13 16:00:00 | 10.92 |
| 2012-11-13 17:00:00 | 11.44 |
| 2012-11-13 18:00:00 | 12.74 |
| 2012-11-13 19:00:00 | 11.96 |
| 2012-11-13 20:00:00 | 12.74 |
| 2012-11-13 21:00:00 | 11.96 |
| 2012-11-13 22:00:00 | 13.26 |
| 2012-11-13 23:00:00 | 13.26 |
| 2012-11-14 | 11.18 |
| 2012-11-14 01:00:00 | 10.92 |
| 2012-11-14 02:00:00 | 10.92 |
| 2012-11-14 03:00:00 | 9.88 |
| 2012-11-14 04:00:00 | 8.84 |
| 2012-11-14 05:00:00 | 9.1 |
| 2012-11-14 06:00:00 | 9.36 |
| 2012-11-14 07:00:00 | 8.06 |
| 2012-11-14 08:00:00 | 10.92 |
| 2012-11-14 09:00:00 | 13.52 |
| 2012-11-14 10:00:00 | 11.18 |
| 2012-11-14 11:00:00 | 13.26 |
| 2012-11-14 12:00:00 | 11.7 |
| 2012-11-14 13:00:00 | 11.18 |
| 2012-11-14 14:00:00 | 11.7 |
| 2012-11-14 15:00:00 | 11.96 |
| 2012-11-14 16:00:00 | 11.44 |
| 2012-11-14 17:00:00 | 11.18 |
| 2012-11-14 18:00:00 | 10.66 |
| 2012-11-14 19:00:00 | 13.52 |
| 2012-11-14 20:00:00 | 11.96 |
| 2012-11-14 21:00:00 | 12.22 |
| 2012-11-14 22:00:00 | 14.3 |
| 2012-11-14 23:00:00 | 13 |
| 2012-11-15 | 11.7 |
| 2012-11-15 01:00:00 | 12.22 |
| 2012-11-15 02:00:00 | 10.14 |
| 2012-11-15 03:00:00 | 8.84 |
| 2012-11-15 04:00:00 | 10.14 |
| 2012-11-15 05:00:00 | 9.36 |
| 2012-11-15 06:00:00 | 8.06 |
| 2012-11-15 07:00:00 | 9.88 |
| 2012-11-15 08:00:00 | 10.92 |
| 2012-11-15 09:00:00 | 12.74 |
| 2012-11-15 10:00:00 | 11.7 |
| 2012-11-15 11:00:00 | 12.22 |
| 2012-11-15 12:00:00 | 11.96 |
| 2012-11-15 13:00:00 | 12.74 |
| 2012-11-15 14:00:00 | 11.96 |
| 2012-11-15 15:00:00 | 11.96 |
| 2012-11-15 16:00:00 | 10.66 |
| 2012-11-15 17:00:00 | 13.26 |
| 2012-11-15 18:00:00 | 11.44 |
| 2012-11-15 19:00:00 | 10.66 |
| 2012-11-15 20:00:00 | 13.78 |
| 2012-11-15 21:00:00 | 12.48 |
| 2012-11-15 22:00:00 | 14.3 |
| 2012-11-15 23:00:00 | 13.26 |
| 2012-11-16 | 12.74 |
| 2012-11-16 01:00:00 | 11.18 |
| 2012-11-16 02:00:00 | 10.92 |
| 2012-11-16 03:00:00 | 10.14 |
| 2012-11-16 04:00:00 | 9.36 |
| 2012-11-16 05:00:00 | 8.06 |
| 2012-11-16 06:00:00 | 8.58 |
| 2012-11-16 07:00:00 | 10.92 |
| 2012-11-16 08:00:00 | 10.92 |
| 2012-11-16 09:00:00 | 11.96 |
| 2012-11-16 10:00:00 | 12.48 |
| 2012-11-16 11:00:00 | 12.74 |
| 2012-11-16 12:00:00 | 12.74 |
| 2012-11-16 13:00:00 | 12.74 |
| 2012-11-16 14:00:00 | 13.52 |
| 2012-11-16 15:00:00 | 12.74 |
| 2012-11-16 16:00:00 | 13 |
| 2012-11-16 17:00:00 | 13 |
| 2012-11-16 18:00:00 | 13.52 |
| 2012-11-16 19:00:00 | 13.52 |
| 2012-11-16 20:00:00 | 13.26 |
| 2012-11-16 21:00:00 | 13.52 |
| 2012-11-16 22:00:00 | 13.78 |
| 2012-11-16 23:00:00 | 13.52 |
| 2012-11-17 | 12.22 |
| 2012-11-17 01:00:00 | 13 |
| 2012-11-17 02:00:00 | 11.44 |
| 2012-11-17 03:00:00 | 10.66 |
| 2012-11-17 04:00:00 | 10.92 |
| 2012-11-17 05:00:00 | 10.4 |
| 2012-11-17 06:00:00 | 9.62 |
| 2012-11-17 07:00:00 | 9.1 |
| 2012-11-17 08:00:00 | 9.88 |
| 2012-11-17 09:00:00 | 12.74 |
| 2012-11-17 10:00:00 | 12.48 |
| 2012-11-17 11:00:00 | 14.3 |
| 2012-11-17 12:00:00 | 15.34 |
| 2012-11-17 13:00:00 | 15.86 |
| 2012-11-17 14:00:00 | 14.3 |
| 2012-11-17 15:00:00 | 13.52 |
| 2012-11-17 16:00:00 | 14.3 |
| 2012-11-17 17:00:00 | 13.52 |
| 2012-11-17 18:00:00 | 13 |
| 2012-11-17 19:00:00 | 13.26 |
| 2012-11-17 20:00:00 | 12.48 |
| 2012-11-17 21:00:00 | 14.04 |
| 2012-11-17 22:00:00 | 12.22 |
| 2012-11-17 23:00:00 | 14.3 |
| 2012-11-18 | 11.96 |
| 2012-11-18 01:00:00 | 12.48 |
| 2012-11-18 02:00:00 | 10.66 |
| 2012-11-18 03:00:00 | 10.14 |
| 2012-11-18 04:00:00 | 10.4 |
| 2012-11-18 05:00:00 | 9.62 |
| 2012-11-18 06:00:00 | 10.4 |
| 2012-11-18 07:00:00 | 9.62 |
| 2012-11-18 08:00:00 | 9.88 |
| 2012-11-18 09:00:00 | 10.66 |
| 2012-11-18 10:00:00 | 11.18 |
| 2012-11-18 11:00:00 | 14.04 |
| 2012-11-18 12:00:00 | 13.52 |
| 2012-11-18 13:00:00 | 14.56 |
| 2012-11-18 14:00:00 | 14.3 |
| 2012-11-18 15:00:00 | 13.52 |
| 2012-11-18 16:00:00 | 13.26 |
| 2012-11-18 17:00:00 | 13 |
| 2012-11-18 18:00:00 | 13 |
| 2012-11-18 19:00:00 | 13.26 |
| 2012-11-18 20:00:00 | 13.52 |
| 2012-11-18 21:00:00 | 13.26 |
| 2012-11-18 22:00:00 | 15.08 |
| 2012-11-18 23:00:00 | 14.82 |
| 2012-11-19 | 13.52 |
| 2012-11-19 01:00:00 | 12.74 |
| 2012-11-19 02:00:00 | 10.66 |
| 2012-11-19 03:00:00 | 10.4 |
| 2012-11-19 04:00:00 | 10.14 |
| 2012-11-19 05:00:00 | 10.66 |
| 2012-11-19 06:00:00 | 10.4 |
| 2012-11-19 07:00:00 | 10.66 |
| 2012-11-19 08:00:00 | 13.26 |
| 2012-11-19 09:00:00 | 13.78 |
| 2012-11-19 10:00:00 | 13.26 |
| 2012-11-19 11:00:00 | 11.96 |
| 2012-11-19 12:00:00 | 14.3 |
| 2012-11-19 13:00:00 | 12.48 |
| 2012-11-19 14:00:00 | 12.48 |
| 2012-11-19 15:00:00 | 12.48 |
| 2012-11-19 16:00:00 | 12.74 |
| 2012-11-19 17:00:00 | 12.74 |
| 2012-11-19 18:00:00 | 12.74 |
| 2012-11-19 19:00:00 | 13 |
| 2012-11-19 20:00:00 | 13.52 |
| 2012-11-19 21:00:00 | 13.52 |
| 2012-11-19 22:00:00 | 13.52 |
| 2012-11-19 23:00:00 | 13.78 |
| 2012-11-20 | 13.52 |
| 2012-11-20 01:00:00 | 12.48 |
| 2012-11-20 02:00:00 | 10.92 |
| 2012-11-20 03:00:00 | 10.66 |
| 2012-11-20 04:00:00 | 10.14 |
| 2012-11-20 05:00:00 | 10.14 |
| 2012-11-20 06:00:00 | 9.88 |
| 2012-11-20 07:00:00 | 11.18 |
| 2012-11-20 08:00:00 | 12.48 |
| 2012-11-20 09:00:00 | 13.26 |
| 2012-11-20 10:00:00 | 11.96 |
| 2012-11-20 11:00:00 | 12.74 |
| 2012-11-20 12:00:00 | 10.66 |
| 2012-11-20 13:00:00 | 6.24 |
| 2012-11-20 14:00:00 | 5.98 |
| 2012-11-20 15:00:00 | 4.16 |
| 2012-11-20 16:00:00 | 8.32 |
| 2012-11-20 17:00:00 | 7.02 |
| 2012-11-20 18:00:00 | 30.42 |
| 2012-11-20 19:00:00 | 23.66 |
| 2012-11-20 20:00:00 | 26.52 |
| 2012-11-20 21:00:00 | 26.78 |
| 2012-11-20 22:00:00 | 26.78 |
| 2012-11-20 23:00:00 | 26.52 |
| 2012-11-21 | 26.78 |
| 2012-11-21 01:00:00 | 25.22 |
| 2012-11-21 02:00:00 | 17.68 |
| 2012-11-21 03:00:00 | 15.86 |
| 2012-11-21 04:00:00 | 14.82 |
| 2012-11-21 05:00:00 | 14.3 |
| 2012-11-21 06:00:00 | 13.78 |
| 2012-11-21 07:00:00 | 14.82 |
| 2012-11-21 08:00:00 | 16.64 |
| 2012-11-21 09:00:00 | 21.06 |
| 2012-11-21 10:00:00 | 19.76 |
| 2012-11-21 11:00:00 | 18.46 |
| 2012-11-21 12:00:00 | 16.64 |
| 2012-11-21 13:00:00 | 16.9 |
| 2012-11-21 14:00:00 | 15.6 |
| 2012-11-21 15:00:00 | 15.08 |
| 2012-11-21 16:00:00 | 14.56 |
| 2012-11-21 17:00:00 | 15.34 |
| 2012-11-21 18:00:00 | 15.34 |
| 2012-11-21 19:00:00 | 16.12 |
| 2012-11-21 20:00:00 | 15.86 |
| 2012-11-21 21:00:00 | 17.16 |
| 2012-11-21 22:00:00 | 18.2 |
| 2012-11-21 23:00:00 | 25.48 |
| 2012-11-22 | 27.56 |
| 2012-11-22 01:00:00 | 27.3 |
| 2012-11-22 02:00:00 | 27.3 |
| 2012-11-22 03:00:00 | 27.3 |
| 2012-11-22 04:00:00 | 27.3 |
| 2012-11-22 05:00:00 | 14.82 |
| 2012-11-22 06:00:00 | 19.24 |
| 2012-11-22 07:00:00 | 8.06 |
| 2012-11-22 08:00:00 | 26.52 |
| 2012-11-22 09:00:00 | 13.78 |
| 2012-11-22 10:00:00 | 26.26 |
| 2012-11-22 11:00:00 | 12.22 |
| 2012-11-22 12:00:00 | 17.42 |
| 2012-11-22 13:00:00 | 19.76 |
| 2012-11-22 14:00:00 | 11.18 |
| 2012-11-22 15:00:00 | 20.54 |
| 2012-11-22 16:00:00 | 16.38 |
| 2012-11-22 17:00:00 | 10.66 |
| 2012-11-22 18:00:00 | 26.52 |
| 2012-11-22 19:00:00 | 10.92 |
| 2012-11-22 20:00:00 | 18.2 |
| 2012-11-22 21:00:00 | 20.02 |
| 2012-11-22 22:00:00 | 13 |
| 2012-11-22 23:00:00 | 26.52 |
| 2012-11-23 | 11.96 |
| 2012-11-23 01:00:00 | 22.1 |
| 2012-11-23 02:00:00 | 13.26 |
| 2012-11-23 03:00:00 | 8.06 |
| 2012-11-23 04:00:00 | 18.2 |
| 2012-11-23 05:00:00 | 10.4 |
| 2012-11-23 06:00:00 | 8.58 |
| 2012-11-23 07:00:00 | 19.5 |
| 2012-11-23 08:00:00 | 11.44 |
| 2012-11-23 09:00:00 | 11.7 |
| 2012-11-23 10:00:00 | 24.7 |
| 2012-11-23 11:00:00 | 14.56 |
| 2012-11-23 12:00:00 | 27.82 |
| 2012-11-23 13:00:00 | 28.86 |
| 2012-11-23 14:00:00 | 28.86 |
| 2012-11-23 15:00:00 | 26.52 |
| 2012-11-23 16:00:00 | 14.56 |
| 2012-11-23 17:00:00 | 14.3 |
| 2012-11-23 18:00:00 | 26.26 |
| 2012-11-23 19:00:00 | 12.22 |
| 2012-11-23 20:00:00 | 17.16 |
| 2012-11-23 21:00:00 | 23.66 |
| 2012-11-23 22:00:00 | 12.74 |
| 2012-11-23 23:00:00 | 21.32 |
| 2012-11-24 | 19.76 |
| 2012-11-24 01:00:00 | 10.66 |
| 2012-11-24 02:00:00 | 17.94 |
| 2012-11-24 03:00:00 | 18.72 |
| 2012-11-24 04:00:00 | 5.98 |
| 2012-11-24 05:00:00 | 15.34 |
| 2012-11-24 06:00:00 | 17.16 |
| 2012-11-24 07:00:00 | 4.94 |
| 2012-11-24 08:00:00 | 16.38 |
| 2012-11-24 09:00:00 | 17.68 |
| 2012-11-24 10:00:00 | 11.18 |
| 2012-11-24 11:00:00 | 21.84 |
| 2012-11-24 12:00:00 | 20.02 |
| 2012-11-24 13:00:00 | 14.3 |
| 2012-11-24 14:00:00 | 27.82 |
| 2012-11-24 15:00:00 | 14.04 |
| 2012-11-24 16:00:00 | 17.68 |
| 2012-11-24 17:00:00 | 23.66 |
| 2012-11-24 18:00:00 | 12.22 |
| 2012-11-24 19:00:00 | 18.2 |
| 2012-11-24 20:00:00 | 21.58 |
| 2012-11-24 21:00:00 | 11.96 |
| 2012-11-24 22:00:00 | 18.98 |
| 2012-11-24 23:00:00 | 21.32 |
| 2012-11-25 | 10.14 |
| 2012-11-25 01:00:00 | 15.86 |
| 2012-11-25 02:00:00 | 20.28 |
| 2012-11-25 03:00:00 | 7.8 |
| 2012-11-25 04:00:00 | 13 |
| 2012-11-25 05:00:00 | 17.16 |
| 2012-11-25 06:00:00 | 4.16 |
| 2012-11-25 07:00:00 | 14.82 |
| 2012-11-25 08:00:00 | 15.86 |
| 2012-11-25 09:00:00 | 5.72 |
| 2012-11-25 10:00:00 | 17.94 |
| 2012-11-25 11:00:00 | 20.8 |
| 2012-11-25 12:00:00 | 13.52 |
| 2012-11-25 13:00:00 | 22.88 |
| 2012-11-25 14:00:00 | 18.98 |
| 2012-11-25 15:00:00 | 13 |
| 2012-11-25 16:00:00 | 23.66 |
| 2012-11-25 17:00:00 | 16.38 |
| 2012-11-25 18:00:00 | 11.44 |
| 2012-11-25 19:00:00 | 21.58 |
| 2012-11-25 20:00:00 | 18.46 |
| 2012-11-25 21:00:00 | 13.78 |
| 2012-11-25 22:00:00 | 22.1 |
| 2012-11-25 23:00:00 | 20.54 |
| 2012-11-26 | 10.66 |
| 2012-11-26 01:00:00 | 17.68 |
| 2012-11-26 02:00:00 | 18.46 |
| 2012-11-26 03:00:00 | 5.46 |
| 2012-11-26 04:00:00 | 13.52 |
| 2012-11-26 05:00:00 | 17.16 |
| 2012-11-26 06:00:00 | 2.08 |
| 2012-11-26 07:00:00 | 16.9 |
| 2012-11-26 08:00:00 | 16.38 |
| 2012-11-26 09:00:00 | 11.7 |
| 2012-11-26 10:00:00 | 16.38 |
| 2012-11-26 11:00:00 | 21.58 |
| 2012-11-26 12:00:00 | 10.92 |
| 2012-11-26 13:00:00 | 18.46 |
| 2012-11-26 14:00:00 | 12.48 |
| 2012-11-26 15:00:00 | 13 |
| 2012-11-26 16:00:00 | 12.22 |
| 2012-11-26 17:00:00 | 12.22 |
| 2012-11-26 18:00:00 | 14.3 |
| 2012-11-26 19:00:00 | 12.48 |
| 2012-11-26 20:00:00 | 13.78 |
| 2012-11-26 21:00:00 | 13.26 |
| 2012-11-26 22:00:00 | 14.04 |
| 2012-11-26 23:00:00 | 13.78 |
| 2012-11-27 | 12.48 |
| 2012-11-27 01:00:00 | 11.7 |
| 2012-11-27 02:00:00 | 11.96 |
| 2012-11-27 03:00:00 | 9.36 |
| 2012-11-27 04:00:00 | 9.88 |
| 2012-11-27 05:00:00 | 10.4 |
| 2012-11-27 06:00:00 | 8.06 |
| 2012-11-27 07:00:00 | 10.66 |
| 2012-11-27 08:00:00 | 11.7 |
| 2012-11-27 09:00:00 | 12.48 |
| 2012-11-27 10:00:00 | 12.74 |
| 2012-11-27 11:00:00 | 11.96 |
| 2012-11-27 12:00:00 | 14.04 |
| 2012-11-27 13:00:00 | 12.22 |
| 2012-11-27 14:00:00 | 11.96 |
| 2012-11-27 15:00:00 | 11.7 |
| 2012-11-27 16:00:00 | 12.22 |
| 2012-11-27 17:00:00 | 11.96 |
| 2012-11-27 18:00:00 | 11.96 |
| 2012-11-27 19:00:00 | 11.7 |
| 2012-11-27 20:00:00 | 14.3 |
| 2012-11-27 21:00:00 | 13 |
| 2012-11-27 22:00:00 | 14.3 |
| 2012-11-27 23:00:00 | 12.48 |
| 2012-11-28 | 14.04 |
| 2012-11-28 01:00:00 | 11.96 |
| 2012-11-28 02:00:00 | 10.14 |
| 2012-11-28 03:00:00 | 10.14 |
| 2012-11-28 04:00:00 | 10.14 |
| 2012-11-28 05:00:00 | 8.58 |
| 2012-11-28 06:00:00 | 10.66 |
| 2012-11-28 07:00:00 | 10.4 |
| 2012-11-28 08:00:00 | 10.4 |
| 2012-11-28 09:00:00 | 13.78 |
| 2012-11-28 10:00:00 | 12.74 |
| 2012-11-28 11:00:00 | 7.28 |
| 2012-11-28 12:00:00 | 6.5 |
| 2012-11-28 13:00:00 | 6.76 |
| 2012-11-28 14:00:00 | 6.5 |
| 2012-11-28 15:00:00 | 7.02 |
| 2012-11-28 16:00:00 | 7.02 |
| 2012-11-28 17:00:00 | 14.82 |
| 2012-11-28 18:00:00 | 13.78 |
| 2012-11-28 19:00:00 | 13.52 |
| 2012-11-28 20:00:00 | 14.04 |
| 2012-11-28 21:00:00 | 13.78 |
| 2012-11-28 22:00:00 | 14.04 |
| 2012-11-28 23:00:00 | 13 |
| 2012-11-29 | 14.56 |
| 2012-11-29 01:00:00 | 12.48 |
| 2012-11-29 02:00:00 | 11.96 |
| 2012-11-29 03:00:00 | 10.4 |
| 2012-11-29 04:00:00 | 8.84 |
| 2012-11-29 05:00:00 | 11.18 |
| 2012-11-29 06:00:00 | 11.18 |
| 2012-11-29 07:00:00 | 10.66 |
| 2012-11-29 08:00:00 | 12.48 |
| 2012-11-29 09:00:00 | 15.34 |
| 2012-11-29 10:00:00 | 37.96 |
| 2012-11-29 11:00:00 | 9.1 |
| 2012-11-29 12:00:00 | 6.5 |
| 2012-11-29 13:00:00 | 21.58 |
| 2012-11-29 14:00:00 | 12.74 |
| 2012-11-29 15:00:00 | 8.84 |
| 2012-11-29 16:00:00 | 17.42 |
| 2012-11-29 17:00:00 | 36.92 |
| 2012-11-29 18:00:00 | 15.86 |
| 2012-11-29 19:00:00 | 14.04 |
| 2012-11-29 20:00:00 | 14.04 |
| 2012-11-29 21:00:00 | 15.6 |
| 2012-11-29 22:00:00 | 15.08 |
| 2012-11-29 23:00:00 | 13.78 |
| 2012-11-30 | 14.82 |
| 2012-11-30 01:00:00 | 13.52 |
| 2012-11-30 02:00:00 | 11.44 |
| 2012-11-30 03:00:00 | 11.7 |
| 2012-11-30 04:00:00 | 11.18 |
| 2012-11-30 05:00:00 | 10.14 |
| 2012-11-30 06:00:00 | 9.88 |
| 2012-11-30 07:00:00 | 12.22 |
| 2012-11-30 08:00:00 | 12.22 |
| 2012-11-30 09:00:00 | 11.96 |
| 2012-11-30 10:00:00 | 15.08 |
| 2012-11-30 11:00:00 | 14.04 |
| 2012-11-30 12:00:00 | 12.48 |
| 2012-11-30 13:00:00 | 12.48 |
| 2012-11-30 14:00:00 | 14.3 |
| 2012-11-30 15:00:00 | 12.48 |
| 2012-11-30 16:00:00 | 12.48 |
| 2012-11-30 17:00:00 | 12.48 |
| 2012-11-30 18:00:00 | 15.34 |
| 2012-11-30 19:00:00 | 16.38 |
| 2012-11-30 20:00:00 | 16.38 |
| 2012-11-30 21:00:00 | 14.82 |
| 2012-11-30 22:00:00 | 14.3 |
| 2012-11-30 23:00:00 | 13.52 |
| 2012-12-01 | 13 |
| 2012-12-01 01:00:00 | 12.48 |
| 2012-12-01 02:00:00 | 11.18 |
| 2012-12-01 03:00:00 | 9.62 |
| 2012-12-01 04:00:00 | 10.4 |
| 2012-12-01 05:00:00 | 10.14 |
| 2012-12-01 06:00:00 | 8.32 |
| 2012-12-01 07:00:00 | 9.1 |
| 2012-12-01 08:00:00 | 10.66 |
| 2012-12-01 09:00:00 | 10.4 |
| 2012-12-01 10:00:00 | 12.22 |
| 2012-12-01 11:00:00 | 13.52 |
| 2012-12-01 12:00:00 | 14.04 |
| 2012-12-01 13:00:00 | 14.82 |
| 2012-12-01 14:00:00 | 13.78 |
| 2012-12-01 15:00:00 | 14.04 |
| 2012-12-01 16:00:00 | 14.3 |
| 2012-12-01 17:00:00 | 12.74 |
| 2012-12-01 18:00:00 | 14.3 |
| 2012-12-01 19:00:00 | 13 |
| 2012-12-01 20:00:00 | 14.04 |
| 2012-12-01 21:00:00 | 13.26 |
| 2012-12-01 22:00:00 | 12.22 |
| 2012-12-01 23:00:00 | 14.82 |
| 2012-12-02 | 12.48 |
| 2012-12-02 01:00:00 | 11.96 |
| 2012-12-02 02:00:00 | 10.92 |
| 2012-12-02 03:00:00 | 10.4 |
| 2012-12-02 04:00:00 | 10.92 |
| 2012-12-02 05:00:00 | 9.62 |
| 2012-12-02 06:00:00 | 8.58 |
| 2012-12-02 07:00:00 | 9.62 |
| 2012-12-02 08:00:00 | 10.4 |
| 2012-12-02 09:00:00 | 9.88 |
| 2012-12-02 10:00:00 | 10.66 |
| 2012-12-02 11:00:00 | 14.3 |
| 2012-12-02 12:00:00 | 14.3 |
| 2012-12-02 13:00:00 | 12.74 |
| 2012-12-02 14:00:00 | 15.6 |
| 2012-12-02 15:00:00 | 12.48 |
| 2012-12-02 16:00:00 | 14.82 |
| 2012-12-02 17:00:00 | 14.3 |
| 2012-12-02 18:00:00 | 13.52 |
| 2012-12-02 19:00:00 | 13.78 |
| 2012-12-02 20:00:00 | 13.78 |
| 2012-12-02 21:00:00 | 13.52 |
| 2012-12-02 22:00:00 | 15.08 |
| 2012-12-02 23:00:00 | 14.82 |
| 2012-12-03 | 13 |
| 2012-12-03 01:00:00 | 12.74 |
| 2012-12-03 02:00:00 | 12.48 |
| 2012-12-03 03:00:00 | 10.14 |
| 2012-12-03 04:00:00 | 11.18 |
| 2012-12-03 05:00:00 | 10.14 |
| 2012-12-03 06:00:00 | 8.58 |
| 2012-12-03 07:00:00 | 9.88 |
| 2012-12-03 08:00:00 | 11.7 |
| 2012-12-03 09:00:00 | 12.74 |
| 2012-12-03 10:00:00 | 12.48 |
| 2012-12-03 11:00:00 | 13.78 |
| 2012-12-03 12:00:00 | 13.26 |
| 2012-12-03 13:00:00 | 14.04 |
| 2012-12-03 14:00:00 | 13 |
| 2012-12-03 15:00:00 | 13.26 |
| 2012-12-03 16:00:00 | 12.74 |
| 2012-12-03 17:00:00 | 12.48 |
| 2012-12-03 18:00:00 | 12.74 |
| 2012-12-03 19:00:00 | 12.22 |
| 2012-12-03 20:00:00 | 13.26 |
| 2012-12-03 21:00:00 | 14.3 |
| 2012-12-03 22:00:00 | 14.3 |
| 2012-12-03 23:00:00 | 14.56 |
| 2012-12-04 | 13.26 |
| 2012-12-04 01:00:00 | 12.48 |
| 2012-12-04 02:00:00 | 12.22 |
| 2012-12-04 03:00:00 | 10.4 |
| 2012-12-04 04:00:00 | 8.84 |
| 2012-12-04 05:00:00 | 8.84 |
| 2012-12-04 06:00:00 | 10.66 |
| 2012-12-04 07:00:00 | 10.92 |
| 2012-12-04 08:00:00 | 11.18 |
| 2012-12-04 09:00:00 | 11.96 |
| 2012-12-04 10:00:00 | 13.78 |
| 2012-12-04 11:00:00 | 13.26 |
| 2012-12-04 12:00:00 | 12.48 |
| 2012-12-04 13:00:00 | 12.48 |
| 2012-12-04 14:00:00 | 13.26 |
| 2012-12-04 15:00:00 | 14.04 |
| 2012-12-04 16:00:00 | 14.82 |
| 2012-12-04 17:00:00 | 14.3 |
| 2012-12-04 18:00:00 | 13.26 |
| 2012-12-04 19:00:00 | 14.04 |
| 2012-12-04 20:00:00 | 13.26 |
| 2012-12-04 21:00:00 | 14.56 |
| 2012-12-04 22:00:00 | 14.56 |
| 2012-12-04 23:00:00 | 14.04 |
| 2012-12-05 | 13.78 |
| 2012-12-05 01:00:00 | 12.48 |
| 2012-12-05 02:00:00 | 11.96 |
| 2012-12-05 03:00:00 | 11.44 |
| 2012-12-05 04:00:00 | 9.88 |
| 2012-12-05 05:00:00 | 9.36 |
| 2012-12-05 06:00:00 | 10.92 |
| 2012-12-05 07:00:00 | 10.92 |
| 2012-12-05 08:00:00 | 11.7 |
| 2012-12-05 09:00:00 | 13 |
| 2012-12-05 10:00:00 | 12.74 |
| 2012-12-05 11:00:00 | 13.78 |
| 2012-12-05 12:00:00 | 16.12 |
| 2012-12-05 13:00:00 | 24.44 |
| 2012-12-05 14:00:00 | 31.2 |
| 2012-12-05 15:00:00 | 36.14 |
| 2012-12-05 16:00:00 | 18.98 |
| 2012-12-05 17:00:00 | 16.12 |
| 2012-12-05 18:00:00 | 14.3 |
| 2012-12-05 19:00:00 | 13 |
| 2012-12-05 20:00:00 | 13 |
| 2012-12-05 21:00:00 | 14.82 |
| 2012-12-05 22:00:00 | 13.26 |
| 2012-12-05 23:00:00 | 14.56 |
| 2012-12-06 | 15.08 |
| 2012-12-06 01:00:00 | 12.48 |
| 2012-12-06 02:00:00 | 11.96 |
| 2012-12-06 03:00:00 | 9.36 |
| 2012-12-06 04:00:00 | 9.36 |
| 2012-12-06 05:00:00 | 10.66 |
| 2012-12-06 06:00:00 | 10.66 |
| 2012-12-06 07:00:00 | 9.1 |
| 2012-12-06 08:00:00 | 10.92 |
| 2012-12-06 09:00:00 | 12.48 |
| 2012-12-06 10:00:00 | 14.82 |
| 2012-12-06 11:00:00 | 12.74 |
| 2012-12-06 12:00:00 | 12.48 |
| 2012-12-06 13:00:00 | 13.26 |
| 2012-12-06 14:00:00 | 15.08 |
| 2012-12-06 15:00:00 | 15.08 |
| 2012-12-06 16:00:00 | 14.56 |
| 2012-12-06 17:00:00 | 14.56 |
| 2012-12-06 18:00:00 | 13 |
| 2012-12-06 19:00:00 | 13.26 |
| 2012-12-06 20:00:00 | 13 |
| 2012-12-06 21:00:00 | 14.56 |
| 2012-12-06 22:00:00 | 14.56 |
| 2012-12-06 23:00:00 | 14.04 |
| 2012-12-07 | 14.3 |
| 2012-12-07 01:00:00 | 12.74 |
| 2012-12-07 02:00:00 | 10.4 |
| 2012-12-07 03:00:00 | 10.4 |
| 2012-12-07 04:00:00 | 10.92 |
| 2012-12-07 05:00:00 | 9.1 |
| 2012-12-07 06:00:00 | 8.84 |
| 2012-12-07 07:00:00 | 9.36 |
| 2012-12-07 08:00:00 | 11.96 |
| 2012-12-07 09:00:00 | 13 |
| 2012-12-07 10:00:00 | 13 |
| 2012-12-07 11:00:00 | 13 |
| 2012-12-07 12:00:00 | 13.78 |
| 2012-12-07 13:00:00 | 13.26 |
| 2012-12-07 14:00:00 | 21.06 |
| 2012-12-07 15:00:00 | 13.26 |
| 2012-12-07 16:00:00 | 14.3 |
| 2012-12-07 17:00:00 | 14.04 |
| 2012-12-07 18:00:00 | 13.26 |
| 2012-12-07 19:00:00 | 13.52 |
| 2012-12-07 20:00:00 | 13.52 |
| 2012-12-07 21:00:00 | 13 |
| 2012-12-07 22:00:00 | 15.34 |
| 2012-12-07 23:00:00 | 13.26 |
| 2012-12-08 | 13.26 |
| 2012-12-08 01:00:00 | 13 |
| 2012-12-08 02:00:00 | 12.48 |
| 2012-12-08 03:00:00 | 10.14 |
| 2012-12-08 04:00:00 | 10.66 |
| 2012-12-08 05:00:00 | 10.92 |
| 2012-12-08 06:00:00 | 10.4 |
| 2012-12-08 07:00:00 | 9.36 |
| 2012-12-08 08:00:00 | 9.62 |
| 2012-12-08 09:00:00 | 11.44 |
| 2012-12-08 10:00:00 | 12.74 |
| 2012-12-08 11:00:00 | 14.3 |
| 2012-12-08 12:00:00 | 14.04 |
| 2012-12-08 13:00:00 | 15.08 |
| 2012-12-08 14:00:00 | 16.38 |
| 2012-12-08 15:00:00 | 15.34 |
| 2012-12-08 16:00:00 | 13.78 |
| 2012-12-08 17:00:00 | 14.3 |
| 2012-12-08 18:00:00 | 13.52 |
| 2012-12-08 19:00:00 | 13.78 |
| 2012-12-08 20:00:00 | 13.52 |
| 2012-12-08 21:00:00 | 13.52 |
| 2012-12-08 22:00:00 | 13 |
| 2012-12-08 23:00:00 | 14.82 |
| 2012-12-09 | 12.74 |
| 2012-12-09 01:00:00 | 12.48 |
| 2012-12-09 02:00:00 | 11.96 |
| 2012-12-09 03:00:00 | 11.96 |
| 2012-12-09 04:00:00 | 10.92 |
| 2012-12-09 05:00:00 | 9.62 |
| 2012-12-09 06:00:00 | 9.36 |
| 2012-12-09 07:00:00 | 10.14 |
| 2012-12-09 08:00:00 | 10.92 |
| 2012-12-09 09:00:00 | 11.18 |
| 2012-12-09 10:00:00 | 11.18 |
| 2012-12-09 11:00:00 | 14.3 |
| 2012-12-09 12:00:00 | 15.34 |
| 2012-12-09 13:00:00 | 14.56 |
| 2012-12-09 14:00:00 | 14.82 |
| 2012-12-09 15:00:00 | 15.34 |
| 2012-12-09 16:00:00 | 12.74 |
| 2012-12-09 17:00:00 | 13.78 |
| 2012-12-09 18:00:00 | 14.3 |
| 2012-12-09 19:00:00 | 13.78 |
| 2012-12-09 20:00:00 | 13.78 |
| 2012-12-09 21:00:00 | 15.08 |
| 2012-12-09 22:00:00 | 15.34 |
| 2012-12-09 23:00:00 | 15.08 |
| 2012-12-10 | 13.52 |
| 2012-12-10 01:00:00 | 13 |
| 2012-12-10 02:00:00 | 11.96 |
| 2012-12-10 03:00:00 | 11.44 |
| 2012-12-10 04:00:00 | 10.4 |
| 2012-12-10 05:00:00 | 9.36 |
| 2012-12-10 06:00:00 | 9.36 |
| 2012-12-10 07:00:00 | 10.66 |
| 2012-12-10 08:00:00 | 11.96 |
| 2012-12-10 09:00:00 | 12.74 |
| 2012-12-10 10:00:00 | 13.26 |
| 2012-12-10 11:00:00 | 13 |
| 2012-12-10 12:00:00 | 13 |
| 2012-12-10 13:00:00 | 13 |
| 2012-12-10 14:00:00 | 12.74 |
| 2012-12-10 15:00:00 | 11.96 |
| 2012-12-10 16:00:00 | 11.96 |
| 2012-12-10 17:00:00 | 11.7 |
| 2012-12-10 18:00:00 | 11.96 |
| 2012-12-10 19:00:00 | 11.7 |
| 2012-12-10 20:00:00 | 13.52 |
| 2012-12-10 21:00:00 | 13.52 |
| 2012-12-10 22:00:00 | 14.04 |
| 2012-12-10 23:00:00 | 13 |
| 2012-12-11 | 13.52 |
| 2012-12-11 01:00:00 | 11.96 |
| 2012-12-11 02:00:00 | 9.88 |
| 2012-12-11 03:00:00 | 9.1 |
| 2012-12-11 04:00:00 | 10.4 |
| 2012-12-11 05:00:00 | 9.36 |
| 2012-12-11 06:00:00 | 9.88 |
| 2012-12-11 07:00:00 | 9.62 |
| 2012-12-11 08:00:00 | 10.14 |
| 2012-12-11 09:00:00 | 13.78 |
| 2012-12-11 10:00:00 | 13.26 |
| 2012-12-11 11:00:00 | 13 |
| 2012-12-11 12:00:00 | 13 |
| 2012-12-11 13:00:00 | 12.22 |
| 2012-12-11 14:00:00 | 12.22 |
| 2012-12-11 15:00:00 | 11.96 |
| 2012-12-11 16:00:00 | 11.96 |
| 2012-12-11 17:00:00 | 12.22 |
| 2012-12-11 18:00:00 | 11.96 |
| 2012-12-11 19:00:00 | 11.96 |
| 2012-12-11 20:00:00 | 12.22 |
| 2012-12-11 21:00:00 | 12.22 |
| 2012-12-11 22:00:00 | 14.56 |
| 2012-12-11 23:00:00 | 14.56 |
| 2012-12-12 | 12.74 |
| 2012-12-12 01:00:00 | 11.96 |
| 2012-12-12 02:00:00 | 10.4 |
| 2012-12-12 03:00:00 | 9.1 |
| 2012-12-12 04:00:00 | 8.58 |
| 2012-12-12 05:00:00 | 9.88 |
| 2012-12-12 06:00:00 | 9.1 |
| 2012-12-12 07:00:00 | 9.62 |
| 2012-12-12 08:00:00 | 9.36 |
| 2012-12-12 09:00:00 | 11.7 |
| 2012-12-12 10:00:00 | 12.48 |
| 2012-12-12 11:00:00 | 12.48 |
| 2012-12-12 12:00:00 | 12.48 |
| 2012-12-12 13:00:00 | 12.48 |
| 2012-12-12 14:00:00 | 13 |
| 2012-12-12 15:00:00 | 12.48 |
| 2012-12-12 16:00:00 | 12.22 |
| 2012-12-12 17:00:00 | 12.74 |
| 2012-12-12 18:00:00 | 12.22 |
| 2012-12-12 19:00:00 | 12.22 |
| 2012-12-12 20:00:00 | 12.48 |
| 2012-12-12 21:00:00 | 12.74 |
| 2012-12-12 22:00:00 | 14.3 |
| 2012-12-12 23:00:00 | 13.78 |
| 2012-12-13 | 12.74 |
| 2012-12-13 01:00:00 | 11.96 |
| 2012-12-13 02:00:00 | 12.22 |
| 2012-12-13 03:00:00 | 11.18 |
| 2012-12-13 04:00:00 | 9.1 |
| 2012-12-13 05:00:00 | 9.1 |
| 2012-12-13 06:00:00 | 9.1 |
| 2012-12-13 07:00:00 | 10.66 |
| 2012-12-13 08:00:00 | 10.66 |
| 2012-12-13 09:00:00 | 11.44 |
| 2012-12-13 10:00:00 | 12.48 |
| 2012-12-13 11:00:00 | 14.04 |
| 2012-12-13 12:00:00 | 11.7 |
| 2012-12-13 13:00:00 | 11.44 |
| 2012-12-13 14:00:00 | 11.96 |
| 2012-12-13 15:00:00 | 13 |
| 2012-12-13 16:00:00 | 12.22 |
| 2012-12-13 17:00:00 | 12.22 |
| 2012-12-13 18:00:00 | 13 |
| 2012-12-13 19:00:00 | 12.48 |
| 2012-12-13 20:00:00 | 12.48 |
| 2012-12-13 21:00:00 | 13.26 |
| 2012-12-13 22:00:00 | 13 |
| 2012-12-13 23:00:00 | 15.08 |
| 2012-12-14 | 12.74 |
| 2012-12-14 01:00:00 | 11.96 |
| 2012-12-14 02:00:00 | 10.14 |
| 2012-12-14 03:00:00 | 10.4 |
| 2012-12-14 04:00:00 | 10.92 |
| 2012-12-14 05:00:00 | 8.58 |
| 2012-12-14 06:00:00 | 8.58 |
| 2012-12-14 07:00:00 | 8.84 |
| 2012-12-14 08:00:00 | 11.18 |
| 2012-12-14 09:00:00 | 11.96 |
| 2012-12-14 10:00:00 | 11.96 |
| 2012-12-14 11:00:00 | 11.7 |
| 2012-12-14 12:00:00 | 11.18 |
| 2012-12-14 13:00:00 | 12.74 |
| 2012-12-14 14:00:00 | 12.22 |
| 2012-12-14 15:00:00 | 12.74 |
| 2012-12-14 16:00:00 | 12.74 |
| 2012-12-14 17:00:00 | 12.74 |
| 2012-12-14 18:00:00 | 12.74 |
| 2012-12-14 19:00:00 | 12.74 |
| 2012-12-14 20:00:00 | 11.96 |
| 2012-12-14 21:00:00 | 13 |
| 2012-12-14 22:00:00 | 12.74 |
| 2012-12-14 23:00:00 | 13.52 |
| 2012-12-15 | 11.96 |
| 2012-12-15 01:00:00 | 10.66 |
| 2012-12-15 02:00:00 | 12.48 |
| 2012-12-15 03:00:00 | 12.22 |
| 2012-12-15 04:00:00 | 13.52 |
| 2012-12-15 05:00:00 | 18.46 |
| 2012-12-15 06:00:00 | 30.42 |
| 2012-12-15 07:00:00 | 40.56 |
| 2012-12-15 08:00:00 | 41.08 |
| 2012-12-15 09:00:00 | 41.08 |
| 2012-12-15 10:00:00 | 41.08 |
| 2012-12-15 11:00:00 | 41.08 |
| 2012-12-15 12:00:00 | 41.08 |
| 2012-12-15 13:00:00 | 40.82 |
| 2012-12-15 14:00:00 | 41.34 |
| 2012-12-15 15:00:00 | 41.6 |
| 2012-12-15 16:00:00 | 41.86 |
| 2012-12-15 17:00:00 | 41.86 |
| 2012-12-15 18:00:00 | 41.86 |
| 2012-12-15 19:00:00 | 41.86 |
| 2012-12-15 20:00:00 | 41.86 |
| 2012-12-15 21:00:00 | 42.12 |
| 2012-12-15 22:00:00 | 41.86 |
| 2012-12-15 23:00:00 | 42.12 |
| 2012-12-16 | 41.86 |
| 2012-12-16 01:00:00 | 42.12 |
| 2012-12-16 02:00:00 | 41.86 |
| 2012-12-16 03:00:00 | 42.12 |
| 2012-12-16 04:00:00 | 42.12 |
| 2012-12-16 05:00:00 | 41.86 |
| 2012-12-16 06:00:00 | 41.6 |
| 2012-12-16 07:00:00 | 41.6 |
| 2012-12-16 08:00:00 | 42.12 |
| 2012-12-16 09:00:00 | 41.6 |
| 2012-12-16 10:00:00 | 20.8 |
| 2012-12-16 11:00:00 | 28.08 |
| 2012-12-16 12:00:00 | 16.38 |
| 2012-12-16 13:00:00 | 28.6 |
| 2012-12-16 14:00:00 | 17.94 |
| 2012-12-16 15:00:00 | 28.86 |
| 2012-12-16 16:00:00 | 28.86 |
| 2012-12-16 17:00:00 | 28.6 |
| 2012-12-16 18:00:00 | 28.86 |
| 2012-12-16 19:00:00 | 28.6 |
| 2012-12-16 20:00:00 | 26.78 |
| 2012-12-16 21:00:00 | 26.78 |
| 2012-12-16 22:00:00 | 27.82 |
| 2012-12-16 23:00:00 | 27.04 |
| 2012-12-17 | 17.42 |
| 2012-12-17 01:00:00 | 28.86 |
| 2012-12-17 02:00:00 | 15.6 |
| 2012-12-17 03:00:00 | 19.76 |
| 2012-12-17 04:00:00 | 23.4 |
| 2012-12-17 05:00:00 | 13.52 |
| 2012-12-17 06:00:00 | 16.38 |
| 2012-12-17 07:00:00 | 25.22 |
| 2012-12-17 08:00:00 | 15.08 |
| 2012-12-17 09:00:00 | 25.48 |
| 2012-12-17 10:00:00 | 20.54 |
| 2012-12-17 11:00:00 | 27.3 |
| 2012-12-17 12:00:00 | 14.56 |
| 2012-12-17 13:00:00 | 15.08 |
| 2012-12-17 14:00:00 | 14.82 |
| 2012-12-17 15:00:00 | 14.3 |
| 2012-12-17 16:00:00 | 14.56 |
| 2012-12-17 17:00:00 | 14.04 |
| 2012-12-17 18:00:00 | 14.56 |
| 2012-12-17 19:00:00 | 15.08 |
| 2012-12-17 20:00:00 | 14.82 |
| 2012-12-17 21:00:00 | 15.86 |
| 2012-12-17 22:00:00 | 18.2 |
| 2012-12-17 23:00:00 | 16.64 |
| 2012-12-18 | 15.08 |
| 2012-12-18 01:00:00 | 14.04 |
| 2012-12-18 02:00:00 | 13.52 |
| 2012-12-18 03:00:00 | 12.22 |
| 2012-12-18 04:00:00 | 12.48 |
| 2012-12-18 05:00:00 | 11.18 |
| 2012-12-18 06:00:00 | 11.18 |
| 2012-12-18 07:00:00 | 13.26 |
| 2012-12-18 08:00:00 | 12.22 |
| 2012-12-18 09:00:00 | 15.6 |
| 2012-12-18 10:00:00 | 14.82 |
| 2012-12-18 11:00:00 | 13.78 |
| 2012-12-18 12:00:00 | 14.04 |
| 2012-12-18 13:00:00 | 15.08 |
| 2012-12-18 14:00:00 | 14.04 |
| 2012-12-18 15:00:00 | 14.04 |
| 2012-12-18 16:00:00 | 18.98 |
| 2012-12-18 17:00:00 | 14.3 |
| 2012-12-18 18:00:00 | 14.3 |
| 2012-12-18 19:00:00 | 13.52 |
| 2012-12-18 20:00:00 | 15.86 |
| 2012-12-18 21:00:00 | 14.82 |
| 2012-12-18 22:00:00 | 14.82 |
| 2012-12-18 23:00:00 | 15.08 |
| 2012-12-19 | 14.82 |
| 2012-12-19 01:00:00 | 14.04 |
| 2012-12-19 02:00:00 | 13 |
| 2012-12-19 03:00:00 | 12.22 |
| 2012-12-19 04:00:00 | 11.96 |
| 2012-12-19 05:00:00 | 9.88 |
| 2012-12-19 06:00:00 | 12.48 |
| 2012-12-19 07:00:00 | 12.48 |
| 2012-12-19 08:00:00 | 13.26 |
| 2012-12-19 09:00:00 | 14.56 |
| 2012-12-19 10:00:00 | 14.82 |
| 2012-12-19 11:00:00 | 15.08 |
| 2012-12-19 12:00:00 | 15.86 |
| 2012-12-19 13:00:00 | 15.86 |
| 2012-12-19 14:00:00 | 15.34 |
| 2012-12-19 15:00:00 | 15.86 |
| 2012-12-19 16:00:00 | 19.76 |
| 2012-12-19 17:00:00 | 22.36 |
| 2012-12-19 18:00:00 | 21.06 |
| 2012-12-19 19:00:00 | 17.16 |
| 2012-12-19 20:00:00 | 15.08 |
| 2012-12-19 21:00:00 | 15.08 |
| 2012-12-19 22:00:00 | 14.82 |
| 2012-12-19 23:00:00 | 15.08 |
| 2012-12-20 | 14.56 |
| 2012-12-20 01:00:00 | 13 |
| 2012-12-20 02:00:00 | 14.3 |
| 2012-12-20 03:00:00 | 12.22 |
| 2012-12-20 04:00:00 | 12.22 |
| 2012-12-20 05:00:00 | 10.4 |
| 2012-12-20 06:00:00 | 11.7 |
| 2012-12-20 07:00:00 | 12.48 |
| 2012-12-20 08:00:00 | 13.26 |
| 2012-12-20 09:00:00 | 14.3 |
| 2012-12-20 10:00:00 | 15.86 |
| 2012-12-20 11:00:00 | 16.12 |
| 2012-12-20 12:00:00 | 15.6 |
| 2012-12-20 13:00:00 | 15.6 |
| 2012-12-20 14:00:00 | 15.86 |
| 2012-12-20 15:00:00 | 15.34 |
| 2012-12-20 16:00:00 | 14.82 |
| 2012-12-20 17:00:00 | 14.82 |
| 2012-12-20 18:00:00 | 14.82 |
| 2012-12-20 19:00:00 | 13 |
| 2012-12-20 20:00:00 | 14.04 |
| 2012-12-20 21:00:00 | 14.82 |
| 2012-12-20 22:00:00 | 14.56 |
| 2012-12-20 23:00:00 | 14.04 |
| 2012-12-21 | 13.26 |
| 2012-12-21 01:00:00 | 14.04 |
| 2012-12-21 02:00:00 | 12.74 |
| 2012-12-21 03:00:00 | 9.62 |
| 2012-12-21 04:00:00 | 11.96 |
| 2012-12-21 05:00:00 | 9.1 |
| 2012-12-21 06:00:00 | 11.18 |
| 2012-12-21 07:00:00 | 9.36 |
| 2012-12-21 08:00:00 | 11.44 |
| 2012-12-21 09:00:00 | 12.74 |
| 2012-12-21 10:00:00 | 12.74 |
| 2012-12-21 11:00:00 | 14.3 |
| 2012-12-21 12:00:00 | 14.3 |
| 2012-12-21 13:00:00 | 13.26 |
| 2012-12-21 14:00:00 | 12.22 |
| 2012-12-21 15:00:00 | 13.52 |
| 2012-12-21 16:00:00 | 13.26 |
| 2012-12-21 17:00:00 | 14.04 |
| 2012-12-21 18:00:00 | 13.52 |
| 2012-12-21 19:00:00 | 13.52 |
| 2012-12-21 20:00:00 | 13.78 |
| 2012-12-21 21:00:00 | 14.04 |
| 2012-12-21 22:00:00 | 14.56 |
| 2012-12-21 23:00:00 | 13 |
| 2012-12-22 | 12.22 |
| 2012-12-22 01:00:00 | 13 |
| 2012-12-22 02:00:00 | 12.48 |
| 2012-12-22 03:00:00 | 9.62 |
| 2012-12-22 04:00:00 | 11.7 |
| 2012-12-22 05:00:00 | 8.84 |
| 2012-12-22 06:00:00 | 10.14 |
| 2012-12-22 07:00:00 | 9.62 |
| 2012-12-22 08:00:00 | 8.84 |
| 2012-12-22 09:00:00 | 11.96 |
| 2012-12-22 10:00:00 | 11.18 |
| 2012-12-22 11:00:00 | 14.3 |
| 2012-12-22 12:00:00 | 14.3 |
| 2012-12-22 13:00:00 | 13.78 |
| 2012-12-22 14:00:00 | 15.08 |
| 2012-12-22 15:00:00 | 13.78 |
| 2012-12-22 16:00:00 | 15.08 |
| 2012-12-22 17:00:00 | 13.52 |
| 2012-12-22 18:00:00 | 13.78 |
| 2012-12-22 19:00:00 | 13.26 |
| 2012-12-22 20:00:00 | 15.08 |
| 2012-12-22 21:00:00 | 14.04 |
| 2012-12-22 22:00:00 | 14.04 |
| 2012-12-22 23:00:00 | 13.26 |
| 2012-12-23 | 13.26 |
| 2012-12-23 01:00:00 | 12.74 |
| 2012-12-23 02:00:00 | 12.48 |
| 2012-12-23 03:00:00 | 10.4 |
| 2012-12-23 04:00:00 | 11.18 |
| 2012-12-23 05:00:00 | 10.14 |
| 2012-12-23 06:00:00 | 8.58 |
| 2012-12-23 07:00:00 | 10.4 |
| 2012-12-23 08:00:00 | 9.36 |
| 2012-12-23 09:00:00 | 10.14 |
| 2012-12-23 10:00:00 | 12.74 |
| 2012-12-23 11:00:00 | 13.52 |
| 2012-12-23 12:00:00 | 15.34 |
| 2012-12-23 13:00:00 | 15.34 |
| 2012-12-23 14:00:00 | 16.12 |
| 2012-12-23 15:00:00 | 16.38 |
| 2012-12-23 16:00:00 | 14.56 |
| 2012-12-23 17:00:00 | 15.08 |
| 2012-12-23 18:00:00 | 14.56 |
| 2012-12-23 19:00:00 | 14.04 |
| 2012-12-23 20:00:00 | 15.34 |
| 2012-12-23 21:00:00 | 15.6 |
| 2012-12-23 22:00:00 | 18.46 |
| 2012-12-23 23:00:00 | 31.46 |
| 2012-12-24 | 39.52 |
| 2012-12-24 01:00:00 | 37.44 |
| 2012-12-24 02:00:00 | 42.38 |
| 2012-12-24 03:00:00 | 42.64 |
| 2012-12-24 04:00:00 | 42.9 |
| 2012-12-24 05:00:00 | 43.42 |
| 2012-12-24 06:00:00 | 43.16 |
| 2012-12-24 07:00:00 | 42.9 |
| 2012-12-24 08:00:00 | 43.16 |
| 2012-12-24 09:00:00 | 43.16 |
| 2012-12-24 10:00:00 | 43.16 |
| 2012-12-24 11:00:00 | 43.16 |
| 2012-12-24 12:00:00 | 43.16 |
| 2012-12-24 13:00:00 | 43.42 |
| 2012-12-24 14:00:00 | 43.16 |
| 2012-12-24 15:00:00 | 42.9 |
| 2012-12-24 16:00:00 | 42.9 |
| 2012-12-24 17:00:00 | 42.64 |
| 2012-12-24 18:00:00 | 42.38 |
| 2012-12-24 19:00:00 | 42.12 |
| 2012-12-24 20:00:00 | 42.38 |
| 2012-12-24 21:00:00 | 42.38 |
| 2012-12-24 22:00:00 | 42.38 |
| 2012-12-24 23:00:00 | 42.12 |
| 2012-12-25 | 42.12 |
| 2012-12-25 01:00:00 | 42.38 |
| 2012-12-25 02:00:00 | 24.18 |
| 2012-12-25 03:00:00 | 24.7 |
| 2012-12-25 04:00:00 | 11.96 |
| 2012-12-25 05:00:00 | 12.74 |
| 2012-12-25 06:00:00 | 20.8 |
| 2012-12-25 07:00:00 | 14.3 |
| 2012-12-25 08:00:00 | 9.36 |
| 2012-12-25 09:00:00 | 20.54 |
| 2012-12-25 10:00:00 | 19.76 |
| 2012-12-25 11:00:00 | 24.44 |
| 2012-12-25 12:00:00 | 18.98 |
| 2012-12-25 13:00:00 | 27.3 |
| 2012-12-25 14:00:00 | 23.92 |
| 2012-12-25 15:00:00 | 15.86 |
| 2012-12-25 16:00:00 | 16.9 |
| 2012-12-25 17:00:00 | 26.26 |
| 2012-12-25 18:00:00 | 13.52 |
| 2012-12-25 19:00:00 | 17.94 |
| 2012-12-25 20:00:00 | 24.96 |
| 2012-12-25 21:00:00 | 14.3 |
| 2012-12-25 22:00:00 | 24.96 |
| 2012-12-25 23:00:00 | 17.68 |
| 2012-12-26 | 13.78 |
| 2012-12-26 01:00:00 | 27.3 |
| 2012-12-26 02:00:00 | 13.52 |
| 2012-12-26 03:00:00 | 11.96 |
| 2012-12-26 04:00:00 | 21.32 |
| 2012-12-26 05:00:00 | 14.56 |
| 2012-12-26 06:00:00 | 8.06 |
| 2012-12-26 07:00:00 | 19.5 |
| 2012-12-26 08:00:00 | 17.16 |
| 2012-12-26 09:00:00 | 9.62 |
| 2012-12-26 10:00:00 | 19.76 |
| 2012-12-26 11:00:00 | 21.84 |
| 2012-12-26 12:00:00 | 26.26 |
| 2012-12-26 13:00:00 | 23.66 |
| 2012-12-26 14:00:00 | 23.92 |
| 2012-12-26 15:00:00 | 14.3 |
| 2012-12-26 16:00:00 | 22.88 |
| 2012-12-26 17:00:00 | 18.98 |
| 2012-12-26 18:00:00 | 13.26 |
| 2012-12-26 19:00:00 | 21.84 |
| 2012-12-26 20:00:00 | 19.24 |
| 2012-12-26 21:00:00 | 14.56 |
| 2012-12-26 22:00:00 | 27.3 |
| 2012-12-26 23:00:00 | 15.6 |
| 2012-12-27 | 16.9 |
| 2012-12-27 01:00:00 | 25.22 |
| 2012-12-27 02:00:00 | 12.22 |
| 2012-12-27 03:00:00 | 11.7 |
| 2012-12-27 04:00:00 | 19.76 |
| 2012-12-27 05:00:00 | 14.04 |
| 2012-12-27 06:00:00 | 9.1 |
| 2012-12-27 07:00:00 | 17.42 |
| 2012-12-27 08:00:00 | 19.24 |
| 2012-12-27 09:00:00 | 10.66 |
| 2012-12-27 10:00:00 | 17.94 |
| 2012-12-27 11:00:00 | 24.18 |
| 2012-12-27 12:00:00 | 27.04 |
| 2012-12-27 13:00:00 | 27.82 |
| 2012-12-27 14:00:00 | 26.26 |
| 2012-12-27 15:00:00 | 21.84 |
| 2012-12-27 16:00:00 | 20.02 |
| 2012-12-27 17:00:00 | 37.18 |
| 2012-12-27 18:00:00 | 41.86 |
| 2012-12-27 19:00:00 | 41.6 |
| 2012-12-27 20:00:00 | 41.86 |
| 2012-12-27 21:00:00 | 42.38 |
| 2012-12-27 22:00:00 | 43.16 |
| 2012-12-27 23:00:00 | 43.16 |
| 2012-12-28 | 43.42 |
| 2012-12-28 01:00:00 | 43.16 |
| 2012-12-28 02:00:00 | 43.42 |
| 2012-12-28 03:00:00 | 43.42 |
| 2012-12-28 04:00:00 | 43.16 |
| 2012-12-28 05:00:00 | 43.42 |
| 2012-12-28 06:00:00 | 43.16 |
| 2012-12-28 07:00:00 | 43.16 |
| 2012-12-28 08:00:00 | 43.68 |
| 2012-12-28 09:00:00 | 43.42 |
| 2012-12-28 10:00:00 | 44.2 |
| 2012-12-28 11:00:00 | 43.94 |
| 2012-12-28 12:00:00 | 43.94 |
| 2012-12-28 13:00:00 | 43.94 |
| 2012-12-28 14:00:00 | 43.94 |
| 2012-12-28 15:00:00 | 43.94 |
| 2012-12-28 16:00:00 | 43.68 |
| 2012-12-28 17:00:00 | 43.68 |
| 2012-12-28 18:00:00 | 43.16 |
| 2012-12-28 19:00:00 | 43.16 |
| 2012-12-28 20:00:00 | 43.16 |
| 2012-12-28 21:00:00 | 43.42 |
| 2012-12-28 22:00:00 | 43.16 |
| 2012-12-28 23:00:00 | 43.16 |
| 2012-12-29 | 42.64 |
| 2012-12-29 01:00:00 | 42.38 |
| 2012-12-29 02:00:00 | 42.38 |
| 2012-12-29 03:00:00 | 42.38 |
| 2012-12-29 04:00:00 | 42.12 |
| 2012-12-29 05:00:00 | 42.12 |
| 2012-12-29 06:00:00 | 36.66 |
| 2012-12-29 07:00:00 | 20.54 |
| 2012-12-29 08:00:00 | 16.9 |
| 2012-12-29 09:00:00 | 29.38 |
| 2012-12-29 10:00:00 | 18.98 |
| 2012-12-29 11:00:00 | 29.38 |
| 2012-12-29 12:00:00 | 29.38 |
| 2012-12-29 13:00:00 | 29.64 |
| 2012-12-29 14:00:00 | 29.38 |
| 2012-12-29 15:00:00 | 27.04 |
| 2012-12-29 16:00:00 | 22.36 |
| 2012-12-29 17:00:00 | 29.38 |
| 2012-12-29 18:00:00 | 21.06 |
| 2012-12-29 19:00:00 | 27.56 |
| 2012-12-29 20:00:00 | 27.56 |
| 2012-12-29 21:00:00 | 20.8 |
| 2012-12-29 22:00:00 | 29.64 |
| 2012-12-29 23:00:00 | 19.24 |
| 2012-12-30 | 29.38 |
| 2012-12-30 01:00:00 | 18.46 |
| 2012-12-30 02:00:00 | 29.38 |
| 2012-12-30 03:00:00 | 16.64 |
| 2012-12-30 04:00:00 | 16.64 |
| 2012-12-30 05:00:00 | 26 |
| 2012-12-30 06:00:00 | 17.68 |
| 2012-12-30 07:00:00 | 15.08 |
| 2012-12-30 08:00:00 | 19.76 |
| 2012-12-30 09:00:00 | 25.22 |
| 2012-12-30 10:00:00 | 17.16 |
| 2012-12-30 11:00:00 | 29.38 |
| 2012-12-30 12:00:00 | 19.24 |
| 2012-12-30 13:00:00 | 29.38 |
| 2012-12-30 14:00:00 | 19.24 |
| 2012-12-30 15:00:00 | 29.38 |
| 2012-12-30 16:00:00 | 18.46 |
| 2012-12-30 17:00:00 | 29.38 |
| 2012-12-30 18:00:00 | 17.42 |
| 2012-12-30 19:00:00 | 28.86 |
| 2012-12-30 20:00:00 | 18.46 |
| 2012-12-30 21:00:00 | 23.66 |
| 2012-12-30 22:00:00 | 24.18 |
| 2012-12-30 23:00:00 | 18.2 |
| 2012-12-31 | 28.86 |
| 2012-12-31 | 16.64 |
| 2012-12-31 | 18.72 |
| 2012-12-31 | 24.44 |
| 2012-12-31 | 15.08 |
| 2012-12-31 | 13 |
| 2012-12-31 | 19.5 |
| 2012-12-31 | 22.1 |
| 2012-12-31 | 14.04 |
| 2012-12-31 | 14.3 |
| 2012-12-31 | 24.18 |
| 2012-12-31 | 19.76 |
| 2012-12-31 | 16.38 |
| 2012-12-31 | 20.28 |
| 2012-12-31 | 24.44 |
| 2012-12-31 | 14.82 |
| 2012-12-31 | 14.56 |
| 2012-12-31 | 24.18 |
| 2012-12-31 | 18.2 |
| 2012-12-31 | 13.78 |
| 2012-12-31 | 17.42 |
| 2012-12-31 | 23.4 |
| 2012-12-31 | 15.08 |
| 2012-12-31 | 11.96 |
| 2013-01-01 | 17.42 |